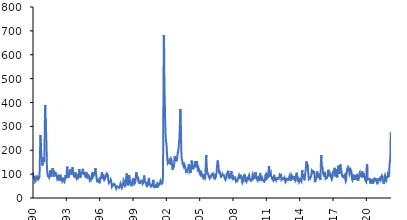
| Category | Índice |
|---|---|
| 1990-01-01 | 108.888 |
| 1990-01-02 | 107.41 |
| 1990-01-03 | 104.913 |
| 1990-01-04 | 101.838 |
| 1990-01-05 | 100.555 |
| 1990-01-06 | 100.528 |
| 1990-01-07 | 98.655 |
| 1990-01-08 | 98.989 |
| 1990-01-09 | 100.439 |
| 1990-01-10 | 100.368 |
| 1990-01-11 | 98.759 |
| 1990-01-12 | 98.669 |
| 1990-01-13 | 97.061 |
| 1990-01-14 | 95.389 |
| 1990-01-15 | 94.045 |
| 1990-01-16 | 92.8 |
| 1990-01-17 | 93.206 |
| 1990-01-18 | 90.599 |
| 1990-01-19 | 89.236 |
| 1990-01-20 | 86.482 |
| 1990-01-21 | 85.16 |
| 1990-01-22 | 84.007 |
| 1990-01-23 | 84.643 |
| 1990-01-24 | 83.991 |
| 1990-01-25 | 84.277 |
| 1990-01-26 | 84.188 |
| 1990-01-27 | 84.197 |
| 1990-01-28 | 82.541 |
| 1990-01-29 | 81.961 |
| 1990-01-30 | 82.99 |
| 1990-01-31 | 83.37 |
| 1990-02-01 | 83.561 |
| 1990-02-02 | 84.544 |
| 1990-02-03 | 86.52 |
| 1990-02-04 | 86.381 |
| 1990-02-05 | 87.983 |
| 1990-02-06 | 91.495 |
| 1990-02-07 | 91.184 |
| 1990-02-08 | 89.132 |
| 1990-02-09 | 88.004 |
| 1990-02-10 | 88.749 |
| 1990-02-11 | 88.25 |
| 1990-02-12 | 89.704 |
| 1990-02-13 | 89.977 |
| 1990-02-14 | 88.712 |
| 1990-02-15 | 88.406 |
| 1990-02-16 | 87.166 |
| 1990-02-17 | 87.312 |
| 1990-02-18 | 86.625 |
| 1990-02-19 | 87.193 |
| 1990-02-20 | 86.603 |
| 1990-02-21 | 86.388 |
| 1990-02-22 | 84.271 |
| 1990-02-23 | 83.254 |
| 1990-02-24 | 82.737 |
| 1990-02-25 | 81.87 |
| 1990-02-26 | 81.005 |
| 1990-02-27 | 83.451 |
| 1990-02-28 | 82.212 |
| 1990-03-01 | 81.337 |
| 1990-03-02 | 79.881 |
| 1990-03-03 | 78.446 |
| 1990-03-04 | 76.539 |
| 1990-03-05 | 75.167 |
| 1990-03-06 | 75.443 |
| 1990-03-07 | 74.192 |
| 1990-03-08 | 71.445 |
| 1990-03-09 | 70.327 |
| 1990-03-10 | 71.295 |
| 1990-03-11 | 70.455 |
| 1990-03-12 | 68.815 |
| 1990-03-13 | 69.386 |
| 1990-03-14 | 68.702 |
| 1990-03-15 | 67.928 |
| 1990-03-16 | 68.188 |
| 1990-03-17 | 68.685 |
| 1990-03-18 | 68.941 |
| 1990-03-19 | 68.688 |
| 1990-03-20 | 68.804 |
| 1990-03-21 | 67.771 |
| 1990-03-22 | 68.325 |
| 1990-03-23 | 67.422 |
| 1990-03-24 | 67.949 |
| 1990-03-25 | 68.957 |
| 1990-03-26 | 69.097 |
| 1990-03-27 | 69.89 |
| 1990-03-28 | 70.682 |
| 1990-03-29 | 69.19 |
| 1990-03-30 | 68.958 |
| 1990-03-31 | 70.704 |
| 1990-04-01 | 70.158 |
| 1990-04-02 | 73.422 |
| 1990-04-03 | 75.191 |
| 1990-04-04 | 75.59 |
| 1990-04-05 | 75.518 |
| 1990-04-06 | 76.008 |
| 1990-04-07 | 75.975 |
| 1990-04-08 | 75.326 |
| 1990-04-09 | 74.881 |
| 1990-04-10 | 76.383 |
| 1990-04-11 | 78.055 |
| 1990-04-12 | 78.141 |
| 1990-04-13 | 77.781 |
| 1990-04-14 | 79.164 |
| 1990-04-15 | 78.725 |
| 1990-04-16 | 78.929 |
| 1990-04-17 | 79.578 |
| 1990-04-18 | 80.737 |
| 1990-04-19 | 80.804 |
| 1990-04-20 | 82.924 |
| 1990-04-21 | 83.57 |
| 1990-04-22 | 85.28 |
| 1990-04-23 | 87.052 |
| 1990-04-24 | 87.251 |
| 1990-04-25 | 87.436 |
| 1990-04-26 | 88.024 |
| 1990-04-27 | 87.672 |
| 1990-04-28 | 87.759 |
| 1990-04-29 | 86.872 |
| 1990-04-30 | 84.691 |
| 1990-05-01 | 86.428 |
| 1990-05-02 | 87.079 |
| 1990-05-03 | 86.471 |
| 1990-05-04 | 86.835 |
| 1990-05-05 | 88.836 |
| 1990-05-06 | 87.506 |
| 1990-05-07 | 87.706 |
| 1990-05-08 | 88.491 |
| 1990-05-09 | 88.167 |
| 1990-05-10 | 87.384 |
| 1990-05-11 | 86.09 |
| 1990-05-12 | 84.584 |
| 1990-05-13 | 84.657 |
| 1990-05-14 | 84.476 |
| 1990-05-15 | 85.028 |
| 1990-05-16 | 85.713 |
| 1990-05-17 | 85.847 |
| 1990-05-18 | 84.95 |
| 1990-05-19 | 84.734 |
| 1990-05-20 | 82.827 |
| 1990-05-21 | 83.704 |
| 1990-05-22 | 83.857 |
| 1990-05-23 | 82.49 |
| 1990-05-24 | 83.213 |
| 1990-05-25 | 83.811 |
| 1990-05-26 | 83.866 |
| 1990-05-27 | 83.852 |
| 1990-05-28 | 85.695 |
| 1990-05-29 | 88.988 |
| 1990-05-30 | 90.612 |
| 1990-05-31 | 90.288 |
| 1990-06-01 | 88.062 |
| 1990-06-02 | 88.599 |
| 1990-06-03 | 88.045 |
| 1990-06-04 | 88.156 |
| 1990-06-05 | 89.708 |
| 1990-06-06 | 90.555 |
| 1990-06-07 | 91.1 |
| 1990-06-08 | 91.674 |
| 1990-06-09 | 92.383 |
| 1990-06-10 | 92.216 |
| 1990-06-11 | 92.507 |
| 1990-06-12 | 91.941 |
| 1990-06-13 | 91.258 |
| 1990-06-14 | 91.162 |
| 1990-06-15 | 89.927 |
| 1990-06-16 | 91.257 |
| 1990-06-17 | 90.814 |
| 1990-06-18 | 90.942 |
| 1990-06-19 | 90.664 |
| 1990-06-20 | 89.604 |
| 1990-06-21 | 88.773 |
| 1990-06-22 | 88.803 |
| 1990-06-23 | 89.433 |
| 1990-06-24 | 87.612 |
| 1990-06-25 | 86.231 |
| 1990-06-26 | 85.266 |
| 1990-06-27 | 83.956 |
| 1990-06-28 | 81.266 |
| 1990-06-29 | 81.395 |
| 1990-06-30 | 79.453 |
| 1990-07-01 | 79.619 |
| 1990-07-02 | 79.694 |
| 1990-07-03 | 81.252 |
| 1990-07-04 | 80.527 |
| 1990-07-05 | 80.068 |
| 1990-07-06 | 79.805 |
| 1990-07-07 | 81.898 |
| 1990-07-08 | 81.248 |
| 1990-07-09 | 80.202 |
| 1990-07-10 | 81.353 |
| 1990-07-11 | 82.132 |
| 1990-07-12 | 81.686 |
| 1990-07-13 | 81.727 |
| 1990-07-14 | 81.57 |
| 1990-07-15 | 81.203 |
| 1990-07-16 | 79.424 |
| 1990-07-17 | 78.849 |
| 1990-07-18 | 79.084 |
| 1990-07-19 | 79.631 |
| 1990-07-20 | 79.664 |
| 1990-07-21 | 80.957 |
| 1990-07-22 | 79.903 |
| 1990-07-23 | 79.552 |
| 1990-07-24 | 82.489 |
| 1990-07-25 | 84.811 |
| 1990-07-26 | 86.03 |
| 1990-07-27 | 85.32 |
| 1990-07-28 | 88.356 |
| 1990-07-29 | 87.033 |
| 1990-07-30 | 87.395 |
| 1990-07-31 | 88.76 |
| 1990-08-01 | 89.971 |
| 1990-08-02 | 89.36 |
| 1990-08-03 | 94.125 |
| 1990-08-04 | 98.387 |
| 1990-08-05 | 100.55 |
| 1990-08-06 | 104.374 |
| 1990-08-07 | 111.679 |
| 1990-08-08 | 120.63 |
| 1990-08-09 | 125.054 |
| 1990-08-10 | 130.204 |
| 1990-08-11 | 137.649 |
| 1990-08-12 | 142.137 |
| 1990-08-13 | 151.323 |
| 1990-08-14 | 161.894 |
| 1990-08-15 | 168.642 |
| 1990-08-16 | 173.748 |
| 1990-08-17 | 178.78 |
| 1990-08-18 | 184.345 |
| 1990-08-19 | 186.776 |
| 1990-08-20 | 191.094 |
| 1990-08-21 | 199.834 |
| 1990-08-22 | 207.727 |
| 1990-08-23 | 213.09 |
| 1990-08-24 | 218.012 |
| 1990-08-25 | 226.364 |
| 1990-08-26 | 230.697 |
| 1990-08-27 | 233.677 |
| 1990-08-28 | 240.632 |
| 1990-08-29 | 248.28 |
| 1990-08-30 | 250.135 |
| 1990-08-31 | 254.349 |
| 1990-09-01 | 259.432 |
| 1990-09-02 | 257.131 |
| 1990-09-03 | 258.662 |
| 1990-09-04 | 263.269 |
| 1990-09-05 | 263.858 |
| 1990-09-06 | 259.837 |
| 1990-09-07 | 256.058 |
| 1990-09-08 | 256.927 |
| 1990-09-09 | 254.21 |
| 1990-09-10 | 251.669 |
| 1990-09-11 | 250.891 |
| 1990-09-12 | 244.306 |
| 1990-09-13 | 235.978 |
| 1990-09-14 | 233.571 |
| 1990-09-15 | 236.36 |
| 1990-09-16 | 232.822 |
| 1990-09-17 | 230.669 |
| 1990-09-18 | 231.067 |
| 1990-09-19 | 230.129 |
| 1990-09-20 | 224.346 |
| 1990-09-21 | 218.618 |
| 1990-09-22 | 213.784 |
| 1990-09-23 | 209.185 |
| 1990-09-24 | 204.642 |
| 1990-09-25 | 206.99 |
| 1990-09-26 | 205.247 |
| 1990-09-27 | 201.497 |
| 1990-09-28 | 196.678 |
| 1990-09-29 | 195.995 |
| 1990-09-30 | 191.022 |
| 1990-10-01 | 189.418 |
| 1990-10-02 | 189.296 |
| 1990-10-03 | 184.958 |
| 1990-10-04 | 179.893 |
| 1990-10-05 | 176.692 |
| 1990-10-06 | 176.302 |
| 1990-10-07 | 173.024 |
| 1990-10-08 | 169.992 |
| 1990-10-09 | 170.384 |
| 1990-10-10 | 169.118 |
| 1990-10-11 | 166.356 |
| 1990-10-12 | 166.398 |
| 1990-10-13 | 167.752 |
| 1990-10-14 | 164.543 |
| 1990-10-15 | 160.898 |
| 1990-10-16 | 161.753 |
| 1990-10-17 | 160.01 |
| 1990-10-18 | 158.356 |
| 1990-10-19 | 156.78 |
| 1990-10-20 | 157.133 |
| 1990-10-21 | 155.508 |
| 1990-10-22 | 156.115 |
| 1990-10-23 | 156.503 |
| 1990-10-24 | 155.406 |
| 1990-10-25 | 149.924 |
| 1990-10-26 | 148.698 |
| 1990-10-27 | 147.52 |
| 1990-10-28 | 146.083 |
| 1990-10-29 | 145.463 |
| 1990-10-30 | 144.637 |
| 1990-10-31 | 143.308 |
| 1990-11-01 | 140.489 |
| 1990-11-02 | 140.319 |
| 1990-11-03 | 138.491 |
| 1990-11-04 | 135.831 |
| 1990-11-05 | 134.936 |
| 1990-11-06 | 138.865 |
| 1990-11-07 | 137.727 |
| 1990-11-08 | 136.763 |
| 1990-11-09 | 136.579 |
| 1990-11-10 | 139.652 |
| 1990-11-11 | 138.035 |
| 1990-11-12 | 137.703 |
| 1990-11-13 | 139.317 |
| 1990-11-14 | 140.408 |
| 1990-11-15 | 140.44 |
| 1990-11-16 | 141.38 |
| 1990-11-17 | 142.353 |
| 1990-11-18 | 140.939 |
| 1990-11-19 | 140.71 |
| 1990-11-20 | 142.068 |
| 1990-11-21 | 143.917 |
| 1990-11-22 | 142.944 |
| 1990-11-23 | 142.001 |
| 1990-11-24 | 145.842 |
| 1990-11-25 | 144.647 |
| 1990-11-26 | 146.535 |
| 1990-11-27 | 150.699 |
| 1990-11-28 | 152.173 |
| 1990-11-29 | 155.514 |
| 1990-11-30 | 155.135 |
| 1990-12-01 | 159.444 |
| 1990-12-02 | 158.778 |
| 1990-12-03 | 163.545 |
| 1990-12-04 | 167.11 |
| 1990-12-05 | 169.755 |
| 1990-12-06 | 167.82 |
| 1990-12-07 | 170.297 |
| 1990-12-08 | 172.686 |
| 1990-12-09 | 170.88 |
| 1990-12-10 | 169.331 |
| 1990-12-11 | 171.765 |
| 1990-12-12 | 170.33 |
| 1990-12-13 | 169.585 |
| 1990-12-14 | 167.422 |
| 1990-12-15 | 167.676 |
| 1990-12-16 | 165.871 |
| 1990-12-17 | 166.773 |
| 1990-12-18 | 168.805 |
| 1990-12-19 | 167.92 |
| 1990-12-20 | 166.815 |
| 1990-12-21 | 162.189 |
| 1990-12-22 | 165.289 |
| 1990-12-23 | 164.01 |
| 1990-12-24 | 159.775 |
| 1990-12-25 | 161.217 |
| 1990-12-26 | 162.591 |
| 1990-12-27 | 161.342 |
| 1990-12-28 | 158.55 |
| 1990-12-29 | 157.229 |
| 1990-12-30 | 155.134 |
| 1990-12-31 | 154.157 |
| 1991-01-01 | 156.688 |
| 1991-01-02 | 154.629 |
| 1991-01-03 | 153.135 |
| 1991-01-04 | 151.791 |
| 1991-01-05 | 154.468 |
| 1991-01-06 | 150.904 |
| 1991-01-07 | 152.765 |
| 1991-01-08 | 161.563 |
| 1991-01-09 | 166.57 |
| 1991-01-10 | 170.601 |
| 1991-01-11 | 179.217 |
| 1991-01-12 | 186.844 |
| 1991-01-13 | 190.141 |
| 1991-01-14 | 196.383 |
| 1991-01-15 | 211.914 |
| 1991-01-16 | 221.773 |
| 1991-01-17 | 234.695 |
| 1991-01-18 | 249.09 |
| 1991-01-19 | 257.772 |
| 1991-01-20 | 263.979 |
| 1991-01-21 | 272.418 |
| 1991-01-22 | 285.864 |
| 1991-01-23 | 296.976 |
| 1991-01-24 | 305.113 |
| 1991-01-25 | 311.71 |
| 1991-01-26 | 319.529 |
| 1991-01-27 | 325.117 |
| 1991-01-28 | 331.397 |
| 1991-01-29 | 343.023 |
| 1991-01-30 | 352.917 |
| 1991-01-31 | 358.199 |
| 1991-02-01 | 363.29 |
| 1991-02-02 | 368.68 |
| 1991-02-03 | 372.897 |
| 1991-02-04 | 374.876 |
| 1991-02-05 | 384.75 |
| 1991-02-06 | 389.402 |
| 1991-02-07 | 385.547 |
| 1991-02-08 | 387.621 |
| 1991-02-09 | 387.625 |
| 1991-02-10 | 381.881 |
| 1991-02-11 | 381.881 |
| 1991-02-12 | 383.405 |
| 1991-02-13 | 380.495 |
| 1991-02-14 | 371.234 |
| 1991-02-15 | 363.16 |
| 1991-02-16 | 353.78 |
| 1991-02-17 | 342.821 |
| 1991-02-18 | 341.998 |
| 1991-02-19 | 342.092 |
| 1991-02-20 | 336.266 |
| 1991-02-21 | 329.164 |
| 1991-02-22 | 325.409 |
| 1991-02-23 | 326.082 |
| 1991-02-24 | 321.539 |
| 1991-02-25 | 324.321 |
| 1991-02-26 | 327.445 |
| 1991-02-27 | 330.672 |
| 1991-02-28 | 323.834 |
| 1991-03-01 | 313.975 |
| 1991-03-02 | 309.706 |
| 1991-03-03 | 305.109 |
| 1991-03-04 | 301.824 |
| 1991-03-05 | 298.284 |
| 1991-03-06 | 294.369 |
| 1991-03-07 | 288.048 |
| 1991-03-08 | 279.02 |
| 1991-03-09 | 276.178 |
| 1991-03-10 | 269.37 |
| 1991-03-11 | 266.034 |
| 1991-03-12 | 265.826 |
| 1991-03-13 | 258.04 |
| 1991-03-14 | 251.402 |
| 1991-03-15 | 246.312 |
| 1991-03-16 | 242.048 |
| 1991-03-17 | 239.382 |
| 1991-03-18 | 236.995 |
| 1991-03-19 | 235.156 |
| 1991-03-20 | 227.367 |
| 1991-03-21 | 221.416 |
| 1991-03-22 | 216.044 |
| 1991-03-23 | 211.219 |
| 1991-03-24 | 203.24 |
| 1991-03-25 | 193.128 |
| 1991-03-26 | 187.388 |
| 1991-03-27 | 174.635 |
| 1991-03-28 | 165.776 |
| 1991-03-29 | 153.906 |
| 1991-03-30 | 149.16 |
| 1991-03-31 | 144.999 |
| 1991-04-01 | 140.599 |
| 1991-04-02 | 139.802 |
| 1991-04-03 | 137.34 |
| 1991-04-04 | 133.918 |
| 1991-04-05 | 131.056 |
| 1991-04-06 | 128.787 |
| 1991-04-07 | 127.756 |
| 1991-04-08 | 125.668 |
| 1991-04-09 | 123.665 |
| 1991-04-10 | 120.104 |
| 1991-04-11 | 116.471 |
| 1991-04-12 | 115.998 |
| 1991-04-13 | 115.368 |
| 1991-04-14 | 113.591 |
| 1991-04-15 | 112.53 |
| 1991-04-16 | 110.267 |
| 1991-04-17 | 107.371 |
| 1991-04-18 | 104.538 |
| 1991-04-19 | 103.422 |
| 1991-04-20 | 104.688 |
| 1991-04-21 | 102.75 |
| 1991-04-22 | 100.245 |
| 1991-04-23 | 99.564 |
| 1991-04-24 | 99.54 |
| 1991-04-25 | 97.63 |
| 1991-04-26 | 96.73 |
| 1991-04-27 | 96.195 |
| 1991-04-28 | 95.465 |
| 1991-04-29 | 95.43 |
| 1991-04-30 | 96.354 |
| 1991-05-01 | 97.747 |
| 1991-05-02 | 93.892 |
| 1991-05-03 | 91.185 |
| 1991-05-04 | 89.99 |
| 1991-05-05 | 88.508 |
| 1991-05-06 | 90.856 |
| 1991-05-07 | 92.22 |
| 1991-05-08 | 92.945 |
| 1991-05-09 | 92.056 |
| 1991-05-10 | 92.871 |
| 1991-05-11 | 92.869 |
| 1991-05-12 | 91.171 |
| 1991-05-13 | 92.64 |
| 1991-05-14 | 94.059 |
| 1991-05-15 | 92.715 |
| 1991-05-16 | 92.32 |
| 1991-05-17 | 90.23 |
| 1991-05-18 | 90.556 |
| 1991-05-19 | 89.003 |
| 1991-05-20 | 88.975 |
| 1991-05-21 | 89.099 |
| 1991-05-22 | 90.142 |
| 1991-05-23 | 91.61 |
| 1991-05-24 | 89.674 |
| 1991-05-25 | 90.551 |
| 1991-05-26 | 90.171 |
| 1991-05-27 | 90.905 |
| 1991-05-28 | 92.555 |
| 1991-05-29 | 91.12 |
| 1991-05-30 | 90.098 |
| 1991-05-31 | 90.056 |
| 1991-06-01 | 92.122 |
| 1991-06-02 | 92.058 |
| 1991-06-03 | 91.38 |
| 1991-06-04 | 93.162 |
| 1991-06-05 | 90.056 |
| 1991-06-06 | 87.98 |
| 1991-06-07 | 86.439 |
| 1991-06-08 | 88.106 |
| 1991-06-09 | 86.725 |
| 1991-06-10 | 87.303 |
| 1991-06-11 | 88.491 |
| 1991-06-12 | 88.092 |
| 1991-06-13 | 87.528 |
| 1991-06-14 | 87.369 |
| 1991-06-15 | 86.569 |
| 1991-06-16 | 86.408 |
| 1991-06-17 | 85.655 |
| 1991-06-18 | 86.875 |
| 1991-06-19 | 85.575 |
| 1991-06-20 | 85.165 |
| 1991-06-21 | 84.802 |
| 1991-06-22 | 82.634 |
| 1991-06-23 | 82.813 |
| 1991-06-24 | 82.16 |
| 1991-06-25 | 82.983 |
| 1991-06-26 | 81.838 |
| 1991-06-27 | 82.64 |
| 1991-06-28 | 85.265 |
| 1991-06-29 | 87.215 |
| 1991-06-30 | 86.096 |
| 1991-07-01 | 87.988 |
| 1991-07-02 | 89.568 |
| 1991-07-03 | 93.826 |
| 1991-07-04 | 95.651 |
| 1991-07-05 | 96.149 |
| 1991-07-06 | 99.139 |
| 1991-07-07 | 101.109 |
| 1991-07-08 | 103.037 |
| 1991-07-09 | 104.261 |
| 1991-07-10 | 105.07 |
| 1991-07-11 | 105.238 |
| 1991-07-12 | 105.56 |
| 1991-07-13 | 106.379 |
| 1991-07-14 | 107.041 |
| 1991-07-15 | 110.778 |
| 1991-07-16 | 113.038 |
| 1991-07-17 | 113.555 |
| 1991-07-18 | 113.559 |
| 1991-07-19 | 113.943 |
| 1991-07-20 | 114.218 |
| 1991-07-21 | 113.387 |
| 1991-07-22 | 115.394 |
| 1991-07-23 | 115.349 |
| 1991-07-24 | 116.352 |
| 1991-07-25 | 115.856 |
| 1991-07-26 | 116.777 |
| 1991-07-27 | 115.639 |
| 1991-07-28 | 113.42 |
| 1991-07-29 | 112.767 |
| 1991-07-30 | 113.397 |
| 1991-07-31 | 112.207 |
| 1991-08-01 | 111.575 |
| 1991-08-02 | 109.022 |
| 1991-08-03 | 106.429 |
| 1991-08-04 | 104.566 |
| 1991-08-05 | 101.646 |
| 1991-08-06 | 100.538 |
| 1991-08-07 | 98.34 |
| 1991-08-08 | 97.992 |
| 1991-08-09 | 98.157 |
| 1991-08-10 | 98.432 |
| 1991-08-11 | 97.419 |
| 1991-08-12 | 98.37 |
| 1991-08-13 | 97.573 |
| 1991-08-14 | 93.884 |
| 1991-08-15 | 91.9 |
| 1991-08-16 | 91.058 |
| 1991-08-17 | 91.309 |
| 1991-08-18 | 89.246 |
| 1991-08-19 | 89.004 |
| 1991-08-20 | 95.642 |
| 1991-08-21 | 98.738 |
| 1991-08-22 | 101.297 |
| 1991-08-23 | 103.634 |
| 1991-08-24 | 102.364 |
| 1991-08-25 | 101.164 |
| 1991-08-26 | 102.48 |
| 1991-08-27 | 104.627 |
| 1991-08-28 | 106.598 |
| 1991-08-29 | 107.622 |
| 1991-08-30 | 109.262 |
| 1991-08-31 | 108.993 |
| 1991-09-01 | 107.967 |
| 1991-09-02 | 109.04 |
| 1991-09-03 | 109.608 |
| 1991-09-04 | 110.73 |
| 1991-09-05 | 110.325 |
| 1991-09-06 | 110.85 |
| 1991-09-07 | 110.107 |
| 1991-09-08 | 108.825 |
| 1991-09-09 | 107.859 |
| 1991-09-10 | 109.212 |
| 1991-09-11 | 107.589 |
| 1991-09-12 | 108.544 |
| 1991-09-13 | 110.225 |
| 1991-09-14 | 112.987 |
| 1991-09-15 | 113.872 |
| 1991-09-16 | 115.856 |
| 1991-09-17 | 117.935 |
| 1991-09-18 | 119.128 |
| 1991-09-19 | 113.974 |
| 1991-09-20 | 111.868 |
| 1991-09-21 | 110.788 |
| 1991-09-22 | 108.428 |
| 1991-09-23 | 112.72 |
| 1991-09-24 | 115.518 |
| 1991-09-25 | 115.724 |
| 1991-09-26 | 116.713 |
| 1991-09-27 | 115.889 |
| 1991-09-28 | 117.145 |
| 1991-09-29 | 114.781 |
| 1991-09-30 | 116.281 |
| 1991-10-01 | 120.257 |
| 1991-10-02 | 119.598 |
| 1991-10-03 | 121.286 |
| 1991-10-04 | 122.746 |
| 1991-10-05 | 123.645 |
| 1991-10-06 | 122.002 |
| 1991-10-07 | 123.591 |
| 1991-10-08 | 125.627 |
| 1991-10-09 | 127.011 |
| 1991-10-10 | 125.2 |
| 1991-10-11 | 125.454 |
| 1991-10-12 | 125.429 |
| 1991-10-13 | 124.986 |
| 1991-10-14 | 121.218 |
| 1991-10-15 | 122.713 |
| 1991-10-16 | 120.148 |
| 1991-10-17 | 119.459 |
| 1991-10-18 | 118.565 |
| 1991-10-19 | 117.411 |
| 1991-10-20 | 115.683 |
| 1991-10-21 | 114.547 |
| 1991-10-22 | 115.19 |
| 1991-10-23 | 110.958 |
| 1991-10-24 | 108.476 |
| 1991-10-25 | 107.729 |
| 1991-10-26 | 104.959 |
| 1991-10-27 | 103.355 |
| 1991-10-28 | 100.393 |
| 1991-10-29 | 100.946 |
| 1991-10-30 | 100.248 |
| 1991-10-31 | 97.741 |
| 1991-11-01 | 96.307 |
| 1991-11-02 | 93.654 |
| 1991-11-03 | 91.685 |
| 1991-11-04 | 92.844 |
| 1991-11-05 | 93.954 |
| 1991-11-06 | 92.883 |
| 1991-11-07 | 89.413 |
| 1991-11-08 | 88.252 |
| 1991-11-09 | 89.868 |
| 1991-11-10 | 90.933 |
| 1991-11-11 | 91.372 |
| 1991-11-12 | 91.251 |
| 1991-11-13 | 93.118 |
| 1991-11-14 | 90.715 |
| 1991-11-15 | 91.21 |
| 1991-11-16 | 90.707 |
| 1991-11-17 | 90.424 |
| 1991-11-18 | 91.202 |
| 1991-11-19 | 92.531 |
| 1991-11-20 | 92.239 |
| 1991-11-21 | 92.869 |
| 1991-11-22 | 94.907 |
| 1991-11-23 | 96.643 |
| 1991-11-24 | 95.109 |
| 1991-11-25 | 95.662 |
| 1991-11-26 | 97.251 |
| 1991-11-27 | 97.584 |
| 1991-11-28 | 97.322 |
| 1991-11-29 | 98.115 |
| 1991-11-30 | 97.963 |
| 1991-12-01 | 98.396 |
| 1991-12-02 | 100.749 |
| 1991-12-03 | 102.048 |
| 1991-12-04 | 100.358 |
| 1991-12-05 | 98.964 |
| 1991-12-06 | 99.068 |
| 1991-12-07 | 100.305 |
| 1991-12-08 | 99.843 |
| 1991-12-09 | 99.602 |
| 1991-12-10 | 101.03 |
| 1991-12-11 | 100.369 |
| 1991-12-12 | 100.801 |
| 1991-12-13 | 101.208 |
| 1991-12-14 | 102.954 |
| 1991-12-15 | 103.352 |
| 1991-12-16 | 106.391 |
| 1991-12-17 | 107.652 |
| 1991-12-18 | 106.904 |
| 1991-12-19 | 105.785 |
| 1991-12-20 | 107.047 |
| 1991-12-21 | 106.469 |
| 1991-12-22 | 105.724 |
| 1991-12-23 | 104.566 |
| 1991-12-24 | 105.605 |
| 1991-12-25 | 105.289 |
| 1991-12-26 | 103.527 |
| 1991-12-27 | 103.489 |
| 1991-12-28 | 103.805 |
| 1991-12-29 | 102.102 |
| 1991-12-30 | 101.927 |
| 1991-12-31 | 104.054 |
| 1992-01-01 | 103.886 |
| 1992-01-02 | 103.303 |
| 1992-01-03 | 103.738 |
| 1992-01-04 | 105.715 |
| 1992-01-05 | 104.847 |
| 1992-01-06 | 105.647 |
| 1992-01-07 | 107.705 |
| 1992-01-08 | 107.958 |
| 1992-01-09 | 105.572 |
| 1992-01-10 | 105.158 |
| 1992-01-11 | 106.671 |
| 1992-01-12 | 106.249 |
| 1992-01-13 | 105.301 |
| 1992-01-14 | 105.876 |
| 1992-01-15 | 103.501 |
| 1992-01-16 | 102.08 |
| 1992-01-17 | 101.931 |
| 1992-01-18 | 102.344 |
| 1992-01-19 | 101.091 |
| 1992-01-20 | 101.981 |
| 1992-01-21 | 102.427 |
| 1992-01-22 | 101.998 |
| 1992-01-23 | 100.957 |
| 1992-01-24 | 101.839 |
| 1992-01-25 | 102.342 |
| 1992-01-26 | 101.455 |
| 1992-01-27 | 100.234 |
| 1992-01-28 | 100.657 |
| 1992-01-29 | 101.037 |
| 1992-01-30 | 101.226 |
| 1992-01-31 | 101.52 |
| 1992-02-01 | 101.119 |
| 1992-02-02 | 100.363 |
| 1992-02-03 | 99.512 |
| 1992-02-04 | 99.699 |
| 1992-02-05 | 99.122 |
| 1992-02-06 | 97.269 |
| 1992-02-07 | 96.989 |
| 1992-02-08 | 96.579 |
| 1992-02-09 | 96.603 |
| 1992-02-10 | 93.91 |
| 1992-02-11 | 93.322 |
| 1992-02-12 | 93.63 |
| 1992-02-13 | 92.067 |
| 1992-02-14 | 92.316 |
| 1992-02-15 | 93.375 |
| 1992-02-16 | 93.456 |
| 1992-02-17 | 91.568 |
| 1992-02-18 | 92.434 |
| 1992-02-19 | 92.004 |
| 1992-02-20 | 90.447 |
| 1992-02-21 | 90.393 |
| 1992-02-22 | 92.443 |
| 1992-02-23 | 91.75 |
| 1992-02-24 | 90.924 |
| 1992-02-25 | 91.842 |
| 1992-02-26 | 91.106 |
| 1992-02-27 | 89.091 |
| 1992-02-28 | 88.35 |
| 1992-02-29 | 86.365 |
| 1992-03-01 | 84.426 |
| 1992-03-02 | 83.109 |
| 1992-03-03 | 83.002 |
| 1992-03-04 | 81.685 |
| 1992-03-05 | 81.344 |
| 1992-03-06 | 80.036 |
| 1992-03-07 | 80.661 |
| 1992-03-08 | 78.99 |
| 1992-03-09 | 79.44 |
| 1992-03-10 | 79.217 |
| 1992-03-11 | 80.322 |
| 1992-03-12 | 80.251 |
| 1992-03-13 | 80.675 |
| 1992-03-14 | 80.371 |
| 1992-03-15 | 79.144 |
| 1992-03-16 | 79.003 |
| 1992-03-17 | 79.117 |
| 1992-03-18 | 80.155 |
| 1992-03-19 | 80.299 |
| 1992-03-20 | 80.64 |
| 1992-03-21 | 81.027 |
| 1992-03-22 | 80.835 |
| 1992-03-23 | 79.78 |
| 1992-03-24 | 79.207 |
| 1992-03-25 | 78.602 |
| 1992-03-26 | 78.537 |
| 1992-03-27 | 80.391 |
| 1992-03-28 | 82.269 |
| 1992-03-29 | 81.902 |
| 1992-03-30 | 83.467 |
| 1992-03-31 | 83.969 |
| 1992-04-01 | 86.199 |
| 1992-04-02 | 86.19 |
| 1992-04-03 | 86.251 |
| 1992-04-04 | 87.106 |
| 1992-04-05 | 87.504 |
| 1992-04-06 | 87.228 |
| 1992-04-07 | 88.785 |
| 1992-04-08 | 89.03 |
| 1992-04-09 | 88.591 |
| 1992-04-10 | 88.847 |
| 1992-04-11 | 89.289 |
| 1992-04-12 | 88.683 |
| 1992-04-13 | 89.095 |
| 1992-04-14 | 90.266 |
| 1992-04-15 | 91.143 |
| 1992-04-16 | 91.445 |
| 1992-04-17 | 92.846 |
| 1992-04-18 | 92.501 |
| 1992-04-19 | 90.007 |
| 1992-04-20 | 92.116 |
| 1992-04-21 | 93.555 |
| 1992-04-22 | 92.49 |
| 1992-04-23 | 91.921 |
| 1992-04-24 | 91.604 |
| 1992-04-25 | 92.008 |
| 1992-04-26 | 89.349 |
| 1992-04-27 | 89.176 |
| 1992-04-28 | 89.089 |
| 1992-04-29 | 86.766 |
| 1992-04-30 | 86.446 |
| 1992-05-01 | 84.238 |
| 1992-05-02 | 83.361 |
| 1992-05-03 | 83.459 |
| 1992-05-04 | 83.678 |
| 1992-05-05 | 83.359 |
| 1992-05-06 | 83.552 |
| 1992-05-07 | 83.187 |
| 1992-05-08 | 81.08 |
| 1992-05-09 | 81.115 |
| 1992-05-10 | 79.237 |
| 1992-05-11 | 78.637 |
| 1992-05-12 | 79.46 |
| 1992-05-13 | 78.607 |
| 1992-05-14 | 76.773 |
| 1992-05-15 | 74.82 |
| 1992-05-16 | 74.173 |
| 1992-05-17 | 72.05 |
| 1992-05-18 | 72.727 |
| 1992-05-19 | 73.777 |
| 1992-05-20 | 72.157 |
| 1992-05-21 | 70.719 |
| 1992-05-22 | 71.005 |
| 1992-05-23 | 72.05 |
| 1992-05-24 | 72.75 |
| 1992-05-25 | 74.276 |
| 1992-05-26 | 77.585 |
| 1992-05-27 | 77.307 |
| 1992-05-28 | 78.031 |
| 1992-05-29 | 78.16 |
| 1992-05-30 | 78.598 |
| 1992-05-31 | 79.704 |
| 1992-06-01 | 80.515 |
| 1992-06-02 | 80.042 |
| 1992-06-03 | 82.399 |
| 1992-06-04 | 84.292 |
| 1992-06-05 | 85.855 |
| 1992-06-06 | 86.492 |
| 1992-06-07 | 87.433 |
| 1992-06-08 | 87.021 |
| 1992-06-09 | 90.037 |
| 1992-06-10 | 90.564 |
| 1992-06-11 | 89.883 |
| 1992-06-12 | 90.391 |
| 1992-06-13 | 93.058 |
| 1992-06-14 | 93.512 |
| 1992-06-15 | 94.809 |
| 1992-06-16 | 97.231 |
| 1992-06-17 | 96.518 |
| 1992-06-18 | 96.924 |
| 1992-06-19 | 96.716 |
| 1992-06-20 | 97.114 |
| 1992-06-21 | 97.544 |
| 1992-06-22 | 97.074 |
| 1992-06-23 | 97.428 |
| 1992-06-24 | 96.341 |
| 1992-06-25 | 93.321 |
| 1992-06-26 | 92.105 |
| 1992-06-27 | 92.182 |
| 1992-06-28 | 92.551 |
| 1992-06-29 | 92.83 |
| 1992-06-30 | 91.85 |
| 1992-07-01 | 91.559 |
| 1992-07-02 | 91.463 |
| 1992-07-03 | 89.81 |
| 1992-07-04 | 88.307 |
| 1992-07-05 | 87.089 |
| 1992-07-06 | 86.1 |
| 1992-07-07 | 87.05 |
| 1992-07-08 | 89.346 |
| 1992-07-09 | 87.343 |
| 1992-07-10 | 86.687 |
| 1992-07-11 | 85.94 |
| 1992-07-12 | 84.251 |
| 1992-07-13 | 82.051 |
| 1992-07-14 | 83.168 |
| 1992-07-15 | 80.567 |
| 1992-07-16 | 78.993 |
| 1992-07-17 | 77.905 |
| 1992-07-18 | 76.323 |
| 1992-07-19 | 75.093 |
| 1992-07-20 | 74.562 |
| 1992-07-21 | 73.647 |
| 1992-07-22 | 73.7 |
| 1992-07-23 | 74.768 |
| 1992-07-24 | 74.42 |
| 1992-07-25 | 75.96 |
| 1992-07-26 | 76.945 |
| 1992-07-27 | 76.661 |
| 1992-07-28 | 77.165 |
| 1992-07-29 | 75.959 |
| 1992-07-30 | 75.114 |
| 1992-07-31 | 74.968 |
| 1992-08-01 | 75.449 |
| 1992-08-02 | 73.589 |
| 1992-08-03 | 73.411 |
| 1992-08-04 | 72.807 |
| 1992-08-05 | 72.527 |
| 1992-08-06 | 70.795 |
| 1992-08-07 | 69.354 |
| 1992-08-08 | 68.916 |
| 1992-08-09 | 68.618 |
| 1992-08-10 | 70.559 |
| 1992-08-11 | 74.726 |
| 1992-08-12 | 75.585 |
| 1992-08-13 | 74.373 |
| 1992-08-14 | 76.81 |
| 1992-08-15 | 76.492 |
| 1992-08-16 | 76.728 |
| 1992-08-17 | 79.178 |
| 1992-08-18 | 79.538 |
| 1992-08-19 | 79.771 |
| 1992-08-20 | 80.94 |
| 1992-08-21 | 80.128 |
| 1992-08-22 | 78.242 |
| 1992-08-23 | 75.467 |
| 1992-08-24 | 74.518 |
| 1992-08-25 | 76.033 |
| 1992-08-26 | 75.912 |
| 1992-08-27 | 77.553 |
| 1992-08-28 | 78.068 |
| 1992-08-29 | 80.428 |
| 1992-08-30 | 80.34 |
| 1992-08-31 | 81.711 |
| 1992-09-01 | 82.313 |
| 1992-09-02 | 82.498 |
| 1992-09-03 | 82.32 |
| 1992-09-04 | 83.386 |
| 1992-09-05 | 84.907 |
| 1992-09-06 | 83.85 |
| 1992-09-07 | 84.314 |
| 1992-09-08 | 85.391 |
| 1992-09-09 | 84.25 |
| 1992-09-10 | 81.187 |
| 1992-09-11 | 80.403 |
| 1992-09-12 | 80.887 |
| 1992-09-13 | 79.676 |
| 1992-09-14 | 80.472 |
| 1992-09-15 | 81.443 |
| 1992-09-16 | 80.198 |
| 1992-09-17 | 80.012 |
| 1992-09-18 | 80.779 |
| 1992-09-19 | 79.914 |
| 1992-09-20 | 80.374 |
| 1992-09-21 | 81.298 |
| 1992-09-22 | 84.013 |
| 1992-09-23 | 83.343 |
| 1992-09-24 | 81.524 |
| 1992-09-25 | 80.322 |
| 1992-09-26 | 78.75 |
| 1992-09-27 | 76.995 |
| 1992-09-28 | 76.914 |
| 1992-09-29 | 77.081 |
| 1992-09-30 | 76.46 |
| 1992-10-01 | 75.83 |
| 1992-10-02 | 75.902 |
| 1992-10-03 | 76.354 |
| 1992-10-04 | 74.93 |
| 1992-10-05 | 73.586 |
| 1992-10-06 | 72.806 |
| 1992-10-07 | 71.814 |
| 1992-10-08 | 71.405 |
| 1992-10-09 | 70.517 |
| 1992-10-10 | 70.357 |
| 1992-10-11 | 70.626 |
| 1992-10-12 | 72.328 |
| 1992-10-13 | 72.758 |
| 1992-10-14 | 71.589 |
| 1992-10-15 | 70.344 |
| 1992-10-16 | 70.219 |
| 1992-10-17 | 70.101 |
| 1992-10-18 | 69.112 |
| 1992-10-19 | 69.087 |
| 1992-10-20 | 69.087 |
| 1992-10-21 | 68.357 |
| 1992-10-22 | 67.63 |
| 1992-10-23 | 69.133 |
| 1992-10-24 | 69.053 |
| 1992-10-25 | 68.627 |
| 1992-10-26 | 67.836 |
| 1992-10-27 | 69.492 |
| 1992-10-28 | 69.15 |
| 1992-10-29 | 68.474 |
| 1992-10-30 | 67.152 |
| 1992-10-31 | 68.28 |
| 1992-11-01 | 67.549 |
| 1992-11-02 | 67.021 |
| 1992-11-03 | 67.829 |
| 1992-11-04 | 67.959 |
| 1992-11-05 | 68.63 |
| 1992-11-06 | 70.049 |
| 1992-11-07 | 69.888 |
| 1992-11-08 | 70.884 |
| 1992-11-09 | 74.735 |
| 1992-11-10 | 77.277 |
| 1992-11-11 | 77.413 |
| 1992-11-12 | 76.629 |
| 1992-11-13 | 77.57 |
| 1992-11-14 | 78.492 |
| 1992-11-15 | 77.768 |
| 1992-11-16 | 80.402 |
| 1992-11-17 | 81.403 |
| 1992-11-18 | 81.731 |
| 1992-11-19 | 82.507 |
| 1992-11-20 | 83.162 |
| 1992-11-21 | 83.213 |
| 1992-11-22 | 82.11 |
| 1992-11-23 | 85.007 |
| 1992-11-24 | 87.757 |
| 1992-11-25 | 88.548 |
| 1992-11-26 | 89.161 |
| 1992-11-27 | 88.003 |
| 1992-11-28 | 89.702 |
| 1992-11-29 | 91.107 |
| 1992-11-30 | 93.006 |
| 1992-12-01 | 96.023 |
| 1992-12-02 | 96.368 |
| 1992-12-03 | 95.726 |
| 1992-12-04 | 97.277 |
| 1992-12-05 | 99.22 |
| 1992-12-06 | 97.804 |
| 1992-12-07 | 98.042 |
| 1992-12-08 | 99.092 |
| 1992-12-09 | 96.453 |
| 1992-12-10 | 92.804 |
| 1992-12-11 | 90.483 |
| 1992-12-12 | 90.684 |
| 1992-12-13 | 90.059 |
| 1992-12-14 | 89.936 |
| 1992-12-15 | 89.537 |
| 1992-12-16 | 88.115 |
| 1992-12-17 | 87.737 |
| 1992-12-18 | 86.74 |
| 1992-12-19 | 86.953 |
| 1992-12-20 | 86.623 |
| 1992-12-21 | 86.227 |
| 1992-12-22 | 88.363 |
| 1992-12-23 | 87.471 |
| 1992-12-24 | 86.424 |
| 1992-12-25 | 86.032 |
| 1992-12-26 | 83.488 |
| 1992-12-27 | 84.047 |
| 1992-12-28 | 83.83 |
| 1992-12-29 | 84.299 |
| 1992-12-30 | 84.141 |
| 1992-12-31 | 82.322 |
| 1993-01-01 | 83.704 |
| 1993-01-02 | 85.395 |
| 1993-01-03 | 84.268 |
| 1993-01-04 | 84.582 |
| 1993-01-05 | 86.896 |
| 1993-01-06 | 87.143 |
| 1993-01-07 | 87.983 |
| 1993-01-08 | 89.543 |
| 1993-01-09 | 93.567 |
| 1993-01-10 | 93.785 |
| 1993-01-11 | 96.717 |
| 1993-01-12 | 99.815 |
| 1993-01-13 | 101.463 |
| 1993-01-14 | 108.414 |
| 1993-01-15 | 111.579 |
| 1993-01-16 | 113.047 |
| 1993-01-17 | 114.67 |
| 1993-01-18 | 117.218 |
| 1993-01-19 | 120.577 |
| 1993-01-20 | 121.378 |
| 1993-01-21 | 120.561 |
| 1993-01-22 | 120.286 |
| 1993-01-23 | 121.474 |
| 1993-01-24 | 121.029 |
| 1993-01-25 | 126.575 |
| 1993-01-26 | 128.897 |
| 1993-01-27 | 128.275 |
| 1993-01-28 | 128.494 |
| 1993-01-29 | 127.491 |
| 1993-01-30 | 128.243 |
| 1993-01-31 | 128.137 |
| 1993-02-01 | 128.861 |
| 1993-02-02 | 131.612 |
| 1993-02-03 | 132.194 |
| 1993-02-04 | 131.466 |
| 1993-02-05 | 131.973 |
| 1993-02-06 | 129.945 |
| 1993-02-07 | 127.628 |
| 1993-02-08 | 124.873 |
| 1993-02-09 | 125.971 |
| 1993-02-10 | 123.779 |
| 1993-02-11 | 122.156 |
| 1993-02-12 | 121.423 |
| 1993-02-13 | 114.345 |
| 1993-02-14 | 110.731 |
| 1993-02-15 | 109.045 |
| 1993-02-16 | 108.361 |
| 1993-02-17 | 104.541 |
| 1993-02-18 | 102.178 |
| 1993-02-19 | 101.989 |
| 1993-02-20 | 100.302 |
| 1993-02-21 | 98.365 |
| 1993-02-22 | 96.741 |
| 1993-02-23 | 97.216 |
| 1993-02-24 | 94.355 |
| 1993-02-25 | 93.6 |
| 1993-02-26 | 93.975 |
| 1993-02-27 | 93.076 |
| 1993-02-28 | 91.57 |
| 1993-03-01 | 91.345 |
| 1993-03-02 | 90.071 |
| 1993-03-03 | 87.634 |
| 1993-03-04 | 84.345 |
| 1993-03-05 | 81.918 |
| 1993-03-06 | 81.361 |
| 1993-03-07 | 80.359 |
| 1993-03-08 | 80.463 |
| 1993-03-09 | 82.765 |
| 1993-03-10 | 82.859 |
| 1993-03-11 | 82.428 |
| 1993-03-12 | 83.9 |
| 1993-03-13 | 83.519 |
| 1993-03-14 | 82.092 |
| 1993-03-15 | 82.524 |
| 1993-03-16 | 83.326 |
| 1993-03-17 | 85.224 |
| 1993-03-18 | 85.41 |
| 1993-03-19 | 87.314 |
| 1993-03-20 | 86.237 |
| 1993-03-21 | 85.396 |
| 1993-03-22 | 87.645 |
| 1993-03-23 | 90.277 |
| 1993-03-24 | 90.442 |
| 1993-03-25 | 91.063 |
| 1993-03-26 | 92.886 |
| 1993-03-27 | 92.771 |
| 1993-03-28 | 91.726 |
| 1993-03-29 | 91.622 |
| 1993-03-30 | 93.668 |
| 1993-03-31 | 93.198 |
| 1993-04-01 | 93.943 |
| 1993-04-02 | 95.358 |
| 1993-04-03 | 97.214 |
| 1993-04-04 | 98.248 |
| 1993-04-05 | 99.419 |
| 1993-04-06 | 99.788 |
| 1993-04-07 | 100.621 |
| 1993-04-08 | 101.309 |
| 1993-04-09 | 102.724 |
| 1993-04-10 | 102.141 |
| 1993-04-11 | 100.854 |
| 1993-04-12 | 102.203 |
| 1993-04-13 | 104.513 |
| 1993-04-14 | 107.18 |
| 1993-04-15 | 108.501 |
| 1993-04-16 | 107.592 |
| 1993-04-17 | 109.116 |
| 1993-04-18 | 108.171 |
| 1993-04-19 | 110.731 |
| 1993-04-20 | 112.676 |
| 1993-04-21 | 111.863 |
| 1993-04-22 | 110.748 |
| 1993-04-23 | 111.074 |
| 1993-04-24 | 111.221 |
| 1993-04-25 | 109.45 |
| 1993-04-26 | 109.738 |
| 1993-04-27 | 112.128 |
| 1993-04-28 | 113.031 |
| 1993-04-29 | 112.357 |
| 1993-04-30 | 113.779 |
| 1993-05-01 | 113.482 |
| 1993-05-02 | 113.185 |
| 1993-05-03 | 114.263 |
| 1993-05-04 | 116.306 |
| 1993-05-05 | 115.972 |
| 1993-05-06 | 117.539 |
| 1993-05-07 | 119.841 |
| 1993-05-08 | 118.691 |
| 1993-05-09 | 117.61 |
| 1993-05-10 | 119.244 |
| 1993-05-11 | 119.667 |
| 1993-05-12 | 118.749 |
| 1993-05-13 | 117.741 |
| 1993-05-14 | 117.241 |
| 1993-05-15 | 115.65 |
| 1993-05-16 | 114.446 |
| 1993-05-17 | 115.789 |
| 1993-05-18 | 117.606 |
| 1993-05-19 | 116.152 |
| 1993-05-20 | 114.276 |
| 1993-05-21 | 113.681 |
| 1993-05-22 | 114.221 |
| 1993-05-23 | 113.753 |
| 1993-05-24 | 114.402 |
| 1993-05-25 | 115.39 |
| 1993-05-26 | 115.744 |
| 1993-05-27 | 113.573 |
| 1993-05-28 | 112.083 |
| 1993-05-29 | 110.746 |
| 1993-05-30 | 109.346 |
| 1993-05-31 | 110.594 |
| 1993-06-01 | 112.545 |
| 1993-06-02 | 109.186 |
| 1993-06-03 | 105.951 |
| 1993-06-04 | 105.796 |
| 1993-06-05 | 106.641 |
| 1993-06-06 | 102.449 |
| 1993-06-07 | 102.117 |
| 1993-06-08 | 102.47 |
| 1993-06-09 | 101.566 |
| 1993-06-10 | 100.398 |
| 1993-06-11 | 99.303 |
| 1993-06-12 | 99.746 |
| 1993-06-13 | 97.507 |
| 1993-06-14 | 96.742 |
| 1993-06-15 | 97.405 |
| 1993-06-16 | 95.847 |
| 1993-06-17 | 94.469 |
| 1993-06-18 | 94.532 |
| 1993-06-19 | 95.276 |
| 1993-06-20 | 95.256 |
| 1993-06-21 | 94.471 |
| 1993-06-22 | 96.68 |
| 1993-06-23 | 97.285 |
| 1993-06-24 | 96.488 |
| 1993-06-25 | 96.179 |
| 1993-06-26 | 99.032 |
| 1993-06-27 | 99.126 |
| 1993-06-28 | 103.191 |
| 1993-06-29 | 105.806 |
| 1993-06-30 | 105.138 |
| 1993-07-01 | 103.594 |
| 1993-07-02 | 106.713 |
| 1993-07-03 | 109.837 |
| 1993-07-04 | 109.858 |
| 1993-07-05 | 109.547 |
| 1993-07-06 | 112.172 |
| 1993-07-07 | 113.794 |
| 1993-07-08 | 114.049 |
| 1993-07-09 | 114.353 |
| 1993-07-10 | 116.698 |
| 1993-07-11 | 118.457 |
| 1993-07-12 | 120.399 |
| 1993-07-13 | 123.076 |
| 1993-07-14 | 125.176 |
| 1993-07-15 | 126.443 |
| 1993-07-16 | 126.469 |
| 1993-07-17 | 128.563 |
| 1993-07-18 | 127.485 |
| 1993-07-19 | 129.214 |
| 1993-07-20 | 131.72 |
| 1993-07-21 | 132.432 |
| 1993-07-22 | 131.041 |
| 1993-07-23 | 129.918 |
| 1993-07-24 | 130.185 |
| 1993-07-25 | 127.875 |
| 1993-07-26 | 127.188 |
| 1993-07-27 | 128.856 |
| 1993-07-28 | 127.81 |
| 1993-07-29 | 126.108 |
| 1993-07-30 | 125.125 |
| 1993-07-31 | 125.553 |
| 1993-08-01 | 123.431 |
| 1993-08-02 | 122.029 |
| 1993-08-03 | 122.479 |
| 1993-08-04 | 121.075 |
| 1993-08-05 | 119.208 |
| 1993-08-06 | 116.474 |
| 1993-08-07 | 116.184 |
| 1993-08-08 | 114.609 |
| 1993-08-09 | 112.372 |
| 1993-08-10 | 111.828 |
| 1993-08-11 | 108.474 |
| 1993-08-12 | 106.817 |
| 1993-08-13 | 105.468 |
| 1993-08-14 | 104.217 |
| 1993-08-15 | 101.231 |
| 1993-08-16 | 99.635 |
| 1993-08-17 | 100.211 |
| 1993-08-18 | 99.058 |
| 1993-08-19 | 97.231 |
| 1993-08-20 | 96.559 |
| 1993-08-21 | 97.207 |
| 1993-08-22 | 95.717 |
| 1993-08-23 | 95.905 |
| 1993-08-24 | 96.804 |
| 1993-08-25 | 97.034 |
| 1993-08-26 | 98.214 |
| 1993-08-27 | 97.978 |
| 1993-08-28 | 98.038 |
| 1993-08-29 | 98.342 |
| 1993-08-30 | 97.704 |
| 1993-08-31 | 96.915 |
| 1993-09-01 | 95.406 |
| 1993-09-02 | 93.783 |
| 1993-09-03 | 93.918 |
| 1993-09-04 | 93.771 |
| 1993-09-05 | 94.109 |
| 1993-09-06 | 93.734 |
| 1993-09-07 | 95.665 |
| 1993-09-08 | 95.339 |
| 1993-09-09 | 94.884 |
| 1993-09-10 | 95.845 |
| 1993-09-11 | 96.008 |
| 1993-09-12 | 95.153 |
| 1993-09-13 | 94.58 |
| 1993-09-14 | 96.463 |
| 1993-09-15 | 94.805 |
| 1993-09-16 | 95.921 |
| 1993-09-17 | 94.936 |
| 1993-09-18 | 94.675 |
| 1993-09-19 | 94.786 |
| 1993-09-20 | 94.324 |
| 1993-09-21 | 95.052 |
| 1993-09-22 | 94.745 |
| 1993-09-23 | 95.197 |
| 1993-09-24 | 93.041 |
| 1993-09-25 | 90.454 |
| 1993-09-26 | 86.912 |
| 1993-09-27 | 85.726 |
| 1993-09-28 | 87.6 |
| 1993-09-29 | 86.974 |
| 1993-09-30 | 88.075 |
| 1993-10-01 | 91.163 |
| 1993-10-02 | 92.06 |
| 1993-10-03 | 90.406 |
| 1993-10-04 | 91.733 |
| 1993-10-05 | 93.243 |
| 1993-10-06 | 93.549 |
| 1993-10-07 | 92.634 |
| 1993-10-08 | 93.945 |
| 1993-10-09 | 94.055 |
| 1993-10-10 | 92.741 |
| 1993-10-11 | 91.883 |
| 1993-10-12 | 94 |
| 1993-10-13 | 95.948 |
| 1993-10-14 | 96.553 |
| 1993-10-15 | 97.678 |
| 1993-10-16 | 96.813 |
| 1993-10-17 | 97.295 |
| 1993-10-18 | 98.447 |
| 1993-10-19 | 100.137 |
| 1993-10-20 | 101.397 |
| 1993-10-21 | 101.311 |
| 1993-10-22 | 101.748 |
| 1993-10-23 | 101.537 |
| 1993-10-24 | 102.375 |
| 1993-10-25 | 105.181 |
| 1993-10-26 | 108.402 |
| 1993-10-27 | 108.953 |
| 1993-10-28 | 106.911 |
| 1993-10-29 | 107.779 |
| 1993-10-30 | 107.6 |
| 1993-10-31 | 104.008 |
| 1993-11-01 | 104.462 |
| 1993-11-02 | 105.177 |
| 1993-11-03 | 104.804 |
| 1993-11-04 | 103.05 |
| 1993-11-05 | 102.244 |
| 1993-11-06 | 103.263 |
| 1993-11-07 | 103.327 |
| 1993-11-08 | 102.852 |
| 1993-11-09 | 103.434 |
| 1993-11-10 | 103.354 |
| 1993-11-11 | 102.258 |
| 1993-11-12 | 99.702 |
| 1993-11-13 | 98.269 |
| 1993-11-14 | 96.755 |
| 1993-11-15 | 95.821 |
| 1993-11-16 | 95.172 |
| 1993-11-17 | 95.299 |
| 1993-11-18 | 93.377 |
| 1993-11-19 | 92.283 |
| 1993-11-20 | 91.448 |
| 1993-11-21 | 89.664 |
| 1993-11-22 | 89.14 |
| 1993-11-23 | 88.924 |
| 1993-11-24 | 86.145 |
| 1993-11-25 | 83.628 |
| 1993-11-26 | 82.66 |
| 1993-11-27 | 83.317 |
| 1993-11-28 | 81.568 |
| 1993-11-29 | 81.709 |
| 1993-11-30 | 83.57 |
| 1993-12-01 | 83.019 |
| 1993-12-02 | 82.011 |
| 1993-12-03 | 80.876 |
| 1993-12-04 | 81.413 |
| 1993-12-05 | 81.136 |
| 1993-12-06 | 79.413 |
| 1993-12-07 | 78.244 |
| 1993-12-08 | 79.362 |
| 1993-12-09 | 79.492 |
| 1993-12-10 | 80.813 |
| 1993-12-11 | 79.763 |
| 1993-12-12 | 79.449 |
| 1993-12-13 | 79.07 |
| 1993-12-14 | 80.907 |
| 1993-12-15 | 81.283 |
| 1993-12-16 | 81.602 |
| 1993-12-17 | 81.03 |
| 1993-12-18 | 80.453 |
| 1993-12-19 | 78.295 |
| 1993-12-20 | 79.262 |
| 1993-12-21 | 80.33 |
| 1993-12-22 | 79.662 |
| 1993-12-23 | 79.068 |
| 1993-12-24 | 79.725 |
| 1993-12-25 | 81 |
| 1993-12-26 | 81.629 |
| 1993-12-27 | 81.569 |
| 1993-12-28 | 83.501 |
| 1993-12-29 | 83.245 |
| 1993-12-30 | 80.542 |
| 1993-12-31 | 81.478 |
| 1994-01-01 | 82.652 |
| 1994-01-02 | 81.988 |
| 1994-01-03 | 81.618 |
| 1994-01-04 | 83.34 |
| 1994-01-05 | 84.512 |
| 1994-01-06 | 86.241 |
| 1994-01-07 | 85.68 |
| 1994-01-08 | 86.666 |
| 1994-01-09 | 85.378 |
| 1994-01-10 | 85.917 |
| 1994-01-11 | 88.047 |
| 1994-01-12 | 89.866 |
| 1994-01-13 | 89.068 |
| 1994-01-14 | 89.467 |
| 1994-01-15 | 89.932 |
| 1994-01-16 | 88.54 |
| 1994-01-17 | 88.579 |
| 1994-01-18 | 90.439 |
| 1994-01-19 | 90.12 |
| 1994-01-20 | 87.865 |
| 1994-01-21 | 88.078 |
| 1994-01-22 | 87.985 |
| 1994-01-23 | 86.194 |
| 1994-01-24 | 86.141 |
| 1994-01-25 | 86.443 |
| 1994-01-26 | 85.485 |
| 1994-01-27 | 84.636 |
| 1994-01-28 | 85.338 |
| 1994-01-29 | 86.123 |
| 1994-01-30 | 83.662 |
| 1994-01-31 | 83.975 |
| 1994-02-01 | 84.49 |
| 1994-02-02 | 84.734 |
| 1994-02-03 | 84.01 |
| 1994-02-04 | 84.103 |
| 1994-02-05 | 83.144 |
| 1994-02-06 | 82.783 |
| 1994-02-07 | 82.883 |
| 1994-02-08 | 86.814 |
| 1994-02-09 | 88.547 |
| 1994-02-10 | 88.873 |
| 1994-02-11 | 89.359 |
| 1994-02-12 | 89.778 |
| 1994-02-13 | 89.408 |
| 1994-02-14 | 91.813 |
| 1994-02-15 | 94.645 |
| 1994-02-16 | 98.582 |
| 1994-02-17 | 100.52 |
| 1994-02-18 | 101.552 |
| 1994-02-19 | 106.015 |
| 1994-02-20 | 108.482 |
| 1994-02-21 | 111.429 |
| 1994-02-22 | 114.673 |
| 1994-02-23 | 114.853 |
| 1994-02-24 | 115.341 |
| 1994-02-25 | 115.349 |
| 1994-02-26 | 116.004 |
| 1994-02-27 | 115.468 |
| 1994-02-28 | 116.695 |
| 1994-03-01 | 118.326 |
| 1994-03-02 | 119.013 |
| 1994-03-03 | 119.685 |
| 1994-03-04 | 121.093 |
| 1994-03-05 | 121.779 |
| 1994-03-06 | 119.904 |
| 1994-03-07 | 120.581 |
| 1994-03-08 | 120.832 |
| 1994-03-09 | 120.438 |
| 1994-03-10 | 118.625 |
| 1994-03-11 | 117.943 |
| 1994-03-12 | 115.397 |
| 1994-03-13 | 113.148 |
| 1994-03-14 | 112.306 |
| 1994-03-15 | 111.729 |
| 1994-03-16 | 109.469 |
| 1994-03-17 | 107.41 |
| 1994-03-18 | 104.695 |
| 1994-03-19 | 101.969 |
| 1994-03-20 | 102.455 |
| 1994-03-21 | 100.799 |
| 1994-03-22 | 100.871 |
| 1994-03-23 | 99.256 |
| 1994-03-24 | 97.634 |
| 1994-03-25 | 96.399 |
| 1994-03-26 | 94.854 |
| 1994-03-27 | 94.339 |
| 1994-03-28 | 94.816 |
| 1994-03-29 | 94 |
| 1994-03-30 | 93.18 |
| 1994-03-31 | 93.375 |
| 1994-04-01 | 92.787 |
| 1994-04-02 | 92.213 |
| 1994-04-03 | 90.13 |
| 1994-04-04 | 88.806 |
| 1994-04-05 | 90.159 |
| 1994-04-06 | 88.673 |
| 1994-04-07 | 87.345 |
| 1994-04-08 | 87.082 |
| 1994-04-09 | 84.59 |
| 1994-04-10 | 82.845 |
| 1994-04-11 | 84.698 |
| 1994-04-12 | 86.017 |
| 1994-04-13 | 86.55 |
| 1994-04-14 | 86.994 |
| 1994-04-15 | 88.275 |
| 1994-04-16 | 88.106 |
| 1994-04-17 | 86.417 |
| 1994-04-18 | 88.217 |
| 1994-04-19 | 87.545 |
| 1994-04-20 | 88.85 |
| 1994-04-21 | 87.819 |
| 1994-04-22 | 89.295 |
| 1994-04-23 | 90.07 |
| 1994-04-24 | 90.494 |
| 1994-04-25 | 92.537 |
| 1994-04-26 | 93.823 |
| 1994-04-27 | 93.267 |
| 1994-04-28 | 94.41 |
| 1994-04-29 | 95.569 |
| 1994-04-30 | 94.699 |
| 1994-05-01 | 93.711 |
| 1994-05-02 | 94.75 |
| 1994-05-03 | 96.765 |
| 1994-05-04 | 98.803 |
| 1994-05-05 | 98.957 |
| 1994-05-06 | 102.249 |
| 1994-05-07 | 103.111 |
| 1994-05-08 | 103.688 |
| 1994-05-09 | 106.613 |
| 1994-05-10 | 108.6 |
| 1994-05-11 | 107.833 |
| 1994-05-12 | 107.746 |
| 1994-05-13 | 109.4 |
| 1994-05-14 | 109.702 |
| 1994-05-15 | 107.885 |
| 1994-05-16 | 108.742 |
| 1994-05-17 | 109.92 |
| 1994-05-18 | 108.713 |
| 1994-05-19 | 107.467 |
| 1994-05-20 | 105.142 |
| 1994-05-21 | 104.487 |
| 1994-05-22 | 102.159 |
| 1994-05-23 | 101.914 |
| 1994-05-24 | 103.475 |
| 1994-05-25 | 103.337 |
| 1994-05-26 | 104.042 |
| 1994-05-27 | 105.428 |
| 1994-05-28 | 105.434 |
| 1994-05-29 | 104.342 |
| 1994-05-30 | 105.331 |
| 1994-05-31 | 106.762 |
| 1994-06-01 | 108.108 |
| 1994-06-02 | 106.503 |
| 1994-06-03 | 106.602 |
| 1994-06-04 | 108.318 |
| 1994-06-05 | 106.188 |
| 1994-06-06 | 106.06 |
| 1994-06-07 | 105.409 |
| 1994-06-08 | 104.004 |
| 1994-06-09 | 103.852 |
| 1994-06-10 | 106.338 |
| 1994-06-11 | 107.308 |
| 1994-06-12 | 106.018 |
| 1994-06-13 | 109.959 |
| 1994-06-14 | 111.547 |
| 1994-06-15 | 113.305 |
| 1994-06-16 | 114.182 |
| 1994-06-17 | 115.079 |
| 1994-06-18 | 117.719 |
| 1994-06-19 | 117.381 |
| 1994-06-20 | 119.988 |
| 1994-06-21 | 121.762 |
| 1994-06-22 | 121.348 |
| 1994-06-23 | 120.745 |
| 1994-06-24 | 121.881 |
| 1994-06-25 | 121.188 |
| 1994-06-26 | 118.457 |
| 1994-06-27 | 120.487 |
| 1994-06-28 | 122.243 |
| 1994-06-29 | 122.217 |
| 1994-06-30 | 121.076 |
| 1994-07-01 | 118.003 |
| 1994-07-02 | 118.543 |
| 1994-07-03 | 116.449 |
| 1994-07-04 | 115.319 |
| 1994-07-05 | 116.042 |
| 1994-07-06 | 118.082 |
| 1994-07-07 | 118.902 |
| 1994-07-08 | 119.965 |
| 1994-07-09 | 119.359 |
| 1994-07-10 | 117.428 |
| 1994-07-11 | 117.594 |
| 1994-07-12 | 116.712 |
| 1994-07-13 | 113.681 |
| 1994-07-14 | 112.609 |
| 1994-07-15 | 109.885 |
| 1994-07-16 | 109.952 |
| 1994-07-17 | 107.31 |
| 1994-07-18 | 106.013 |
| 1994-07-19 | 106.421 |
| 1994-07-20 | 103.719 |
| 1994-07-21 | 101.459 |
| 1994-07-22 | 101.757 |
| 1994-07-23 | 101.418 |
| 1994-07-24 | 98.082 |
| 1994-07-25 | 96.986 |
| 1994-07-26 | 98.163 |
| 1994-07-27 | 97.463 |
| 1994-07-28 | 97.706 |
| 1994-07-29 | 99.06 |
| 1994-07-30 | 101.199 |
| 1994-07-31 | 103.041 |
| 1994-08-01 | 105.766 |
| 1994-08-02 | 107.425 |
| 1994-08-03 | 106.733 |
| 1994-08-04 | 106.453 |
| 1994-08-05 | 106.277 |
| 1994-08-06 | 106.456 |
| 1994-08-07 | 104.902 |
| 1994-08-08 | 106.129 |
| 1994-08-09 | 107.022 |
| 1994-08-10 | 106.205 |
| 1994-08-11 | 106.817 |
| 1994-08-12 | 106.348 |
| 1994-08-13 | 107.118 |
| 1994-08-14 | 107.168 |
| 1994-08-15 | 106.392 |
| 1994-08-16 | 108.067 |
| 1994-08-17 | 107.046 |
| 1994-08-18 | 106.396 |
| 1994-08-19 | 106.469 |
| 1994-08-20 | 107.757 |
| 1994-08-21 | 107.281 |
| 1994-08-22 | 106.798 |
| 1994-08-23 | 106.758 |
| 1994-08-24 | 107.496 |
| 1994-08-25 | 107.41 |
| 1994-08-26 | 106.005 |
| 1994-08-27 | 104.182 |
| 1994-08-28 | 101.589 |
| 1994-08-29 | 101.079 |
| 1994-08-30 | 100.186 |
| 1994-08-31 | 98.319 |
| 1994-09-01 | 97.427 |
| 1994-09-02 | 98.681 |
| 1994-09-03 | 96.795 |
| 1994-09-04 | 94.61 |
| 1994-09-05 | 93.447 |
| 1994-09-06 | 93.55 |
| 1994-09-07 | 91.589 |
| 1994-09-08 | 90.708 |
| 1994-09-09 | 89.248 |
| 1994-09-10 | 88.707 |
| 1994-09-11 | 86.905 |
| 1994-09-12 | 86.458 |
| 1994-09-13 | 87.644 |
| 1994-09-14 | 87.047 |
| 1994-09-15 | 88.072 |
| 1994-09-16 | 88.503 |
| 1994-09-17 | 89.694 |
| 1994-09-18 | 89.583 |
| 1994-09-19 | 90.661 |
| 1994-09-20 | 92.744 |
| 1994-09-21 | 93.05 |
| 1994-09-22 | 94.701 |
| 1994-09-23 | 94.933 |
| 1994-09-24 | 94.401 |
| 1994-09-25 | 94.133 |
| 1994-09-26 | 94.625 |
| 1994-09-27 | 97.822 |
| 1994-09-28 | 97.851 |
| 1994-09-29 | 98.513 |
| 1994-09-30 | 97.799 |
| 1994-10-01 | 96.423 |
| 1994-10-02 | 93.729 |
| 1994-10-03 | 95.205 |
| 1994-10-04 | 94.865 |
| 1994-10-05 | 94.493 |
| 1994-10-06 | 93.879 |
| 1994-10-07 | 93.359 |
| 1994-10-08 | 94.169 |
| 1994-10-09 | 94.433 |
| 1994-10-10 | 97.29 |
| 1994-10-11 | 103.687 |
| 1994-10-12 | 104.924 |
| 1994-10-13 | 104.564 |
| 1994-10-14 | 106.016 |
| 1994-10-15 | 106.147 |
| 1994-10-16 | 105.471 |
| 1994-10-17 | 106.19 |
| 1994-10-18 | 108.203 |
| 1994-10-19 | 107.501 |
| 1994-10-20 | 106.307 |
| 1994-10-21 | 106.559 |
| 1994-10-22 | 105.827 |
| 1994-10-23 | 105.423 |
| 1994-10-24 | 105.97 |
| 1994-10-25 | 106.108 |
| 1994-10-26 | 104.645 |
| 1994-10-27 | 102.541 |
| 1994-10-28 | 101.159 |
| 1994-10-29 | 99.784 |
| 1994-10-30 | 98.526 |
| 1994-10-31 | 99.315 |
| 1994-11-01 | 100.213 |
| 1994-11-02 | 99.204 |
| 1994-11-03 | 98.411 |
| 1994-11-04 | 98.498 |
| 1994-11-05 | 98.034 |
| 1994-11-06 | 97.936 |
| 1994-11-07 | 96.731 |
| 1994-11-08 | 96.078 |
| 1994-11-09 | 92.752 |
| 1994-11-10 | 86.548 |
| 1994-11-11 | 86.159 |
| 1994-11-12 | 87.467 |
| 1994-11-13 | 86.256 |
| 1994-11-14 | 85.357 |
| 1994-11-15 | 87.526 |
| 1994-11-16 | 86.868 |
| 1994-11-17 | 85.705 |
| 1994-11-18 | 84.686 |
| 1994-11-19 | 83.711 |
| 1994-11-20 | 81.628 |
| 1994-11-21 | 82.715 |
| 1994-11-22 | 82.848 |
| 1994-11-23 | 82.346 |
| 1994-11-24 | 82.645 |
| 1994-11-25 | 84.265 |
| 1994-11-26 | 84.356 |
| 1994-11-27 | 84.031 |
| 1994-11-28 | 85.541 |
| 1994-11-29 | 88.562 |
| 1994-11-30 | 89.258 |
| 1994-12-01 | 90.334 |
| 1994-12-02 | 92.925 |
| 1994-12-03 | 95.425 |
| 1994-12-04 | 95.884 |
| 1994-12-05 | 97.933 |
| 1994-12-06 | 100.015 |
| 1994-12-07 | 100.094 |
| 1994-12-08 | 100.884 |
| 1994-12-09 | 101.459 |
| 1994-12-10 | 101.795 |
| 1994-12-11 | 99.251 |
| 1994-12-12 | 98.135 |
| 1994-12-13 | 99.815 |
| 1994-12-14 | 98.399 |
| 1994-12-15 | 96.999 |
| 1994-12-16 | 97.035 |
| 1994-12-17 | 97.262 |
| 1994-12-18 | 95.842 |
| 1994-12-19 | 96.657 |
| 1994-12-20 | 99.399 |
| 1994-12-21 | 98.793 |
| 1994-12-22 | 98.099 |
| 1994-12-23 | 97.411 |
| 1994-12-24 | 97.488 |
| 1994-12-25 | 96.617 |
| 1994-12-26 | 98.267 |
| 1994-12-27 | 100.546 |
| 1994-12-28 | 101.302 |
| 1994-12-29 | 98.142 |
| 1994-12-30 | 98.042 |
| 1994-12-31 | 98.979 |
| 1995-01-01 | 96.607 |
| 1995-01-02 | 94.962 |
| 1995-01-03 | 95.474 |
| 1995-01-04 | 94.497 |
| 1995-01-05 | 93.812 |
| 1995-01-06 | 93.822 |
| 1995-01-07 | 94.968 |
| 1995-01-08 | 93.679 |
| 1995-01-09 | 96.135 |
| 1995-01-10 | 96.96 |
| 1995-01-11 | 96.69 |
| 1995-01-12 | 94.693 |
| 1995-01-13 | 95.367 |
| 1995-01-14 | 94.575 |
| 1995-01-15 | 92.518 |
| 1995-01-16 | 92.07 |
| 1995-01-17 | 92.758 |
| 1995-01-18 | 92.259 |
| 1995-01-19 | 90.583 |
| 1995-01-20 | 89.524 |
| 1995-01-21 | 90.086 |
| 1995-01-22 | 89.288 |
| 1995-01-23 | 88.99 |
| 1995-01-24 | 89.843 |
| 1995-01-25 | 87.756 |
| 1995-01-26 | 84.659 |
| 1995-01-27 | 82.186 |
| 1995-01-28 | 81.811 |
| 1995-01-29 | 80.027 |
| 1995-01-30 | 80.024 |
| 1995-01-31 | 81.605 |
| 1995-02-01 | 81.833 |
| 1995-02-02 | 79.895 |
| 1995-02-03 | 78.568 |
| 1995-02-04 | 76.57 |
| 1995-02-05 | 76.019 |
| 1995-02-06 | 75.302 |
| 1995-02-07 | 76.792 |
| 1995-02-08 | 74.366 |
| 1995-02-09 | 74.475 |
| 1995-02-10 | 74.515 |
| 1995-02-11 | 74.787 |
| 1995-02-12 | 74.405 |
| 1995-02-13 | 74.773 |
| 1995-02-14 | 75.685 |
| 1995-02-15 | 75.559 |
| 1995-02-16 | 75.839 |
| 1995-02-17 | 75.43 |
| 1995-02-18 | 75.607 |
| 1995-02-19 | 76.341 |
| 1995-02-20 | 76.711 |
| 1995-02-21 | 79.477 |
| 1995-02-22 | 79.808 |
| 1995-02-23 | 79.333 |
| 1995-02-24 | 79.729 |
| 1995-02-25 | 80.548 |
| 1995-02-26 | 79.724 |
| 1995-02-27 | 79.774 |
| 1995-02-28 | 80.66 |
| 1995-03-01 | 79.018 |
| 1995-03-02 | 76.412 |
| 1995-03-03 | 75.651 |
| 1995-03-04 | 76.065 |
| 1995-03-05 | 76.143 |
| 1995-03-06 | 78.612 |
| 1995-03-07 | 78.387 |
| 1995-03-08 | 78.163 |
| 1995-03-09 | 78.479 |
| 1995-03-10 | 78.805 |
| 1995-03-11 | 78.267 |
| 1995-03-12 | 76.477 |
| 1995-03-13 | 76.447 |
| 1995-03-14 | 76.951 |
| 1995-03-15 | 77.51 |
| 1995-03-16 | 76.539 |
| 1995-03-17 | 75 |
| 1995-03-18 | 74.702 |
| 1995-03-19 | 72.927 |
| 1995-03-20 | 73.855 |
| 1995-03-21 | 75.439 |
| 1995-03-22 | 76.084 |
| 1995-03-23 | 77.095 |
| 1995-03-24 | 78.49 |
| 1995-03-25 | 77.719 |
| 1995-03-26 | 76.942 |
| 1995-03-27 | 77.578 |
| 1995-03-28 | 80.425 |
| 1995-03-29 | 82.308 |
| 1995-03-30 | 82.807 |
| 1995-03-31 | 83.198 |
| 1995-04-01 | 83.95 |
| 1995-04-02 | 84.003 |
| 1995-04-03 | 84.161 |
| 1995-04-04 | 85.648 |
| 1995-04-05 | 85.881 |
| 1995-04-06 | 87.387 |
| 1995-04-07 | 88.061 |
| 1995-04-08 | 87.848 |
| 1995-04-09 | 87.489 |
| 1995-04-10 | 88.208 |
| 1995-04-11 | 88.828 |
| 1995-04-12 | 89.254 |
| 1995-04-13 | 89.65 |
| 1995-04-14 | 89.669 |
| 1995-04-15 | 91.14 |
| 1995-04-16 | 92.37 |
| 1995-04-17 | 94.815 |
| 1995-04-18 | 97.384 |
| 1995-04-19 | 97.365 |
| 1995-04-20 | 98.327 |
| 1995-04-21 | 101.428 |
| 1995-04-22 | 99.411 |
| 1995-04-23 | 98.442 |
| 1995-04-24 | 99.84 |
| 1995-04-25 | 100.229 |
| 1995-04-26 | 100.284 |
| 1995-04-27 | 98.483 |
| 1995-04-28 | 97.458 |
| 1995-04-29 | 99.065 |
| 1995-04-30 | 98.382 |
| 1995-05-01 | 101.737 |
| 1995-05-02 | 104.032 |
| 1995-05-03 | 106.745 |
| 1995-05-04 | 106.341 |
| 1995-05-05 | 105.301 |
| 1995-05-06 | 103.862 |
| 1995-05-07 | 102.734 |
| 1995-05-08 | 103.349 |
| 1995-05-09 | 104.147 |
| 1995-05-10 | 103.785 |
| 1995-05-11 | 104.576 |
| 1995-05-12 | 104.134 |
| 1995-05-13 | 102.791 |
| 1995-05-14 | 101.245 |
| 1995-05-15 | 100.598 |
| 1995-05-16 | 99.67 |
| 1995-05-17 | 97.455 |
| 1995-05-18 | 96.39 |
| 1995-05-19 | 95.949 |
| 1995-05-20 | 92.388 |
| 1995-05-21 | 86.934 |
| 1995-05-22 | 86.468 |
| 1995-05-23 | 85.887 |
| 1995-05-24 | 85.736 |
| 1995-05-25 | 85.154 |
| 1995-05-26 | 84.534 |
| 1995-05-27 | 85.061 |
| 1995-05-28 | 84.316 |
| 1995-05-29 | 83.433 |
| 1995-05-30 | 85.948 |
| 1995-05-31 | 84.788 |
| 1995-06-01 | 85.942 |
| 1995-06-02 | 85.14 |
| 1995-06-03 | 85.362 |
| 1995-06-04 | 85.079 |
| 1995-06-05 | 87.504 |
| 1995-06-06 | 88.089 |
| 1995-06-07 | 88.302 |
| 1995-06-08 | 88.007 |
| 1995-06-09 | 89.787 |
| 1995-06-10 | 90.096 |
| 1995-06-11 | 89.344 |
| 1995-06-12 | 90.191 |
| 1995-06-13 | 91.852 |
| 1995-06-14 | 94.695 |
| 1995-06-15 | 97.768 |
| 1995-06-16 | 99.78 |
| 1995-06-17 | 101.841 |
| 1995-06-18 | 102.363 |
| 1995-06-19 | 104.974 |
| 1995-06-20 | 107.469 |
| 1995-06-21 | 108.956 |
| 1995-06-22 | 110.513 |
| 1995-06-23 | 110.302 |
| 1995-06-24 | 109.998 |
| 1995-06-25 | 110.181 |
| 1995-06-26 | 110.34 |
| 1995-06-27 | 110.828 |
| 1995-06-28 | 109.352 |
| 1995-06-29 | 108.336 |
| 1995-06-30 | 106.53 |
| 1995-07-01 | 104.284 |
| 1995-07-02 | 102.575 |
| 1995-07-03 | 100.875 |
| 1995-07-04 | 102.161 |
| 1995-07-05 | 99.479 |
| 1995-07-06 | 99.237 |
| 1995-07-07 | 98.444 |
| 1995-07-08 | 98.496 |
| 1995-07-09 | 95.645 |
| 1995-07-10 | 95.76 |
| 1995-07-11 | 96.196 |
| 1995-07-12 | 97.675 |
| 1995-07-13 | 97.224 |
| 1995-07-14 | 95.11 |
| 1995-07-15 | 93.785 |
| 1995-07-16 | 92.69 |
| 1995-07-17 | 94.257 |
| 1995-07-18 | 93.828 |
| 1995-07-19 | 93.703 |
| 1995-07-20 | 93.547 |
| 1995-07-21 | 93.186 |
| 1995-07-22 | 92.316 |
| 1995-07-23 | 91.542 |
| 1995-07-24 | 94.796 |
| 1995-07-25 | 96.837 |
| 1995-07-26 | 99.8 |
| 1995-07-27 | 102.937 |
| 1995-07-28 | 105.47 |
| 1995-07-29 | 106.814 |
| 1995-07-30 | 107.102 |
| 1995-07-31 | 109.334 |
| 1995-08-01 | 110.262 |
| 1995-08-02 | 112.874 |
| 1995-08-03 | 112.374 |
| 1995-08-04 | 114.736 |
| 1995-08-05 | 115.97 |
| 1995-08-06 | 116.262 |
| 1995-08-07 | 118.339 |
| 1995-08-08 | 120.682 |
| 1995-08-09 | 121.444 |
| 1995-08-10 | 122.522 |
| 1995-08-11 | 122.553 |
| 1995-08-12 | 122.868 |
| 1995-08-13 | 123.016 |
| 1995-08-14 | 125.01 |
| 1995-08-15 | 125.537 |
| 1995-08-16 | 123.142 |
| 1995-08-17 | 123.435 |
| 1995-08-18 | 124.425 |
| 1995-08-19 | 124.74 |
| 1995-08-20 | 123.676 |
| 1995-08-21 | 123.22 |
| 1995-08-22 | 123.942 |
| 1995-08-23 | 122.453 |
| 1995-08-24 | 120.146 |
| 1995-08-25 | 117.153 |
| 1995-08-26 | 114.591 |
| 1995-08-27 | 112.594 |
| 1995-08-28 | 110.28 |
| 1995-08-29 | 110.225 |
| 1995-08-30 | 108.81 |
| 1995-08-31 | 108.849 |
| 1995-09-01 | 107.309 |
| 1995-09-02 | 106.062 |
| 1995-09-03 | 103.686 |
| 1995-09-04 | 103.678 |
| 1995-09-05 | 103.973 |
| 1995-09-06 | 101.532 |
| 1995-09-07 | 101.03 |
| 1995-09-08 | 99.497 |
| 1995-09-09 | 99.747 |
| 1995-09-10 | 97.551 |
| 1995-09-11 | 97.644 |
| 1995-09-12 | 96.803 |
| 1995-09-13 | 93.993 |
| 1995-09-14 | 92.512 |
| 1995-09-15 | 90.379 |
| 1995-09-16 | 89.276 |
| 1995-09-17 | 85.23 |
| 1995-09-18 | 83.823 |
| 1995-09-19 | 83.127 |
| 1995-09-20 | 82.976 |
| 1995-09-21 | 82.069 |
| 1995-09-22 | 80.259 |
| 1995-09-23 | 80.577 |
| 1995-09-24 | 79.306 |
| 1995-09-25 | 77.781 |
| 1995-09-26 | 78.291 |
| 1995-09-27 | 76.567 |
| 1995-09-28 | 75.911 |
| 1995-09-29 | 74.048 |
| 1995-09-30 | 72.731 |
| 1995-10-01 | 72.802 |
| 1995-10-02 | 73.293 |
| 1995-10-03 | 73.258 |
| 1995-10-04 | 72.649 |
| 1995-10-05 | 70.753 |
| 1995-10-06 | 69.912 |
| 1995-10-07 | 69.439 |
| 1995-10-08 | 68.78 |
| 1995-10-09 | 66.978 |
| 1995-10-10 | 68.167 |
| 1995-10-11 | 67.221 |
| 1995-10-12 | 66.91 |
| 1995-10-13 | 66.111 |
| 1995-10-14 | 66.703 |
| 1995-10-15 | 68.113 |
| 1995-10-16 | 69.324 |
| 1995-10-17 | 69.908 |
| 1995-10-18 | 70.555 |
| 1995-10-19 | 71.337 |
| 1995-10-20 | 70.397 |
| 1995-10-21 | 70.299 |
| 1995-10-22 | 70.259 |
| 1995-10-23 | 68.334 |
| 1995-10-24 | 68.34 |
| 1995-10-25 | 68.634 |
| 1995-10-26 | 67.879 |
| 1995-10-27 | 68.744 |
| 1995-10-28 | 68.028 |
| 1995-10-29 | 67.979 |
| 1995-10-30 | 69.559 |
| 1995-10-31 | 68.641 |
| 1995-11-01 | 67.594 |
| 1995-11-02 | 68.557 |
| 1995-11-03 | 67.997 |
| 1995-11-04 | 67.184 |
| 1995-11-05 | 67.795 |
| 1995-11-06 | 68.182 |
| 1995-11-07 | 69.308 |
| 1995-11-08 | 70.088 |
| 1995-11-09 | 69.075 |
| 1995-11-10 | 69.053 |
| 1995-11-11 | 69.038 |
| 1995-11-12 | 69.101 |
| 1995-11-13 | 70.72 |
| 1995-11-14 | 71.891 |
| 1995-11-15 | 70.361 |
| 1995-11-16 | 69.875 |
| 1995-11-17 | 69.051 |
| 1995-11-18 | 69.237 |
| 1995-11-19 | 69.161 |
| 1995-11-20 | 69.215 |
| 1995-11-21 | 70.278 |
| 1995-11-22 | 72.995 |
| 1995-11-23 | 75.417 |
| 1995-11-24 | 77.917 |
| 1995-11-25 | 78.34 |
| 1995-11-26 | 78.053 |
| 1995-11-27 | 77.974 |
| 1995-11-28 | 78.368 |
| 1995-11-29 | 76.33 |
| 1995-11-30 | 76.835 |
| 1995-12-01 | 77.725 |
| 1995-12-02 | 75.612 |
| 1995-12-03 | 74.818 |
| 1995-12-04 | 76.646 |
| 1995-12-05 | 76.913 |
| 1995-12-06 | 75.995 |
| 1995-12-07 | 74.996 |
| 1995-12-08 | 74.562 |
| 1995-12-09 | 75.182 |
| 1995-12-10 | 75.166 |
| 1995-12-11 | 74.968 |
| 1995-12-12 | 75.755 |
| 1995-12-13 | 72.995 |
| 1995-12-14 | 70.94 |
| 1995-12-15 | 71.78 |
| 1995-12-16 | 73.444 |
| 1995-12-17 | 72.898 |
| 1995-12-18 | 72.324 |
| 1995-12-19 | 72.806 |
| 1995-12-20 | 72.804 |
| 1995-12-21 | 70.922 |
| 1995-12-22 | 68.496 |
| 1995-12-23 | 66.438 |
| 1995-12-24 | 63.499 |
| 1995-12-25 | 61.848 |
| 1995-12-26 | 62.227 |
| 1995-12-27 | 63.525 |
| 1995-12-28 | 63.411 |
| 1995-12-29 | 64.355 |
| 1995-12-30 | 64.27 |
| 1995-12-31 | 64.047 |
| 1996-01-01 | 66.661 |
| 1996-01-02 | 67.267 |
| 1996-01-03 | 65.984 |
| 1996-01-04 | 66.826 |
| 1996-01-05 | 67.437 |
| 1996-01-06 | 67.458 |
| 1996-01-07 | 67.414 |
| 1996-01-08 | 68.765 |
| 1996-01-09 | 68.787 |
| 1996-01-10 | 69.882 |
| 1996-01-11 | 70.267 |
| 1996-01-12 | 71.32 |
| 1996-01-13 | 71.318 |
| 1996-01-14 | 72.25 |
| 1996-01-15 | 73.664 |
| 1996-01-16 | 75.77 |
| 1996-01-17 | 76.801 |
| 1996-01-18 | 79.644 |
| 1996-01-19 | 81.001 |
| 1996-01-20 | 82.289 |
| 1996-01-21 | 83.564 |
| 1996-01-22 | 84.807 |
| 1996-01-23 | 85.637 |
| 1996-01-24 | 86.878 |
| 1996-01-25 | 87.463 |
| 1996-01-26 | 86.209 |
| 1996-01-27 | 86.293 |
| 1996-01-28 | 84.974 |
| 1996-01-29 | 86.312 |
| 1996-01-30 | 87.424 |
| 1996-01-31 | 85.709 |
| 1996-02-01 | 85.999 |
| 1996-02-02 | 88.755 |
| 1996-02-03 | 87.773 |
| 1996-02-04 | 86.651 |
| 1996-02-05 | 86.728 |
| 1996-02-06 | 86.207 |
| 1996-02-07 | 86.272 |
| 1996-02-08 | 87.395 |
| 1996-02-09 | 87.399 |
| 1996-02-10 | 87.269 |
| 1996-02-11 | 87.116 |
| 1996-02-12 | 87.234 |
| 1996-02-13 | 87.923 |
| 1996-02-14 | 86.402 |
| 1996-02-15 | 85.911 |
| 1996-02-16 | 85.868 |
| 1996-02-17 | 82.727 |
| 1996-02-18 | 81.589 |
| 1996-02-19 | 81.999 |
| 1996-02-20 | 83.224 |
| 1996-02-21 | 83.345 |
| 1996-02-22 | 84.086 |
| 1996-02-23 | 86.259 |
| 1996-02-24 | 84.925 |
| 1996-02-25 | 85.335 |
| 1996-02-26 | 86.966 |
| 1996-02-27 | 90.472 |
| 1996-02-28 | 93 |
| 1996-02-29 | 93.707 |
| 1996-03-01 | 94.856 |
| 1996-03-02 | 94.134 |
| 1996-03-03 | 92.292 |
| 1996-03-04 | 94.875 |
| 1996-03-05 | 98.61 |
| 1996-03-06 | 101.757 |
| 1996-03-07 | 104.056 |
| 1996-03-08 | 104.936 |
| 1996-03-09 | 105.394 |
| 1996-03-10 | 104.464 |
| 1996-03-11 | 105.325 |
| 1996-03-12 | 107.409 |
| 1996-03-13 | 109.083 |
| 1996-03-14 | 109.279 |
| 1996-03-15 | 110.74 |
| 1996-03-16 | 108.621 |
| 1996-03-17 | 107.541 |
| 1996-03-18 | 107.35 |
| 1996-03-19 | 107.335 |
| 1996-03-20 | 107.625 |
| 1996-03-21 | 105.995 |
| 1996-03-22 | 105.157 |
| 1996-03-23 | 104.91 |
| 1996-03-24 | 102.204 |
| 1996-03-25 | 105.332 |
| 1996-03-26 | 104.528 |
| 1996-03-27 | 103.105 |
| 1996-03-28 | 101.17 |
| 1996-03-29 | 98.703 |
| 1996-03-30 | 95.778 |
| 1996-03-31 | 94.4 |
| 1996-04-01 | 97.446 |
| 1996-04-02 | 98.137 |
| 1996-04-03 | 96.159 |
| 1996-04-04 | 93.029 |
| 1996-04-05 | 90.075 |
| 1996-04-06 | 88.301 |
| 1996-04-07 | 84.68 |
| 1996-04-08 | 85.12 |
| 1996-04-09 | 85.692 |
| 1996-04-10 | 84.046 |
| 1996-04-11 | 82.813 |
| 1996-04-12 | 82.116 |
| 1996-04-13 | 80.528 |
| 1996-04-14 | 79.14 |
| 1996-04-15 | 80.687 |
| 1996-04-16 | 81.134 |
| 1996-04-17 | 84.07 |
| 1996-04-18 | 86.71 |
| 1996-04-19 | 87.304 |
| 1996-04-20 | 89.222 |
| 1996-04-21 | 88.624 |
| 1996-04-22 | 90.642 |
| 1996-04-23 | 93.513 |
| 1996-04-24 | 92.094 |
| 1996-04-25 | 94.17 |
| 1996-04-26 | 95.943 |
| 1996-04-27 | 96.138 |
| 1996-04-28 | 94.416 |
| 1996-04-29 | 96.446 |
| 1996-04-30 | 99.164 |
| 1996-05-01 | 97.171 |
| 1996-05-02 | 96.282 |
| 1996-05-03 | 94.936 |
| 1996-05-04 | 93.782 |
| 1996-05-05 | 92.255 |
| 1996-05-06 | 93.354 |
| 1996-05-07 | 93.678 |
| 1996-05-08 | 91.428 |
| 1996-05-09 | 92.192 |
| 1996-05-10 | 91.637 |
| 1996-05-11 | 90.619 |
| 1996-05-12 | 89.304 |
| 1996-05-13 | 89.1 |
| 1996-05-14 | 87.857 |
| 1996-05-15 | 86.84 |
| 1996-05-16 | 87.385 |
| 1996-05-17 | 84.778 |
| 1996-05-18 | 82.549 |
| 1996-05-19 | 79.921 |
| 1996-05-20 | 79.617 |
| 1996-05-21 | 82.387 |
| 1996-05-22 | 80.433 |
| 1996-05-23 | 79.441 |
| 1996-05-24 | 79.619 |
| 1996-05-25 | 79.365 |
| 1996-05-26 | 76.937 |
| 1996-05-27 | 77.136 |
| 1996-05-28 | 78.17 |
| 1996-05-29 | 76.976 |
| 1996-05-30 | 74.845 |
| 1996-05-31 | 75.611 |
| 1996-06-01 | 75.451 |
| 1996-06-02 | 76.234 |
| 1996-06-03 | 76.961 |
| 1996-06-04 | 78.01 |
| 1996-06-05 | 76.262 |
| 1996-06-06 | 76.377 |
| 1996-06-07 | 76.687 |
| 1996-06-08 | 74.616 |
| 1996-06-09 | 73.612 |
| 1996-06-10 | 75.245 |
| 1996-06-11 | 75.471 |
| 1996-06-12 | 74.58 |
| 1996-06-13 | 75.447 |
| 1996-06-14 | 75.851 |
| 1996-06-15 | 75.326 |
| 1996-06-16 | 74.901 |
| 1996-06-17 | 75.553 |
| 1996-06-18 | 76.521 |
| 1996-06-19 | 76.824 |
| 1996-06-20 | 74.584 |
| 1996-06-21 | 75.974 |
| 1996-06-22 | 74.495 |
| 1996-06-23 | 73.53 |
| 1996-06-24 | 72.119 |
| 1996-06-25 | 74.407 |
| 1996-06-26 | 73.742 |
| 1996-06-27 | 77.178 |
| 1996-06-28 | 78.865 |
| 1996-06-29 | 80.337 |
| 1996-06-30 | 79.695 |
| 1996-07-01 | 81.388 |
| 1996-07-02 | 82.439 |
| 1996-07-03 | 82.265 |
| 1996-07-04 | 82.049 |
| 1996-07-05 | 83.127 |
| 1996-07-06 | 82.54 |
| 1996-07-07 | 82.204 |
| 1996-07-08 | 84.063 |
| 1996-07-09 | 87.394 |
| 1996-07-10 | 86.068 |
| 1996-07-11 | 87.808 |
| 1996-07-12 | 87.699 |
| 1996-07-13 | 86.902 |
| 1996-07-14 | 85.723 |
| 1996-07-15 | 85.862 |
| 1996-07-16 | 86.6 |
| 1996-07-17 | 86.911 |
| 1996-07-18 | 88.219 |
| 1996-07-19 | 87.752 |
| 1996-07-20 | 88.838 |
| 1996-07-21 | 88.978 |
| 1996-07-22 | 90.797 |
| 1996-07-23 | 91.202 |
| 1996-07-24 | 93.686 |
| 1996-07-25 | 92.674 |
| 1996-07-26 | 93.49 |
| 1996-07-27 | 90.955 |
| 1996-07-28 | 88.857 |
| 1996-07-29 | 89.817 |
| 1996-07-30 | 91.307 |
| 1996-07-31 | 92.094 |
| 1996-08-01 | 92.291 |
| 1996-08-02 | 92.359 |
| 1996-08-03 | 93.042 |
| 1996-08-04 | 93.583 |
| 1996-08-05 | 96.916 |
| 1996-08-06 | 99.231 |
| 1996-08-07 | 101.376 |
| 1996-08-08 | 102.496 |
| 1996-08-09 | 103.401 |
| 1996-08-10 | 101.99 |
| 1996-08-11 | 103.225 |
| 1996-08-12 | 103.429 |
| 1996-08-13 | 106.505 |
| 1996-08-14 | 105.962 |
| 1996-08-15 | 106.526 |
| 1996-08-16 | 104.987 |
| 1996-08-17 | 104.456 |
| 1996-08-18 | 102.571 |
| 1996-08-19 | 102.545 |
| 1996-08-20 | 101.45 |
| 1996-08-21 | 100.868 |
| 1996-08-22 | 101.562 |
| 1996-08-23 | 100.101 |
| 1996-08-24 | 99.007 |
| 1996-08-25 | 97.326 |
| 1996-08-26 | 96.569 |
| 1996-08-27 | 96.634 |
| 1996-08-28 | 94.274 |
| 1996-08-29 | 92.627 |
| 1996-08-30 | 92.265 |
| 1996-08-31 | 92.994 |
| 1996-09-01 | 94.219 |
| 1996-09-02 | 97.878 |
| 1996-09-03 | 100.842 |
| 1996-09-04 | 102.702 |
| 1996-09-05 | 102.875 |
| 1996-09-06 | 103.065 |
| 1996-09-07 | 100.419 |
| 1996-09-08 | 98.913 |
| 1996-09-09 | 99.776 |
| 1996-09-10 | 100.032 |
| 1996-09-11 | 102.238 |
| 1996-09-12 | 99.847 |
| 1996-09-13 | 100.878 |
| 1996-09-14 | 101.568 |
| 1996-09-15 | 102.117 |
| 1996-09-16 | 101.538 |
| 1996-09-17 | 103.466 |
| 1996-09-18 | 102.508 |
| 1996-09-19 | 101.738 |
| 1996-09-20 | 101.114 |
| 1996-09-21 | 99.297 |
| 1996-09-22 | 99.684 |
| 1996-09-23 | 99.536 |
| 1996-09-24 | 101.397 |
| 1996-09-25 | 101.056 |
| 1996-09-26 | 102.401 |
| 1996-09-27 | 103.727 |
| 1996-09-28 | 102.702 |
| 1996-09-29 | 100.456 |
| 1996-09-30 | 98.75 |
| 1996-10-01 | 98.03 |
| 1996-10-02 | 95.174 |
| 1996-10-03 | 91.021 |
| 1996-10-04 | 87.227 |
| 1996-10-05 | 83.985 |
| 1996-10-06 | 80.252 |
| 1996-10-07 | 79.588 |
| 1996-10-08 | 79.692 |
| 1996-10-09 | 79.803 |
| 1996-10-10 | 78.46 |
| 1996-10-11 | 76.018 |
| 1996-10-12 | 75.833 |
| 1996-10-13 | 73.368 |
| 1996-10-14 | 72.44 |
| 1996-10-15 | 72.16 |
| 1996-10-16 | 71.491 |
| 1996-10-17 | 70.471 |
| 1996-10-18 | 70.05 |
| 1996-10-19 | 69.189 |
| 1996-10-20 | 68.483 |
| 1996-10-21 | 69.344 |
| 1996-10-22 | 69.286 |
| 1996-10-23 | 69.311 |
| 1996-10-24 | 67.988 |
| 1996-10-25 | 67.207 |
| 1996-10-26 | 65.965 |
| 1996-10-27 | 63.638 |
| 1996-10-28 | 62.815 |
| 1996-10-29 | 63.776 |
| 1996-10-30 | 61.873 |
| 1996-10-31 | 61.895 |
| 1996-11-01 | 60.986 |
| 1996-11-02 | 61.144 |
| 1996-11-03 | 59.157 |
| 1996-11-04 | 61.088 |
| 1996-11-05 | 61.805 |
| 1996-11-06 | 62.003 |
| 1996-11-07 | 60.931 |
| 1996-11-08 | 59.306 |
| 1996-11-09 | 58.864 |
| 1996-11-10 | 59.475 |
| 1996-11-11 | 60.16 |
| 1996-11-12 | 62.457 |
| 1996-11-13 | 62.647 |
| 1996-11-14 | 62.593 |
| 1996-11-15 | 63.592 |
| 1996-11-16 | 63.423 |
| 1996-11-17 | 64.082 |
| 1996-11-18 | 65.403 |
| 1996-11-19 | 65.349 |
| 1996-11-20 | 65.031 |
| 1996-11-21 | 63.957 |
| 1996-11-22 | 63.092 |
| 1996-11-23 | 62.053 |
| 1996-11-24 | 62.33 |
| 1996-11-25 | 63.241 |
| 1996-11-26 | 65.101 |
| 1996-11-27 | 66.071 |
| 1996-11-28 | 65.855 |
| 1996-11-29 | 67.416 |
| 1996-11-30 | 65.886 |
| 1996-12-01 | 64.949 |
| 1996-12-02 | 65.37 |
| 1996-12-03 | 67.52 |
| 1996-12-04 | 67.219 |
| 1996-12-05 | 67.469 |
| 1996-12-06 | 68.307 |
| 1996-12-07 | 67.676 |
| 1996-12-08 | 67.396 |
| 1996-12-09 | 67.672 |
| 1996-12-10 | 68.666 |
| 1996-12-11 | 68.582 |
| 1996-12-12 | 67.847 |
| 1996-12-13 | 65.967 |
| 1996-12-14 | 66.01 |
| 1996-12-15 | 64.877 |
| 1996-12-16 | 65.546 |
| 1996-12-17 | 65.401 |
| 1996-12-18 | 64.635 |
| 1996-12-19 | 65.667 |
| 1996-12-20 | 67.535 |
| 1996-12-21 | 68.539 |
| 1996-12-22 | 70.116 |
| 1996-12-23 | 72.473 |
| 1996-12-24 | 72.468 |
| 1996-12-25 | 72.121 |
| 1996-12-26 | 71.649 |
| 1996-12-27 | 71.523 |
| 1996-12-28 | 70.791 |
| 1996-12-29 | 70.433 |
| 1996-12-30 | 73.987 |
| 1996-12-31 | 76.566 |
| 1997-01-01 | 77 |
| 1997-01-02 | 77.355 |
| 1997-01-03 | 76.215 |
| 1997-01-04 | 75.746 |
| 1997-01-05 | 75.168 |
| 1997-01-06 | 76.808 |
| 1997-01-07 | 77.765 |
| 1997-01-08 | 77.112 |
| 1997-01-09 | 74.711 |
| 1997-01-10 | 73.981 |
| 1997-01-11 | 73.429 |
| 1997-01-12 | 73.34 |
| 1997-01-13 | 72.382 |
| 1997-01-14 | 72.079 |
| 1997-01-15 | 70.907 |
| 1997-01-16 | 70.158 |
| 1997-01-17 | 69.601 |
| 1997-01-18 | 68.268 |
| 1997-01-19 | 65.917 |
| 1997-01-20 | 65.06 |
| 1997-01-21 | 64.014 |
| 1997-01-22 | 61.937 |
| 1997-01-23 | 61.722 |
| 1997-01-24 | 61.105 |
| 1997-01-25 | 59.19 |
| 1997-01-26 | 59.586 |
| 1997-01-27 | 59.702 |
| 1997-01-28 | 59.174 |
| 1997-01-29 | 56.572 |
| 1997-01-30 | 54.916 |
| 1997-01-31 | 52.827 |
| 1997-02-01 | 50.611 |
| 1997-02-02 | 49.503 |
| 1997-02-03 | 48.806 |
| 1997-02-04 | 47.959 |
| 1997-02-05 | 46.775 |
| 1997-02-06 | 45.98 |
| 1997-02-07 | 47.276 |
| 1997-02-08 | 47.376 |
| 1997-02-09 | 46.469 |
| 1997-02-10 | 46.932 |
| 1997-02-11 | 47.216 |
| 1997-02-12 | 48.202 |
| 1997-02-13 | 48.33 |
| 1997-02-14 | 47.85 |
| 1997-02-15 | 47.695 |
| 1997-02-16 | 47.621 |
| 1997-02-17 | 47.413 |
| 1997-02-18 | 47.608 |
| 1997-02-19 | 48.68 |
| 1997-02-20 | 49.301 |
| 1997-02-21 | 49.481 |
| 1997-02-22 | 48.952 |
| 1997-02-23 | 48.702 |
| 1997-02-24 | 49.543 |
| 1997-02-25 | 48.307 |
| 1997-02-26 | 48.284 |
| 1997-02-27 | 49.258 |
| 1997-02-28 | 49.007 |
| 1997-03-01 | 47.668 |
| 1997-03-02 | 47.926 |
| 1997-03-03 | 49.905 |
| 1997-03-04 | 51.363 |
| 1997-03-05 | 52.074 |
| 1997-03-06 | 52.773 |
| 1997-03-07 | 54.023 |
| 1997-03-08 | 54.349 |
| 1997-03-09 | 53.69 |
| 1997-03-10 | 54.809 |
| 1997-03-11 | 56.059 |
| 1997-03-12 | 56.294 |
| 1997-03-13 | 55.867 |
| 1997-03-14 | 55.77 |
| 1997-03-15 | 56.213 |
| 1997-03-16 | 55.935 |
| 1997-03-17 | 55.85 |
| 1997-03-18 | 56.153 |
| 1997-03-19 | 56.086 |
| 1997-03-20 | 55.837 |
| 1997-03-21 | 54.729 |
| 1997-03-22 | 54.887 |
| 1997-03-23 | 55.384 |
| 1997-03-24 | 56.828 |
| 1997-03-25 | 57.143 |
| 1997-03-26 | 57.403 |
| 1997-03-27 | 58.077 |
| 1997-03-28 | 58.179 |
| 1997-03-29 | 58.347 |
| 1997-03-30 | 58.203 |
| 1997-03-31 | 59.069 |
| 1997-04-01 | 59.542 |
| 1997-04-02 | 57.952 |
| 1997-04-03 | 57.091 |
| 1997-04-04 | 56.766 |
| 1997-04-05 | 55.697 |
| 1997-04-06 | 54.873 |
| 1997-04-07 | 55.177 |
| 1997-04-08 | 56.07 |
| 1997-04-09 | 56.963 |
| 1997-04-10 | 56.239 |
| 1997-04-11 | 55.722 |
| 1997-04-12 | 55.81 |
| 1997-04-13 | 54.519 |
| 1997-04-14 | 54.669 |
| 1997-04-15 | 56.234 |
| 1997-04-16 | 56.34 |
| 1997-04-17 | 57.306 |
| 1997-04-18 | 56.739 |
| 1997-04-19 | 56.362 |
| 1997-04-20 | 55.271 |
| 1997-04-21 | 55.506 |
| 1997-04-22 | 54.967 |
| 1997-04-23 | 57.663 |
| 1997-04-24 | 59.027 |
| 1997-04-25 | 60.16 |
| 1997-04-26 | 59.986 |
| 1997-04-27 | 59.912 |
| 1997-04-28 | 59.091 |
| 1997-04-29 | 61.012 |
| 1997-04-30 | 61.791 |
| 1997-05-01 | 61.966 |
| 1997-05-02 | 62.6 |
| 1997-05-03 | 62.514 |
| 1997-05-04 | 61.872 |
| 1997-05-05 | 63.009 |
| 1997-05-06 | 62.773 |
| 1997-05-07 | 61.126 |
| 1997-05-08 | 60.231 |
| 1997-05-09 | 58.932 |
| 1997-05-10 | 59.198 |
| 1997-05-11 | 59.051 |
| 1997-05-12 | 59.612 |
| 1997-05-13 | 60.886 |
| 1997-05-14 | 61.867 |
| 1997-05-15 | 62.008 |
| 1997-05-16 | 62.199 |
| 1997-05-17 | 60.644 |
| 1997-05-18 | 60.961 |
| 1997-05-19 | 61.701 |
| 1997-05-20 | 62.617 |
| 1997-05-21 | 61.622 |
| 1997-05-22 | 61.597 |
| 1997-05-23 | 58.282 |
| 1997-05-24 | 56.113 |
| 1997-05-25 | 54.46 |
| 1997-05-26 | 54.957 |
| 1997-05-27 | 56.225 |
| 1997-05-28 | 56.525 |
| 1997-05-29 | 55.312 |
| 1997-05-30 | 55.264 |
| 1997-05-31 | 54.434 |
| 1997-06-01 | 53.091 |
| 1997-06-02 | 53.121 |
| 1997-06-03 | 52.814 |
| 1997-06-04 | 52.096 |
| 1997-06-05 | 51.824 |
| 1997-06-06 | 52.45 |
| 1997-06-07 | 51.475 |
| 1997-06-08 | 50.53 |
| 1997-06-09 | 49.88 |
| 1997-06-10 | 49.049 |
| 1997-06-11 | 48.89 |
| 1997-06-12 | 48.172 |
| 1997-06-13 | 46.828 |
| 1997-06-14 | 45.021 |
| 1997-06-15 | 44.617 |
| 1997-06-16 | 45.719 |
| 1997-06-17 | 46.07 |
| 1997-06-18 | 45.56 |
| 1997-06-19 | 45.098 |
| 1997-06-20 | 45.159 |
| 1997-06-21 | 44.29 |
| 1997-06-22 | 43.624 |
| 1997-06-23 | 44.892 |
| 1997-06-24 | 45.176 |
| 1997-06-25 | 44.326 |
| 1997-06-26 | 42.757 |
| 1997-06-27 | 41.868 |
| 1997-06-28 | 41.077 |
| 1997-06-29 | 39.351 |
| 1997-06-30 | 39.108 |
| 1997-07-01 | 39.926 |
| 1997-07-02 | 39.783 |
| 1997-07-03 | 40.207 |
| 1997-07-04 | 39.495 |
| 1997-07-05 | 39.978 |
| 1997-07-06 | 40.402 |
| 1997-07-07 | 42.093 |
| 1997-07-08 | 42.666 |
| 1997-07-09 | 42.833 |
| 1997-07-10 | 43.534 |
| 1997-07-11 | 43.783 |
| 1997-07-12 | 43.914 |
| 1997-07-13 | 42.816 |
| 1997-07-14 | 43.469 |
| 1997-07-15 | 43.602 |
| 1997-07-16 | 43.609 |
| 1997-07-17 | 43.986 |
| 1997-07-18 | 44.588 |
| 1997-07-19 | 45.155 |
| 1997-07-20 | 44.489 |
| 1997-07-21 | 45.128 |
| 1997-07-22 | 46.1 |
| 1997-07-23 | 45.182 |
| 1997-07-24 | 44.881 |
| 1997-07-25 | 44.707 |
| 1997-07-26 | 44.957 |
| 1997-07-27 | 45.081 |
| 1997-07-28 | 45.328 |
| 1997-07-29 | 46.362 |
| 1997-07-30 | 46.947 |
| 1997-07-31 | 47.886 |
| 1997-08-01 | 48.713 |
| 1997-08-02 | 49.709 |
| 1997-08-03 | 50.048 |
| 1997-08-04 | 50.287 |
| 1997-08-05 | 51.011 |
| 1997-08-06 | 50.67 |
| 1997-08-07 | 50.551 |
| 1997-08-08 | 51.203 |
| 1997-08-09 | 51.701 |
| 1997-08-10 | 50.61 |
| 1997-08-11 | 51.036 |
| 1997-08-12 | 52.105 |
| 1997-08-13 | 52.198 |
| 1997-08-14 | 52.234 |
| 1997-08-15 | 51.357 |
| 1997-08-16 | 50.333 |
| 1997-08-17 | 49.222 |
| 1997-08-18 | 48.366 |
| 1997-08-19 | 49.236 |
| 1997-08-20 | 49.652 |
| 1997-08-21 | 48.845 |
| 1997-08-22 | 48.944 |
| 1997-08-23 | 49.499 |
| 1997-08-24 | 50.372 |
| 1997-08-25 | 49.659 |
| 1997-08-26 | 49.275 |
| 1997-08-27 | 48.835 |
| 1997-08-28 | 48.795 |
| 1997-08-29 | 49.332 |
| 1997-08-30 | 48.57 |
| 1997-08-31 | 48.02 |
| 1997-09-01 | 46.755 |
| 1997-09-02 | 46.468 |
| 1997-09-03 | 46.358 |
| 1997-09-04 | 45.209 |
| 1997-09-05 | 45.237 |
| 1997-09-06 | 45.582 |
| 1997-09-07 | 44.008 |
| 1997-09-08 | 43.113 |
| 1997-09-09 | 43.522 |
| 1997-09-10 | 43.121 |
| 1997-09-11 | 43.575 |
| 1997-09-12 | 43.917 |
| 1997-09-13 | 43.725 |
| 1997-09-14 | 43.562 |
| 1997-09-15 | 44.139 |
| 1997-09-16 | 44.637 |
| 1997-09-17 | 45.346 |
| 1997-09-18 | 44.823 |
| 1997-09-19 | 43.904 |
| 1997-09-20 | 43.382 |
| 1997-09-21 | 43.162 |
| 1997-09-22 | 42.582 |
| 1997-09-23 | 42.441 |
| 1997-09-24 | 42.765 |
| 1997-09-25 | 43.597 |
| 1997-09-26 | 43.299 |
| 1997-09-27 | 43.359 |
| 1997-09-28 | 42.046 |
| 1997-09-29 | 41.486 |
| 1997-09-30 | 42.324 |
| 1997-10-01 | 42.172 |
| 1997-10-02 | 42.442 |
| 1997-10-03 | 42.422 |
| 1997-10-04 | 42.154 |
| 1997-10-05 | 41.275 |
| 1997-10-06 | 41.042 |
| 1997-10-07 | 42.049 |
| 1997-10-08 | 41.803 |
| 1997-10-09 | 42.179 |
| 1997-10-10 | 42.185 |
| 1997-10-11 | 41.089 |
| 1997-10-12 | 40.333 |
| 1997-10-13 | 41.044 |
| 1997-10-14 | 41.17 |
| 1997-10-15 | 41.325 |
| 1997-10-16 | 41.918 |
| 1997-10-17 | 42.179 |
| 1997-10-18 | 42.91 |
| 1997-10-19 | 41.92 |
| 1997-10-20 | 42.683 |
| 1997-10-21 | 43.401 |
| 1997-10-22 | 44.347 |
| 1997-10-23 | 43.77 |
| 1997-10-24 | 45.16 |
| 1997-10-25 | 45.435 |
| 1997-10-26 | 45.859 |
| 1997-10-27 | 46.592 |
| 1997-10-28 | 48.227 |
| 1997-10-29 | 48.926 |
| 1997-10-30 | 48.572 |
| 1997-10-31 | 50.148 |
| 1997-11-01 | 50.799 |
| 1997-11-02 | 50.196 |
| 1997-11-03 | 50.827 |
| 1997-11-04 | 52.076 |
| 1997-11-05 | 52.597 |
| 1997-11-06 | 53.289 |
| 1997-11-07 | 53.505 |
| 1997-11-08 | 55.153 |
| 1997-11-09 | 54.775 |
| 1997-11-10 | 55.858 |
| 1997-11-11 | 56.961 |
| 1997-11-12 | 57.356 |
| 1997-11-13 | 58.529 |
| 1997-11-14 | 58.887 |
| 1997-11-15 | 58.687 |
| 1997-11-16 | 58.683 |
| 1997-11-17 | 58.984 |
| 1997-11-18 | 61.532 |
| 1997-11-19 | 61.928 |
| 1997-11-20 | 62.587 |
| 1997-11-21 | 63.605 |
| 1997-11-22 | 64.257 |
| 1997-11-23 | 63.575 |
| 1997-11-24 | 63.852 |
| 1997-11-25 | 64.531 |
| 1997-11-26 | 63.123 |
| 1997-11-27 | 61.584 |
| 1997-11-28 | 60.823 |
| 1997-11-29 | 60.755 |
| 1997-11-30 | 60.066 |
| 1997-12-01 | 60.519 |
| 1997-12-02 | 61.21 |
| 1997-12-03 | 61.226 |
| 1997-12-04 | 59.947 |
| 1997-12-05 | 59.425 |
| 1997-12-06 | 58.198 |
| 1997-12-07 | 57.959 |
| 1997-12-08 | 56.018 |
| 1997-12-09 | 56.167 |
| 1997-12-10 | 55.211 |
| 1997-12-11 | 54.227 |
| 1997-12-12 | 52.96 |
| 1997-12-13 | 51.886 |
| 1997-12-14 | 51.629 |
| 1997-12-15 | 51.118 |
| 1997-12-16 | 51.213 |
| 1997-12-17 | 50.456 |
| 1997-12-18 | 48.885 |
| 1997-12-19 | 48.283 |
| 1997-12-20 | 47.077 |
| 1997-12-21 | 44.971 |
| 1997-12-22 | 44.402 |
| 1997-12-23 | 44.579 |
| 1997-12-24 | 43.761 |
| 1997-12-25 | 44.07 |
| 1997-12-26 | 44.768 |
| 1997-12-27 | 45.431 |
| 1997-12-28 | 45.649 |
| 1997-12-29 | 44.689 |
| 1997-12-30 | 43.709 |
| 1997-12-31 | 43.267 |
| 1998-01-01 | 42.456 |
| 1998-01-02 | 42.727 |
| 1998-01-03 | 43.079 |
| 1998-01-04 | 43.013 |
| 1998-01-05 | 44.037 |
| 1998-01-06 | 44.533 |
| 1998-01-07 | 44.629 |
| 1998-01-08 | 45.591 |
| 1998-01-09 | 45.887 |
| 1998-01-10 | 46.555 |
| 1998-01-11 | 46.499 |
| 1998-01-12 | 47.021 |
| 1998-01-13 | 48.237 |
| 1998-01-14 | 49.458 |
| 1998-01-15 | 49.316 |
| 1998-01-16 | 50.141 |
| 1998-01-17 | 50.912 |
| 1998-01-18 | 50.727 |
| 1998-01-19 | 51.272 |
| 1998-01-20 | 52.867 |
| 1998-01-21 | 53.323 |
| 1998-01-22 | 52.43 |
| 1998-01-23 | 52.152 |
| 1998-01-24 | 51.457 |
| 1998-01-25 | 50.552 |
| 1998-01-26 | 51.085 |
| 1998-01-27 | 51.976 |
| 1998-01-28 | 52.907 |
| 1998-01-29 | 54.23 |
| 1998-01-30 | 53.651 |
| 1998-01-31 | 53.88 |
| 1998-02-01 | 53.241 |
| 1998-02-02 | 54.002 |
| 1998-02-03 | 54.932 |
| 1998-02-04 | 55.827 |
| 1998-02-05 | 56.829 |
| 1998-02-06 | 57.188 |
| 1998-02-07 | 56.799 |
| 1998-02-08 | 57.119 |
| 1998-02-09 | 57.867 |
| 1998-02-10 | 59.815 |
| 1998-02-11 | 61.206 |
| 1998-02-12 | 60.139 |
| 1998-02-13 | 59.835 |
| 1998-02-14 | 60.649 |
| 1998-02-15 | 60.151 |
| 1998-02-16 | 60.928 |
| 1998-02-17 | 62.979 |
| 1998-02-18 | 64.413 |
| 1998-02-19 | 64.923 |
| 1998-02-20 | 65.744 |
| 1998-02-21 | 66.855 |
| 1998-02-22 | 68.359 |
| 1998-02-23 | 70.293 |
| 1998-02-24 | 73.989 |
| 1998-02-25 | 74.89 |
| 1998-02-26 | 74.269 |
| 1998-02-27 | 75.484 |
| 1998-02-28 | 74.82 |
| 1998-03-01 | 75.498 |
| 1998-03-02 | 76.568 |
| 1998-03-03 | 77.751 |
| 1998-03-04 | 77.132 |
| 1998-03-05 | 76.84 |
| 1998-03-06 | 75.914 |
| 1998-03-07 | 75.777 |
| 1998-03-08 | 76.385 |
| 1998-03-09 | 76.994 |
| 1998-03-10 | 77.668 |
| 1998-03-11 | 76.202 |
| 1998-03-12 | 75.886 |
| 1998-03-13 | 75.367 |
| 1998-03-14 | 74.596 |
| 1998-03-15 | 73.016 |
| 1998-03-16 | 72.096 |
| 1998-03-17 | 72.072 |
| 1998-03-18 | 70.968 |
| 1998-03-19 | 69.354 |
| 1998-03-20 | 67.644 |
| 1998-03-21 | 65.88 |
| 1998-03-22 | 64.522 |
| 1998-03-23 | 64.395 |
| 1998-03-24 | 64.169 |
| 1998-03-25 | 62.637 |
| 1998-03-26 | 60.077 |
| 1998-03-27 | 58.73 |
| 1998-03-28 | 58.861 |
| 1998-03-29 | 56.842 |
| 1998-03-30 | 57.579 |
| 1998-03-31 | 57.39 |
| 1998-04-01 | 56.71 |
| 1998-04-02 | 56.425 |
| 1998-04-03 | 56.253 |
| 1998-04-04 | 55.998 |
| 1998-04-05 | 54.747 |
| 1998-04-06 | 53.788 |
| 1998-04-07 | 53.794 |
| 1998-04-08 | 52.192 |
| 1998-04-09 | 51.189 |
| 1998-04-10 | 51.706 |
| 1998-04-11 | 49.718 |
| 1998-04-12 | 47.577 |
| 1998-04-13 | 48.312 |
| 1998-04-14 | 49.917 |
| 1998-04-15 | 50.038 |
| 1998-04-16 | 49.434 |
| 1998-04-17 | 50.054 |
| 1998-04-18 | 49.695 |
| 1998-04-19 | 49.354 |
| 1998-04-20 | 49.045 |
| 1998-04-21 | 49.837 |
| 1998-04-22 | 49.024 |
| 1998-04-23 | 49.037 |
| 1998-04-24 | 49.401 |
| 1998-04-25 | 49.257 |
| 1998-04-26 | 48.833 |
| 1998-04-27 | 49.424 |
| 1998-04-28 | 50.788 |
| 1998-04-29 | 50.201 |
| 1998-04-30 | 50.222 |
| 1998-05-01 | 51.06 |
| 1998-05-02 | 50.251 |
| 1998-05-03 | 50.066 |
| 1998-05-04 | 51.103 |
| 1998-05-05 | 52.475 |
| 1998-05-06 | 52.823 |
| 1998-05-07 | 52.742 |
| 1998-05-08 | 54.044 |
| 1998-05-09 | 54.891 |
| 1998-05-10 | 54.582 |
| 1998-05-11 | 57.073 |
| 1998-05-12 | 61.541 |
| 1998-05-13 | 66.425 |
| 1998-05-14 | 69.666 |
| 1998-05-15 | 72.873 |
| 1998-05-16 | 76.174 |
| 1998-05-17 | 76.964 |
| 1998-05-18 | 79.309 |
| 1998-05-19 | 81.967 |
| 1998-05-20 | 84.168 |
| 1998-05-21 | 84.83 |
| 1998-05-22 | 85.836 |
| 1998-05-23 | 86.548 |
| 1998-05-24 | 85.602 |
| 1998-05-25 | 86.342 |
| 1998-05-26 | 88.135 |
| 1998-05-27 | 89.039 |
| 1998-05-28 | 89.219 |
| 1998-05-29 | 92.774 |
| 1998-05-30 | 94.246 |
| 1998-05-31 | 94.756 |
| 1998-06-01 | 97.079 |
| 1998-06-02 | 98.103 |
| 1998-06-03 | 97.832 |
| 1998-06-04 | 98.493 |
| 1998-06-05 | 99.312 |
| 1998-06-06 | 99.215 |
| 1998-06-07 | 99.399 |
| 1998-06-08 | 101.484 |
| 1998-06-09 | 102.334 |
| 1998-06-10 | 102.71 |
| 1998-06-11 | 100.864 |
| 1998-06-12 | 97.784 |
| 1998-06-13 | 95.345 |
| 1998-06-14 | 92.417 |
| 1998-06-15 | 90.941 |
| 1998-06-16 | 91.321 |
| 1998-06-17 | 89.431 |
| 1998-06-18 | 87.947 |
| 1998-06-19 | 88.012 |
| 1998-06-20 | 86.771 |
| 1998-06-21 | 86.038 |
| 1998-06-22 | 84.737 |
| 1998-06-23 | 85.509 |
| 1998-06-24 | 85.691 |
| 1998-06-25 | 85.106 |
| 1998-06-26 | 83.937 |
| 1998-06-27 | 82.611 |
| 1998-06-28 | 78.713 |
| 1998-06-29 | 77.114 |
| 1998-06-30 | 75.439 |
| 1998-07-01 | 73.971 |
| 1998-07-02 | 73.348 |
| 1998-07-03 | 73.017 |
| 1998-07-04 | 72.37 |
| 1998-07-05 | 70.904 |
| 1998-07-06 | 70.667 |
| 1998-07-07 | 70.261 |
| 1998-07-08 | 68.396 |
| 1998-07-09 | 67.774 |
| 1998-07-10 | 66.345 |
| 1998-07-11 | 64.709 |
| 1998-07-12 | 62.21 |
| 1998-07-13 | 60.88 |
| 1998-07-14 | 59.841 |
| 1998-07-15 | 59.18 |
| 1998-07-16 | 57.846 |
| 1998-07-17 | 57.1 |
| 1998-07-18 | 55.996 |
| 1998-07-19 | 54.14 |
| 1998-07-20 | 54.296 |
| 1998-07-21 | 54.271 |
| 1998-07-22 | 54.553 |
| 1998-07-23 | 53.851 |
| 1998-07-24 | 52.561 |
| 1998-07-25 | 51.727 |
| 1998-07-26 | 51.891 |
| 1998-07-27 | 52.825 |
| 1998-07-28 | 54.039 |
| 1998-07-29 | 53.603 |
| 1998-07-30 | 54.399 |
| 1998-07-31 | 53.828 |
| 1998-08-01 | 53.767 |
| 1998-08-02 | 53.319 |
| 1998-08-03 | 53.857 |
| 1998-08-04 | 56.411 |
| 1998-08-05 | 58.279 |
| 1998-08-06 | 59.458 |
| 1998-08-07 | 59.784 |
| 1998-08-08 | 60.87 |
| 1998-08-09 | 61.783 |
| 1998-08-10 | 63.528 |
| 1998-08-11 | 65.81 |
| 1998-08-12 | 66.891 |
| 1998-08-13 | 67.875 |
| 1998-08-14 | 67.277 |
| 1998-08-15 | 68.143 |
| 1998-08-16 | 69.113 |
| 1998-08-17 | 72.546 |
| 1998-08-18 | 74.274 |
| 1998-08-19 | 75.201 |
| 1998-08-20 | 75.426 |
| 1998-08-21 | 80.235 |
| 1998-08-22 | 85.757 |
| 1998-08-23 | 87.94 |
| 1998-08-24 | 91.117 |
| 1998-08-25 | 93.542 |
| 1998-08-26 | 96.146 |
| 1998-08-27 | 95.815 |
| 1998-08-28 | 97.344 |
| 1998-08-29 | 97.081 |
| 1998-08-30 | 97.511 |
| 1998-08-31 | 97.571 |
| 1998-09-01 | 98.469 |
| 1998-09-02 | 99.255 |
| 1998-09-03 | 97.788 |
| 1998-09-04 | 96.064 |
| 1998-09-05 | 94.847 |
| 1998-09-06 | 94.383 |
| 1998-09-07 | 93.072 |
| 1998-09-08 | 92.181 |
| 1998-09-09 | 90.708 |
| 1998-09-10 | 89.463 |
| 1998-09-11 | 88.846 |
| 1998-09-12 | 89.234 |
| 1998-09-13 | 88.175 |
| 1998-09-14 | 87.618 |
| 1998-09-15 | 87.89 |
| 1998-09-16 | 84.816 |
| 1998-09-17 | 83.768 |
| 1998-09-18 | 82.926 |
| 1998-09-19 | 82.707 |
| 1998-09-20 | 77.169 |
| 1998-09-21 | 71.906 |
| 1998-09-22 | 70.082 |
| 1998-09-23 | 67.488 |
| 1998-09-24 | 65.656 |
| 1998-09-25 | 63.674 |
| 1998-09-26 | 63.153 |
| 1998-09-27 | 61.616 |
| 1998-09-28 | 61.363 |
| 1998-09-29 | 62.125 |
| 1998-09-30 | 61.613 |
| 1998-10-01 | 60.91 |
| 1998-10-02 | 59.531 |
| 1998-10-03 | 58.164 |
| 1998-10-04 | 57.483 |
| 1998-10-05 | 57.593 |
| 1998-10-06 | 57.85 |
| 1998-10-07 | 58.617 |
| 1998-10-08 | 58.351 |
| 1998-10-09 | 59.045 |
| 1998-10-10 | 58.659 |
| 1998-10-11 | 58.069 |
| 1998-10-12 | 56.625 |
| 1998-10-13 | 57.814 |
| 1998-10-14 | 57.407 |
| 1998-10-15 | 57.302 |
| 1998-10-16 | 56.571 |
| 1998-10-17 | 56.473 |
| 1998-10-18 | 55.685 |
| 1998-10-19 | 56.261 |
| 1998-10-20 | 57.999 |
| 1998-10-21 | 58.023 |
| 1998-10-22 | 57.927 |
| 1998-10-23 | 58.451 |
| 1998-10-24 | 57.284 |
| 1998-10-25 | 55.068 |
| 1998-10-26 | 55.913 |
| 1998-10-27 | 56.751 |
| 1998-10-28 | 56.49 |
| 1998-10-29 | 54.999 |
| 1998-10-30 | 55.231 |
| 1998-10-31 | 54.176 |
| 1998-11-01 | 53.681 |
| 1998-11-02 | 55.232 |
| 1998-11-03 | 56.414 |
| 1998-11-04 | 56.596 |
| 1998-11-05 | 56.138 |
| 1998-11-06 | 55.434 |
| 1998-11-07 | 56.44 |
| 1998-11-08 | 55.552 |
| 1998-11-09 | 55.532 |
| 1998-11-10 | 55.569 |
| 1998-11-11 | 56.848 |
| 1998-11-12 | 57.386 |
| 1998-11-13 | 58.758 |
| 1998-11-14 | 60.141 |
| 1998-11-15 | 61.014 |
| 1998-11-16 | 63.575 |
| 1998-11-17 | 65.779 |
| 1998-11-18 | 66.037 |
| 1998-11-19 | 65.13 |
| 1998-11-20 | 64.907 |
| 1998-11-21 | 64.856 |
| 1998-11-22 | 64.299 |
| 1998-11-23 | 65.054 |
| 1998-11-24 | 66.683 |
| 1998-11-25 | 66.223 |
| 1998-11-26 | 65.437 |
| 1998-11-27 | 66.235 |
| 1998-11-28 | 66.081 |
| 1998-11-29 | 66.4 |
| 1998-11-30 | 67.062 |
| 1998-12-01 | 67.141 |
| 1998-12-02 | 66.942 |
| 1998-12-03 | 65.802 |
| 1998-12-04 | 64.99 |
| 1998-12-05 | 64.375 |
| 1998-12-06 | 64.515 |
| 1998-12-07 | 62.444 |
| 1998-12-08 | 63.097 |
| 1998-12-09 | 63.207 |
| 1998-12-10 | 63.898 |
| 1998-12-11 | 62.38 |
| 1998-12-12 | 60.633 |
| 1998-12-13 | 58.812 |
| 1998-12-14 | 56.688 |
| 1998-12-15 | 56.662 |
| 1998-12-16 | 54.983 |
| 1998-12-17 | 56.96 |
| 1998-12-18 | 61.179 |
| 1998-12-19 | 63.11 |
| 1998-12-20 | 64.585 |
| 1998-12-21 | 67.418 |
| 1998-12-22 | 69.144 |
| 1998-12-23 | 70.595 |
| 1998-12-24 | 70.119 |
| 1998-12-25 | 70.418 |
| 1998-12-26 | 72.186 |
| 1998-12-27 | 72.497 |
| 1998-12-28 | 73.281 |
| 1998-12-29 | 74.386 |
| 1998-12-30 | 75.763 |
| 1998-12-31 | 77.297 |
| 1999-01-01 | 77.091 |
| 1999-01-02 | 77.122 |
| 1999-01-03 | 77.246 |
| 1999-01-04 | 77.686 |
| 1999-01-05 | 78.002 |
| 1999-01-06 | 79.133 |
| 1999-01-07 | 79.147 |
| 1999-01-08 | 79.679 |
| 1999-01-09 | 79.217 |
| 1999-01-10 | 80.914 |
| 1999-01-11 | 82.479 |
| 1999-01-12 | 83.704 |
| 1999-01-13 | 84.714 |
| 1999-01-14 | 85.986 |
| 1999-01-15 | 85.62 |
| 1999-01-16 | 83.02 |
| 1999-01-17 | 78.21 |
| 1999-01-18 | 76.43 |
| 1999-01-19 | 75.584 |
| 1999-01-20 | 72.566 |
| 1999-01-21 | 69.588 |
| 1999-01-22 | 68.149 |
| 1999-01-23 | 68.719 |
| 1999-01-24 | 67.925 |
| 1999-01-25 | 68.131 |
| 1999-01-26 | 67.968 |
| 1999-01-27 | 67.592 |
| 1999-01-28 | 66.435 |
| 1999-01-29 | 65.739 |
| 1999-01-30 | 64.863 |
| 1999-01-31 | 64.293 |
| 1999-02-01 | 65.12 |
| 1999-02-02 | 65.616 |
| 1999-02-03 | 65.724 |
| 1999-02-04 | 64.784 |
| 1999-02-05 | 64.256 |
| 1999-02-06 | 63.499 |
| 1999-02-07 | 62.767 |
| 1999-02-08 | 62.104 |
| 1999-02-09 | 61.442 |
| 1999-02-10 | 61.475 |
| 1999-02-11 | 61.146 |
| 1999-02-12 | 60.739 |
| 1999-02-13 | 59.596 |
| 1999-02-14 | 58.369 |
| 1999-02-15 | 57.947 |
| 1999-02-16 | 58.677 |
| 1999-02-17 | 58.665 |
| 1999-02-18 | 58.086 |
| 1999-02-19 | 58.076 |
| 1999-02-20 | 58.841 |
| 1999-02-21 | 58.053 |
| 1999-02-22 | 59.384 |
| 1999-02-23 | 60.922 |
| 1999-02-24 | 59.487 |
| 1999-02-25 | 58.956 |
| 1999-02-26 | 59.883 |
| 1999-02-27 | 59.543 |
| 1999-02-28 | 58.541 |
| 1999-03-01 | 59.448 |
| 1999-03-02 | 60.837 |
| 1999-03-03 | 60.979 |
| 1999-03-04 | 61.117 |
| 1999-03-05 | 60.684 |
| 1999-03-06 | 61.187 |
| 1999-03-07 | 61.369 |
| 1999-03-08 | 62.267 |
| 1999-03-09 | 62.631 |
| 1999-03-10 | 63.42 |
| 1999-03-11 | 64.996 |
| 1999-03-12 | 64.874 |
| 1999-03-13 | 64.469 |
| 1999-03-14 | 63.779 |
| 1999-03-15 | 64.31 |
| 1999-03-16 | 66.589 |
| 1999-03-17 | 67.265 |
| 1999-03-18 | 66.872 |
| 1999-03-19 | 67.482 |
| 1999-03-20 | 68.179 |
| 1999-03-21 | 68.595 |
| 1999-03-22 | 69.429 |
| 1999-03-23 | 71.247 |
| 1999-03-24 | 71.939 |
| 1999-03-25 | 73.075 |
| 1999-03-26 | 74.798 |
| 1999-03-27 | 76.72 |
| 1999-03-28 | 77.205 |
| 1999-03-29 | 80.017 |
| 1999-03-30 | 82.151 |
| 1999-03-31 | 82.548 |
| 1999-04-01 | 83.714 |
| 1999-04-02 | 84.314 |
| 1999-04-03 | 86.63 |
| 1999-04-04 | 87.316 |
| 1999-04-05 | 90.126 |
| 1999-04-06 | 92.913 |
| 1999-04-07 | 94.48 |
| 1999-04-08 | 96.361 |
| 1999-04-09 | 97.963 |
| 1999-04-10 | 98.501 |
| 1999-04-11 | 98.514 |
| 1999-04-12 | 99.789 |
| 1999-04-13 | 103.113 |
| 1999-04-14 | 104.793 |
| 1999-04-15 | 106.051 |
| 1999-04-16 | 106.779 |
| 1999-04-17 | 107.105 |
| 1999-04-18 | 105.92 |
| 1999-04-19 | 107.517 |
| 1999-04-20 | 110.202 |
| 1999-04-21 | 110.615 |
| 1999-04-22 | 109.558 |
| 1999-04-23 | 107.818 |
| 1999-04-24 | 106.064 |
| 1999-04-25 | 104.693 |
| 1999-04-26 | 104.731 |
| 1999-04-27 | 105.057 |
| 1999-04-28 | 104.377 |
| 1999-04-29 | 105.096 |
| 1999-04-30 | 105.422 |
| 1999-05-01 | 103.495 |
| 1999-05-02 | 102.902 |
| 1999-05-03 | 100.518 |
| 1999-05-04 | 101.152 |
| 1999-05-05 | 99.679 |
| 1999-05-06 | 98.08 |
| 1999-05-07 | 97.989 |
| 1999-05-08 | 96.468 |
| 1999-05-09 | 95.455 |
| 1999-05-10 | 93.446 |
| 1999-05-11 | 93.869 |
| 1999-05-12 | 94.061 |
| 1999-05-13 | 93.174 |
| 1999-05-14 | 91.814 |
| 1999-05-15 | 89.58 |
| 1999-05-16 | 88.529 |
| 1999-05-17 | 88.351 |
| 1999-05-18 | 89.732 |
| 1999-05-19 | 87.568 |
| 1999-05-20 | 85.228 |
| 1999-05-21 | 85.534 |
| 1999-05-22 | 86.744 |
| 1999-05-23 | 85.507 |
| 1999-05-24 | 84.385 |
| 1999-05-25 | 85.78 |
| 1999-05-26 | 86.654 |
| 1999-05-27 | 86.859 |
| 1999-05-28 | 86.583 |
| 1999-05-29 | 84.664 |
| 1999-05-30 | 82.664 |
| 1999-05-31 | 84.185 |
| 1999-06-01 | 84.884 |
| 1999-06-02 | 86.013 |
| 1999-06-03 | 85.714 |
| 1999-06-04 | 85.728 |
| 1999-06-05 | 86.428 |
| 1999-06-06 | 85.514 |
| 1999-06-07 | 86.081 |
| 1999-06-08 | 87.156 |
| 1999-06-09 | 88.389 |
| 1999-06-10 | 88.469 |
| 1999-06-11 | 89.443 |
| 1999-06-12 | 88.21 |
| 1999-06-13 | 87.649 |
| 1999-06-14 | 88.31 |
| 1999-06-15 | 88.7 |
| 1999-06-16 | 89.026 |
| 1999-06-17 | 88.798 |
| 1999-06-18 | 89.865 |
| 1999-06-19 | 88.908 |
| 1999-06-20 | 87.323 |
| 1999-06-21 | 86.349 |
| 1999-06-22 | 86.891 |
| 1999-06-23 | 87.925 |
| 1999-06-24 | 86.948 |
| 1999-06-25 | 85.04 |
| 1999-06-26 | 84.17 |
| 1999-06-27 | 82.155 |
| 1999-06-28 | 82.052 |
| 1999-06-29 | 83.552 |
| 1999-06-30 | 80.963 |
| 1999-07-01 | 80.196 |
| 1999-07-02 | 79.654 |
| 1999-07-03 | 78.569 |
| 1999-07-04 | 76.923 |
| 1999-07-05 | 75.094 |
| 1999-07-06 | 73.618 |
| 1999-07-07 | 72.658 |
| 1999-07-08 | 70.747 |
| 1999-07-09 | 70.22 |
| 1999-07-10 | 69.431 |
| 1999-07-11 | 67.473 |
| 1999-07-12 | 67.986 |
| 1999-07-13 | 68.355 |
| 1999-07-14 | 67.664 |
| 1999-07-15 | 68.123 |
| 1999-07-16 | 67.703 |
| 1999-07-17 | 66.331 |
| 1999-07-18 | 64.749 |
| 1999-07-19 | 65.152 |
| 1999-07-20 | 66.107 |
| 1999-07-21 | 65.903 |
| 1999-07-22 | 65.899 |
| 1999-07-23 | 64.994 |
| 1999-07-24 | 64.019 |
| 1999-07-25 | 62.279 |
| 1999-07-26 | 62.061 |
| 1999-07-27 | 63.523 |
| 1999-07-28 | 62.962 |
| 1999-07-29 | 61.749 |
| 1999-07-30 | 62.001 |
| 1999-07-31 | 61.175 |
| 1999-08-01 | 59.789 |
| 1999-08-02 | 60.237 |
| 1999-08-03 | 61.947 |
| 1999-08-04 | 62.622 |
| 1999-08-05 | 62.432 |
| 1999-08-06 | 62.579 |
| 1999-08-07 | 62.606 |
| 1999-08-08 | 61.95 |
| 1999-08-09 | 63.071 |
| 1999-08-10 | 63.69 |
| 1999-08-11 | 63.181 |
| 1999-08-12 | 62.879 |
| 1999-08-13 | 63.116 |
| 1999-08-14 | 63.295 |
| 1999-08-15 | 61.59 |
| 1999-08-16 | 62.903 |
| 1999-08-17 | 63.827 |
| 1999-08-18 | 64.212 |
| 1999-08-19 | 63.255 |
| 1999-08-20 | 63.107 |
| 1999-08-21 | 62.894 |
| 1999-08-22 | 62.647 |
| 1999-08-23 | 62.816 |
| 1999-08-24 | 64.459 |
| 1999-08-25 | 64.122 |
| 1999-08-26 | 62.867 |
| 1999-08-27 | 63.229 |
| 1999-08-28 | 62.794 |
| 1999-08-29 | 62.571 |
| 1999-08-30 | 63.783 |
| 1999-08-31 | 64.426 |
| 1999-09-01 | 64.39 |
| 1999-09-02 | 63.647 |
| 1999-09-03 | 63.657 |
| 1999-09-04 | 63.728 |
| 1999-09-05 | 62.993 |
| 1999-09-06 | 64.768 |
| 1999-09-07 | 65.76 |
| 1999-09-08 | 65.067 |
| 1999-09-09 | 63.935 |
| 1999-09-10 | 63.519 |
| 1999-09-11 | 63.892 |
| 1999-09-12 | 62.848 |
| 1999-09-13 | 62.867 |
| 1999-09-14 | 65.252 |
| 1999-09-15 | 64.565 |
| 1999-09-16 | 63.617 |
| 1999-09-17 | 63.715 |
| 1999-09-18 | 65.309 |
| 1999-09-19 | 65.258 |
| 1999-09-20 | 67.218 |
| 1999-09-21 | 68.173 |
| 1999-09-22 | 68.893 |
| 1999-09-23 | 68.527 |
| 1999-09-24 | 68.394 |
| 1999-09-25 | 69.511 |
| 1999-09-26 | 70.053 |
| 1999-09-27 | 70.7 |
| 1999-09-28 | 72.141 |
| 1999-09-29 | 71.725 |
| 1999-09-30 | 71.122 |
| 1999-10-01 | 72.292 |
| 1999-10-02 | 73.158 |
| 1999-10-03 | 72.21 |
| 1999-10-04 | 72.526 |
| 1999-10-05 | 73.237 |
| 1999-10-06 | 72.253 |
| 1999-10-07 | 72.27 |
| 1999-10-08 | 72.216 |
| 1999-10-09 | 72.871 |
| 1999-10-10 | 72.117 |
| 1999-10-11 | 73.064 |
| 1999-10-12 | 73.456 |
| 1999-10-13 | 72.417 |
| 1999-10-14 | 72.676 |
| 1999-10-15 | 73.613 |
| 1999-10-16 | 75.566 |
| 1999-10-17 | 75.53 |
| 1999-10-18 | 74.875 |
| 1999-10-19 | 75.53 |
| 1999-10-20 | 73.474 |
| 1999-10-21 | 72.799 |
| 1999-10-22 | 72.554 |
| 1999-10-23 | 71.763 |
| 1999-10-24 | 71.435 |
| 1999-10-25 | 70.72 |
| 1999-10-26 | 72.18 |
| 1999-10-27 | 72.463 |
| 1999-10-28 | 72.569 |
| 1999-10-29 | 72.375 |
| 1999-10-30 | 73.159 |
| 1999-10-31 | 71.463 |
| 1999-11-01 | 70.968 |
| 1999-11-02 | 70.957 |
| 1999-11-03 | 71.023 |
| 1999-11-04 | 70.721 |
| 1999-11-05 | 69.338 |
| 1999-11-06 | 68.189 |
| 1999-11-07 | 66.687 |
| 1999-11-08 | 65.735 |
| 1999-11-09 | 65.936 |
| 1999-11-10 | 64.102 |
| 1999-11-11 | 64.116 |
| 1999-11-12 | 63.048 |
| 1999-11-13 | 61.562 |
| 1999-11-14 | 59.217 |
| 1999-11-15 | 58.571 |
| 1999-11-16 | 58.41 |
| 1999-11-17 | 57.314 |
| 1999-11-18 | 56.64 |
| 1999-11-19 | 56.847 |
| 1999-11-20 | 57.933 |
| 1999-11-21 | 56.865 |
| 1999-11-22 | 57.043 |
| 1999-11-23 | 58.316 |
| 1999-11-24 | 59.273 |
| 1999-11-25 | 57.313 |
| 1999-11-26 | 57.196 |
| 1999-11-27 | 56.403 |
| 1999-11-28 | 55.645 |
| 1999-11-29 | 56.128 |
| 1999-11-30 | 57.847 |
| 1999-12-01 | 56.248 |
| 1999-12-02 | 56.447 |
| 1999-12-03 | 56.36 |
| 1999-12-04 | 56.96 |
| 1999-12-05 | 57.95 |
| 1999-12-06 | 57.925 |
| 1999-12-07 | 59.597 |
| 1999-12-08 | 60.284 |
| 1999-12-09 | 61.293 |
| 1999-12-10 | 62.708 |
| 1999-12-11 | 64.139 |
| 1999-12-12 | 65 |
| 1999-12-13 | 65.774 |
| 1999-12-14 | 68.904 |
| 1999-12-15 | 69.705 |
| 1999-12-16 | 70.103 |
| 1999-12-17 | 70.675 |
| 1999-12-18 | 73.771 |
| 1999-12-19 | 74.437 |
| 1999-12-20 | 75.647 |
| 1999-12-21 | 77.414 |
| 1999-12-22 | 78.798 |
| 1999-12-23 | 78.132 |
| 1999-12-24 | 77.869 |
| 1999-12-25 | 80.503 |
| 1999-12-26 | 81.987 |
| 1999-12-27 | 84.152 |
| 1999-12-28 | 89.053 |
| 1999-12-29 | 90.598 |
| 1999-12-30 | 90.344 |
| 1999-12-31 | 91.606 |
| 2000-01-01 | 93.995 |
| 2000-01-02 | 94.002 |
| 2000-01-03 | 94.99 |
| 2000-01-04 | 95.872 |
| 2000-01-05 | 95.572 |
| 2000-01-06 | 94.736 |
| 2000-01-07 | 93.945 |
| 2000-01-08 | 93.856 |
| 2000-01-09 | 92.508 |
| 2000-01-10 | 91.086 |
| 2000-01-11 | 90.61 |
| 2000-01-12 | 89.559 |
| 2000-01-13 | 88.006 |
| 2000-01-14 | 86.545 |
| 2000-01-15 | 85.745 |
| 2000-01-16 | 85.414 |
| 2000-01-17 | 82.066 |
| 2000-01-18 | 81.782 |
| 2000-01-19 | 80.699 |
| 2000-01-20 | 79.688 |
| 2000-01-21 | 79.196 |
| 2000-01-22 | 79.316 |
| 2000-01-23 | 78.379 |
| 2000-01-24 | 76.719 |
| 2000-01-25 | 74.904 |
| 2000-01-26 | 73.394 |
| 2000-01-27 | 69.379 |
| 2000-01-28 | 66.934 |
| 2000-01-29 | 65.645 |
| 2000-01-30 | 65.352 |
| 2000-01-31 | 63.893 |
| 2000-02-01 | 65.047 |
| 2000-02-02 | 63.814 |
| 2000-02-03 | 62.479 |
| 2000-02-04 | 62.944 |
| 2000-02-05 | 63.28 |
| 2000-02-06 | 63.866 |
| 2000-02-07 | 63.931 |
| 2000-02-08 | 66.153 |
| 2000-02-09 | 66.532 |
| 2000-02-10 | 66.73 |
| 2000-02-11 | 68.111 |
| 2000-02-12 | 68.614 |
| 2000-02-13 | 68.732 |
| 2000-02-14 | 69.517 |
| 2000-02-15 | 70.46 |
| 2000-02-16 | 70.826 |
| 2000-02-17 | 70.782 |
| 2000-02-18 | 69.656 |
| 2000-02-19 | 69.455 |
| 2000-02-20 | 68.465 |
| 2000-02-21 | 67.364 |
| 2000-02-22 | 67.634 |
| 2000-02-23 | 66.413 |
| 2000-02-24 | 65.556 |
| 2000-02-25 | 65.227 |
| 2000-02-26 | 64.618 |
| 2000-02-27 | 64.166 |
| 2000-02-28 | 64.837 |
| 2000-02-29 | 64.405 |
| 2000-03-01 | 63.716 |
| 2000-03-02 | 61.864 |
| 2000-03-03 | 61.454 |
| 2000-03-04 | 61.177 |
| 2000-03-05 | 60.238 |
| 2000-03-06 | 60.03 |
| 2000-03-07 | 59.532 |
| 2000-03-08 | 58.437 |
| 2000-03-09 | 56.456 |
| 2000-03-10 | 55.204 |
| 2000-03-11 | 55.018 |
| 2000-03-12 | 53.474 |
| 2000-03-13 | 52.137 |
| 2000-03-14 | 51.904 |
| 2000-03-15 | 50.754 |
| 2000-03-16 | 50.386 |
| 2000-03-17 | 50.653 |
| 2000-03-18 | 49.924 |
| 2000-03-19 | 49.983 |
| 2000-03-20 | 50.394 |
| 2000-03-21 | 50.853 |
| 2000-03-22 | 51.588 |
| 2000-03-23 | 51.094 |
| 2000-03-24 | 51.113 |
| 2000-03-25 | 51.376 |
| 2000-03-26 | 50.516 |
| 2000-03-27 | 50.802 |
| 2000-03-28 | 52.211 |
| 2000-03-29 | 50.73 |
| 2000-03-30 | 50.791 |
| 2000-03-31 | 50.408 |
| 2000-04-01 | 50.555 |
| 2000-04-02 | 50.48 |
| 2000-04-03 | 50.098 |
| 2000-04-04 | 50.209 |
| 2000-04-05 | 49.153 |
| 2000-04-06 | 48.565 |
| 2000-04-07 | 48.495 |
| 2000-04-08 | 47.114 |
| 2000-04-09 | 47.707 |
| 2000-04-10 | 47.052 |
| 2000-04-11 | 47.709 |
| 2000-04-12 | 48.062 |
| 2000-04-13 | 47.675 |
| 2000-04-14 | 48.058 |
| 2000-04-15 | 47.801 |
| 2000-04-16 | 47.197 |
| 2000-04-17 | 47.475 |
| 2000-04-18 | 47.256 |
| 2000-04-19 | 47.137 |
| 2000-04-20 | 46.426 |
| 2000-04-21 | 45.416 |
| 2000-04-22 | 45.524 |
| 2000-04-23 | 45.508 |
| 2000-04-24 | 47.637 |
| 2000-04-25 | 48.892 |
| 2000-04-26 | 48.392 |
| 2000-04-27 | 47.541 |
| 2000-04-28 | 49.052 |
| 2000-04-29 | 49.531 |
| 2000-04-30 | 49.652 |
| 2000-05-01 | 50.677 |
| 2000-05-02 | 50.442 |
| 2000-05-03 | 51.856 |
| 2000-05-04 | 53.161 |
| 2000-05-05 | 55.388 |
| 2000-05-06 | 57.38 |
| 2000-05-07 | 57.332 |
| 2000-05-08 | 59.748 |
| 2000-05-09 | 61.272 |
| 2000-05-10 | 63.171 |
| 2000-05-11 | 64.102 |
| 2000-05-12 | 65.63 |
| 2000-05-13 | 67.132 |
| 2000-05-14 | 66.376 |
| 2000-05-15 | 66.904 |
| 2000-05-16 | 68.976 |
| 2000-05-17 | 68.308 |
| 2000-05-18 | 70.11 |
| 2000-05-19 | 71.459 |
| 2000-05-20 | 72.397 |
| 2000-05-21 | 73.747 |
| 2000-05-22 | 75.912 |
| 2000-05-23 | 76.998 |
| 2000-05-24 | 76.437 |
| 2000-05-25 | 75.458 |
| 2000-05-26 | 76.555 |
| 2000-05-27 | 76.879 |
| 2000-05-28 | 76.996 |
| 2000-05-29 | 78.649 |
| 2000-05-30 | 79.582 |
| 2000-05-31 | 80.186 |
| 2000-06-01 | 82.584 |
| 2000-06-02 | 82.197 |
| 2000-06-03 | 82.159 |
| 2000-06-04 | 81.622 |
| 2000-06-05 | 82.357 |
| 2000-06-06 | 83.889 |
| 2000-06-07 | 82.948 |
| 2000-06-08 | 81.152 |
| 2000-06-09 | 79.729 |
| 2000-06-10 | 79.677 |
| 2000-06-11 | 78.459 |
| 2000-06-12 | 77.247 |
| 2000-06-13 | 78.623 |
| 2000-06-14 | 77.424 |
| 2000-06-15 | 75.769 |
| 2000-06-16 | 77.294 |
| 2000-06-17 | 75.943 |
| 2000-06-18 | 74.391 |
| 2000-06-19 | 74.431 |
| 2000-06-20 | 73.628 |
| 2000-06-21 | 72.144 |
| 2000-06-22 | 70.735 |
| 2000-06-23 | 68.951 |
| 2000-06-24 | 69.234 |
| 2000-06-25 | 68.804 |
| 2000-06-26 | 68.171 |
| 2000-06-27 | 67.39 |
| 2000-06-28 | 65.685 |
| 2000-06-29 | 64.71 |
| 2000-06-30 | 64.127 |
| 2000-07-01 | 62.436 |
| 2000-07-02 | 61.519 |
| 2000-07-03 | 60.121 |
| 2000-07-04 | 59.888 |
| 2000-07-05 | 58.869 |
| 2000-07-06 | 58.344 |
| 2000-07-07 | 58.305 |
| 2000-07-08 | 57.706 |
| 2000-07-09 | 57.614 |
| 2000-07-10 | 56.694 |
| 2000-07-11 | 56.195 |
| 2000-07-12 | 55.566 |
| 2000-07-13 | 55.248 |
| 2000-07-14 | 56.049 |
| 2000-07-15 | 55.427 |
| 2000-07-16 | 53.646 |
| 2000-07-17 | 53.62 |
| 2000-07-18 | 52.762 |
| 2000-07-19 | 52.625 |
| 2000-07-20 | 53.167 |
| 2000-07-21 | 51.531 |
| 2000-07-22 | 52.132 |
| 2000-07-23 | 51.808 |
| 2000-07-24 | 51.883 |
| 2000-07-25 | 51.491 |
| 2000-07-26 | 51.374 |
| 2000-07-27 | 52.3 |
| 2000-07-28 | 51.541 |
| 2000-07-29 | 52.182 |
| 2000-07-30 | 51.243 |
| 2000-07-31 | 50.712 |
| 2000-08-01 | 51.327 |
| 2000-08-02 | 52.073 |
| 2000-08-03 | 51.328 |
| 2000-08-04 | 50.59 |
| 2000-08-05 | 49.274 |
| 2000-08-06 | 47.432 |
| 2000-08-07 | 47.582 |
| 2000-08-08 | 48.427 |
| 2000-08-09 | 48.256 |
| 2000-08-10 | 48.632 |
| 2000-08-11 | 48.774 |
| 2000-08-12 | 47.991 |
| 2000-08-13 | 46.98 |
| 2000-08-14 | 46.742 |
| 2000-08-15 | 48.185 |
| 2000-08-16 | 48.198 |
| 2000-08-17 | 48.447 |
| 2000-08-18 | 47.428 |
| 2000-08-19 | 46.369 |
| 2000-08-20 | 46.53 |
| 2000-08-21 | 46.002 |
| 2000-08-22 | 46.683 |
| 2000-08-23 | 46.289 |
| 2000-08-24 | 46.114 |
| 2000-08-25 | 46.511 |
| 2000-08-26 | 45.561 |
| 2000-08-27 | 45.846 |
| 2000-08-28 | 46.904 |
| 2000-08-29 | 47.354 |
| 2000-08-30 | 47.694 |
| 2000-08-31 | 47.242 |
| 2000-09-01 | 46.916 |
| 2000-09-02 | 47.525 |
| 2000-09-03 | 46.951 |
| 2000-09-04 | 47.559 |
| 2000-09-05 | 48.947 |
| 2000-09-06 | 49.587 |
| 2000-09-07 | 48.482 |
| 2000-09-08 | 47.736 |
| 2000-09-09 | 47.821 |
| 2000-09-10 | 47.829 |
| 2000-09-11 | 48.525 |
| 2000-09-12 | 49.695 |
| 2000-09-13 | 50.334 |
| 2000-09-14 | 49.886 |
| 2000-09-15 | 49.995 |
| 2000-09-16 | 51.159 |
| 2000-09-17 | 51.967 |
| 2000-09-18 | 54.023 |
| 2000-09-19 | 55.241 |
| 2000-09-20 | 55.693 |
| 2000-09-21 | 55.827 |
| 2000-09-22 | 56.279 |
| 2000-09-23 | 56.474 |
| 2000-09-24 | 56.067 |
| 2000-09-25 | 56.029 |
| 2000-09-26 | 56.292 |
| 2000-09-27 | 54.449 |
| 2000-09-28 | 53.492 |
| 2000-09-29 | 52.648 |
| 2000-09-30 | 52.758 |
| 2000-10-01 | 52.503 |
| 2000-10-02 | 51.685 |
| 2000-10-03 | 52.611 |
| 2000-10-04 | 53.231 |
| 2000-10-05 | 52.875 |
| 2000-10-06 | 53.792 |
| 2000-10-07 | 55.488 |
| 2000-10-08 | 56.434 |
| 2000-10-09 | 58.286 |
| 2000-10-10 | 60.455 |
| 2000-10-11 | 61.203 |
| 2000-10-12 | 59.838 |
| 2000-10-13 | 64.34 |
| 2000-10-14 | 66.468 |
| 2000-10-15 | 67.146 |
| 2000-10-16 | 68.335 |
| 2000-10-17 | 69.669 |
| 2000-10-18 | 69.076 |
| 2000-10-19 | 69.346 |
| 2000-10-20 | 69.261 |
| 2000-10-21 | 70.8 |
| 2000-10-22 | 70.44 |
| 2000-10-23 | 71.572 |
| 2000-10-24 | 72.454 |
| 2000-10-25 | 72.499 |
| 2000-10-26 | 72.816 |
| 2000-10-27 | 72.486 |
| 2000-10-28 | 73.732 |
| 2000-10-29 | 73.978 |
| 2000-10-30 | 74.457 |
| 2000-10-31 | 76.085 |
| 2000-11-01 | 76.473 |
| 2000-11-02 | 75.684 |
| 2000-11-03 | 75.821 |
| 2000-11-04 | 75.177 |
| 2000-11-05 | 73.119 |
| 2000-11-06 | 71.904 |
| 2000-11-07 | 71.232 |
| 2000-11-08 | 69.412 |
| 2000-11-09 | 67.434 |
| 2000-11-10 | 65.82 |
| 2000-11-11 | 66.057 |
| 2000-11-12 | 60.362 |
| 2000-11-13 | 57.882 |
| 2000-11-14 | 56.787 |
| 2000-11-15 | 54.2 |
| 2000-11-16 | 51.763 |
| 2000-11-17 | 50.165 |
| 2000-11-18 | 49.06 |
| 2000-11-19 | 48.751 |
| 2000-11-20 | 47.486 |
| 2000-11-21 | 47.666 |
| 2000-11-22 | 47.159 |
| 2000-11-23 | 46.87 |
| 2000-11-24 | 48.034 |
| 2000-11-25 | 47.444 |
| 2000-11-26 | 47.265 |
| 2000-11-27 | 46.55 |
| 2000-11-28 | 47.189 |
| 2000-11-29 | 46.787 |
| 2000-11-30 | 45.44 |
| 2000-12-01 | 44.587 |
| 2000-12-02 | 44.693 |
| 2000-12-03 | 43.768 |
| 2000-12-04 | 44.477 |
| 2000-12-05 | 44.72 |
| 2000-12-06 | 44.563 |
| 2000-12-07 | 43.943 |
| 2000-12-08 | 43.581 |
| 2000-12-09 | 43.122 |
| 2000-12-10 | 44.021 |
| 2000-12-11 | 44.812 |
| 2000-12-12 | 45.238 |
| 2000-12-13 | 45.474 |
| 2000-12-14 | 45.294 |
| 2000-12-15 | 46.158 |
| 2000-12-16 | 46.509 |
| 2000-12-17 | 46.834 |
| 2000-12-18 | 47.472 |
| 2000-12-19 | 47.404 |
| 2000-12-20 | 47.822 |
| 2000-12-21 | 48.539 |
| 2000-12-22 | 47.501 |
| 2000-12-23 | 46.336 |
| 2000-12-24 | 45.485 |
| 2000-12-25 | 45.061 |
| 2000-12-26 | 45.412 |
| 2000-12-27 | 46.184 |
| 2000-12-28 | 46.084 |
| 2000-12-29 | 46.268 |
| 2000-12-30 | 45.934 |
| 2000-12-31 | 46.702 |
| 2001-01-01 | 46.761 |
| 2001-01-02 | 46.78 |
| 2001-01-03 | 46.366 |
| 2001-01-04 | 47.286 |
| 2001-01-05 | 47.86 |
| 2001-01-06 | 48.753 |
| 2001-01-07 | 48.515 |
| 2001-01-08 | 49.419 |
| 2001-01-09 | 49.373 |
| 2001-01-10 | 48.89 |
| 2001-01-11 | 49.642 |
| 2001-01-12 | 49.829 |
| 2001-01-13 | 49.998 |
| 2001-01-14 | 49.976 |
| 2001-01-15 | 50.519 |
| 2001-01-16 | 51.364 |
| 2001-01-17 | 50.887 |
| 2001-01-18 | 50.83 |
| 2001-01-19 | 49.892 |
| 2001-01-20 | 49.74 |
| 2001-01-21 | 49.011 |
| 2001-01-22 | 49.242 |
| 2001-01-23 | 49.489 |
| 2001-01-24 | 50.11 |
| 2001-01-25 | 50.022 |
| 2001-01-26 | 49.21 |
| 2001-01-27 | 48.968 |
| 2001-01-28 | 48.429 |
| 2001-01-29 | 48.43 |
| 2001-01-30 | 47.329 |
| 2001-01-31 | 47.339 |
| 2001-02-01 | 47.25 |
| 2001-02-02 | 48.161 |
| 2001-02-03 | 47.11 |
| 2001-02-04 | 46.555 |
| 2001-02-05 | 46.266 |
| 2001-02-06 | 47.22 |
| 2001-02-07 | 46.253 |
| 2001-02-08 | 45.379 |
| 2001-02-09 | 45.102 |
| 2001-02-10 | 43.942 |
| 2001-02-11 | 43.462 |
| 2001-02-12 | 43.766 |
| 2001-02-13 | 43.442 |
| 2001-02-14 | 43.075 |
| 2001-02-15 | 42.754 |
| 2001-02-16 | 42.431 |
| 2001-02-17 | 44.987 |
| 2001-02-18 | 44.977 |
| 2001-02-19 | 47.721 |
| 2001-02-20 | 50.268 |
| 2001-02-21 | 52.006 |
| 2001-02-22 | 51.95 |
| 2001-02-23 | 52.487 |
| 2001-02-24 | 53.61 |
| 2001-02-25 | 53.548 |
| 2001-02-26 | 53.028 |
| 2001-02-27 | 53.555 |
| 2001-02-28 | 54.685 |
| 2001-03-01 | 55.625 |
| 2001-03-02 | 56.891 |
| 2001-03-03 | 57.106 |
| 2001-03-04 | 56.835 |
| 2001-03-05 | 58.105 |
| 2001-03-06 | 58.18 |
| 2001-03-07 | 58.78 |
| 2001-03-08 | 58.059 |
| 2001-03-09 | 58.722 |
| 2001-03-10 | 59.574 |
| 2001-03-11 | 59.851 |
| 2001-03-12 | 60.915 |
| 2001-03-13 | 62.303 |
| 2001-03-14 | 62.652 |
| 2001-03-15 | 62.905 |
| 2001-03-16 | 64.6 |
| 2001-03-17 | 65.404 |
| 2001-03-18 | 65.072 |
| 2001-03-19 | 63.008 |
| 2001-03-20 | 63.267 |
| 2001-03-21 | 60.383 |
| 2001-03-22 | 59.393 |
| 2001-03-23 | 58.783 |
| 2001-03-24 | 58.696 |
| 2001-03-25 | 58.713 |
| 2001-03-26 | 59.207 |
| 2001-03-27 | 60.709 |
| 2001-03-28 | 61.444 |
| 2001-03-29 | 61.765 |
| 2001-03-30 | 61.768 |
| 2001-03-31 | 62.329 |
| 2001-04-01 | 60.754 |
| 2001-04-02 | 60.429 |
| 2001-04-03 | 60.602 |
| 2001-04-04 | 60.419 |
| 2001-04-05 | 60.483 |
| 2001-04-06 | 60.087 |
| 2001-04-07 | 59.675 |
| 2001-04-08 | 59.144 |
| 2001-04-09 | 58.242 |
| 2001-04-10 | 58.271 |
| 2001-04-11 | 57.455 |
| 2001-04-12 | 56.19 |
| 2001-04-13 | 55.23 |
| 2001-04-14 | 54.793 |
| 2001-04-15 | 53.523 |
| 2001-04-16 | 53.588 |
| 2001-04-17 | 55.184 |
| 2001-04-18 | 55.247 |
| 2001-04-19 | 54.669 |
| 2001-04-20 | 54.008 |
| 2001-04-21 | 53.353 |
| 2001-04-22 | 52.446 |
| 2001-04-23 | 52.128 |
| 2001-04-24 | 51.318 |
| 2001-04-25 | 51.16 |
| 2001-04-26 | 50.384 |
| 2001-04-27 | 50.558 |
| 2001-04-28 | 49.897 |
| 2001-04-29 | 49.75 |
| 2001-04-30 | 49.027 |
| 2001-05-01 | 49.177 |
| 2001-05-02 | 50.596 |
| 2001-05-03 | 51.002 |
| 2001-05-04 | 52.012 |
| 2001-05-05 | 51.813 |
| 2001-05-06 | 51.753 |
| 2001-05-07 | 52.853 |
| 2001-05-08 | 54.613 |
| 2001-05-09 | 56.561 |
| 2001-05-10 | 56.462 |
| 2001-05-11 | 57.313 |
| 2001-05-12 | 57.388 |
| 2001-05-13 | 57.818 |
| 2001-05-14 | 58.06 |
| 2001-05-15 | 57.573 |
| 2001-05-16 | 56.607 |
| 2001-05-17 | 56.565 |
| 2001-05-18 | 56.675 |
| 2001-05-19 | 57.2 |
| 2001-05-20 | 57.502 |
| 2001-05-21 | 57.781 |
| 2001-05-22 | 58.581 |
| 2001-05-23 | 58.569 |
| 2001-05-24 | 58.75 |
| 2001-05-25 | 57.675 |
| 2001-05-26 | 58.147 |
| 2001-05-27 | 57.645 |
| 2001-05-28 | 59.003 |
| 2001-05-29 | 59.292 |
| 2001-05-30 | 60.025 |
| 2001-05-31 | 60.514 |
| 2001-06-01 | 60.124 |
| 2001-06-02 | 60.721 |
| 2001-06-03 | 60.131 |
| 2001-06-04 | 61.208 |
| 2001-06-05 | 62.348 |
| 2001-06-06 | 61.974 |
| 2001-06-07 | 61.24 |
| 2001-06-08 | 60.54 |
| 2001-06-09 | 61.214 |
| 2001-06-10 | 61.745 |
| 2001-06-11 | 63.38 |
| 2001-06-12 | 64.941 |
| 2001-06-13 | 66.259 |
| 2001-06-14 | 67.157 |
| 2001-06-15 | 67.554 |
| 2001-06-16 | 67.71 |
| 2001-06-17 | 66.967 |
| 2001-06-18 | 67.838 |
| 2001-06-19 | 68.743 |
| 2001-06-20 | 70.161 |
| 2001-06-21 | 71.075 |
| 2001-06-22 | 71.044 |
| 2001-06-23 | 72.776 |
| 2001-06-24 | 72.708 |
| 2001-06-25 | 72.431 |
| 2001-06-26 | 73.201 |
| 2001-06-27 | 72.777 |
| 2001-06-28 | 72.495 |
| 2001-06-29 | 71.867 |
| 2001-06-30 | 70.942 |
| 2001-07-01 | 69.681 |
| 2001-07-02 | 69.855 |
| 2001-07-03 | 70.123 |
| 2001-07-04 | 69.924 |
| 2001-07-05 | 70.02 |
| 2001-07-06 | 70.584 |
| 2001-07-07 | 70.122 |
| 2001-07-08 | 69.425 |
| 2001-07-09 | 68.195 |
| 2001-07-10 | 67.172 |
| 2001-07-11 | 65.639 |
| 2001-07-12 | 63.636 |
| 2001-07-13 | 62.725 |
| 2001-07-14 | 62.644 |
| 2001-07-15 | 62.501 |
| 2001-07-16 | 63.21 |
| 2001-07-17 | 63.757 |
| 2001-07-18 | 63.466 |
| 2001-07-19 | 62.789 |
| 2001-07-20 | 61.374 |
| 2001-07-21 | 59.941 |
| 2001-07-22 | 60.396 |
| 2001-07-23 | 58.999 |
| 2001-07-24 | 60.265 |
| 2001-07-25 | 60.814 |
| 2001-07-26 | 60.514 |
| 2001-07-27 | 60.26 |
| 2001-07-28 | 59.906 |
| 2001-07-29 | 59.715 |
| 2001-07-30 | 60.38 |
| 2001-07-31 | 60.814 |
| 2001-08-01 | 59.503 |
| 2001-08-02 | 59.272 |
| 2001-08-03 | 58.056 |
| 2001-08-04 | 56.949 |
| 2001-08-05 | 56.385 |
| 2001-08-06 | 56.456 |
| 2001-08-07 | 55.716 |
| 2001-08-08 | 56.718 |
| 2001-08-09 | 56.987 |
| 2001-08-10 | 58.151 |
| 2001-08-11 | 59.788 |
| 2001-08-12 | 59.972 |
| 2001-08-13 | 61.365 |
| 2001-08-14 | 62.741 |
| 2001-08-15 | 62.601 |
| 2001-08-16 | 62.85 |
| 2001-08-17 | 62.533 |
| 2001-08-18 | 61.971 |
| 2001-08-19 | 62.253 |
| 2001-08-20 | 62.23 |
| 2001-08-21 | 62.288 |
| 2001-08-22 | 62.483 |
| 2001-08-23 | 61.816 |
| 2001-08-24 | 62.081 |
| 2001-08-25 | 62.225 |
| 2001-08-26 | 61.885 |
| 2001-08-27 | 61.934 |
| 2001-08-28 | 63.37 |
| 2001-08-29 | 63.629 |
| 2001-08-30 | 63.884 |
| 2001-08-31 | 64.535 |
| 2001-09-01 | 63.746 |
| 2001-09-02 | 64.063 |
| 2001-09-03 | 64.929 |
| 2001-09-04 | 64.952 |
| 2001-09-05 | 64.536 |
| 2001-09-06 | 64.928 |
| 2001-09-07 | 65.39 |
| 2001-09-08 | 65.028 |
| 2001-09-09 | 62.873 |
| 2001-09-10 | 61.245 |
| 2001-09-11 | 64.132 |
| 2001-09-12 | 84.853 |
| 2001-09-13 | 102.597 |
| 2001-09-14 | 121.766 |
| 2001-09-15 | 138.821 |
| 2001-09-16 | 147.822 |
| 2001-09-17 | 171.112 |
| 2001-09-18 | 197.457 |
| 2001-09-19 | 221.215 |
| 2001-09-20 | 244.823 |
| 2001-09-21 | 271.635 |
| 2001-09-22 | 295.092 |
| 2001-09-23 | 308.29 |
| 2001-09-24 | 332.468 |
| 2001-09-25 | 365.561 |
| 2001-09-26 | 394.684 |
| 2001-09-27 | 418.265 |
| 2001-09-28 | 442.222 |
| 2001-09-29 | 460.84 |
| 2001-09-30 | 472.491 |
| 2001-10-01 | 491.519 |
| 2001-10-02 | 515.576 |
| 2001-10-03 | 540.25 |
| 2001-10-04 | 561.687 |
| 2001-10-05 | 583.314 |
| 2001-10-06 | 601.656 |
| 2001-10-07 | 610.635 |
| 2001-10-08 | 629.804 |
| 2001-10-09 | 652.665 |
| 2001-10-10 | 670.275 |
| 2001-10-11 | 681.694 |
| 2001-10-12 | 677.126 |
| 2001-10-13 | 671.967 |
| 2001-10-14 | 659.38 |
| 2001-10-15 | 655.104 |
| 2001-10-16 | 665.223 |
| 2001-10-17 | 661.021 |
| 2001-10-18 | 650.335 |
| 2001-10-19 | 640.34 |
| 2001-10-20 | 628.453 |
| 2001-10-21 | 607.057 |
| 2001-10-22 | 595.518 |
| 2001-10-23 | 596.903 |
| 2001-10-24 | 587.456 |
| 2001-10-25 | 566.12 |
| 2001-10-26 | 549.572 |
| 2001-10-27 | 533.823 |
| 2001-10-28 | 515.496 |
| 2001-10-29 | 506.195 |
| 2001-10-30 | 504.856 |
| 2001-10-31 | 500.277 |
| 2001-11-01 | 487.937 |
| 2001-11-02 | 473.499 |
| 2001-11-03 | 460.194 |
| 2001-11-04 | 444.787 |
| 2001-11-05 | 434.49 |
| 2001-11-06 | 437.537 |
| 2001-11-07 | 430.976 |
| 2001-11-08 | 416.398 |
| 2001-11-09 | 408.357 |
| 2001-11-10 | 400.955 |
| 2001-11-11 | 391.029 |
| 2001-11-12 | 384.73 |
| 2001-11-13 | 389.918 |
| 2001-11-14 | 387.644 |
| 2001-11-15 | 375.718 |
| 2001-11-16 | 364.861 |
| 2001-11-17 | 355.953 |
| 2001-11-18 | 347.125 |
| 2001-11-19 | 341.879 |
| 2001-11-20 | 345.339 |
| 2001-11-21 | 340.676 |
| 2001-11-22 | 331.891 |
| 2001-11-23 | 324.84 |
| 2001-11-24 | 317.705 |
| 2001-11-25 | 310.377 |
| 2001-11-26 | 306.793 |
| 2001-11-27 | 309.15 |
| 2001-11-28 | 310.005 |
| 2001-11-29 | 304.244 |
| 2001-11-30 | 296.178 |
| 2001-12-01 | 289.274 |
| 2001-12-02 | 282.179 |
| 2001-12-03 | 279.132 |
| 2001-12-04 | 280.957 |
| 2001-12-05 | 280.64 |
| 2001-12-06 | 274.001 |
| 2001-12-07 | 268.435 |
| 2001-12-08 | 266.763 |
| 2001-12-09 | 263.272 |
| 2001-12-10 | 262.339 |
| 2001-12-11 | 260.647 |
| 2001-12-12 | 260.312 |
| 2001-12-13 | 254.182 |
| 2001-12-14 | 251.517 |
| 2001-12-15 | 248.863 |
| 2001-12-16 | 246.49 |
| 2001-12-17 | 246.173 |
| 2001-12-18 | 246.978 |
| 2001-12-19 | 245.07 |
| 2001-12-20 | 242.146 |
| 2001-12-21 | 240.368 |
| 2001-12-22 | 239.107 |
| 2001-12-23 | 235.217 |
| 2001-12-24 | 235.95 |
| 2001-12-25 | 238.333 |
| 2001-12-26 | 237.725 |
| 2001-12-27 | 236.595 |
| 2001-12-28 | 233.351 |
| 2001-12-29 | 234.261 |
| 2001-12-30 | 232.352 |
| 2001-12-31 | 232.524 |
| 2002-01-01 | 236.405 |
| 2002-01-02 | 237.101 |
| 2002-01-03 | 234.302 |
| 2002-01-04 | 231.579 |
| 2002-01-05 | 228.864 |
| 2002-01-06 | 224.109 |
| 2002-01-07 | 222.649 |
| 2002-01-08 | 221.044 |
| 2002-01-09 | 218.936 |
| 2002-01-10 | 218.108 |
| 2002-01-11 | 215.845 |
| 2002-01-12 | 210.672 |
| 2002-01-13 | 204.565 |
| 2002-01-14 | 204.687 |
| 2002-01-15 | 203.504 |
| 2002-01-16 | 200.347 |
| 2002-01-17 | 200.131 |
| 2002-01-18 | 199.46 |
| 2002-01-19 | 196.17 |
| 2002-01-20 | 192.324 |
| 2002-01-21 | 189.835 |
| 2002-01-22 | 190.03 |
| 2002-01-23 | 188.379 |
| 2002-01-24 | 183.684 |
| 2002-01-25 | 182.023 |
| 2002-01-26 | 178.415 |
| 2002-01-27 | 173.395 |
| 2002-01-28 | 170.624 |
| 2002-01-29 | 170.633 |
| 2002-01-30 | 168.887 |
| 2002-01-31 | 166.006 |
| 2002-02-01 | 163.758 |
| 2002-02-02 | 161.57 |
| 2002-02-03 | 158.92 |
| 2002-02-04 | 157.446 |
| 2002-02-05 | 158.815 |
| 2002-02-06 | 158.874 |
| 2002-02-07 | 159.061 |
| 2002-02-08 | 156.828 |
| 2002-02-09 | 154.297 |
| 2002-02-10 | 151.343 |
| 2002-02-11 | 152.906 |
| 2002-02-12 | 154.806 |
| 2002-02-13 | 155.292 |
| 2002-02-14 | 154.226 |
| 2002-02-15 | 154.076 |
| 2002-02-16 | 149.967 |
| 2002-02-17 | 146.657 |
| 2002-02-18 | 145.137 |
| 2002-02-19 | 147.332 |
| 2002-02-20 | 147.493 |
| 2002-02-21 | 147.346 |
| 2002-02-22 | 147.23 |
| 2002-02-23 | 147.1 |
| 2002-02-24 | 145.776 |
| 2002-02-25 | 145.927 |
| 2002-02-26 | 147.037 |
| 2002-02-27 | 146.692 |
| 2002-02-28 | 145.455 |
| 2002-03-01 | 144.984 |
| 2002-03-02 | 142.484 |
| 2002-03-03 | 141.627 |
| 2002-03-04 | 144.861 |
| 2002-03-05 | 146.737 |
| 2002-03-06 | 147.787 |
| 2002-03-07 | 147.448 |
| 2002-03-08 | 146.395 |
| 2002-03-09 | 145.898 |
| 2002-03-10 | 146.432 |
| 2002-03-11 | 149.405 |
| 2002-03-12 | 152.596 |
| 2002-03-13 | 153.829 |
| 2002-03-14 | 153.037 |
| 2002-03-15 | 151.271 |
| 2002-03-16 | 150.069 |
| 2002-03-17 | 148.942 |
| 2002-03-18 | 152.233 |
| 2002-03-19 | 153.962 |
| 2002-03-20 | 156.473 |
| 2002-03-21 | 155.01 |
| 2002-03-22 | 155.248 |
| 2002-03-23 | 152.701 |
| 2002-03-24 | 152.2 |
| 2002-03-25 | 151.338 |
| 2002-03-26 | 152.204 |
| 2002-03-27 | 151.412 |
| 2002-03-28 | 149.285 |
| 2002-03-29 | 149.935 |
| 2002-03-30 | 150.995 |
| 2002-03-31 | 150.921 |
| 2002-04-01 | 151.869 |
| 2002-04-02 | 153.677 |
| 2002-04-03 | 151.93 |
| 2002-04-04 | 154.395 |
| 2002-04-05 | 156.532 |
| 2002-04-06 | 156.364 |
| 2002-04-07 | 156.546 |
| 2002-04-08 | 157.289 |
| 2002-04-09 | 159.562 |
| 2002-04-10 | 157.686 |
| 2002-04-11 | 156.911 |
| 2002-04-12 | 155.605 |
| 2002-04-13 | 156.623 |
| 2002-04-14 | 155.991 |
| 2002-04-15 | 158.302 |
| 2002-04-16 | 161.07 |
| 2002-04-17 | 158.154 |
| 2002-04-18 | 158.656 |
| 2002-04-19 | 159.237 |
| 2002-04-20 | 159.374 |
| 2002-04-21 | 157.512 |
| 2002-04-22 | 158.051 |
| 2002-04-23 | 157.527 |
| 2002-04-24 | 157.494 |
| 2002-04-25 | 156.878 |
| 2002-04-26 | 156.579 |
| 2002-04-27 | 156.641 |
| 2002-04-28 | 155.056 |
| 2002-04-29 | 153.215 |
| 2002-04-30 | 154.135 |
| 2002-05-01 | 153.044 |
| 2002-05-02 | 150.606 |
| 2002-05-03 | 149.28 |
| 2002-05-04 | 145.848 |
| 2002-05-05 | 144.027 |
| 2002-05-06 | 144.703 |
| 2002-05-07 | 145.644 |
| 2002-05-08 | 144.9 |
| 2002-05-09 | 144.779 |
| 2002-05-10 | 142.974 |
| 2002-05-11 | 140.639 |
| 2002-05-12 | 139.56 |
| 2002-05-13 | 138.921 |
| 2002-05-14 | 140.584 |
| 2002-05-15 | 139.92 |
| 2002-05-16 | 139.36 |
| 2002-05-17 | 140.796 |
| 2002-05-18 | 141.576 |
| 2002-05-19 | 138.854 |
| 2002-05-20 | 139.325 |
| 2002-05-21 | 142.109 |
| 2002-05-22 | 145.132 |
| 2002-05-23 | 147.788 |
| 2002-05-24 | 149.544 |
| 2002-05-25 | 151.016 |
| 2002-05-26 | 149.971 |
| 2002-05-27 | 154.413 |
| 2002-05-28 | 157.062 |
| 2002-05-29 | 159.004 |
| 2002-05-30 | 160.078 |
| 2002-05-31 | 160.348 |
| 2002-06-01 | 161.256 |
| 2002-06-02 | 160.598 |
| 2002-06-03 | 162.625 |
| 2002-06-04 | 162.923 |
| 2002-06-05 | 163.569 |
| 2002-06-06 | 162.639 |
| 2002-06-07 | 164.183 |
| 2002-06-08 | 161.808 |
| 2002-06-09 | 161.69 |
| 2002-06-10 | 162.465 |
| 2002-06-11 | 164.782 |
| 2002-06-12 | 164.521 |
| 2002-06-13 | 163.699 |
| 2002-06-14 | 162.838 |
| 2002-06-15 | 164.135 |
| 2002-06-16 | 162.593 |
| 2002-06-17 | 162.809 |
| 2002-06-18 | 163.436 |
| 2002-06-19 | 164.713 |
| 2002-06-20 | 163.558 |
| 2002-06-21 | 161.481 |
| 2002-06-22 | 157.955 |
| 2002-06-23 | 155.403 |
| 2002-06-24 | 155.769 |
| 2002-06-25 | 158.957 |
| 2002-06-26 | 157.095 |
| 2002-06-27 | 155.047 |
| 2002-06-28 | 152.415 |
| 2002-06-29 | 149.644 |
| 2002-06-30 | 147.798 |
| 2002-07-01 | 146.902 |
| 2002-07-02 | 147.664 |
| 2002-07-03 | 144.539 |
| 2002-07-04 | 144.475 |
| 2002-07-05 | 143.567 |
| 2002-07-06 | 144.337 |
| 2002-07-07 | 140.285 |
| 2002-07-08 | 139.603 |
| 2002-07-09 | 139.391 |
| 2002-07-10 | 137.777 |
| 2002-07-11 | 135.201 |
| 2002-07-12 | 134.739 |
| 2002-07-13 | 132.68 |
| 2002-07-14 | 131.683 |
| 2002-07-15 | 127.926 |
| 2002-07-16 | 128.27 |
| 2002-07-17 | 126.016 |
| 2002-07-18 | 125.696 |
| 2002-07-19 | 123.212 |
| 2002-07-20 | 121.905 |
| 2002-07-21 | 121.482 |
| 2002-07-22 | 121.186 |
| 2002-07-23 | 121.1 |
| 2002-07-24 | 120.033 |
| 2002-07-25 | 117.887 |
| 2002-07-26 | 115.83 |
| 2002-07-27 | 115.644 |
| 2002-07-28 | 115.179 |
| 2002-07-29 | 115.472 |
| 2002-07-30 | 118.408 |
| 2002-07-31 | 119.316 |
| 2002-08-01 | 119.116 |
| 2002-08-02 | 120.108 |
| 2002-08-03 | 121.096 |
| 2002-08-04 | 119.71 |
| 2002-08-05 | 118.162 |
| 2002-08-06 | 120.935 |
| 2002-08-07 | 123.161 |
| 2002-08-08 | 125.357 |
| 2002-08-09 | 125.562 |
| 2002-08-10 | 127.27 |
| 2002-08-11 | 125.699 |
| 2002-08-12 | 127.47 |
| 2002-08-13 | 127.686 |
| 2002-08-14 | 127.296 |
| 2002-08-15 | 126.711 |
| 2002-08-16 | 127.056 |
| 2002-08-17 | 126.132 |
| 2002-08-18 | 125.256 |
| 2002-08-19 | 123.66 |
| 2002-08-20 | 124.23 |
| 2002-08-21 | 126.253 |
| 2002-08-22 | 128.069 |
| 2002-08-23 | 128.111 |
| 2002-08-24 | 127.939 |
| 2002-08-25 | 128.488 |
| 2002-08-26 | 128.847 |
| 2002-08-27 | 130.274 |
| 2002-08-28 | 130.54 |
| 2002-08-29 | 128.589 |
| 2002-08-30 | 127.432 |
| 2002-08-31 | 126.807 |
| 2002-09-01 | 125.063 |
| 2002-09-02 | 123.823 |
| 2002-09-03 | 124.095 |
| 2002-09-04 | 126.126 |
| 2002-09-05 | 126.603 |
| 2002-09-06 | 125.944 |
| 2002-09-07 | 125.972 |
| 2002-09-08 | 126.385 |
| 2002-09-09 | 126.218 |
| 2002-09-10 | 130.597 |
| 2002-09-11 | 131.983 |
| 2002-09-12 | 134.362 |
| 2002-09-13 | 141.019 |
| 2002-09-14 | 144.675 |
| 2002-09-15 | 144.927 |
| 2002-09-16 | 146.866 |
| 2002-09-17 | 150.666 |
| 2002-09-18 | 156.338 |
| 2002-09-19 | 157.509 |
| 2002-09-20 | 158.723 |
| 2002-09-21 | 158.441 |
| 2002-09-22 | 157.189 |
| 2002-09-23 | 157.409 |
| 2002-09-24 | 160.73 |
| 2002-09-25 | 164.066 |
| 2002-09-26 | 164.446 |
| 2002-09-27 | 168.878 |
| 2002-09-28 | 169.767 |
| 2002-09-29 | 168.735 |
| 2002-09-30 | 170.251 |
| 2002-10-01 | 172.759 |
| 2002-10-02 | 172.35 |
| 2002-10-03 | 173.145 |
| 2002-10-04 | 172.479 |
| 2002-10-05 | 171.235 |
| 2002-10-06 | 168.845 |
| 2002-10-07 | 169.801 |
| 2002-10-08 | 172.078 |
| 2002-10-09 | 173.793 |
| 2002-10-10 | 172.216 |
| 2002-10-11 | 171.579 |
| 2002-10-12 | 171.95 |
| 2002-10-13 | 166.451 |
| 2002-10-14 | 166.029 |
| 2002-10-15 | 168.284 |
| 2002-10-16 | 168.523 |
| 2002-10-17 | 167.904 |
| 2002-10-18 | 169.065 |
| 2002-10-19 | 168.447 |
| 2002-10-20 | 167.706 |
| 2002-10-21 | 168.806 |
| 2002-10-22 | 170.215 |
| 2002-10-23 | 171.322 |
| 2002-10-24 | 168.917 |
| 2002-10-25 | 167.731 |
| 2002-10-26 | 169.448 |
| 2002-10-27 | 164.882 |
| 2002-10-28 | 166.273 |
| 2002-10-29 | 169.409 |
| 2002-10-30 | 169.227 |
| 2002-10-31 | 168.725 |
| 2002-11-01 | 169.891 |
| 2002-11-02 | 168.599 |
| 2002-11-03 | 165.23 |
| 2002-11-04 | 163.456 |
| 2002-11-05 | 165.544 |
| 2002-11-06 | 164.863 |
| 2002-11-07 | 163.789 |
| 2002-11-08 | 162.18 |
| 2002-11-09 | 161.875 |
| 2002-11-10 | 158.947 |
| 2002-11-11 | 157.739 |
| 2002-11-12 | 158.427 |
| 2002-11-13 | 158.737 |
| 2002-11-14 | 159.466 |
| 2002-11-15 | 160.666 |
| 2002-11-16 | 160.975 |
| 2002-11-17 | 156.687 |
| 2002-11-18 | 157.134 |
| 2002-11-19 | 158.706 |
| 2002-11-20 | 157.271 |
| 2002-11-21 | 157.517 |
| 2002-11-22 | 157.053 |
| 2002-11-23 | 158.21 |
| 2002-11-24 | 155.619 |
| 2002-11-25 | 153.574 |
| 2002-11-26 | 155.253 |
| 2002-11-27 | 154.198 |
| 2002-11-28 | 153.231 |
| 2002-11-29 | 154.723 |
| 2002-11-30 | 156.048 |
| 2002-12-01 | 154.327 |
| 2002-12-02 | 156.875 |
| 2002-12-03 | 160.433 |
| 2002-12-04 | 163.012 |
| 2002-12-05 | 164.924 |
| 2002-12-06 | 166.059 |
| 2002-12-07 | 164.304 |
| 2002-12-08 | 161.899 |
| 2002-12-09 | 160.798 |
| 2002-12-10 | 163.613 |
| 2002-12-11 | 164.046 |
| 2002-12-12 | 164.542 |
| 2002-12-13 | 163.636 |
| 2002-12-14 | 161.654 |
| 2002-12-15 | 157.981 |
| 2002-12-16 | 156.522 |
| 2002-12-17 | 157.673 |
| 2002-12-18 | 158.334 |
| 2002-12-19 | 156.962 |
| 2002-12-20 | 162.043 |
| 2002-12-21 | 163.401 |
| 2002-12-22 | 163.513 |
| 2002-12-23 | 163.88 |
| 2002-12-24 | 168.853 |
| 2002-12-25 | 170.975 |
| 2002-12-26 | 172.252 |
| 2002-12-27 | 174.29 |
| 2002-12-28 | 175.855 |
| 2002-12-29 | 173.854 |
| 2002-12-30 | 173.27 |
| 2002-12-31 | 176.972 |
| 2003-01-01 | 180.51 |
| 2003-01-02 | 180.806 |
| 2003-01-03 | 180.79 |
| 2003-01-04 | 179.535 |
| 2003-01-05 | 177.695 |
| 2003-01-06 | 178.208 |
| 2003-01-07 | 182.239 |
| 2003-01-08 | 184.458 |
| 2003-01-09 | 184.443 |
| 2003-01-10 | 186.695 |
| 2003-01-11 | 187.946 |
| 2003-01-12 | 186.122 |
| 2003-01-13 | 187.621 |
| 2003-01-14 | 191.232 |
| 2003-01-15 | 194.205 |
| 2003-01-16 | 194.242 |
| 2003-01-17 | 195.563 |
| 2003-01-18 | 195.249 |
| 2003-01-19 | 189.263 |
| 2003-01-20 | 190.148 |
| 2003-01-21 | 192.755 |
| 2003-01-22 | 193.988 |
| 2003-01-23 | 191.031 |
| 2003-01-24 | 192.831 |
| 2003-01-25 | 194.143 |
| 2003-01-26 | 193.064 |
| 2003-01-27 | 195.187 |
| 2003-01-28 | 200.079 |
| 2003-01-29 | 203.245 |
| 2003-01-30 | 204.437 |
| 2003-01-31 | 202.708 |
| 2003-02-01 | 203.34 |
| 2003-02-02 | 201.395 |
| 2003-02-03 | 201.553 |
| 2003-02-04 | 203.042 |
| 2003-02-05 | 205.665 |
| 2003-02-06 | 205.731 |
| 2003-02-07 | 207.551 |
| 2003-02-08 | 208.435 |
| 2003-02-09 | 203.956 |
| 2003-02-10 | 203 |
| 2003-02-11 | 206.425 |
| 2003-02-12 | 209.556 |
| 2003-02-13 | 214.278 |
| 2003-02-14 | 217.693 |
| 2003-02-15 | 222.357 |
| 2003-02-16 | 220.051 |
| 2003-02-17 | 224.203 |
| 2003-02-18 | 232.41 |
| 2003-02-19 | 233.488 |
| 2003-02-20 | 233.833 |
| 2003-02-21 | 233.852 |
| 2003-02-22 | 236.605 |
| 2003-02-23 | 234.932 |
| 2003-02-24 | 232.933 |
| 2003-02-25 | 238.514 |
| 2003-02-26 | 239.38 |
| 2003-02-27 | 237.494 |
| 2003-02-28 | 236.936 |
| 2003-03-01 | 234.444 |
| 2003-03-02 | 231.429 |
| 2003-03-03 | 232.926 |
| 2003-03-04 | 240.015 |
| 2003-03-05 | 245.702 |
| 2003-03-06 | 248.33 |
| 2003-03-07 | 252.213 |
| 2003-03-08 | 255.148 |
| 2003-03-09 | 252.715 |
| 2003-03-10 | 256.916 |
| 2003-03-11 | 263.522 |
| 2003-03-12 | 269.083 |
| 2003-03-13 | 270.71 |
| 2003-03-14 | 272.052 |
| 2003-03-15 | 269.852 |
| 2003-03-16 | 265.591 |
| 2003-03-17 | 266.488 |
| 2003-03-18 | 279.24 |
| 2003-03-19 | 287.549 |
| 2003-03-20 | 292.091 |
| 2003-03-21 | 303.846 |
| 2003-03-22 | 310.573 |
| 2003-03-23 | 311.499 |
| 2003-03-24 | 317.312 |
| 2003-03-25 | 327.944 |
| 2003-03-26 | 335.667 |
| 2003-03-27 | 340.469 |
| 2003-03-28 | 343.436 |
| 2003-03-29 | 347.376 |
| 2003-03-30 | 346.249 |
| 2003-03-31 | 354.562 |
| 2003-04-01 | 366.977 |
| 2003-04-02 | 373.033 |
| 2003-04-03 | 374.059 |
| 2003-04-04 | 375.926 |
| 2003-04-05 | 375.119 |
| 2003-04-06 | 371.564 |
| 2003-04-07 | 370.828 |
| 2003-04-08 | 376.026 |
| 2003-04-09 | 376.912 |
| 2003-04-10 | 376.2 |
| 2003-04-11 | 375.258 |
| 2003-04-12 | 374.518 |
| 2003-04-13 | 369.941 |
| 2003-04-14 | 369.762 |
| 2003-04-15 | 371.897 |
| 2003-04-16 | 369.742 |
| 2003-04-17 | 358.911 |
| 2003-04-18 | 348.724 |
| 2003-04-19 | 339.212 |
| 2003-04-20 | 324.911 |
| 2003-04-21 | 316.84 |
| 2003-04-22 | 314.167 |
| 2003-04-23 | 305.598 |
| 2003-04-24 | 294.123 |
| 2003-04-25 | 287.356 |
| 2003-04-26 | 276.854 |
| 2003-04-27 | 268.412 |
| 2003-04-28 | 261.556 |
| 2003-04-29 | 259.971 |
| 2003-04-30 | 252.859 |
| 2003-05-01 | 242.501 |
| 2003-05-02 | 233.344 |
| 2003-05-03 | 226.134 |
| 2003-05-04 | 216.339 |
| 2003-05-05 | 213.481 |
| 2003-05-06 | 211.943 |
| 2003-05-07 | 207.869 |
| 2003-05-08 | 201.384 |
| 2003-05-09 | 195.983 |
| 2003-05-10 | 190.767 |
| 2003-05-11 | 183.599 |
| 2003-05-12 | 181.666 |
| 2003-05-13 | 180.603 |
| 2003-05-14 | 179.258 |
| 2003-05-15 | 177.379 |
| 2003-05-16 | 175.042 |
| 2003-05-17 | 172.477 |
| 2003-05-18 | 168.384 |
| 2003-05-19 | 166.732 |
| 2003-05-20 | 167.7 |
| 2003-05-21 | 167.265 |
| 2003-05-22 | 168.353 |
| 2003-05-23 | 168.517 |
| 2003-05-24 | 167.171 |
| 2003-05-25 | 164.225 |
| 2003-05-26 | 163.71 |
| 2003-05-27 | 163.911 |
| 2003-05-28 | 164.138 |
| 2003-05-29 | 163.027 |
| 2003-05-30 | 160.288 |
| 2003-05-31 | 158.282 |
| 2003-06-01 | 156.015 |
| 2003-06-02 | 156.361 |
| 2003-06-03 | 159.857 |
| 2003-06-04 | 160.219 |
| 2003-06-05 | 160.411 |
| 2003-06-06 | 160.988 |
| 2003-06-07 | 160.257 |
| 2003-06-08 | 156.781 |
| 2003-06-09 | 157.418 |
| 2003-06-10 | 159.7 |
| 2003-06-11 | 158.928 |
| 2003-06-12 | 159.093 |
| 2003-06-13 | 156.302 |
| 2003-06-14 | 151.99 |
| 2003-06-15 | 147.175 |
| 2003-06-16 | 147.87 |
| 2003-06-17 | 149.046 |
| 2003-06-18 | 150.145 |
| 2003-06-19 | 149.141 |
| 2003-06-20 | 148.142 |
| 2003-06-21 | 145.013 |
| 2003-06-22 | 142.427 |
| 2003-06-23 | 142.735 |
| 2003-06-24 | 143.716 |
| 2003-06-25 | 146.173 |
| 2003-06-26 | 147.53 |
| 2003-06-27 | 147.596 |
| 2003-06-28 | 146.585 |
| 2003-06-29 | 145.417 |
| 2003-06-30 | 145.722 |
| 2003-07-01 | 148.006 |
| 2003-07-02 | 148.858 |
| 2003-07-03 | 145.988 |
| 2003-07-04 | 144.795 |
| 2003-07-05 | 141.721 |
| 2003-07-06 | 138.338 |
| 2003-07-07 | 137.185 |
| 2003-07-08 | 140.594 |
| 2003-07-09 | 140.441 |
| 2003-07-10 | 139.607 |
| 2003-07-11 | 137.485 |
| 2003-07-12 | 135.54 |
| 2003-07-13 | 133.852 |
| 2003-07-14 | 135.463 |
| 2003-07-15 | 138.177 |
| 2003-07-16 | 137.118 |
| 2003-07-17 | 136.821 |
| 2003-07-18 | 135.334 |
| 2003-07-19 | 133.54 |
| 2003-07-20 | 132.998 |
| 2003-07-21 | 134.71 |
| 2003-07-22 | 135.479 |
| 2003-07-23 | 136.458 |
| 2003-07-24 | 135.444 |
| 2003-07-25 | 133.223 |
| 2003-07-26 | 131.327 |
| 2003-07-27 | 128.961 |
| 2003-07-28 | 130.238 |
| 2003-07-29 | 132.574 |
| 2003-07-30 | 133.936 |
| 2003-07-31 | 133.268 |
| 2003-08-01 | 132.511 |
| 2003-08-02 | 131.725 |
| 2003-08-03 | 130.617 |
| 2003-08-04 | 133.539 |
| 2003-08-05 | 134.753 |
| 2003-08-06 | 136.866 |
| 2003-08-07 | 135.062 |
| 2003-08-08 | 135.23 |
| 2003-08-09 | 134.284 |
| 2003-08-10 | 134.845 |
| 2003-08-11 | 135.53 |
| 2003-08-12 | 137.39 |
| 2003-08-13 | 138.598 |
| 2003-08-14 | 138.731 |
| 2003-08-15 | 141.281 |
| 2003-08-16 | 141.309 |
| 2003-08-17 | 139.459 |
| 2003-08-18 | 140.398 |
| 2003-08-19 | 141.163 |
| 2003-08-20 | 142.622 |
| 2003-08-21 | 142.04 |
| 2003-08-22 | 140.831 |
| 2003-08-23 | 140.886 |
| 2003-08-24 | 138.015 |
| 2003-08-25 | 138.659 |
| 2003-08-26 | 142.547 |
| 2003-08-27 | 143.562 |
| 2003-08-28 | 142.264 |
| 2003-08-29 | 139.688 |
| 2003-08-30 | 138.662 |
| 2003-08-31 | 136.85 |
| 2003-09-01 | 138.818 |
| 2003-09-02 | 139.977 |
| 2003-09-03 | 139.002 |
| 2003-09-04 | 138.726 |
| 2003-09-05 | 138.096 |
| 2003-09-06 | 136.219 |
| 2003-09-07 | 133.914 |
| 2003-09-08 | 135.446 |
| 2003-09-09 | 136.974 |
| 2003-09-10 | 137.813 |
| 2003-09-11 | 136.249 |
| 2003-09-12 | 134.473 |
| 2003-09-13 | 134.446 |
| 2003-09-14 | 129.328 |
| 2003-09-15 | 128.41 |
| 2003-09-16 | 130.305 |
| 2003-09-17 | 129.755 |
| 2003-09-18 | 128.614 |
| 2003-09-19 | 125.494 |
| 2003-09-20 | 124.701 |
| 2003-09-21 | 123.501 |
| 2003-09-22 | 123.14 |
| 2003-09-23 | 124.206 |
| 2003-09-24 | 124.902 |
| 2003-09-25 | 122.042 |
| 2003-09-26 | 120.53 |
| 2003-09-27 | 118.122 |
| 2003-09-28 | 117.084 |
| 2003-09-29 | 118 |
| 2003-09-30 | 118.718 |
| 2003-10-01 | 116.353 |
| 2003-10-02 | 115.1 |
| 2003-10-03 | 115.128 |
| 2003-10-04 | 114.378 |
| 2003-10-05 | 112.312 |
| 2003-10-06 | 114.183 |
| 2003-10-07 | 115.672 |
| 2003-10-08 | 113.132 |
| 2003-10-09 | 110.445 |
| 2003-10-10 | 109.699 |
| 2003-10-11 | 109.257 |
| 2003-10-12 | 107.664 |
| 2003-10-13 | 106.986 |
| 2003-10-14 | 108.96 |
| 2003-10-15 | 109.018 |
| 2003-10-16 | 108.905 |
| 2003-10-17 | 108.495 |
| 2003-10-18 | 107.016 |
| 2003-10-19 | 106.171 |
| 2003-10-20 | 106.91 |
| 2003-10-21 | 108.779 |
| 2003-10-22 | 110.361 |
| 2003-10-23 | 110.875 |
| 2003-10-24 | 110.3 |
| 2003-10-25 | 108.84 |
| 2003-10-26 | 107.055 |
| 2003-10-27 | 108.193 |
| 2003-10-28 | 109.188 |
| 2003-10-29 | 109.101 |
| 2003-10-30 | 107.551 |
| 2003-10-31 | 108.351 |
| 2003-11-01 | 107.388 |
| 2003-11-02 | 105.314 |
| 2003-11-03 | 107.801 |
| 2003-11-04 | 109.501 |
| 2003-11-05 | 108.619 |
| 2003-11-06 | 107.594 |
| 2003-11-07 | 107.514 |
| 2003-11-08 | 107.713 |
| 2003-11-09 | 107.038 |
| 2003-11-10 | 108.523 |
| 2003-11-11 | 110.971 |
| 2003-11-12 | 109.826 |
| 2003-11-13 | 109.704 |
| 2003-11-14 | 109.321 |
| 2003-11-15 | 107.609 |
| 2003-11-16 | 106.739 |
| 2003-11-17 | 108.253 |
| 2003-11-18 | 110.328 |
| 2003-11-19 | 110.97 |
| 2003-11-20 | 110.209 |
| 2003-11-21 | 111.527 |
| 2003-11-22 | 113.231 |
| 2003-11-23 | 112.155 |
| 2003-11-24 | 114.339 |
| 2003-11-25 | 115.533 |
| 2003-11-26 | 115.672 |
| 2003-11-27 | 115.901 |
| 2003-11-28 | 116.385 |
| 2003-11-29 | 118.007 |
| 2003-11-30 | 117.273 |
| 2003-12-01 | 119.205 |
| 2003-12-02 | 120.851 |
| 2003-12-03 | 121.371 |
| 2003-12-04 | 121.76 |
| 2003-12-05 | 121.855 |
| 2003-12-06 | 122.432 |
| 2003-12-07 | 123.251 |
| 2003-12-08 | 123.228 |
| 2003-12-09 | 121.997 |
| 2003-12-10 | 122.479 |
| 2003-12-11 | 121.06 |
| 2003-12-12 | 122.325 |
| 2003-12-13 | 121.43 |
| 2003-12-14 | 120.37 |
| 2003-12-15 | 122.078 |
| 2003-12-16 | 123.878 |
| 2003-12-17 | 124.002 |
| 2003-12-18 | 121.651 |
| 2003-12-19 | 122.383 |
| 2003-12-20 | 122.795 |
| 2003-12-21 | 119.627 |
| 2003-12-22 | 119.798 |
| 2003-12-23 | 122.156 |
| 2003-12-24 | 123.977 |
| 2003-12-25 | 124.892 |
| 2003-12-26 | 126.4 |
| 2003-12-27 | 125.939 |
| 2003-12-28 | 125.557 |
| 2003-12-29 | 127.594 |
| 2003-12-30 | 131.134 |
| 2003-12-31 | 131.579 |
| 2004-01-01 | 134.699 |
| 2004-01-02 | 134.638 |
| 2004-01-03 | 136.097 |
| 2004-01-04 | 136.856 |
| 2004-01-05 | 136.51 |
| 2004-01-06 | 137.086 |
| 2004-01-07 | 139.287 |
| 2004-01-08 | 140.883 |
| 2004-01-09 | 140.912 |
| 2004-01-10 | 141.345 |
| 2004-01-11 | 139.108 |
| 2004-01-12 | 138.454 |
| 2004-01-13 | 141.03 |
| 2004-01-14 | 139.943 |
| 2004-01-15 | 139.324 |
| 2004-01-16 | 138.078 |
| 2004-01-17 | 138.179 |
| 2004-01-18 | 135.037 |
| 2004-01-19 | 133.21 |
| 2004-01-20 | 132.978 |
| 2004-01-21 | 129.926 |
| 2004-01-22 | 128.138 |
| 2004-01-23 | 125.426 |
| 2004-01-24 | 124.045 |
| 2004-01-25 | 121.618 |
| 2004-01-26 | 121.345 |
| 2004-01-27 | 121.273 |
| 2004-01-28 | 119.435 |
| 2004-01-29 | 117.802 |
| 2004-01-30 | 115.636 |
| 2004-01-31 | 110.819 |
| 2004-02-01 | 108.459 |
| 2004-02-02 | 108.693 |
| 2004-02-03 | 109.223 |
| 2004-02-04 | 111.18 |
| 2004-02-05 | 110.77 |
| 2004-02-06 | 110.492 |
| 2004-02-07 | 109.961 |
| 2004-02-08 | 108.315 |
| 2004-02-09 | 108.683 |
| 2004-02-10 | 110.662 |
| 2004-02-11 | 112.42 |
| 2004-02-12 | 110.618 |
| 2004-02-13 | 111.426 |
| 2004-02-14 | 110.783 |
| 2004-02-15 | 110.916 |
| 2004-02-16 | 111.198 |
| 2004-02-17 | 112.174 |
| 2004-02-18 | 112.314 |
| 2004-02-19 | 113.343 |
| 2004-02-20 | 113.08 |
| 2004-02-21 | 111.96 |
| 2004-02-22 | 111.086 |
| 2004-02-23 | 112.2 |
| 2004-02-24 | 114.198 |
| 2004-02-25 | 116.335 |
| 2004-02-26 | 115.721 |
| 2004-02-27 | 115.623 |
| 2004-02-28 | 113.845 |
| 2004-02-29 | 113.322 |
| 2004-03-01 | 114.948 |
| 2004-03-02 | 114.693 |
| 2004-03-03 | 112.144 |
| 2004-03-04 | 110.858 |
| 2004-03-05 | 109.036 |
| 2004-03-06 | 108.559 |
| 2004-03-07 | 105.484 |
| 2004-03-08 | 104.566 |
| 2004-03-09 | 104.172 |
| 2004-03-10 | 103.458 |
| 2004-03-11 | 102.961 |
| 2004-03-12 | 104.725 |
| 2004-03-13 | 106.568 |
| 2004-03-14 | 105.943 |
| 2004-03-15 | 108.994 |
| 2004-03-16 | 114.246 |
| 2004-03-17 | 117.226 |
| 2004-03-18 | 119.021 |
| 2004-03-19 | 122.814 |
| 2004-03-20 | 123.807 |
| 2004-03-21 | 125.337 |
| 2004-03-22 | 127.941 |
| 2004-03-23 | 132.271 |
| 2004-03-24 | 134.053 |
| 2004-03-25 | 134.313 |
| 2004-03-26 | 134.419 |
| 2004-03-27 | 134.321 |
| 2004-03-28 | 132.477 |
| 2004-03-29 | 134.475 |
| 2004-03-30 | 135.818 |
| 2004-03-31 | 137.67 |
| 2004-04-01 | 139.445 |
| 2004-04-02 | 141.4 |
| 2004-04-03 | 141.851 |
| 2004-04-04 | 141.102 |
| 2004-04-05 | 143.85 |
| 2004-04-06 | 148.091 |
| 2004-04-07 | 149.665 |
| 2004-04-08 | 151.87 |
| 2004-04-09 | 156.559 |
| 2004-04-10 | 158.388 |
| 2004-04-11 | 156.047 |
| 2004-04-12 | 157.348 |
| 2004-04-13 | 159.042 |
| 2004-04-14 | 160.613 |
| 2004-04-15 | 157.962 |
| 2004-04-16 | 157.894 |
| 2004-04-17 | 155.29 |
| 2004-04-18 | 152.567 |
| 2004-04-19 | 153.064 |
| 2004-04-20 | 153.771 |
| 2004-04-21 | 152.844 |
| 2004-04-22 | 150.823 |
| 2004-04-23 | 149.3 |
| 2004-04-24 | 147.73 |
| 2004-04-25 | 145.02 |
| 2004-04-26 | 145.414 |
| 2004-04-27 | 147.334 |
| 2004-04-28 | 148.68 |
| 2004-04-29 | 149.511 |
| 2004-04-30 | 148.73 |
| 2004-05-01 | 146.856 |
| 2004-05-02 | 143.962 |
| 2004-05-03 | 143.542 |
| 2004-05-04 | 144.835 |
| 2004-05-05 | 142.968 |
| 2004-05-06 | 140.593 |
| 2004-05-07 | 140.777 |
| 2004-05-08 | 138.664 |
| 2004-05-09 | 133.117 |
| 2004-05-10 | 131.876 |
| 2004-05-11 | 132.683 |
| 2004-05-12 | 130.516 |
| 2004-05-13 | 129.571 |
| 2004-05-14 | 125.424 |
| 2004-05-15 | 122.971 |
| 2004-05-16 | 120.29 |
| 2004-05-17 | 123.032 |
| 2004-05-18 | 124.126 |
| 2004-05-19 | 122.15 |
| 2004-05-20 | 122.668 |
| 2004-05-21 | 122.334 |
| 2004-05-22 | 120.53 |
| 2004-05-23 | 118.14 |
| 2004-05-24 | 120.057 |
| 2004-05-25 | 121.804 |
| 2004-05-26 | 122.175 |
| 2004-05-27 | 123.589 |
| 2004-05-28 | 122.654 |
| 2004-05-29 | 120.682 |
| 2004-05-30 | 120.83 |
| 2004-05-31 | 123.106 |
| 2004-06-01 | 125.493 |
| 2004-06-02 | 126.929 |
| 2004-06-03 | 128.719 |
| 2004-06-04 | 129.657 |
| 2004-06-05 | 129.485 |
| 2004-06-06 | 127.461 |
| 2004-06-07 | 126.396 |
| 2004-06-08 | 128.914 |
| 2004-06-09 | 129.162 |
| 2004-06-10 | 129.592 |
| 2004-06-11 | 130.952 |
| 2004-06-12 | 130.501 |
| 2004-06-13 | 129.462 |
| 2004-06-14 | 129.347 |
| 2004-06-15 | 130.116 |
| 2004-06-16 | 128.554 |
| 2004-06-17 | 127.535 |
| 2004-06-18 | 129.968 |
| 2004-06-19 | 129.807 |
| 2004-06-20 | 130.194 |
| 2004-06-21 | 133.166 |
| 2004-06-22 | 136.526 |
| 2004-06-23 | 136.672 |
| 2004-06-24 | 136.642 |
| 2004-06-25 | 137.737 |
| 2004-06-26 | 135.981 |
| 2004-06-27 | 134.241 |
| 2004-06-28 | 136.546 |
| 2004-06-29 | 138.08 |
| 2004-06-30 | 136.992 |
| 2004-07-01 | 136.206 |
| 2004-07-02 | 134.091 |
| 2004-07-03 | 131.387 |
| 2004-07-04 | 129.33 |
| 2004-07-05 | 129.484 |
| 2004-07-06 | 129.8 |
| 2004-07-07 | 131.657 |
| 2004-07-08 | 129.899 |
| 2004-07-09 | 130.788 |
| 2004-07-10 | 129.907 |
| 2004-07-11 | 128.345 |
| 2004-07-12 | 130.22 |
| 2004-07-13 | 131.47 |
| 2004-07-14 | 132.557 |
| 2004-07-15 | 134.114 |
| 2004-07-16 | 135.167 |
| 2004-07-17 | 134.425 |
| 2004-07-18 | 131.148 |
| 2004-07-19 | 130.498 |
| 2004-07-20 | 130.441 |
| 2004-07-21 | 129.311 |
| 2004-07-22 | 129.059 |
| 2004-07-23 | 133.075 |
| 2004-07-24 | 132.064 |
| 2004-07-25 | 130.248 |
| 2004-07-26 | 131.718 |
| 2004-07-27 | 133.501 |
| 2004-07-28 | 132.15 |
| 2004-07-29 | 129.894 |
| 2004-07-30 | 131.323 |
| 2004-07-31 | 130.468 |
| 2004-08-01 | 130.411 |
| 2004-08-02 | 133.81 |
| 2004-08-03 | 142.142 |
| 2004-08-04 | 146.215 |
| 2004-08-05 | 149.375 |
| 2004-08-06 | 152.762 |
| 2004-08-07 | 153.173 |
| 2004-08-08 | 152.095 |
| 2004-08-09 | 153.391 |
| 2004-08-10 | 155.105 |
| 2004-08-11 | 153.842 |
| 2004-08-12 | 153.997 |
| 2004-08-13 | 154.095 |
| 2004-08-14 | 150.641 |
| 2004-08-15 | 148.913 |
| 2004-08-16 | 149.737 |
| 2004-08-17 | 150.525 |
| 2004-08-18 | 150.44 |
| 2004-08-19 | 149.945 |
| 2004-08-20 | 148.472 |
| 2004-08-21 | 146.244 |
| 2004-08-22 | 139.07 |
| 2004-08-23 | 138.971 |
| 2004-08-24 | 139.003 |
| 2004-08-25 | 139.303 |
| 2004-08-26 | 137.676 |
| 2004-08-27 | 138.768 |
| 2004-08-28 | 138.958 |
| 2004-08-29 | 137.22 |
| 2004-08-30 | 139.336 |
| 2004-08-31 | 141.58 |
| 2004-09-01 | 139.736 |
| 2004-09-02 | 134.398 |
| 2004-09-03 | 133.302 |
| 2004-09-04 | 132.092 |
| 2004-09-05 | 128.9 |
| 2004-09-06 | 129.191 |
| 2004-09-07 | 130.966 |
| 2004-09-08 | 131.124 |
| 2004-09-09 | 131.926 |
| 2004-09-10 | 133.843 |
| 2004-09-11 | 134.015 |
| 2004-09-12 | 132.724 |
| 2004-09-13 | 134.475 |
| 2004-09-14 | 137.166 |
| 2004-09-15 | 137.904 |
| 2004-09-16 | 138.735 |
| 2004-09-17 | 139.098 |
| 2004-09-18 | 140.212 |
| 2004-09-19 | 140.432 |
| 2004-09-20 | 143.276 |
| 2004-09-21 | 146.942 |
| 2004-09-22 | 149.063 |
| 2004-09-23 | 151.05 |
| 2004-09-24 | 150.738 |
| 2004-09-25 | 151.575 |
| 2004-09-26 | 149.138 |
| 2004-09-27 | 150.654 |
| 2004-09-28 | 153.234 |
| 2004-09-29 | 152.434 |
| 2004-09-30 | 152.97 |
| 2004-10-01 | 153.74 |
| 2004-10-02 | 151.901 |
| 2004-10-03 | 148.529 |
| 2004-10-04 | 149.184 |
| 2004-10-05 | 148.872 |
| 2004-10-06 | 149.757 |
| 2004-10-07 | 148.162 |
| 2004-10-08 | 148.244 |
| 2004-10-09 | 144.686 |
| 2004-10-10 | 141.949 |
| 2004-10-11 | 142.267 |
| 2004-10-12 | 143.273 |
| 2004-10-13 | 142.505 |
| 2004-10-14 | 140.421 |
| 2004-10-15 | 139.43 |
| 2004-10-16 | 137.646 |
| 2004-10-17 | 135.854 |
| 2004-10-18 | 134.166 |
| 2004-10-19 | 134.342 |
| 2004-10-20 | 132.214 |
| 2004-10-21 | 130.685 |
| 2004-10-22 | 128.413 |
| 2004-10-23 | 126.625 |
| 2004-10-24 | 124.089 |
| 2004-10-25 | 123.488 |
| 2004-10-26 | 125.301 |
| 2004-10-27 | 123.224 |
| 2004-10-28 | 121.058 |
| 2004-10-29 | 120.11 |
| 2004-10-30 | 117.177 |
| 2004-10-31 | 116.491 |
| 2004-11-01 | 116.314 |
| 2004-11-02 | 116.761 |
| 2004-11-03 | 114.221 |
| 2004-11-04 | 113.6 |
| 2004-11-05 | 112.976 |
| 2004-11-06 | 111.719 |
| 2004-11-07 | 109.274 |
| 2004-11-08 | 112.317 |
| 2004-11-09 | 115.517 |
| 2004-11-10 | 116.384 |
| 2004-11-11 | 115.973 |
| 2004-11-12 | 116.886 |
| 2004-11-13 | 115.905 |
| 2004-11-14 | 115.373 |
| 2004-11-15 | 118.523 |
| 2004-11-16 | 121.103 |
| 2004-11-17 | 122.924 |
| 2004-11-18 | 122.835 |
| 2004-11-19 | 122.1 |
| 2004-11-20 | 120.804 |
| 2004-11-21 | 120.78 |
| 2004-11-22 | 121.266 |
| 2004-11-23 | 124.491 |
| 2004-11-24 | 126.313 |
| 2004-11-25 | 126.84 |
| 2004-11-26 | 125.65 |
| 2004-11-27 | 124.52 |
| 2004-11-28 | 124.445 |
| 2004-11-29 | 125.483 |
| 2004-11-30 | 124.462 |
| 2004-12-01 | 125.222 |
| 2004-12-02 | 126.322 |
| 2004-12-03 | 126.388 |
| 2004-12-04 | 127.045 |
| 2004-12-05 | 125.351 |
| 2004-12-06 | 126.672 |
| 2004-12-07 | 127.802 |
| 2004-12-08 | 126.092 |
| 2004-12-09 | 123.143 |
| 2004-12-10 | 120.936 |
| 2004-12-11 | 119.431 |
| 2004-12-12 | 117.132 |
| 2004-12-13 | 118.817 |
| 2004-12-14 | 118.238 |
| 2004-12-15 | 116.011 |
| 2004-12-16 | 112.82 |
| 2004-12-17 | 110.817 |
| 2004-12-18 | 110.671 |
| 2004-12-19 | 111.185 |
| 2004-12-20 | 112.443 |
| 2004-12-21 | 113.14 |
| 2004-12-22 | 112.849 |
| 2004-12-23 | 110.496 |
| 2004-12-24 | 108.393 |
| 2004-12-25 | 107.099 |
| 2004-12-26 | 106.358 |
| 2004-12-27 | 107.089 |
| 2004-12-28 | 106.341 |
| 2004-12-29 | 106.087 |
| 2004-12-30 | 106.708 |
| 2004-12-31 | 105.849 |
| 2005-01-01 | 103.186 |
| 2005-01-02 | 102.167 |
| 2005-01-03 | 103.332 |
| 2005-01-04 | 105.281 |
| 2005-01-05 | 104.36 |
| 2005-01-06 | 103.109 |
| 2005-01-07 | 102.542 |
| 2005-01-08 | 100.437 |
| 2005-01-09 | 99.909 |
| 2005-01-10 | 101.322 |
| 2005-01-11 | 102.154 |
| 2005-01-12 | 101.661 |
| 2005-01-13 | 101.827 |
| 2005-01-14 | 100.97 |
| 2005-01-15 | 101.275 |
| 2005-01-16 | 100.035 |
| 2005-01-17 | 99.309 |
| 2005-01-18 | 99.783 |
| 2005-01-19 | 99.098 |
| 2005-01-20 | 98.139 |
| 2005-01-21 | 97.907 |
| 2005-01-22 | 97.87 |
| 2005-01-23 | 96.165 |
| 2005-01-24 | 98.075 |
| 2005-01-25 | 99.284 |
| 2005-01-26 | 99.899 |
| 2005-01-27 | 100.814 |
| 2005-01-28 | 100.604 |
| 2005-01-29 | 99.961 |
| 2005-01-30 | 97.528 |
| 2005-01-31 | 100.765 |
| 2005-02-01 | 103.526 |
| 2005-02-02 | 103.632 |
| 2005-02-03 | 102.546 |
| 2005-02-04 | 102.445 |
| 2005-02-05 | 101.458 |
| 2005-02-06 | 99.94 |
| 2005-02-07 | 102.941 |
| 2005-02-08 | 103.02 |
| 2005-02-09 | 103.878 |
| 2005-02-10 | 105.233 |
| 2005-02-11 | 105.814 |
| 2005-02-12 | 105.654 |
| 2005-02-13 | 104.688 |
| 2005-02-14 | 106.253 |
| 2005-02-15 | 109.279 |
| 2005-02-16 | 110.661 |
| 2005-02-17 | 111.441 |
| 2005-02-18 | 111.412 |
| 2005-02-19 | 111.157 |
| 2005-02-20 | 109.743 |
| 2005-02-21 | 109.591 |
| 2005-02-22 | 111.642 |
| 2005-02-23 | 109.181 |
| 2005-02-24 | 109.314 |
| 2005-02-25 | 108.805 |
| 2005-02-26 | 107.833 |
| 2005-02-27 | 108.91 |
| 2005-02-28 | 109.075 |
| 2005-03-01 | 112.371 |
| 2005-03-02 | 110.861 |
| 2005-03-03 | 109.082 |
| 2005-03-04 | 106.719 |
| 2005-03-05 | 106.081 |
| 2005-03-06 | 104.503 |
| 2005-03-07 | 106.107 |
| 2005-03-08 | 108.185 |
| 2005-03-09 | 106.707 |
| 2005-03-10 | 106.554 |
| 2005-03-11 | 105.213 |
| 2005-03-12 | 103.785 |
| 2005-03-13 | 102.626 |
| 2005-03-14 | 102.315 |
| 2005-03-15 | 103.699 |
| 2005-03-16 | 103.111 |
| 2005-03-17 | 100.88 |
| 2005-03-18 | 99.068 |
| 2005-03-19 | 97.133 |
| 2005-03-20 | 94.899 |
| 2005-03-21 | 96.816 |
| 2005-03-22 | 96.999 |
| 2005-03-23 | 96.688 |
| 2005-03-24 | 96.733 |
| 2005-03-25 | 97 |
| 2005-03-26 | 95.52 |
| 2005-03-27 | 93.366 |
| 2005-03-28 | 93.396 |
| 2005-03-29 | 91.728 |
| 2005-03-30 | 90.732 |
| 2005-03-31 | 88.596 |
| 2005-04-01 | 88.791 |
| 2005-04-02 | 87.858 |
| 2005-04-03 | 88.609 |
| 2005-04-04 | 88.798 |
| 2005-04-05 | 90.477 |
| 2005-04-06 | 90.932 |
| 2005-04-07 | 90.602 |
| 2005-04-08 | 89.657 |
| 2005-04-09 | 89.299 |
| 2005-04-10 | 88.216 |
| 2005-04-11 | 88.463 |
| 2005-04-12 | 88.074 |
| 2005-04-13 | 87.925 |
| 2005-04-14 | 86.892 |
| 2005-04-15 | 86.557 |
| 2005-04-16 | 85.977 |
| 2005-04-17 | 86.06 |
| 2005-04-18 | 87.777 |
| 2005-04-19 | 90.177 |
| 2005-04-20 | 88.228 |
| 2005-04-21 | 87.688 |
| 2005-04-22 | 87.44 |
| 2005-04-23 | 85.801 |
| 2005-04-24 | 84.201 |
| 2005-04-25 | 84.712 |
| 2005-04-26 | 86.438 |
| 2005-04-27 | 86.595 |
| 2005-04-28 | 87.279 |
| 2005-04-29 | 87.088 |
| 2005-04-30 | 86.937 |
| 2005-05-01 | 86.001 |
| 2005-05-02 | 88.992 |
| 2005-05-03 | 89.838 |
| 2005-05-04 | 90.805 |
| 2005-05-05 | 89.704 |
| 2005-05-06 | 88.986 |
| 2005-05-07 | 88.058 |
| 2005-05-08 | 88.638 |
| 2005-05-09 | 90.753 |
| 2005-05-10 | 91.842 |
| 2005-05-11 | 92.127 |
| 2005-05-12 | 94.169 |
| 2005-05-13 | 94.892 |
| 2005-05-14 | 94.376 |
| 2005-05-15 | 93.539 |
| 2005-05-16 | 94.777 |
| 2005-05-17 | 94.545 |
| 2005-05-18 | 93.557 |
| 2005-05-19 | 92.772 |
| 2005-05-20 | 93.943 |
| 2005-05-21 | 93.679 |
| 2005-05-22 | 92.931 |
| 2005-05-23 | 92.469 |
| 2005-05-24 | 93.437 |
| 2005-05-25 | 94.169 |
| 2005-05-26 | 95.252 |
| 2005-05-27 | 97.037 |
| 2005-05-28 | 95.942 |
| 2005-05-29 | 95.928 |
| 2005-05-30 | 97.503 |
| 2005-05-31 | 99.165 |
| 2005-06-01 | 96.847 |
| 2005-06-02 | 95.54 |
| 2005-06-03 | 92.806 |
| 2005-06-04 | 92.694 |
| 2005-06-05 | 90.669 |
| 2005-06-06 | 91.799 |
| 2005-06-07 | 92.011 |
| 2005-06-08 | 90.517 |
| 2005-06-09 | 90.955 |
| 2005-06-10 | 90.494 |
| 2005-06-11 | 88.012 |
| 2005-06-12 | 86.512 |
| 2005-06-13 | 88.458 |
| 2005-06-14 | 88.093 |
| 2005-06-15 | 86.792 |
| 2005-06-16 | 86.601 |
| 2005-06-17 | 86.65 |
| 2005-06-18 | 86.329 |
| 2005-06-19 | 83.931 |
| 2005-06-20 | 84.099 |
| 2005-06-21 | 84.565 |
| 2005-06-22 | 86.053 |
| 2005-06-23 | 86.642 |
| 2005-06-24 | 85.78 |
| 2005-06-25 | 83.198 |
| 2005-06-26 | 80.921 |
| 2005-06-27 | 83.681 |
| 2005-06-28 | 84.249 |
| 2005-06-29 | 82.661 |
| 2005-06-30 | 81.757 |
| 2005-07-01 | 83.329 |
| 2005-07-02 | 82.771 |
| 2005-07-03 | 84.129 |
| 2005-07-04 | 85.843 |
| 2005-07-05 | 88.758 |
| 2005-07-06 | 87.509 |
| 2005-07-07 | 86.024 |
| 2005-07-08 | 98.659 |
| 2005-07-09 | 102.986 |
| 2005-07-10 | 105.449 |
| 2005-07-11 | 110.719 |
| 2005-07-12 | 115.688 |
| 2005-07-13 | 119.392 |
| 2005-07-14 | 122.958 |
| 2005-07-15 | 125.968 |
| 2005-07-16 | 130.338 |
| 2005-07-17 | 131.618 |
| 2005-07-18 | 134.551 |
| 2005-07-19 | 138.941 |
| 2005-07-20 | 143.306 |
| 2005-07-21 | 145.08 |
| 2005-07-22 | 147.89 |
| 2005-07-23 | 150.287 |
| 2005-07-24 | 150.657 |
| 2005-07-25 | 155.938 |
| 2005-07-26 | 160.399 |
| 2005-07-27 | 161.45 |
| 2005-07-28 | 163.866 |
| 2005-07-29 | 166.933 |
| 2005-07-30 | 167.737 |
| 2005-07-31 | 165.99 |
| 2005-08-01 | 169.928 |
| 2005-08-02 | 172.372 |
| 2005-08-03 | 173.675 |
| 2005-08-04 | 175.141 |
| 2005-08-05 | 176.442 |
| 2005-08-06 | 179.774 |
| 2005-08-07 | 167.687 |
| 2005-08-08 | 165.422 |
| 2005-08-09 | 165.112 |
| 2005-08-10 | 162.232 |
| 2005-08-11 | 159.301 |
| 2005-08-12 | 156.791 |
| 2005-08-13 | 153.199 |
| 2005-08-14 | 153.085 |
| 2005-08-15 | 150.556 |
| 2005-08-16 | 148.908 |
| 2005-08-17 | 146.474 |
| 2005-08-18 | 143.317 |
| 2005-08-19 | 141.319 |
| 2005-08-20 | 138.977 |
| 2005-08-21 | 134.805 |
| 2005-08-22 | 132.49 |
| 2005-08-23 | 133.406 |
| 2005-08-24 | 129.56 |
| 2005-08-25 | 126.301 |
| 2005-08-26 | 123.681 |
| 2005-08-27 | 121.02 |
| 2005-08-28 | 117.699 |
| 2005-08-29 | 117.004 |
| 2005-08-30 | 117.741 |
| 2005-08-31 | 114.642 |
| 2005-09-01 | 112.188 |
| 2005-09-02 | 111.38 |
| 2005-09-03 | 109.646 |
| 2005-09-04 | 108.742 |
| 2005-09-05 | 105.871 |
| 2005-09-06 | 105.949 |
| 2005-09-07 | 104.266 |
| 2005-09-08 | 101.993 |
| 2005-09-09 | 100.822 |
| 2005-09-10 | 99.203 |
| 2005-09-11 | 97.269 |
| 2005-09-12 | 98.936 |
| 2005-09-13 | 97.256 |
| 2005-09-14 | 97.6 |
| 2005-09-15 | 98.23 |
| 2005-09-16 | 98.218 |
| 2005-09-17 | 98.201 |
| 2005-09-18 | 95.744 |
| 2005-09-19 | 99.006 |
| 2005-09-20 | 101.774 |
| 2005-09-21 | 103.38 |
| 2005-09-22 | 103.225 |
| 2005-09-23 | 103.84 |
| 2005-09-24 | 102.851 |
| 2005-09-25 | 102.273 |
| 2005-09-26 | 103.045 |
| 2005-09-27 | 104.337 |
| 2005-09-28 | 103.941 |
| 2005-09-29 | 103.47 |
| 2005-09-30 | 103.767 |
| 2005-10-01 | 102.306 |
| 2005-10-02 | 99.814 |
| 2005-10-03 | 99.998 |
| 2005-10-04 | 100.273 |
| 2005-10-05 | 102.447 |
| 2005-10-06 | 101.423 |
| 2005-10-07 | 102.002 |
| 2005-10-08 | 103.222 |
| 2005-10-09 | 103.187 |
| 2005-10-10 | 104.107 |
| 2005-10-11 | 103.956 |
| 2005-10-12 | 102.282 |
| 2005-10-13 | 102.235 |
| 2005-10-14 | 99.919 |
| 2005-10-15 | 98.719 |
| 2005-10-16 | 97.61 |
| 2005-10-17 | 98.521 |
| 2005-10-18 | 100.704 |
| 2005-10-19 | 97.396 |
| 2005-10-20 | 94.95 |
| 2005-10-21 | 93.263 |
| 2005-10-22 | 92.228 |
| 2005-10-23 | 89.73 |
| 2005-10-24 | 89.597 |
| 2005-10-25 | 88.936 |
| 2005-10-26 | 88.175 |
| 2005-10-27 | 87.434 |
| 2005-10-28 | 86.658 |
| 2005-10-29 | 85.43 |
| 2005-10-30 | 84.406 |
| 2005-10-31 | 88.895 |
| 2005-11-01 | 90.473 |
| 2005-11-02 | 88.882 |
| 2005-11-03 | 88.086 |
| 2005-11-04 | 87.201 |
| 2005-11-05 | 86.933 |
| 2005-11-06 | 84.489 |
| 2005-11-07 | 84.133 |
| 2005-11-08 | 84.037 |
| 2005-11-09 | 83.623 |
| 2005-11-10 | 84.689 |
| 2005-11-11 | 87.461 |
| 2005-11-12 | 86.75 |
| 2005-11-13 | 86.311 |
| 2005-11-14 | 86.926 |
| 2005-11-15 | 88.961 |
| 2005-11-16 | 87.971 |
| 2005-11-17 | 86.677 |
| 2005-11-18 | 87.071 |
| 2005-11-19 | 86.495 |
| 2005-11-20 | 85.561 |
| 2005-11-21 | 85.977 |
| 2005-11-22 | 87.374 |
| 2005-11-23 | 87.51 |
| 2005-11-24 | 87.452 |
| 2005-11-25 | 87.249 |
| 2005-11-26 | 85.992 |
| 2005-11-27 | 85.495 |
| 2005-11-28 | 85.737 |
| 2005-11-29 | 85.441 |
| 2005-11-30 | 82.072 |
| 2005-12-01 | 82.176 |
| 2005-12-02 | 81.876 |
| 2005-12-03 | 81.742 |
| 2005-12-04 | 80.305 |
| 2005-12-05 | 81.015 |
| 2005-12-06 | 83.3 |
| 2005-12-07 | 82.564 |
| 2005-12-08 | 82.438 |
| 2005-12-09 | 83.442 |
| 2005-12-10 | 81.093 |
| 2005-12-11 | 78.723 |
| 2005-12-12 | 79.012 |
| 2005-12-13 | 82.245 |
| 2005-12-14 | 83.428 |
| 2005-12-15 | 83.355 |
| 2005-12-16 | 83.491 |
| 2005-12-17 | 83.648 |
| 2005-12-18 | 83.694 |
| 2005-12-19 | 86.459 |
| 2005-12-20 | 87.702 |
| 2005-12-21 | 88.323 |
| 2005-12-22 | 88.939 |
| 2005-12-23 | 88.93 |
| 2005-12-24 | 89.219 |
| 2005-12-25 | 89.126 |
| 2005-12-26 | 91.847 |
| 2005-12-27 | 92.849 |
| 2005-12-28 | 94.507 |
| 2005-12-29 | 96.356 |
| 2005-12-30 | 96.479 |
| 2005-12-31 | 94.684 |
| 2006-01-01 | 94.451 |
| 2006-01-02 | 94.31 |
| 2006-01-03 | 94.6 |
| 2006-01-04 | 95.131 |
| 2006-01-05 | 92.552 |
| 2006-01-06 | 92.972 |
| 2006-01-07 | 91.912 |
| 2006-01-08 | 90.931 |
| 2006-01-09 | 92.175 |
| 2006-01-10 | 92.883 |
| 2006-01-11 | 93.912 |
| 2006-01-12 | 92.132 |
| 2006-01-13 | 91.953 |
| 2006-01-14 | 90.131 |
| 2006-01-15 | 90.114 |
| 2006-01-16 | 90.293 |
| 2006-01-17 | 91.316 |
| 2006-01-18 | 91.525 |
| 2006-01-19 | 91.302 |
| 2006-01-20 | 92.907 |
| 2006-01-21 | 93.313 |
| 2006-01-22 | 92.952 |
| 2006-01-23 | 94.035 |
| 2006-01-24 | 93.61 |
| 2006-01-25 | 92.77 |
| 2006-01-26 | 93.484 |
| 2006-01-27 | 94.271 |
| 2006-01-28 | 92.059 |
| 2006-01-29 | 91.594 |
| 2006-01-30 | 93.272 |
| 2006-01-31 | 94.822 |
| 2006-02-01 | 98.02 |
| 2006-02-02 | 98.85 |
| 2006-02-03 | 99.647 |
| 2006-02-04 | 100.669 |
| 2006-02-05 | 100.137 |
| 2006-02-06 | 102.732 |
| 2006-02-07 | 104.845 |
| 2006-02-08 | 104.849 |
| 2006-02-09 | 103.888 |
| 2006-02-10 | 102.906 |
| 2006-02-11 | 102.012 |
| 2006-02-12 | 98.901 |
| 2006-02-13 | 99.715 |
| 2006-02-14 | 99.98 |
| 2006-02-15 | 99.021 |
| 2006-02-16 | 99.233 |
| 2006-02-17 | 97.883 |
| 2006-02-18 | 96.795 |
| 2006-02-19 | 93.686 |
| 2006-02-20 | 92.161 |
| 2006-02-21 | 93.506 |
| 2006-02-22 | 92.721 |
| 2006-02-23 | 94.913 |
| 2006-02-24 | 94.808 |
| 2006-02-25 | 94.793 |
| 2006-02-26 | 93.455 |
| 2006-02-27 | 95.345 |
| 2006-02-28 | 97.41 |
| 2006-03-01 | 97.695 |
| 2006-03-02 | 96.533 |
| 2006-03-03 | 95.164 |
| 2006-03-04 | 94.302 |
| 2006-03-05 | 92.462 |
| 2006-03-06 | 93.492 |
| 2006-03-07 | 95.375 |
| 2006-03-08 | 95.297 |
| 2006-03-09 | 94.7 |
| 2006-03-10 | 96.193 |
| 2006-03-11 | 96.257 |
| 2006-03-12 | 95.567 |
| 2006-03-13 | 96.579 |
| 2006-03-14 | 100.429 |
| 2006-03-15 | 100.157 |
| 2006-03-16 | 100.691 |
| 2006-03-17 | 102.72 |
| 2006-03-18 | 100.722 |
| 2006-03-19 | 98.595 |
| 2006-03-20 | 99.671 |
| 2006-03-21 | 101.397 |
| 2006-03-22 | 102.718 |
| 2006-03-23 | 101.413 |
| 2006-03-24 | 101.547 |
| 2006-03-25 | 98.877 |
| 2006-03-26 | 96.604 |
| 2006-03-27 | 95.511 |
| 2006-03-28 | 95.128 |
| 2006-03-29 | 93.854 |
| 2006-03-30 | 92.113 |
| 2006-03-31 | 90.896 |
| 2006-04-01 | 90.439 |
| 2006-04-02 | 87.817 |
| 2006-04-03 | 89.733 |
| 2006-04-04 | 89.938 |
| 2006-04-05 | 88.031 |
| 2006-04-06 | 85.7 |
| 2006-04-07 | 84.332 |
| 2006-04-08 | 82.567 |
| 2006-04-09 | 80.273 |
| 2006-04-10 | 81.291 |
| 2006-04-11 | 82.886 |
| 2006-04-12 | 83.055 |
| 2006-04-13 | 81.586 |
| 2006-04-14 | 80.913 |
| 2006-04-15 | 81.108 |
| 2006-04-16 | 78.978 |
| 2006-04-17 | 81.867 |
| 2006-04-18 | 84.869 |
| 2006-04-19 | 85.04 |
| 2006-04-20 | 84.316 |
| 2006-04-21 | 83.087 |
| 2006-04-22 | 83.1 |
| 2006-04-23 | 81.133 |
| 2006-04-24 | 82.724 |
| 2006-04-25 | 85.85 |
| 2006-04-26 | 87.447 |
| 2006-04-27 | 89.219 |
| 2006-04-28 | 89.931 |
| 2006-04-29 | 90.116 |
| 2006-04-30 | 89.328 |
| 2006-05-01 | 90.692 |
| 2006-05-02 | 92.638 |
| 2006-05-03 | 91.812 |
| 2006-05-04 | 91.85 |
| 2006-05-05 | 92.827 |
| 2006-05-06 | 92.883 |
| 2006-05-07 | 91.775 |
| 2006-05-08 | 93.604 |
| 2006-05-09 | 95.043 |
| 2006-05-10 | 95.645 |
| 2006-05-11 | 95.666 |
| 2006-05-12 | 95.401 |
| 2006-05-13 | 94.231 |
| 2006-05-14 | 94.864 |
| 2006-05-15 | 93.523 |
| 2006-05-16 | 95.114 |
| 2006-05-17 | 93.393 |
| 2006-05-18 | 91.577 |
| 2006-05-19 | 90.914 |
| 2006-05-20 | 90.129 |
| 2006-05-21 | 90.083 |
| 2006-05-22 | 90.634 |
| 2006-05-23 | 92.413 |
| 2006-05-24 | 91.997 |
| 2006-05-25 | 89.815 |
| 2006-05-26 | 88.685 |
| 2006-05-27 | 86.411 |
| 2006-05-28 | 84.798 |
| 2006-05-29 | 84.96 |
| 2006-05-30 | 85.437 |
| 2006-05-31 | 83.902 |
| 2006-06-01 | 84.306 |
| 2006-06-02 | 84.359 |
| 2006-06-03 | 85.11 |
| 2006-06-04 | 84.86 |
| 2006-06-05 | 85.566 |
| 2006-06-06 | 87.563 |
| 2006-06-07 | 87.138 |
| 2006-06-08 | 86.53 |
| 2006-06-09 | 86.374 |
| 2006-06-10 | 85.731 |
| 2006-06-11 | 84.536 |
| 2006-06-12 | 85.202 |
| 2006-06-13 | 85.551 |
| 2006-06-14 | 87.396 |
| 2006-06-15 | 87.554 |
| 2006-06-16 | 87.838 |
| 2006-06-17 | 87.672 |
| 2006-06-18 | 88.516 |
| 2006-06-19 | 90.095 |
| 2006-06-20 | 92.409 |
| 2006-06-21 | 92.933 |
| 2006-06-22 | 93.801 |
| 2006-06-23 | 95.141 |
| 2006-06-24 | 95.183 |
| 2006-06-25 | 93.945 |
| 2006-06-26 | 95.538 |
| 2006-06-27 | 98.571 |
| 2006-06-28 | 98.84 |
| 2006-06-29 | 99.63 |
| 2006-06-30 | 102.323 |
| 2006-07-01 | 100.085 |
| 2006-07-02 | 98.683 |
| 2006-07-03 | 97.911 |
| 2006-07-04 | 100.01 |
| 2006-07-05 | 100.999 |
| 2006-07-06 | 102.65 |
| 2006-07-07 | 103.854 |
| 2006-07-08 | 104.528 |
| 2006-07-09 | 103.244 |
| 2006-07-10 | 105.398 |
| 2006-07-11 | 108.501 |
| 2006-07-12 | 110.836 |
| 2006-07-13 | 113.851 |
| 2006-07-14 | 115.38 |
| 2006-07-15 | 115.229 |
| 2006-07-16 | 116.166 |
| 2006-07-17 | 121.191 |
| 2006-07-18 | 124.588 |
| 2006-07-19 | 126.759 |
| 2006-07-20 | 126.437 |
| 2006-07-21 | 127.605 |
| 2006-07-22 | 128.448 |
| 2006-07-23 | 127.589 |
| 2006-07-24 | 130.481 |
| 2006-07-25 | 133.227 |
| 2006-07-26 | 135.109 |
| 2006-07-27 | 134.549 |
| 2006-07-28 | 137.395 |
| 2006-07-29 | 138.131 |
| 2006-07-30 | 137.016 |
| 2006-07-31 | 140.316 |
| 2006-08-01 | 143.503 |
| 2006-08-02 | 145.751 |
| 2006-08-03 | 145.437 |
| 2006-08-04 | 146.017 |
| 2006-08-05 | 143.913 |
| 2006-08-06 | 141.697 |
| 2006-08-07 | 143.843 |
| 2006-08-08 | 146.338 |
| 2006-08-09 | 146.193 |
| 2006-08-10 | 145.994 |
| 2006-08-11 | 149.264 |
| 2006-08-12 | 151.021 |
| 2006-08-13 | 149.788 |
| 2006-08-14 | 153.048 |
| 2006-08-15 | 156.884 |
| 2006-08-16 | 153.896 |
| 2006-08-17 | 151.589 |
| 2006-08-18 | 150.777 |
| 2006-08-19 | 149.786 |
| 2006-08-20 | 148.682 |
| 2006-08-21 | 149.298 |
| 2006-08-22 | 151.771 |
| 2006-08-23 | 152.087 |
| 2006-08-24 | 151.402 |
| 2006-08-25 | 150.931 |
| 2006-08-26 | 151.604 |
| 2006-08-27 | 148.039 |
| 2006-08-28 | 148.326 |
| 2006-08-29 | 150.376 |
| 2006-08-30 | 149.047 |
| 2006-08-31 | 147.356 |
| 2006-09-01 | 147.649 |
| 2006-09-02 | 146.993 |
| 2006-09-03 | 145.687 |
| 2006-09-04 | 147.204 |
| 2006-09-05 | 150.161 |
| 2006-09-06 | 148.921 |
| 2006-09-07 | 146.624 |
| 2006-09-08 | 146.362 |
| 2006-09-09 | 145.618 |
| 2006-09-10 | 140.453 |
| 2006-09-11 | 137.356 |
| 2006-09-12 | 136.894 |
| 2006-09-13 | 133.592 |
| 2006-09-14 | 129.591 |
| 2006-09-15 | 128.349 |
| 2006-09-16 | 126.23 |
| 2006-09-17 | 124.118 |
| 2006-09-18 | 124.499 |
| 2006-09-19 | 126.051 |
| 2006-09-20 | 124.991 |
| 2006-09-21 | 122.738 |
| 2006-09-22 | 120.927 |
| 2006-09-23 | 120.221 |
| 2006-09-24 | 117.562 |
| 2006-09-25 | 115.587 |
| 2006-09-26 | 117.015 |
| 2006-09-27 | 115.443 |
| 2006-09-28 | 113.978 |
| 2006-09-29 | 114.125 |
| 2006-09-30 | 113.619 |
| 2006-10-01 | 110.152 |
| 2006-10-02 | 109.826 |
| 2006-10-03 | 110.486 |
| 2006-10-04 | 109.644 |
| 2006-10-05 | 107.942 |
| 2006-10-06 | 107.158 |
| 2006-10-07 | 106.813 |
| 2006-10-08 | 103.451 |
| 2006-10-09 | 102.715 |
| 2006-10-10 | 107.847 |
| 2006-10-11 | 111.267 |
| 2006-10-12 | 110.867 |
| 2006-10-13 | 111.338 |
| 2006-10-14 | 110.718 |
| 2006-10-15 | 109.782 |
| 2006-10-16 | 112.669 |
| 2006-10-17 | 114.682 |
| 2006-10-18 | 114.593 |
| 2006-10-19 | 113.346 |
| 2006-10-20 | 112.448 |
| 2006-10-21 | 112.544 |
| 2006-10-22 | 110.966 |
| 2006-10-23 | 111.333 |
| 2006-10-24 | 113.157 |
| 2006-10-25 | 114.951 |
| 2006-10-26 | 114.431 |
| 2006-10-27 | 114.735 |
| 2006-10-28 | 113.523 |
| 2006-10-29 | 111.808 |
| 2006-10-30 | 111.612 |
| 2006-10-31 | 114.656 |
| 2006-11-01 | 115.829 |
| 2006-11-02 | 115.854 |
| 2006-11-03 | 115.313 |
| 2006-11-04 | 113.251 |
| 2006-11-05 | 111.127 |
| 2006-11-06 | 110.356 |
| 2006-11-07 | 110.493 |
| 2006-11-08 | 109.759 |
| 2006-11-09 | 104.362 |
| 2006-11-10 | 100.082 |
| 2006-11-11 | 98.98 |
| 2006-11-12 | 96.689 |
| 2006-11-13 | 97.4 |
| 2006-11-14 | 99.689 |
| 2006-11-15 | 97.915 |
| 2006-11-16 | 96.656 |
| 2006-11-17 | 94.9 |
| 2006-11-18 | 93.279 |
| 2006-11-19 | 92.415 |
| 2006-11-20 | 92.515 |
| 2006-11-21 | 92.916 |
| 2006-11-22 | 91.643 |
| 2006-11-23 | 91.343 |
| 2006-11-24 | 89.613 |
| 2006-11-25 | 88.925 |
| 2006-11-26 | 88.223 |
| 2006-11-27 | 88.974 |
| 2006-11-28 | 89.456 |
| 2006-11-29 | 90.057 |
| 2006-11-30 | 87.805 |
| 2006-12-01 | 86.237 |
| 2006-12-02 | 84.57 |
| 2006-12-03 | 82.233 |
| 2006-12-04 | 83.105 |
| 2006-12-05 | 86.567 |
| 2006-12-06 | 87.839 |
| 2006-12-07 | 88.527 |
| 2006-12-08 | 89.434 |
| 2006-12-09 | 89.775 |
| 2006-12-10 | 88.662 |
| 2006-12-11 | 88.836 |
| 2006-12-12 | 90.167 |
| 2006-12-13 | 90.292 |
| 2006-12-14 | 88.172 |
| 2006-12-15 | 87.28 |
| 2006-12-16 | 86.447 |
| 2006-12-17 | 87.044 |
| 2006-12-18 | 87.514 |
| 2006-12-19 | 89.667 |
| 2006-12-20 | 88.778 |
| 2006-12-21 | 89.541 |
| 2006-12-22 | 89.841 |
| 2006-12-23 | 89.111 |
| 2006-12-24 | 88.497 |
| 2006-12-25 | 90.415 |
| 2006-12-26 | 92.27 |
| 2006-12-27 | 91.258 |
| 2006-12-28 | 92.081 |
| 2006-12-29 | 91.914 |
| 2006-12-30 | 93.292 |
| 2006-12-31 | 91.339 |
| 2007-01-01 | 92.224 |
| 2007-01-02 | 94.588 |
| 2007-01-03 | 94.245 |
| 2007-01-04 | 92.063 |
| 2007-01-05 | 92.143 |
| 2007-01-06 | 93.116 |
| 2007-01-07 | 91.892 |
| 2007-01-08 | 92.106 |
| 2007-01-09 | 92.924 |
| 2007-01-10 | 95.326 |
| 2007-01-11 | 95.595 |
| 2007-01-12 | 96.745 |
| 2007-01-13 | 97.695 |
| 2007-01-14 | 97.187 |
| 2007-01-15 | 97.901 |
| 2007-01-16 | 98.144 |
| 2007-01-17 | 99.625 |
| 2007-01-18 | 99.34 |
| 2007-01-19 | 98.486 |
| 2007-01-20 | 97.343 |
| 2007-01-21 | 97.286 |
| 2007-01-22 | 98.017 |
| 2007-01-23 | 99.817 |
| 2007-01-24 | 98.921 |
| 2007-01-25 | 98.423 |
| 2007-01-26 | 98.622 |
| 2007-01-27 | 98.007 |
| 2007-01-28 | 97.04 |
| 2007-01-29 | 95.043 |
| 2007-01-30 | 97.436 |
| 2007-01-31 | 97.646 |
| 2007-02-01 | 96.419 |
| 2007-02-02 | 98.5 |
| 2007-02-03 | 99.191 |
| 2007-02-04 | 98.098 |
| 2007-02-05 | 97.293 |
| 2007-02-06 | 97.999 |
| 2007-02-07 | 98.652 |
| 2007-02-08 | 97.656 |
| 2007-02-09 | 95.735 |
| 2007-02-10 | 94.805 |
| 2007-02-11 | 92.216 |
| 2007-02-12 | 92.192 |
| 2007-02-13 | 93.206 |
| 2007-02-14 | 93.59 |
| 2007-02-15 | 94.59 |
| 2007-02-16 | 93.543 |
| 2007-02-17 | 91.453 |
| 2007-02-18 | 91.065 |
| 2007-02-19 | 91.724 |
| 2007-02-20 | 93.352 |
| 2007-02-21 | 92.836 |
| 2007-02-22 | 91.862 |
| 2007-02-23 | 92.412 |
| 2007-02-24 | 91.402 |
| 2007-02-25 | 91.93 |
| 2007-02-26 | 92.569 |
| 2007-02-27 | 93.43 |
| 2007-02-28 | 95.593 |
| 2007-03-01 | 95.251 |
| 2007-03-02 | 96.274 |
| 2007-03-03 | 96.021 |
| 2007-03-04 | 92.772 |
| 2007-03-05 | 93.394 |
| 2007-03-06 | 94.893 |
| 2007-03-07 | 96.824 |
| 2007-03-08 | 95.979 |
| 2007-03-09 | 94.819 |
| 2007-03-10 | 94.143 |
| 2007-03-11 | 93.158 |
| 2007-03-12 | 92.666 |
| 2007-03-13 | 92.551 |
| 2007-03-14 | 92.637 |
| 2007-03-15 | 92.918 |
| 2007-03-16 | 92.916 |
| 2007-03-17 | 91.085 |
| 2007-03-18 | 89.327 |
| 2007-03-19 | 89.369 |
| 2007-03-20 | 90.72 |
| 2007-03-21 | 90.264 |
| 2007-03-22 | 89.055 |
| 2007-03-23 | 88.222 |
| 2007-03-24 | 88.167 |
| 2007-03-25 | 85.589 |
| 2007-03-26 | 86.417 |
| 2007-03-27 | 87.537 |
| 2007-03-28 | 87.561 |
| 2007-03-29 | 88.003 |
| 2007-03-30 | 86.959 |
| 2007-03-31 | 85.691 |
| 2007-04-01 | 83.691 |
| 2007-04-02 | 84.112 |
| 2007-04-03 | 86.2 |
| 2007-04-04 | 84.138 |
| 2007-04-05 | 83.999 |
| 2007-04-06 | 83.034 |
| 2007-04-07 | 82.301 |
| 2007-04-08 | 80.507 |
| 2007-04-09 | 80.831 |
| 2007-04-10 | 81.346 |
| 2007-04-11 | 82.601 |
| 2007-04-12 | 82.82 |
| 2007-04-13 | 82.025 |
| 2007-04-14 | 80.533 |
| 2007-04-15 | 78.802 |
| 2007-04-16 | 80.722 |
| 2007-04-17 | 82.204 |
| 2007-04-18 | 82.117 |
| 2007-04-19 | 81.023 |
| 2007-04-20 | 82.179 |
| 2007-04-21 | 81.296 |
| 2007-04-22 | 79.825 |
| 2007-04-23 | 78.67 |
| 2007-04-24 | 79.363 |
| 2007-04-25 | 79.822 |
| 2007-04-26 | 77.677 |
| 2007-04-27 | 77.118 |
| 2007-04-28 | 75.514 |
| 2007-04-29 | 74.014 |
| 2007-04-30 | 75.713 |
| 2007-05-01 | 78.139 |
| 2007-05-02 | 77.779 |
| 2007-05-03 | 76.231 |
| 2007-05-04 | 77.067 |
| 2007-05-05 | 75.299 |
| 2007-05-06 | 73.173 |
| 2007-05-07 | 74.296 |
| 2007-05-08 | 75.579 |
| 2007-05-09 | 77.013 |
| 2007-05-10 | 77.96 |
| 2007-05-11 | 78.098 |
| 2007-05-12 | 77.535 |
| 2007-05-13 | 77.018 |
| 2007-05-14 | 78.35 |
| 2007-05-15 | 79.102 |
| 2007-05-16 | 78.809 |
| 2007-05-17 | 78.983 |
| 2007-05-18 | 81.012 |
| 2007-05-19 | 80.515 |
| 2007-05-20 | 80.244 |
| 2007-05-21 | 80.807 |
| 2007-05-22 | 82.793 |
| 2007-05-23 | 85.02 |
| 2007-05-24 | 86.157 |
| 2007-05-25 | 86.358 |
| 2007-05-26 | 87.012 |
| 2007-05-27 | 87.698 |
| 2007-05-28 | 88.319 |
| 2007-05-29 | 89.595 |
| 2007-05-30 | 91.159 |
| 2007-05-31 | 90.215 |
| 2007-06-01 | 91.515 |
| 2007-06-02 | 92.258 |
| 2007-06-03 | 91.448 |
| 2007-06-04 | 95.878 |
| 2007-06-05 | 98.541 |
| 2007-06-06 | 100.305 |
| 2007-06-07 | 101.877 |
| 2007-06-08 | 102.236 |
| 2007-06-09 | 100.969 |
| 2007-06-10 | 99.505 |
| 2007-06-11 | 100.001 |
| 2007-06-12 | 101.479 |
| 2007-06-13 | 102.063 |
| 2007-06-14 | 102.514 |
| 2007-06-15 | 102.099 |
| 2007-06-16 | 101.582 |
| 2007-06-17 | 100.166 |
| 2007-06-18 | 103.375 |
| 2007-06-19 | 104.423 |
| 2007-06-20 | 105.738 |
| 2007-06-21 | 105.201 |
| 2007-06-22 | 103.686 |
| 2007-06-23 | 103.89 |
| 2007-06-24 | 101.894 |
| 2007-06-25 | 101.639 |
| 2007-06-26 | 100.568 |
| 2007-06-27 | 101.169 |
| 2007-06-28 | 100.237 |
| 2007-06-29 | 98.729 |
| 2007-06-30 | 98.585 |
| 2007-07-01 | 97.907 |
| 2007-07-02 | 100.357 |
| 2007-07-03 | 103.341 |
| 2007-07-04 | 102.795 |
| 2007-07-05 | 103.512 |
| 2007-07-06 | 103.31 |
| 2007-07-07 | 101.013 |
| 2007-07-08 | 99.798 |
| 2007-07-09 | 102.478 |
| 2007-07-10 | 105.047 |
| 2007-07-11 | 106.121 |
| 2007-07-12 | 105.74 |
| 2007-07-13 | 106.869 |
| 2007-07-14 | 105.796 |
| 2007-07-15 | 106.491 |
| 2007-07-16 | 109.765 |
| 2007-07-17 | 110.797 |
| 2007-07-18 | 111.153 |
| 2007-07-19 | 109.789 |
| 2007-07-20 | 108.705 |
| 2007-07-21 | 109.101 |
| 2007-07-22 | 110.259 |
| 2007-07-23 | 110.854 |
| 2007-07-24 | 111.436 |
| 2007-07-25 | 111.933 |
| 2007-07-26 | 113.56 |
| 2007-07-27 | 114.115 |
| 2007-07-28 | 115.407 |
| 2007-07-29 | 113.773 |
| 2007-07-30 | 113.452 |
| 2007-07-31 | 114.757 |
| 2007-08-01 | 113.771 |
| 2007-08-02 | 111.833 |
| 2007-08-03 | 110.588 |
| 2007-08-04 | 109.024 |
| 2007-08-05 | 107.263 |
| 2007-08-06 | 108.93 |
| 2007-08-07 | 110.404 |
| 2007-08-08 | 108.403 |
| 2007-08-09 | 106.46 |
| 2007-08-10 | 106.005 |
| 2007-08-11 | 105.172 |
| 2007-08-12 | 101.663 |
| 2007-08-13 | 102.02 |
| 2007-08-14 | 100.445 |
| 2007-08-15 | 98.21 |
| 2007-08-16 | 97.973 |
| 2007-08-17 | 95.571 |
| 2007-08-18 | 95.345 |
| 2007-08-19 | 94.313 |
| 2007-08-20 | 95.101 |
| 2007-08-21 | 93.64 |
| 2007-08-22 | 91.903 |
| 2007-08-23 | 91.101 |
| 2007-08-24 | 90.622 |
| 2007-08-25 | 87.766 |
| 2007-08-26 | 85.861 |
| 2007-08-27 | 85.112 |
| 2007-08-28 | 85.722 |
| 2007-08-29 | 84.931 |
| 2007-08-30 | 83.308 |
| 2007-08-31 | 81.754 |
| 2007-09-01 | 79.956 |
| 2007-09-02 | 77.414 |
| 2007-09-03 | 79.552 |
| 2007-09-04 | 81.097 |
| 2007-09-05 | 80.678 |
| 2007-09-06 | 79.781 |
| 2007-09-07 | 80.352 |
| 2007-09-08 | 80.528 |
| 2007-09-09 | 80.451 |
| 2007-09-10 | 82.102 |
| 2007-09-11 | 84.108 |
| 2007-09-12 | 84.612 |
| 2007-09-13 | 86.52 |
| 2007-09-14 | 85.703 |
| 2007-09-15 | 84.405 |
| 2007-09-16 | 83.858 |
| 2007-09-17 | 82.838 |
| 2007-09-18 | 84.172 |
| 2007-09-19 | 82.861 |
| 2007-09-20 | 84.905 |
| 2007-09-21 | 85.266 |
| 2007-09-22 | 85.661 |
| 2007-09-23 | 84.37 |
| 2007-09-24 | 86.09 |
| 2007-09-25 | 87.938 |
| 2007-09-26 | 88.678 |
| 2007-09-27 | 91.831 |
| 2007-09-28 | 93.32 |
| 2007-09-29 | 93.246 |
| 2007-09-30 | 92.719 |
| 2007-10-01 | 95.406 |
| 2007-10-02 | 97.321 |
| 2007-10-03 | 94.642 |
| 2007-10-04 | 93.672 |
| 2007-10-05 | 94.783 |
| 2007-10-06 | 93.757 |
| 2007-10-07 | 91.96 |
| 2007-10-08 | 93.472 |
| 2007-10-09 | 92.528 |
| 2007-10-10 | 91.189 |
| 2007-10-11 | 89.955 |
| 2007-10-12 | 89.225 |
| 2007-10-13 | 87.891 |
| 2007-10-14 | 87.236 |
| 2007-10-15 | 87.739 |
| 2007-10-16 | 90.61 |
| 2007-10-17 | 94.977 |
| 2007-10-18 | 94.835 |
| 2007-10-19 | 96.135 |
| 2007-10-20 | 94.991 |
| 2007-10-21 | 94.938 |
| 2007-10-22 | 95.654 |
| 2007-10-23 | 98.752 |
| 2007-10-24 | 101.002 |
| 2007-10-25 | 101.684 |
| 2007-10-26 | 104.197 |
| 2007-10-27 | 102.301 |
| 2007-10-28 | 99.853 |
| 2007-10-29 | 100.499 |
| 2007-10-30 | 101.858 |
| 2007-10-31 | 100.269 |
| 2007-11-01 | 99.528 |
| 2007-11-02 | 100.367 |
| 2007-11-03 | 101.659 |
| 2007-11-04 | 101.019 |
| 2007-11-05 | 103.671 |
| 2007-11-06 | 107.583 |
| 2007-11-07 | 106.483 |
| 2007-11-08 | 108.748 |
| 2007-11-09 | 110.04 |
| 2007-11-10 | 109.799 |
| 2007-11-11 | 109.1 |
| 2007-11-12 | 109.69 |
| 2007-11-13 | 110.433 |
| 2007-11-14 | 111.977 |
| 2007-11-15 | 110.07 |
| 2007-11-16 | 108.457 |
| 2007-11-17 | 108.112 |
| 2007-11-18 | 106.309 |
| 2007-11-19 | 105.496 |
| 2007-11-20 | 104.572 |
| 2007-11-21 | 102.606 |
| 2007-11-22 | 100.179 |
| 2007-11-23 | 98.884 |
| 2007-11-24 | 95.38 |
| 2007-11-25 | 91.712 |
| 2007-11-26 | 89.388 |
| 2007-11-27 | 91.485 |
| 2007-11-28 | 90.503 |
| 2007-11-29 | 89 |
| 2007-11-30 | 89.11 |
| 2007-12-01 | 88.902 |
| 2007-12-02 | 87.724 |
| 2007-12-03 | 85.454 |
| 2007-12-04 | 86.38 |
| 2007-12-05 | 87.537 |
| 2007-12-06 | 85.418 |
| 2007-12-07 | 85.784 |
| 2007-12-08 | 83.414 |
| 2007-12-09 | 82.73 |
| 2007-12-10 | 83.311 |
| 2007-12-11 | 85.396 |
| 2007-12-12 | 86.002 |
| 2007-12-13 | 86.047 |
| 2007-12-14 | 84.128 |
| 2007-12-15 | 83.131 |
| 2007-12-16 | 81.348 |
| 2007-12-17 | 81.45 |
| 2007-12-18 | 82.84 |
| 2007-12-19 | 84.245 |
| 2007-12-20 | 85.502 |
| 2007-12-21 | 86.556 |
| 2007-12-22 | 86.444 |
| 2007-12-23 | 84.374 |
| 2007-12-24 | 87.065 |
| 2007-12-25 | 89.133 |
| 2007-12-26 | 89.375 |
| 2007-12-27 | 89.301 |
| 2007-12-28 | 93.22 |
| 2007-12-29 | 95.186 |
| 2007-12-30 | 94.893 |
| 2007-12-31 | 95.301 |
| 2008-01-01 | 95.038 |
| 2008-01-02 | 96.307 |
| 2008-01-03 | 94.615 |
| 2008-01-04 | 91.402 |
| 2008-01-05 | 89.672 |
| 2008-01-06 | 88.365 |
| 2008-01-07 | 88.674 |
| 2008-01-08 | 88.134 |
| 2008-01-09 | 89.609 |
| 2008-01-10 | 89.093 |
| 2008-01-11 | 86.98 |
| 2008-01-12 | 85.939 |
| 2008-01-13 | 85.945 |
| 2008-01-14 | 86.814 |
| 2008-01-15 | 87.548 |
| 2008-01-16 | 87.807 |
| 2008-01-17 | 86.954 |
| 2008-01-18 | 85.017 |
| 2008-01-19 | 83.802 |
| 2008-01-20 | 84.294 |
| 2008-01-21 | 85.155 |
| 2008-01-22 | 86.036 |
| 2008-01-23 | 87.19 |
| 2008-01-24 | 85.974 |
| 2008-01-25 | 87.119 |
| 2008-01-26 | 86.358 |
| 2008-01-27 | 83.031 |
| 2008-01-28 | 82.126 |
| 2008-01-29 | 82.069 |
| 2008-01-30 | 80.379 |
| 2008-01-31 | 81.369 |
| 2008-02-01 | 81.526 |
| 2008-02-02 | 80.367 |
| 2008-02-03 | 78.933 |
| 2008-02-04 | 80.931 |
| 2008-02-05 | 82.069 |
| 2008-02-06 | 82.297 |
| 2008-02-07 | 81.233 |
| 2008-02-08 | 79.716 |
| 2008-02-09 | 78.232 |
| 2008-02-10 | 78.496 |
| 2008-02-11 | 79.548 |
| 2008-02-12 | 80.18 |
| 2008-02-13 | 80.574 |
| 2008-02-14 | 80.363 |
| 2008-02-15 | 81.023 |
| 2008-02-16 | 79.989 |
| 2008-02-17 | 79.938 |
| 2008-02-18 | 81.523 |
| 2008-02-19 | 82.687 |
| 2008-02-20 | 82.443 |
| 2008-02-21 | 82.438 |
| 2008-02-22 | 80.572 |
| 2008-02-23 | 80.617 |
| 2008-02-24 | 79.915 |
| 2008-02-25 | 79.933 |
| 2008-02-26 | 80.485 |
| 2008-02-27 | 79.748 |
| 2008-02-28 | 80.541 |
| 2008-02-29 | 82.021 |
| 2008-03-01 | 81.601 |
| 2008-03-02 | 81.801 |
| 2008-03-03 | 84.284 |
| 2008-03-04 | 88.143 |
| 2008-03-05 | 87.425 |
| 2008-03-06 | 87.894 |
| 2008-03-07 | 88.116 |
| 2008-03-08 | 89.212 |
| 2008-03-09 | 88.351 |
| 2008-03-10 | 88.524 |
| 2008-03-11 | 87.7 |
| 2008-03-12 | 88.04 |
| 2008-03-13 | 86.748 |
| 2008-03-14 | 86.309 |
| 2008-03-15 | 84.4 |
| 2008-03-16 | 82.288 |
| 2008-03-17 | 82.876 |
| 2008-03-18 | 84.041 |
| 2008-03-19 | 83.058 |
| 2008-03-20 | 80.526 |
| 2008-03-21 | 80.899 |
| 2008-03-22 | 80.498 |
| 2008-03-23 | 79.463 |
| 2008-03-24 | 79.735 |
| 2008-03-25 | 80.22 |
| 2008-03-26 | 79.915 |
| 2008-03-27 | 78.638 |
| 2008-03-28 | 79.202 |
| 2008-03-29 | 77.315 |
| 2008-03-30 | 77.197 |
| 2008-03-31 | 78.117 |
| 2008-04-01 | 76.623 |
| 2008-04-02 | 75.228 |
| 2008-04-03 | 72.158 |
| 2008-04-04 | 71.155 |
| 2008-04-05 | 68.956 |
| 2008-04-06 | 67.55 |
| 2008-04-07 | 67.405 |
| 2008-04-08 | 67.559 |
| 2008-04-09 | 68.296 |
| 2008-04-10 | 69.101 |
| 2008-04-11 | 68.563 |
| 2008-04-12 | 68.364 |
| 2008-04-13 | 67.585 |
| 2008-04-14 | 68.281 |
| 2008-04-15 | 68.143 |
| 2008-04-16 | 68.435 |
| 2008-04-17 | 68.345 |
| 2008-04-18 | 68.38 |
| 2008-04-19 | 68.992 |
| 2008-04-20 | 68.006 |
| 2008-04-21 | 68.32 |
| 2008-04-22 | 69.535 |
| 2008-04-23 | 69.859 |
| 2008-04-24 | 70.229 |
| 2008-04-25 | 69.956 |
| 2008-04-26 | 71.016 |
| 2008-04-27 | 70.692 |
| 2008-04-28 | 72.732 |
| 2008-04-29 | 72.502 |
| 2008-04-30 | 71.866 |
| 2008-05-01 | 72.853 |
| 2008-05-02 | 72.08 |
| 2008-05-03 | 71.975 |
| 2008-05-04 | 72.173 |
| 2008-05-05 | 72.001 |
| 2008-05-06 | 72.892 |
| 2008-05-07 | 73.162 |
| 2008-05-08 | 73.14 |
| 2008-05-09 | 73.154 |
| 2008-05-10 | 73.682 |
| 2008-05-11 | 73.686 |
| 2008-05-12 | 75.974 |
| 2008-05-13 | 76.779 |
| 2008-05-14 | 77.856 |
| 2008-05-15 | 78.292 |
| 2008-05-16 | 78.589 |
| 2008-05-17 | 77.647 |
| 2008-05-18 | 76.612 |
| 2008-05-19 | 76.317 |
| 2008-05-20 | 75.751 |
| 2008-05-21 | 75.688 |
| 2008-05-22 | 75.574 |
| 2008-05-23 | 74.928 |
| 2008-05-24 | 73.445 |
| 2008-05-25 | 72.987 |
| 2008-05-26 | 73.853 |
| 2008-05-27 | 74.158 |
| 2008-05-28 | 73.269 |
| 2008-05-29 | 73.41 |
| 2008-05-30 | 73.103 |
| 2008-05-31 | 72.51 |
| 2008-06-01 | 71.706 |
| 2008-06-02 | 71.998 |
| 2008-06-03 | 73.309 |
| 2008-06-04 | 74.456 |
| 2008-06-05 | 74.221 |
| 2008-06-06 | 75.056 |
| 2008-06-07 | 74.846 |
| 2008-06-08 | 73.74 |
| 2008-06-09 | 73.417 |
| 2008-06-10 | 73.199 |
| 2008-06-11 | 73.107 |
| 2008-06-12 | 72.424 |
| 2008-06-13 | 72.072 |
| 2008-06-14 | 73.896 |
| 2008-06-15 | 73.027 |
| 2008-06-16 | 74.604 |
| 2008-06-17 | 76.128 |
| 2008-06-18 | 77.289 |
| 2008-06-19 | 79.814 |
| 2008-06-20 | 81.538 |
| 2008-06-21 | 81.251 |
| 2008-06-22 | 80.126 |
| 2008-06-23 | 80.762 |
| 2008-06-24 | 84.484 |
| 2008-06-25 | 84.842 |
| 2008-06-26 | 85.87 |
| 2008-06-27 | 86.511 |
| 2008-06-28 | 86.299 |
| 2008-06-29 | 86.774 |
| 2008-06-30 | 86.786 |
| 2008-07-01 | 89.792 |
| 2008-07-02 | 90.908 |
| 2008-07-03 | 90 |
| 2008-07-04 | 89.679 |
| 2008-07-05 | 89.17 |
| 2008-07-06 | 86.743 |
| 2008-07-07 | 88.241 |
| 2008-07-08 | 89.841 |
| 2008-07-09 | 91.405 |
| 2008-07-10 | 93.403 |
| 2008-07-11 | 93.023 |
| 2008-07-12 | 93.2 |
| 2008-07-13 | 92.56 |
| 2008-07-14 | 93.322 |
| 2008-07-15 | 95.613 |
| 2008-07-16 | 96.412 |
| 2008-07-17 | 96.228 |
| 2008-07-18 | 96.469 |
| 2008-07-19 | 94.888 |
| 2008-07-20 | 92.906 |
| 2008-07-21 | 94.533 |
| 2008-07-22 | 95.534 |
| 2008-07-23 | 96.589 |
| 2008-07-24 | 93.472 |
| 2008-07-25 | 91.296 |
| 2008-07-26 | 89.004 |
| 2008-07-27 | 87.892 |
| 2008-07-28 | 88.993 |
| 2008-07-29 | 89.268 |
| 2008-07-30 | 89.759 |
| 2008-07-31 | 88.337 |
| 2008-08-01 | 87.923 |
| 2008-08-02 | 87.092 |
| 2008-08-03 | 87.345 |
| 2008-08-04 | 88.078 |
| 2008-08-05 | 89.597 |
| 2008-08-06 | 87.822 |
| 2008-08-07 | 86.056 |
| 2008-08-08 | 84.43 |
| 2008-08-09 | 83.39 |
| 2008-08-10 | 81.576 |
| 2008-08-11 | 83.893 |
| 2008-08-12 | 87.005 |
| 2008-08-13 | 86.487 |
| 2008-08-14 | 85.654 |
| 2008-08-15 | 84.504 |
| 2008-08-16 | 84.241 |
| 2008-08-17 | 82.901 |
| 2008-08-18 | 85.054 |
| 2008-08-19 | 85.564 |
| 2008-08-20 | 86.584 |
| 2008-08-21 | 86.802 |
| 2008-08-22 | 86.91 |
| 2008-08-23 | 87.312 |
| 2008-08-24 | 86.981 |
| 2008-08-25 | 87.527 |
| 2008-08-26 | 88.676 |
| 2008-08-27 | 88.854 |
| 2008-08-28 | 89.134 |
| 2008-08-29 | 89.456 |
| 2008-08-30 | 89.023 |
| 2008-08-31 | 88.269 |
| 2008-09-01 | 90.087 |
| 2008-09-02 | 90.325 |
| 2008-09-03 | 90.757 |
| 2008-09-04 | 93 |
| 2008-09-05 | 94.59 |
| 2008-09-06 | 95.562 |
| 2008-09-07 | 96.446 |
| 2008-09-08 | 95.76 |
| 2008-09-09 | 97.469 |
| 2008-09-10 | 94.753 |
| 2008-09-11 | 93.316 |
| 2008-09-12 | 92.762 |
| 2008-09-13 | 92.313 |
| 2008-09-14 | 92.031 |
| 2008-09-15 | 91.812 |
| 2008-09-16 | 94.348 |
| 2008-09-17 | 94.222 |
| 2008-09-18 | 94.252 |
| 2008-09-19 | 91.606 |
| 2008-09-20 | 91.079 |
| 2008-09-21 | 88.778 |
| 2008-09-22 | 88.053 |
| 2008-09-23 | 89.71 |
| 2008-09-24 | 90.741 |
| 2008-09-25 | 91.245 |
| 2008-09-26 | 90.091 |
| 2008-09-27 | 88.659 |
| 2008-09-28 | 87.748 |
| 2008-09-29 | 88.866 |
| 2008-09-30 | 89.218 |
| 2008-10-01 | 87.444 |
| 2008-10-02 | 86.646 |
| 2008-10-03 | 86.557 |
| 2008-10-04 | 83.788 |
| 2008-10-05 | 82.831 |
| 2008-10-06 | 83.554 |
| 2008-10-07 | 82.249 |
| 2008-10-08 | 81.748 |
| 2008-10-09 | 80.271 |
| 2008-10-10 | 81.34 |
| 2008-10-11 | 80.323 |
| 2008-10-12 | 78.656 |
| 2008-10-13 | 79.567 |
| 2008-10-14 | 79.293 |
| 2008-10-15 | 78.695 |
| 2008-10-16 | 75.988 |
| 2008-10-17 | 73.785 |
| 2008-10-18 | 72.529 |
| 2008-10-19 | 71.007 |
| 2008-10-20 | 71.097 |
| 2008-10-21 | 70.974 |
| 2008-10-22 | 70.077 |
| 2008-10-23 | 68.285 |
| 2008-10-24 | 67.459 |
| 2008-10-25 | 64.985 |
| 2008-10-26 | 64.676 |
| 2008-10-27 | 64.295 |
| 2008-10-28 | 65.137 |
| 2008-10-29 | 65.245 |
| 2008-10-30 | 65.606 |
| 2008-10-31 | 65.133 |
| 2008-11-01 | 64.805 |
| 2008-11-02 | 63.469 |
| 2008-11-03 | 63.386 |
| 2008-11-04 | 63.39 |
| 2008-11-05 | 63.025 |
| 2008-11-06 | 64.396 |
| 2008-11-07 | 65.368 |
| 2008-11-08 | 66.207 |
| 2008-11-09 | 65.415 |
| 2008-11-10 | 65.347 |
| 2008-11-11 | 65.602 |
| 2008-11-12 | 64.245 |
| 2008-11-13 | 65.415 |
| 2008-11-14 | 66.42 |
| 2008-11-15 | 66.303 |
| 2008-11-16 | 65.98 |
| 2008-11-17 | 66.652 |
| 2008-11-18 | 68.391 |
| 2008-11-19 | 67.348 |
| 2008-11-20 | 68.168 |
| 2008-11-21 | 70.161 |
| 2008-11-22 | 70.242 |
| 2008-11-23 | 69.144 |
| 2008-11-24 | 70.721 |
| 2008-11-25 | 70.701 |
| 2008-11-26 | 71.264 |
| 2008-11-27 | 73.373 |
| 2008-11-28 | 75.583 |
| 2008-11-29 | 77.652 |
| 2008-11-30 | 79.131 |
| 2008-12-01 | 84.388 |
| 2008-12-02 | 88.399 |
| 2008-12-03 | 89.36 |
| 2008-12-04 | 90.593 |
| 2008-12-05 | 89.818 |
| 2008-12-06 | 89.358 |
| 2008-12-07 | 87.709 |
| 2008-12-08 | 88.103 |
| 2008-12-09 | 90.325 |
| 2008-12-10 | 90.783 |
| 2008-12-11 | 90.981 |
| 2008-12-12 | 92.697 |
| 2008-12-13 | 91.478 |
| 2008-12-14 | 90.853 |
| 2008-12-15 | 92.603 |
| 2008-12-16 | 92.594 |
| 2008-12-17 | 93.027 |
| 2008-12-18 | 92.68 |
| 2008-12-19 | 93.012 |
| 2008-12-20 | 93.024 |
| 2008-12-21 | 91.986 |
| 2008-12-22 | 92.18 |
| 2008-12-23 | 93.216 |
| 2008-12-24 | 93.593 |
| 2008-12-25 | 95.834 |
| 2008-12-26 | 96.081 |
| 2008-12-27 | 93.993 |
| 2008-12-28 | 89.942 |
| 2008-12-29 | 89.978 |
| 2008-12-30 | 92.946 |
| 2008-12-31 | 90.373 |
| 2009-01-01 | 88.797 |
| 2009-01-02 | 88.144 |
| 2009-01-03 | 87.555 |
| 2009-01-04 | 88.199 |
| 2009-01-05 | 89.204 |
| 2009-01-06 | 91.345 |
| 2009-01-07 | 92.929 |
| 2009-01-08 | 92.835 |
| 2009-01-09 | 93.455 |
| 2009-01-10 | 93.559 |
| 2009-01-11 | 91.73 |
| 2009-01-12 | 94.087 |
| 2009-01-13 | 95.381 |
| 2009-01-14 | 96.66 |
| 2009-01-15 | 98.069 |
| 2009-01-16 | 99.886 |
| 2009-01-17 | 99.474 |
| 2009-01-18 | 100.261 |
| 2009-01-19 | 101.516 |
| 2009-01-20 | 101.23 |
| 2009-01-21 | 100.859 |
| 2009-01-22 | 100.708 |
| 2009-01-23 | 99.951 |
| 2009-01-24 | 96.875 |
| 2009-01-25 | 95.496 |
| 2009-01-26 | 95.004 |
| 2009-01-27 | 95.851 |
| 2009-01-28 | 92.485 |
| 2009-01-29 | 88.491 |
| 2009-01-30 | 86.83 |
| 2009-01-31 | 85.133 |
| 2009-02-01 | 83.776 |
| 2009-02-02 | 83.019 |
| 2009-02-03 | 82.499 |
| 2009-02-04 | 81.109 |
| 2009-02-05 | 79.666 |
| 2009-02-06 | 77.63 |
| 2009-02-07 | 75.214 |
| 2009-02-08 | 73.856 |
| 2009-02-09 | 74.012 |
| 2009-02-10 | 74.562 |
| 2009-02-11 | 71.287 |
| 2009-02-12 | 70.542 |
| 2009-02-13 | 68.06 |
| 2009-02-14 | 66.656 |
| 2009-02-15 | 62.964 |
| 2009-02-16 | 63.701 |
| 2009-02-17 | 64.555 |
| 2009-02-18 | 64.067 |
| 2009-02-19 | 64.553 |
| 2009-02-20 | 65.209 |
| 2009-02-21 | 65.251 |
| 2009-02-22 | 64.858 |
| 2009-02-23 | 66.734 |
| 2009-02-24 | 68.364 |
| 2009-02-25 | 67.981 |
| 2009-02-26 | 68.269 |
| 2009-02-27 | 68.176 |
| 2009-02-28 | 67.54 |
| 2009-03-01 | 66.37 |
| 2009-03-02 | 68.027 |
| 2009-03-03 | 70.712 |
| 2009-03-04 | 72.612 |
| 2009-03-05 | 72.336 |
| 2009-03-06 | 72.252 |
| 2009-03-07 | 71.994 |
| 2009-03-08 | 70.867 |
| 2009-03-09 | 72.275 |
| 2009-03-10 | 72.66 |
| 2009-03-11 | 73.718 |
| 2009-03-12 | 72.654 |
| 2009-03-13 | 73.183 |
| 2009-03-14 | 71.637 |
| 2009-03-15 | 71.495 |
| 2009-03-16 | 71.684 |
| 2009-03-17 | 72.103 |
| 2009-03-18 | 71.178 |
| 2009-03-19 | 69.727 |
| 2009-03-20 | 68.278 |
| 2009-03-21 | 67.7 |
| 2009-03-22 | 67.727 |
| 2009-03-23 | 68.556 |
| 2009-03-24 | 69.825 |
| 2009-03-25 | 70.084 |
| 2009-03-26 | 70.003 |
| 2009-03-27 | 70.613 |
| 2009-03-28 | 70.248 |
| 2009-03-29 | 70.367 |
| 2009-03-30 | 71.683 |
| 2009-03-31 | 73.015 |
| 2009-04-01 | 71.912 |
| 2009-04-02 | 71.499 |
| 2009-04-03 | 70.586 |
| 2009-04-04 | 70.895 |
| 2009-04-05 | 70.674 |
| 2009-04-06 | 73.288 |
| 2009-04-07 | 75.059 |
| 2009-04-08 | 74.275 |
| 2009-04-09 | 76.017 |
| 2009-04-10 | 75.223 |
| 2009-04-11 | 77.151 |
| 2009-04-12 | 77.973 |
| 2009-04-13 | 80.556 |
| 2009-04-14 | 84.628 |
| 2009-04-15 | 85.756 |
| 2009-04-16 | 88 |
| 2009-04-17 | 88.761 |
| 2009-04-18 | 88.67 |
| 2009-04-19 | 87.733 |
| 2009-04-20 | 88.827 |
| 2009-04-21 | 88.645 |
| 2009-04-22 | 87.947 |
| 2009-04-23 | 87.024 |
| 2009-04-24 | 85.116 |
| 2009-04-25 | 85.043 |
| 2009-04-26 | 84.126 |
| 2009-04-27 | 85.285 |
| 2009-04-28 | 86.372 |
| 2009-04-29 | 86.099 |
| 2009-04-30 | 85.958 |
| 2009-05-01 | 84.958 |
| 2009-05-02 | 83.755 |
| 2009-05-03 | 82.889 |
| 2009-05-04 | 83.582 |
| 2009-05-05 | 85.483 |
| 2009-05-06 | 84.489 |
| 2009-05-07 | 83.766 |
| 2009-05-08 | 83.605 |
| 2009-05-09 | 81.249 |
| 2009-05-10 | 79.703 |
| 2009-05-11 | 80.037 |
| 2009-05-12 | 80.425 |
| 2009-05-13 | 78.688 |
| 2009-05-14 | 75.551 |
| 2009-05-15 | 74.158 |
| 2009-05-16 | 72.099 |
| 2009-05-17 | 71.707 |
| 2009-05-18 | 74.652 |
| 2009-05-19 | 78.841 |
| 2009-05-20 | 78.991 |
| 2009-05-21 | 80.318 |
| 2009-05-22 | 80.693 |
| 2009-05-23 | 80.286 |
| 2009-05-24 | 81.447 |
| 2009-05-25 | 82.903 |
| 2009-05-26 | 86.151 |
| 2009-05-27 | 87.56 |
| 2009-05-28 | 88.789 |
| 2009-05-29 | 90.041 |
| 2009-05-30 | 90.639 |
| 2009-05-31 | 92.388 |
| 2009-06-01 | 92.922 |
| 2009-06-02 | 94.571 |
| 2009-06-03 | 94.263 |
| 2009-06-04 | 92.824 |
| 2009-06-05 | 92.713 |
| 2009-06-06 | 92.312 |
| 2009-06-07 | 92.088 |
| 2009-06-08 | 93.261 |
| 2009-06-09 | 94.448 |
| 2009-06-10 | 92.496 |
| 2009-06-11 | 92.87 |
| 2009-06-12 | 93.552 |
| 2009-06-13 | 93.292 |
| 2009-06-14 | 93.695 |
| 2009-06-15 | 95.987 |
| 2009-06-16 | 97.78 |
| 2009-06-17 | 95.103 |
| 2009-06-18 | 94.736 |
| 2009-06-19 | 94.689 |
| 2009-06-20 | 93.388 |
| 2009-06-21 | 93.024 |
| 2009-06-22 | 93.715 |
| 2009-06-23 | 93.381 |
| 2009-06-24 | 91.288 |
| 2009-06-25 | 88.525 |
| 2009-06-26 | 85.606 |
| 2009-06-27 | 83.718 |
| 2009-06-28 | 82.102 |
| 2009-06-29 | 80.988 |
| 2009-06-30 | 81.252 |
| 2009-07-01 | 81.02 |
| 2009-07-02 | 79.324 |
| 2009-07-03 | 80.878 |
| 2009-07-04 | 80.399 |
| 2009-07-05 | 78.836 |
| 2009-07-06 | 80.565 |
| 2009-07-07 | 81.966 |
| 2009-07-08 | 81.602 |
| 2009-07-09 | 82.224 |
| 2009-07-10 | 82.792 |
| 2009-07-11 | 81.586 |
| 2009-07-12 | 80.47 |
| 2009-07-13 | 80.911 |
| 2009-07-14 | 81.508 |
| 2009-07-15 | 79.933 |
| 2009-07-16 | 77.631 |
| 2009-07-17 | 78.79 |
| 2009-07-18 | 77.477 |
| 2009-07-19 | 76.665 |
| 2009-07-20 | 76.642 |
| 2009-07-21 | 76.612 |
| 2009-07-22 | 76.718 |
| 2009-07-23 | 77.507 |
| 2009-07-24 | 80.015 |
| 2009-07-25 | 79.361 |
| 2009-07-26 | 79.669 |
| 2009-07-27 | 80.168 |
| 2009-07-28 | 81.896 |
| 2009-07-29 | 83.342 |
| 2009-07-30 | 81.71 |
| 2009-07-31 | 81.177 |
| 2009-08-01 | 80.263 |
| 2009-08-02 | 77.423 |
| 2009-08-03 | 78.972 |
| 2009-08-04 | 79.93 |
| 2009-08-05 | 79.192 |
| 2009-08-06 | 77.858 |
| 2009-08-07 | 78.979 |
| 2009-08-08 | 78.565 |
| 2009-08-09 | 77.729 |
| 2009-08-10 | 77.534 |
| 2009-08-11 | 78.244 |
| 2009-08-12 | 78.437 |
| 2009-08-13 | 77.064 |
| 2009-08-14 | 76.867 |
| 2009-08-15 | 77.016 |
| 2009-08-16 | 75.519 |
| 2009-08-17 | 76.103 |
| 2009-08-18 | 76.036 |
| 2009-08-19 | 77.642 |
| 2009-08-20 | 78.416 |
| 2009-08-21 | 77.716 |
| 2009-08-22 | 76.379 |
| 2009-08-23 | 74.069 |
| 2009-08-24 | 75.076 |
| 2009-08-25 | 75.365 |
| 2009-08-26 | 75.362 |
| 2009-08-27 | 72.864 |
| 2009-08-28 | 71.813 |
| 2009-08-29 | 73.752 |
| 2009-08-30 | 74.05 |
| 2009-08-31 | 75.165 |
| 2009-09-01 | 75.541 |
| 2009-09-02 | 74.358 |
| 2009-09-03 | 73.059 |
| 2009-09-04 | 73.01 |
| 2009-09-05 | 72.842 |
| 2009-09-06 | 71.44 |
| 2009-09-07 | 71.924 |
| 2009-09-08 | 73.118 |
| 2009-09-09 | 73.014 |
| 2009-09-10 | 73.76 |
| 2009-09-11 | 73.319 |
| 2009-09-12 | 74.394 |
| 2009-09-13 | 74.236 |
| 2009-09-14 | 74.848 |
| 2009-09-15 | 75.98 |
| 2009-09-16 | 75.311 |
| 2009-09-17 | 75.393 |
| 2009-09-18 | 77.357 |
| 2009-09-19 | 77.349 |
| 2009-09-20 | 77.064 |
| 2009-09-21 | 78.215 |
| 2009-09-22 | 79.793 |
| 2009-09-23 | 79.105 |
| 2009-09-24 | 79.735 |
| 2009-09-25 | 81.492 |
| 2009-09-26 | 85.055 |
| 2009-09-27 | 85.978 |
| 2009-09-28 | 86.155 |
| 2009-09-29 | 88.098 |
| 2009-09-30 | 91.13 |
| 2009-10-01 | 93.719 |
| 2009-10-02 | 94.845 |
| 2009-10-03 | 95.692 |
| 2009-10-04 | 95.001 |
| 2009-10-05 | 96.663 |
| 2009-10-06 | 97.598 |
| 2009-10-07 | 97.363 |
| 2009-10-08 | 97.468 |
| 2009-10-09 | 97.881 |
| 2009-10-10 | 98.007 |
| 2009-10-11 | 98.962 |
| 2009-10-12 | 99.579 |
| 2009-10-13 | 100.846 |
| 2009-10-14 | 101.881 |
| 2009-10-15 | 100.773 |
| 2009-10-16 | 101.504 |
| 2009-10-17 | 101.688 |
| 2009-10-18 | 98.46 |
| 2009-10-19 | 99.423 |
| 2009-10-20 | 100.579 |
| 2009-10-21 | 100.832 |
| 2009-10-22 | 100.139 |
| 2009-10-23 | 101.136 |
| 2009-10-24 | 101.023 |
| 2009-10-25 | 99.011 |
| 2009-10-26 | 96.932 |
| 2009-10-27 | 96.463 |
| 2009-10-28 | 95.994 |
| 2009-10-29 | 94.004 |
| 2009-10-30 | 91.441 |
| 2009-10-31 | 88.988 |
| 2009-11-01 | 87.091 |
| 2009-11-02 | 86.769 |
| 2009-11-03 | 88.562 |
| 2009-11-04 | 87.253 |
| 2009-11-05 | 86.053 |
| 2009-11-06 | 85.87 |
| 2009-11-07 | 85.253 |
| 2009-11-08 | 84.411 |
| 2009-11-09 | 84.382 |
| 2009-11-10 | 83.895 |
| 2009-11-11 | 84.665 |
| 2009-11-12 | 83.822 |
| 2009-11-13 | 83.423 |
| 2009-11-14 | 83.405 |
| 2009-11-15 | 81.879 |
| 2009-11-16 | 82.389 |
| 2009-11-17 | 83.54 |
| 2009-11-18 | 81.5 |
| 2009-11-19 | 81.932 |
| 2009-11-20 | 81.465 |
| 2009-11-21 | 80.544 |
| 2009-11-22 | 79.172 |
| 2009-11-23 | 79.378 |
| 2009-11-24 | 80.061 |
| 2009-11-25 | 80.678 |
| 2009-11-26 | 80.388 |
| 2009-11-27 | 79.034 |
| 2009-11-28 | 79.283 |
| 2009-11-29 | 79.02 |
| 2009-11-30 | 81.03 |
| 2009-12-01 | 82.413 |
| 2009-12-02 | 84.643 |
| 2009-12-03 | 84.456 |
| 2009-12-04 | 84.913 |
| 2009-12-05 | 85.448 |
| 2009-12-06 | 84.191 |
| 2009-12-07 | 85.198 |
| 2009-12-08 | 86.958 |
| 2009-12-09 | 86.054 |
| 2009-12-10 | 84.915 |
| 2009-12-11 | 83.702 |
| 2009-12-12 | 83.743 |
| 2009-12-13 | 83.445 |
| 2009-12-14 | 84.542 |
| 2009-12-15 | 85.486 |
| 2009-12-16 | 86.156 |
| 2009-12-17 | 84.264 |
| 2009-12-18 | 84.721 |
| 2009-12-19 | 84.209 |
| 2009-12-20 | 83.978 |
| 2009-12-21 | 83.99 |
| 2009-12-22 | 83.762 |
| 2009-12-23 | 82.512 |
| 2009-12-24 | 82.291 |
| 2009-12-25 | 81.643 |
| 2009-12-26 | 84.16 |
| 2009-12-27 | 85.765 |
| 2009-12-28 | 89.061 |
| 2009-12-29 | 93.509 |
| 2009-12-30 | 95.173 |
| 2009-12-31 | 95.982 |
| 2010-01-01 | 98.196 |
| 2010-01-02 | 97.965 |
| 2010-01-03 | 97.977 |
| 2010-01-04 | 101.14 |
| 2010-01-05 | 103.739 |
| 2010-01-06 | 105.751 |
| 2010-01-07 | 105.864 |
| 2010-01-08 | 107.265 |
| 2010-01-09 | 107.012 |
| 2010-01-10 | 107.053 |
| 2010-01-11 | 107.118 |
| 2010-01-12 | 108.34 |
| 2010-01-13 | 109.376 |
| 2010-01-14 | 109.192 |
| 2010-01-15 | 108.403 |
| 2010-01-16 | 107.929 |
| 2010-01-17 | 107.186 |
| 2010-01-18 | 106.953 |
| 2010-01-19 | 107.712 |
| 2010-01-20 | 108.213 |
| 2010-01-21 | 109.713 |
| 2010-01-22 | 109.252 |
| 2010-01-23 | 108.964 |
| 2010-01-24 | 108.091 |
| 2010-01-25 | 106.887 |
| 2010-01-26 | 105.798 |
| 2010-01-27 | 102.094 |
| 2010-01-28 | 99.087 |
| 2010-01-29 | 95.57 |
| 2010-01-30 | 94.352 |
| 2010-01-31 | 90.127 |
| 2010-02-01 | 91.25 |
| 2010-02-02 | 91.402 |
| 2010-02-03 | 89.278 |
| 2010-02-04 | 89.507 |
| 2010-02-05 | 87.191 |
| 2010-02-06 | 85.876 |
| 2010-02-07 | 84.02 |
| 2010-02-08 | 84.913 |
| 2010-02-09 | 84.606 |
| 2010-02-10 | 85.837 |
| 2010-02-11 | 85.136 |
| 2010-02-12 | 83.649 |
| 2010-02-13 | 82.461 |
| 2010-02-14 | 81.139 |
| 2010-02-15 | 82.633 |
| 2010-02-16 | 85.32 |
| 2010-02-17 | 85.456 |
| 2010-02-18 | 84.342 |
| 2010-02-19 | 85.512 |
| 2010-02-20 | 84.395 |
| 2010-02-21 | 85.254 |
| 2010-02-22 | 84.6 |
| 2010-02-23 | 85.634 |
| 2010-02-24 | 84.608 |
| 2010-02-25 | 83.615 |
| 2010-02-26 | 84.136 |
| 2010-02-27 | 81.821 |
| 2010-02-28 | 81.115 |
| 2010-03-01 | 80.559 |
| 2010-03-02 | 80.742 |
| 2010-03-03 | 78.071 |
| 2010-03-04 | 77.579 |
| 2010-03-05 | 76.667 |
| 2010-03-06 | 75.096 |
| 2010-03-07 | 73.894 |
| 2010-03-08 | 76.016 |
| 2010-03-09 | 77.151 |
| 2010-03-10 | 77.403 |
| 2010-03-11 | 78.253 |
| 2010-03-12 | 77.5 |
| 2010-03-13 | 75.962 |
| 2010-03-14 | 74.571 |
| 2010-03-15 | 76.538 |
| 2010-03-16 | 77.16 |
| 2010-03-17 | 76.866 |
| 2010-03-18 | 75.413 |
| 2010-03-19 | 75.587 |
| 2010-03-20 | 75.002 |
| 2010-03-21 | 72.221 |
| 2010-03-22 | 72.265 |
| 2010-03-23 | 72.432 |
| 2010-03-24 | 72.443 |
| 2010-03-25 | 71.363 |
| 2010-03-26 | 70.368 |
| 2010-03-27 | 70.706 |
| 2010-03-28 | 69.222 |
| 2010-03-29 | 69.751 |
| 2010-03-30 | 72.936 |
| 2010-03-31 | 73.081 |
| 2010-04-01 | 73.498 |
| 2010-04-02 | 75.425 |
| 2010-04-03 | 76.02 |
| 2010-04-04 | 76.301 |
| 2010-04-05 | 76.61 |
| 2010-04-06 | 78.483 |
| 2010-04-07 | 78.872 |
| 2010-04-08 | 80.566 |
| 2010-04-09 | 83.184 |
| 2010-04-10 | 82.397 |
| 2010-04-11 | 81.11 |
| 2010-04-12 | 83.455 |
| 2010-04-13 | 86.696 |
| 2010-04-14 | 86.416 |
| 2010-04-15 | 88.288 |
| 2010-04-16 | 87.994 |
| 2010-04-17 | 86.663 |
| 2010-04-18 | 86.184 |
| 2010-04-19 | 88.355 |
| 2010-04-20 | 91.271 |
| 2010-04-21 | 91.272 |
| 2010-04-22 | 90.526 |
| 2010-04-23 | 91.272 |
| 2010-04-24 | 91.648 |
| 2010-04-25 | 91.336 |
| 2010-04-26 | 91.371 |
| 2010-04-27 | 92.483 |
| 2010-04-28 | 91.917 |
| 2010-04-29 | 89.413 |
| 2010-04-30 | 88.625 |
| 2010-05-01 | 86.611 |
| 2010-05-02 | 83.33 |
| 2010-05-03 | 84.939 |
| 2010-05-04 | 86.106 |
| 2010-05-05 | 85.868 |
| 2010-05-06 | 84.432 |
| 2010-05-07 | 82.383 |
| 2010-05-08 | 79.452 |
| 2010-05-09 | 75.953 |
| 2010-05-10 | 76.19 |
| 2010-05-11 | 77.662 |
| 2010-05-12 | 75.181 |
| 2010-05-13 | 72.54 |
| 2010-05-14 | 72.66 |
| 2010-05-15 | 71.404 |
| 2010-05-16 | 71.493 |
| 2010-05-17 | 74.162 |
| 2010-05-18 | 76.449 |
| 2010-05-19 | 78.007 |
| 2010-05-20 | 77.707 |
| 2010-05-21 | 80.121 |
| 2010-05-22 | 81.653 |
| 2010-05-23 | 80.801 |
| 2010-05-24 | 81.82 |
| 2010-05-25 | 83.491 |
| 2010-05-26 | 84.772 |
| 2010-05-27 | 85.185 |
| 2010-05-28 | 86.728 |
| 2010-05-29 | 87.134 |
| 2010-05-30 | 86.702 |
| 2010-05-31 | 89.008 |
| 2010-06-01 | 93.759 |
| 2010-06-02 | 94.909 |
| 2010-06-03 | 94.971 |
| 2010-06-04 | 95.418 |
| 2010-06-05 | 96.19 |
| 2010-06-06 | 95.845 |
| 2010-06-07 | 99.136 |
| 2010-06-08 | 101.069 |
| 2010-06-09 | 100.97 |
| 2010-06-10 | 102.837 |
| 2010-06-11 | 104.648 |
| 2010-06-12 | 104.034 |
| 2010-06-13 | 103.776 |
| 2010-06-14 | 104.204 |
| 2010-06-15 | 105.306 |
| 2010-06-16 | 104.087 |
| 2010-06-17 | 102.548 |
| 2010-06-18 | 101.272 |
| 2010-06-19 | 99.105 |
| 2010-06-20 | 96.958 |
| 2010-06-21 | 96.452 |
| 2010-06-22 | 98.858 |
| 2010-06-23 | 98.424 |
| 2010-06-24 | 98.069 |
| 2010-06-25 | 96.377 |
| 2010-06-26 | 95.569 |
| 2010-06-27 | 93.594 |
| 2010-06-28 | 93.687 |
| 2010-06-29 | 96.474 |
| 2010-06-30 | 96.347 |
| 2010-07-01 | 93.968 |
| 2010-07-02 | 90.039 |
| 2010-07-03 | 87.166 |
| 2010-07-04 | 84.916 |
| 2010-07-05 | 83.148 |
| 2010-07-06 | 84.643 |
| 2010-07-07 | 82.762 |
| 2010-07-08 | 83.519 |
| 2010-07-09 | 83.282 |
| 2010-07-10 | 80.523 |
| 2010-07-11 | 78.966 |
| 2010-07-12 | 78.761 |
| 2010-07-13 | 80.321 |
| 2010-07-14 | 82.572 |
| 2010-07-15 | 83.262 |
| 2010-07-16 | 81.828 |
| 2010-07-17 | 80.066 |
| 2010-07-18 | 77.781 |
| 2010-07-19 | 78.51 |
| 2010-07-20 | 79.202 |
| 2010-07-21 | 79.538 |
| 2010-07-22 | 77.36 |
| 2010-07-23 | 77.066 |
| 2010-07-24 | 75.822 |
| 2010-07-25 | 75.889 |
| 2010-07-26 | 78.39 |
| 2010-07-27 | 80.673 |
| 2010-07-28 | 81.53 |
| 2010-07-29 | 79.918 |
| 2010-07-30 | 79.203 |
| 2010-07-31 | 78.897 |
| 2010-08-01 | 79.77 |
| 2010-08-02 | 82.194 |
| 2010-08-03 | 84.935 |
| 2010-08-04 | 86.945 |
| 2010-08-05 | 86.087 |
| 2010-08-06 | 85.117 |
| 2010-08-07 | 82.197 |
| 2010-08-08 | 82.826 |
| 2010-08-09 | 82.282 |
| 2010-08-10 | 83.046 |
| 2010-08-11 | 84.386 |
| 2010-08-12 | 82.507 |
| 2010-08-13 | 79.03 |
| 2010-08-14 | 76.444 |
| 2010-08-15 | 76.981 |
| 2010-08-16 | 78.003 |
| 2010-08-17 | 79.108 |
| 2010-08-18 | 80.349 |
| 2010-08-19 | 80.605 |
| 2010-08-20 | 79.198 |
| 2010-08-21 | 79.68 |
| 2010-08-22 | 79.601 |
| 2010-08-23 | 80.419 |
| 2010-08-24 | 81.869 |
| 2010-08-25 | 80.69 |
| 2010-08-26 | 80.174 |
| 2010-08-27 | 79.899 |
| 2010-08-28 | 80.13 |
| 2010-08-29 | 79.83 |
| 2010-08-30 | 80.228 |
| 2010-08-31 | 81.326 |
| 2010-09-01 | 80.557 |
| 2010-09-02 | 78.827 |
| 2010-09-03 | 78.215 |
| 2010-09-04 | 77.233 |
| 2010-09-05 | 76.333 |
| 2010-09-06 | 76.331 |
| 2010-09-07 | 77.282 |
| 2010-09-08 | 78.587 |
| 2010-09-09 | 77.548 |
| 2010-09-10 | 78.131 |
| 2010-09-11 | 76.066 |
| 2010-09-12 | 75.764 |
| 2010-09-13 | 76.604 |
| 2010-09-14 | 77.211 |
| 2010-09-15 | 77.083 |
| 2010-09-16 | 76.341 |
| 2010-09-17 | 75.691 |
| 2010-09-18 | 74.494 |
| 2010-09-19 | 74.99 |
| 2010-09-20 | 74.647 |
| 2010-09-21 | 75.63 |
| 2010-09-22 | 75.326 |
| 2010-09-23 | 74.485 |
| 2010-09-24 | 74.282 |
| 2010-09-25 | 73.568 |
| 2010-09-26 | 72.53 |
| 2010-09-27 | 73.309 |
| 2010-09-28 | 74.087 |
| 2010-09-29 | 73.616 |
| 2010-09-30 | 71.824 |
| 2010-10-01 | 71.362 |
| 2010-10-02 | 70.24 |
| 2010-10-03 | 69.054 |
| 2010-10-04 | 69.703 |
| 2010-10-05 | 72.154 |
| 2010-10-06 | 73.689 |
| 2010-10-07 | 73.369 |
| 2010-10-08 | 72.704 |
| 2010-10-09 | 73.033 |
| 2010-10-10 | 71.984 |
| 2010-10-11 | 73.601 |
| 2010-10-12 | 74.25 |
| 2010-10-13 | 73.614 |
| 2010-10-14 | 73.526 |
| 2010-10-15 | 73.818 |
| 2010-10-16 | 73.289 |
| 2010-10-17 | 72.884 |
| 2010-10-18 | 71.895 |
| 2010-10-19 | 72.274 |
| 2010-10-20 | 72.258 |
| 2010-10-21 | 70.333 |
| 2010-10-22 | 70.254 |
| 2010-10-23 | 68.94 |
| 2010-10-24 | 68.003 |
| 2010-10-25 | 67.61 |
| 2010-10-26 | 66.962 |
| 2010-10-27 | 66.638 |
| 2010-10-28 | 65.523 |
| 2010-10-29 | 65.366 |
| 2010-10-30 | 66.324 |
| 2010-10-31 | 65.046 |
| 2010-11-01 | 68.496 |
| 2010-11-02 | 71.329 |
| 2010-11-03 | 71.54 |
| 2010-11-04 | 70.49 |
| 2010-11-05 | 69.039 |
| 2010-11-06 | 67.514 |
| 2010-11-07 | 67.443 |
| 2010-11-08 | 68.668 |
| 2010-11-09 | 71.21 |
| 2010-11-10 | 71.515 |
| 2010-11-11 | 72.285 |
| 2010-11-12 | 73.051 |
| 2010-11-13 | 72.062 |
| 2010-11-14 | 72.03 |
| 2010-11-15 | 74.543 |
| 2010-11-16 | 76.012 |
| 2010-11-17 | 77.577 |
| 2010-11-18 | 77.253 |
| 2010-11-19 | 78.391 |
| 2010-11-20 | 79.698 |
| 2010-11-21 | 81.52 |
| 2010-11-22 | 83.936 |
| 2010-11-23 | 84.412 |
| 2010-11-24 | 88.279 |
| 2010-11-25 | 89.843 |
| 2010-11-26 | 88.867 |
| 2010-11-27 | 89.219 |
| 2010-11-28 | 88.878 |
| 2010-11-29 | 90.908 |
| 2010-11-30 | 95.604 |
| 2010-12-01 | 94.389 |
| 2010-12-02 | 93.374 |
| 2010-12-03 | 93.529 |
| 2010-12-04 | 93.825 |
| 2010-12-05 | 93.417 |
| 2010-12-06 | 95.152 |
| 2010-12-07 | 97.248 |
| 2010-12-08 | 96.418 |
| 2010-12-09 | 94.989 |
| 2010-12-10 | 94.385 |
| 2010-12-11 | 93.218 |
| 2010-12-12 | 93.046 |
| 2010-12-13 | 93.87 |
| 2010-12-14 | 93.755 |
| 2010-12-15 | 92.145 |
| 2010-12-16 | 92.653 |
| 2010-12-17 | 93.636 |
| 2010-12-18 | 93.822 |
| 2010-12-19 | 93.349 |
| 2010-12-20 | 94.881 |
| 2010-12-21 | 96.119 |
| 2010-12-22 | 97.808 |
| 2010-12-23 | 99.385 |
| 2010-12-24 | 98.043 |
| 2010-12-25 | 99.371 |
| 2010-12-26 | 100.991 |
| 2010-12-27 | 101.693 |
| 2010-12-28 | 103.913 |
| 2010-12-29 | 100.38 |
| 2010-12-30 | 99.645 |
| 2010-12-31 | 98.022 |
| 2011-01-01 | 97.459 |
| 2011-01-02 | 96.606 |
| 2011-01-03 | 96.125 |
| 2011-01-04 | 98.676 |
| 2011-01-05 | 96.472 |
| 2011-01-06 | 94.678 |
| 2011-01-07 | 94.908 |
| 2011-01-08 | 94.68 |
| 2011-01-09 | 95.421 |
| 2011-01-10 | 96.872 |
| 2011-01-11 | 97.504 |
| 2011-01-12 | 97.561 |
| 2011-01-13 | 97.364 |
| 2011-01-14 | 97.173 |
| 2011-01-15 | 94.986 |
| 2011-01-16 | 92.502 |
| 2011-01-17 | 92.905 |
| 2011-01-18 | 91.82 |
| 2011-01-19 | 89.633 |
| 2011-01-20 | 86.376 |
| 2011-01-21 | 83.881 |
| 2011-01-22 | 81.768 |
| 2011-01-23 | 79.979 |
| 2011-01-24 | 79.168 |
| 2011-01-25 | 82.477 |
| 2011-01-26 | 83.353 |
| 2011-01-27 | 81.156 |
| 2011-01-28 | 81.709 |
| 2011-01-29 | 78.452 |
| 2011-01-30 | 78.487 |
| 2011-01-31 | 78.692 |
| 2011-02-01 | 80.598 |
| 2011-02-02 | 81.419 |
| 2011-02-03 | 81.22 |
| 2011-02-04 | 82.889 |
| 2011-02-05 | 82.624 |
| 2011-02-06 | 81.884 |
| 2011-02-07 | 81.143 |
| 2011-02-08 | 80.248 |
| 2011-02-09 | 79.929 |
| 2011-02-10 | 80.42 |
| 2011-02-11 | 81.197 |
| 2011-02-12 | 81.135 |
| 2011-02-13 | 81.231 |
| 2011-02-14 | 81.422 |
| 2011-02-15 | 82.186 |
| 2011-02-16 | 81.206 |
| 2011-02-17 | 82.254 |
| 2011-02-18 | 82.381 |
| 2011-02-19 | 82.96 |
| 2011-02-20 | 82.05 |
| 2011-02-21 | 83.64 |
| 2011-02-22 | 86.672 |
| 2011-02-23 | 85.554 |
| 2011-02-24 | 83.548 |
| 2011-02-25 | 84.348 |
| 2011-02-26 | 86.331 |
| 2011-02-27 | 86.081 |
| 2011-02-28 | 87.535 |
| 2011-03-01 | 91.953 |
| 2011-03-02 | 93.206 |
| 2011-03-03 | 94.436 |
| 2011-03-04 | 95.129 |
| 2011-03-05 | 94.282 |
| 2011-03-06 | 92.823 |
| 2011-03-07 | 95.242 |
| 2011-03-08 | 99.03 |
| 2011-03-09 | 103.693 |
| 2011-03-10 | 106.35 |
| 2011-03-11 | 108.023 |
| 2011-03-12 | 107.659 |
| 2011-03-13 | 107.856 |
| 2011-03-14 | 108.799 |
| 2011-03-15 | 111.199 |
| 2011-03-16 | 114.192 |
| 2011-03-17 | 116.213 |
| 2011-03-18 | 119.066 |
| 2011-03-19 | 120.569 |
| 2011-03-20 | 121.548 |
| 2011-03-21 | 124.046 |
| 2011-03-22 | 128.421 |
| 2011-03-23 | 132.497 |
| 2011-03-24 | 131.859 |
| 2011-03-25 | 133.774 |
| 2011-03-26 | 132.416 |
| 2011-03-27 | 131.215 |
| 2011-03-28 | 131.338 |
| 2011-03-29 | 135.812 |
| 2011-03-30 | 136.408 |
| 2011-03-31 | 134.65 |
| 2011-04-01 | 134.612 |
| 2011-04-02 | 131.639 |
| 2011-04-03 | 130.052 |
| 2011-04-04 | 129.52 |
| 2011-04-05 | 131.272 |
| 2011-04-06 | 130.994 |
| 2011-04-07 | 127.948 |
| 2011-04-08 | 124.124 |
| 2011-04-09 | 121.313 |
| 2011-04-10 | 119.231 |
| 2011-04-11 | 119.416 |
| 2011-04-12 | 118.91 |
| 2011-04-13 | 119.695 |
| 2011-04-14 | 118.657 |
| 2011-04-15 | 116.006 |
| 2011-04-16 | 114.372 |
| 2011-04-17 | 110.451 |
| 2011-04-18 | 108.899 |
| 2011-04-19 | 108.926 |
| 2011-04-20 | 106.572 |
| 2011-04-21 | 104.061 |
| 2011-04-22 | 99.071 |
| 2011-04-23 | 96.71 |
| 2011-04-24 | 95.476 |
| 2011-04-25 | 94.64 |
| 2011-04-26 | 96.05 |
| 2011-04-27 | 95.812 |
| 2011-04-28 | 92.952 |
| 2011-04-29 | 91.076 |
| 2011-04-30 | 90.672 |
| 2011-05-01 | 88.793 |
| 2011-05-02 | 90.443 |
| 2011-05-03 | 97.016 |
| 2011-05-04 | 98.386 |
| 2011-05-05 | 98.312 |
| 2011-05-06 | 97.458 |
| 2011-05-07 | 98.984 |
| 2011-05-08 | 97.89 |
| 2011-05-09 | 100.359 |
| 2011-05-10 | 102.576 |
| 2011-05-11 | 102.244 |
| 2011-05-12 | 101.998 |
| 2011-05-13 | 102.084 |
| 2011-05-14 | 100.175 |
| 2011-05-15 | 100.424 |
| 2011-05-16 | 101.089 |
| 2011-05-17 | 102.571 |
| 2011-05-18 | 102.517 |
| 2011-05-19 | 104.304 |
| 2011-05-20 | 104.327 |
| 2011-05-21 | 102.588 |
| 2011-05-22 | 102.7 |
| 2011-05-23 | 104.235 |
| 2011-05-24 | 105.595 |
| 2011-05-25 | 106.959 |
| 2011-05-26 | 105.612 |
| 2011-05-27 | 104.603 |
| 2011-05-28 | 103.243 |
| 2011-05-29 | 103.357 |
| 2011-05-30 | 103.289 |
| 2011-05-31 | 105.64 |
| 2011-06-01 | 105.002 |
| 2011-06-02 | 98.907 |
| 2011-06-03 | 97.373 |
| 2011-06-04 | 95.791 |
| 2011-06-05 | 94.893 |
| 2011-06-06 | 92.96 |
| 2011-06-07 | 94.782 |
| 2011-06-08 | 94.652 |
| 2011-06-09 | 93.336 |
| 2011-06-10 | 93.399 |
| 2011-06-11 | 92.455 |
| 2011-06-12 | 92.114 |
| 2011-06-13 | 93.86 |
| 2011-06-14 | 92.162 |
| 2011-06-15 | 91.984 |
| 2011-06-16 | 93.346 |
| 2011-06-17 | 93.099 |
| 2011-06-18 | 90.335 |
| 2011-06-19 | 89.796 |
| 2011-06-20 | 90.088 |
| 2011-06-21 | 89.898 |
| 2011-06-22 | 87.769 |
| 2011-06-23 | 87.567 |
| 2011-06-24 | 87.431 |
| 2011-06-25 | 86.454 |
| 2011-06-26 | 85.755 |
| 2011-06-27 | 87.046 |
| 2011-06-28 | 86.842 |
| 2011-06-29 | 85.824 |
| 2011-06-30 | 84.537 |
| 2011-07-01 | 84.293 |
| 2011-07-02 | 83.18 |
| 2011-07-03 | 84.233 |
| 2011-07-04 | 84.787 |
| 2011-07-05 | 84.99 |
| 2011-07-06 | 84.294 |
| 2011-07-07 | 83.848 |
| 2011-07-08 | 81.956 |
| 2011-07-09 | 80.808 |
| 2011-07-10 | 80.585 |
| 2011-07-11 | 81.662 |
| 2011-07-12 | 80.727 |
| 2011-07-13 | 80.299 |
| 2011-07-14 | 81.351 |
| 2011-07-15 | 81.675 |
| 2011-07-16 | 79.53 |
| 2011-07-17 | 78.913 |
| 2011-07-18 | 79.096 |
| 2011-07-19 | 81.134 |
| 2011-07-20 | 81.733 |
| 2011-07-21 | 82.112 |
| 2011-07-22 | 82.324 |
| 2011-07-23 | 80.773 |
| 2011-07-24 | 78.052 |
| 2011-07-25 | 78.372 |
| 2011-07-26 | 79.01 |
| 2011-07-27 | 78.35 |
| 2011-07-28 | 79.543 |
| 2011-07-29 | 80.007 |
| 2011-07-30 | 79.121 |
| 2011-07-31 | 77.934 |
| 2011-08-01 | 79.106 |
| 2011-08-02 | 78.835 |
| 2011-08-03 | 79.377 |
| 2011-08-04 | 79.149 |
| 2011-08-05 | 79.497 |
| 2011-08-06 | 77.416 |
| 2011-08-07 | 77.732 |
| 2011-08-08 | 78.661 |
| 2011-08-09 | 77.967 |
| 2011-08-10 | 76.607 |
| 2011-08-11 | 77.125 |
| 2011-08-12 | 76.337 |
| 2011-08-13 | 75.38 |
| 2011-08-14 | 73.651 |
| 2011-08-15 | 76.314 |
| 2011-08-16 | 76.151 |
| 2011-08-17 | 75.019 |
| 2011-08-18 | 74.45 |
| 2011-08-19 | 75.368 |
| 2011-08-20 | 76.055 |
| 2011-08-21 | 75.296 |
| 2011-08-22 | 77.343 |
| 2011-08-23 | 82.82 |
| 2011-08-24 | 85.347 |
| 2011-08-25 | 85.917 |
| 2011-08-26 | 86.086 |
| 2011-08-27 | 85.616 |
| 2011-08-28 | 84.286 |
| 2011-08-29 | 85.964 |
| 2011-08-30 | 86.235 |
| 2011-08-31 | 86.335 |
| 2011-09-01 | 86.34 |
| 2011-09-02 | 86.961 |
| 2011-09-03 | 87.439 |
| 2011-09-04 | 87.516 |
| 2011-09-05 | 90.602 |
| 2011-09-06 | 92.727 |
| 2011-09-07 | 92.496 |
| 2011-09-08 | 93.707 |
| 2011-09-09 | 95.253 |
| 2011-09-10 | 95.4 |
| 2011-09-11 | 94.861 |
| 2011-09-12 | 96.994 |
| 2011-09-13 | 99.404 |
| 2011-09-14 | 97.648 |
| 2011-09-15 | 98.677 |
| 2011-09-16 | 99.805 |
| 2011-09-17 | 98.471 |
| 2011-09-18 | 96.279 |
| 2011-09-19 | 94.459 |
| 2011-09-20 | 95.492 |
| 2011-09-21 | 94.113 |
| 2011-09-22 | 90.328 |
| 2011-09-23 | 88.107 |
| 2011-09-24 | 86.381 |
| 2011-09-25 | 84.573 |
| 2011-09-26 | 84.089 |
| 2011-09-27 | 85.134 |
| 2011-09-28 | 82.823 |
| 2011-09-29 | 83.901 |
| 2011-09-30 | 83.145 |
| 2011-10-01 | 82.86 |
| 2011-10-02 | 80.598 |
| 2011-10-03 | 80.62 |
| 2011-10-04 | 81.264 |
| 2011-10-05 | 79.353 |
| 2011-10-06 | 77.617 |
| 2011-10-07 | 77.171 |
| 2011-10-08 | 75.457 |
| 2011-10-09 | 73.729 |
| 2011-10-10 | 72.381 |
| 2011-10-11 | 73.451 |
| 2011-10-12 | 74.354 |
| 2011-10-13 | 75.154 |
| 2011-10-14 | 75.006 |
| 2011-10-15 | 74.453 |
| 2011-10-16 | 73.836 |
| 2011-10-17 | 74.737 |
| 2011-10-18 | 76.752 |
| 2011-10-19 | 76.569 |
| 2011-10-20 | 76.617 |
| 2011-10-21 | 76.899 |
| 2011-10-22 | 76.236 |
| 2011-10-23 | 75.53 |
| 2011-10-24 | 76.816 |
| 2011-10-25 | 78.25 |
| 2011-10-26 | 77.952 |
| 2011-10-27 | 76.855 |
| 2011-10-28 | 76.709 |
| 2011-10-29 | 75.2 |
| 2011-10-30 | 74.914 |
| 2011-10-31 | 74.936 |
| 2011-11-01 | 76.358 |
| 2011-11-02 | 74.545 |
| 2011-11-03 | 75.772 |
| 2011-11-04 | 77.284 |
| 2011-11-05 | 76.426 |
| 2011-11-06 | 75.005 |
| 2011-11-07 | 75.591 |
| 2011-11-08 | 77.05 |
| 2011-11-09 | 78.964 |
| 2011-11-10 | 78.797 |
| 2011-11-11 | 76.447 |
| 2011-11-12 | 73.651 |
| 2011-11-13 | 73.745 |
| 2011-11-14 | 74.639 |
| 2011-11-15 | 76.636 |
| 2011-11-16 | 76.203 |
| 2011-11-17 | 76.013 |
| 2011-11-18 | 77.944 |
| 2011-11-19 | 78.065 |
| 2011-11-20 | 76.328 |
| 2011-11-21 | 77.904 |
| 2011-11-22 | 77.45 |
| 2011-11-23 | 77.648 |
| 2011-11-24 | 77.159 |
| 2011-11-25 | 77.785 |
| 2011-11-26 | 77.648 |
| 2011-11-27 | 79.702 |
| 2011-11-28 | 81.602 |
| 2011-11-29 | 83.199 |
| 2011-11-30 | 83.25 |
| 2011-12-01 | 84.047 |
| 2011-12-02 | 86.271 |
| 2011-12-03 | 85.147 |
| 2011-12-04 | 83.379 |
| 2011-12-05 | 84.59 |
| 2011-12-06 | 85.993 |
| 2011-12-07 | 85.468 |
| 2011-12-08 | 85.624 |
| 2011-12-09 | 84.253 |
| 2011-12-10 | 82.663 |
| 2011-12-11 | 81.569 |
| 2011-12-12 | 83.152 |
| 2011-12-13 | 83.582 |
| 2011-12-14 | 84.164 |
| 2011-12-15 | 83.102 |
| 2011-12-16 | 84.282 |
| 2011-12-17 | 82.266 |
| 2011-12-18 | 80.926 |
| 2011-12-19 | 81.274 |
| 2011-12-20 | 85.335 |
| 2011-12-21 | 84.288 |
| 2011-12-22 | 85.125 |
| 2011-12-23 | 84.235 |
| 2011-12-24 | 85.094 |
| 2011-12-25 | 84.421 |
| 2011-12-26 | 86.2 |
| 2011-12-27 | 84.708 |
| 2011-12-28 | 84.083 |
| 2011-12-29 | 84.344 |
| 2011-12-30 | 85.732 |
| 2011-12-31 | 84.179 |
| 2012-01-01 | 83.117 |
| 2012-01-02 | 82.564 |
| 2012-01-03 | 83.552 |
| 2012-01-04 | 82.881 |
| 2012-01-05 | 83.165 |
| 2012-01-06 | 84.857 |
| 2012-01-07 | 84.412 |
| 2012-01-08 | 83.881 |
| 2012-01-09 | 85.743 |
| 2012-01-10 | 86.833 |
| 2012-01-11 | 86.979 |
| 2012-01-12 | 87.452 |
| 2012-01-13 | 86.954 |
| 2012-01-14 | 87.632 |
| 2012-01-15 | 85.447 |
| 2012-01-16 | 86.269 |
| 2012-01-17 | 85.861 |
| 2012-01-18 | 85.451 |
| 2012-01-19 | 82.883 |
| 2012-01-20 | 82.576 |
| 2012-01-21 | 81.811 |
| 2012-01-22 | 80.592 |
| 2012-01-23 | 81.122 |
| 2012-01-24 | 82.475 |
| 2012-01-25 | 81.22 |
| 2012-01-26 | 81.802 |
| 2012-01-27 | 80.86 |
| 2012-01-28 | 78.722 |
| 2012-01-29 | 75.799 |
| 2012-01-30 | 78.165 |
| 2012-01-31 | 78.084 |
| 2012-02-01 | 80.579 |
| 2012-02-02 | 79.57 |
| 2012-02-03 | 80.438 |
| 2012-02-04 | 79.888 |
| 2012-02-05 | 77.881 |
| 2012-02-06 | 79.587 |
| 2012-02-07 | 82.496 |
| 2012-02-08 | 82.291 |
| 2012-02-09 | 82.929 |
| 2012-02-10 | 81.741 |
| 2012-02-11 | 79.98 |
| 2012-02-12 | 78.223 |
| 2012-02-13 | 76.865 |
| 2012-02-14 | 77.768 |
| 2012-02-15 | 79.63 |
| 2012-02-16 | 80.469 |
| 2012-02-17 | 79.667 |
| 2012-02-18 | 79.251 |
| 2012-02-19 | 78.302 |
| 2012-02-20 | 81.291 |
| 2012-02-21 | 84.701 |
| 2012-02-22 | 84.421 |
| 2012-02-23 | 83.247 |
| 2012-02-24 | 86.151 |
| 2012-02-25 | 87.75 |
| 2012-02-26 | 87.522 |
| 2012-02-27 | 87.642 |
| 2012-02-28 | 90.153 |
| 2012-02-29 | 90.769 |
| 2012-03-01 | 91.485 |
| 2012-03-02 | 90.311 |
| 2012-03-03 | 90.743 |
| 2012-03-04 | 90.459 |
| 2012-03-05 | 92.145 |
| 2012-03-06 | 94.492 |
| 2012-03-07 | 94.934 |
| 2012-03-08 | 95.306 |
| 2012-03-09 | 96.977 |
| 2012-03-10 | 94.949 |
| 2012-03-11 | 94.208 |
| 2012-03-12 | 94.89 |
| 2012-03-13 | 95.533 |
| 2012-03-14 | 95.777 |
| 2012-03-15 | 95.261 |
| 2012-03-16 | 93.395 |
| 2012-03-17 | 92.445 |
| 2012-03-18 | 91.839 |
| 2012-03-19 | 92.382 |
| 2012-03-20 | 94.453 |
| 2012-03-21 | 93.595 |
| 2012-03-22 | 91.132 |
| 2012-03-23 | 90.871 |
| 2012-03-24 | 90.305 |
| 2012-03-25 | 86.929 |
| 2012-03-26 | 85.126 |
| 2012-03-27 | 87.287 |
| 2012-03-28 | 90.439 |
| 2012-03-29 | 89.435 |
| 2012-03-30 | 87.974 |
| 2012-03-31 | 87.967 |
| 2012-04-01 | 89.368 |
| 2012-04-02 | 92.158 |
| 2012-04-03 | 93.492 |
| 2012-04-04 | 93.811 |
| 2012-04-05 | 94.014 |
| 2012-04-06 | 92.35 |
| 2012-04-07 | 90.263 |
| 2012-04-08 | 88.404 |
| 2012-04-09 | 91.802 |
| 2012-04-10 | 94.137 |
| 2012-04-11 | 94.61 |
| 2012-04-12 | 97.011 |
| 2012-04-13 | 98.464 |
| 2012-04-14 | 99.072 |
| 2012-04-15 | 98.537 |
| 2012-04-16 | 101.325 |
| 2012-04-17 | 104.197 |
| 2012-04-18 | 103.939 |
| 2012-04-19 | 102.622 |
| 2012-04-20 | 101.822 |
| 2012-04-21 | 101.178 |
| 2012-04-22 | 100.084 |
| 2012-04-23 | 101.389 |
| 2012-04-24 | 102.786 |
| 2012-04-25 | 102.928 |
| 2012-04-26 | 103.006 |
| 2012-04-27 | 100.836 |
| 2012-04-28 | 99.188 |
| 2012-04-29 | 98.084 |
| 2012-04-30 | 98.371 |
| 2012-05-01 | 96.151 |
| 2012-05-02 | 93.921 |
| 2012-05-03 | 92.83 |
| 2012-05-04 | 90.702 |
| 2012-05-05 | 88.104 |
| 2012-05-06 | 86.01 |
| 2012-05-07 | 84.972 |
| 2012-05-08 | 85.236 |
| 2012-05-09 | 82.827 |
| 2012-05-10 | 80.803 |
| 2012-05-11 | 81.623 |
| 2012-05-12 | 78.098 |
| 2012-05-13 | 76.135 |
| 2012-05-14 | 75.56 |
| 2012-05-15 | 76.759 |
| 2012-05-16 | 74.43 |
| 2012-05-17 | 72.301 |
| 2012-05-18 | 73.897 |
| 2012-05-19 | 74.313 |
| 2012-05-20 | 73.421 |
| 2012-05-21 | 73.78 |
| 2012-05-22 | 75.622 |
| 2012-05-23 | 75.478 |
| 2012-05-24 | 76.147 |
| 2012-05-25 | 76.079 |
| 2012-05-26 | 74.029 |
| 2012-05-27 | 72.77 |
| 2012-05-28 | 76.887 |
| 2012-05-29 | 77.592 |
| 2012-05-30 | 77.206 |
| 2012-05-31 | 77.764 |
| 2012-06-01 | 77.108 |
| 2012-06-02 | 75.341 |
| 2012-06-03 | 73.699 |
| 2012-06-04 | 73.755 |
| 2012-06-05 | 75.15 |
| 2012-06-06 | 75.466 |
| 2012-06-07 | 76.08 |
| 2012-06-08 | 77.357 |
| 2012-06-09 | 78.493 |
| 2012-06-10 | 76.828 |
| 2012-06-11 | 78.41 |
| 2012-06-12 | 79.681 |
| 2012-06-13 | 80.795 |
| 2012-06-14 | 81.455 |
| 2012-06-15 | 81.066 |
| 2012-06-16 | 81.231 |
| 2012-06-17 | 78.646 |
| 2012-06-18 | 79.487 |
| 2012-06-19 | 80.754 |
| 2012-06-20 | 83.714 |
| 2012-06-21 | 82.291 |
| 2012-06-22 | 81.82 |
| 2012-06-23 | 79.536 |
| 2012-06-24 | 78.817 |
| 2012-06-25 | 80.244 |
| 2012-06-26 | 83.016 |
| 2012-06-27 | 79.379 |
| 2012-06-28 | 79.41 |
| 2012-06-29 | 79.136 |
| 2012-06-30 | 77.591 |
| 2012-07-01 | 75.98 |
| 2012-07-02 | 75.865 |
| 2012-07-03 | 78.013 |
| 2012-07-04 | 80.971 |
| 2012-07-05 | 81.484 |
| 2012-07-06 | 81.243 |
| 2012-07-07 | 79.837 |
| 2012-07-08 | 77.7 |
| 2012-07-09 | 77.505 |
| 2012-07-10 | 78.745 |
| 2012-07-11 | 78.443 |
| 2012-07-12 | 77.576 |
| 2012-07-13 | 77.857 |
| 2012-07-14 | 76.792 |
| 2012-07-15 | 76.553 |
| 2012-07-16 | 76.399 |
| 2012-07-17 | 79.274 |
| 2012-07-18 | 79.329 |
| 2012-07-19 | 80.535 |
| 2012-07-20 | 81.151 |
| 2012-07-21 | 80.071 |
| 2012-07-22 | 79.608 |
| 2012-07-23 | 80.8 |
| 2012-07-24 | 82.446 |
| 2012-07-25 | 82.01 |
| 2012-07-26 | 80.226 |
| 2012-07-27 | 80.855 |
| 2012-07-28 | 79.801 |
| 2012-07-29 | 79.514 |
| 2012-07-30 | 81.745 |
| 2012-07-31 | 83.263 |
| 2012-08-01 | 84.01 |
| 2012-08-02 | 83.188 |
| 2012-08-03 | 81.351 |
| 2012-08-04 | 80.106 |
| 2012-08-05 | 79.788 |
| 2012-08-06 | 81.083 |
| 2012-08-07 | 83.943 |
| 2012-08-08 | 83.663 |
| 2012-08-09 | 83.326 |
| 2012-08-10 | 83.857 |
| 2012-08-11 | 83.401 |
| 2012-08-12 | 81.94 |
| 2012-08-13 | 82.254 |
| 2012-08-14 | 84.283 |
| 2012-08-15 | 85.626 |
| 2012-08-16 | 83.621 |
| 2012-08-17 | 83.616 |
| 2012-08-18 | 80.328 |
| 2012-08-19 | 75.938 |
| 2012-08-20 | 76.883 |
| 2012-08-21 | 77.459 |
| 2012-08-22 | 78.896 |
| 2012-08-23 | 77.778 |
| 2012-08-24 | 77.206 |
| 2012-08-25 | 75.621 |
| 2012-08-26 | 75.16 |
| 2012-08-27 | 75.919 |
| 2012-08-28 | 75.994 |
| 2012-08-29 | 74.417 |
| 2012-08-30 | 75.054 |
| 2012-08-31 | 75.105 |
| 2012-09-01 | 74.953 |
| 2012-09-02 | 74.614 |
| 2012-09-03 | 75.019 |
| 2012-09-04 | 76.027 |
| 2012-09-05 | 75.43 |
| 2012-09-06 | 73.441 |
| 2012-09-07 | 73.257 |
| 2012-09-08 | 72.448 |
| 2012-09-09 | 71.812 |
| 2012-09-10 | 72.282 |
| 2012-09-11 | 72.795 |
| 2012-09-12 | 73.103 |
| 2012-09-13 | 71.661 |
| 2012-09-14 | 71.051 |
| 2012-09-15 | 69.51 |
| 2012-09-16 | 68.537 |
| 2012-09-17 | 69.966 |
| 2012-09-18 | 71.574 |
| 2012-09-19 | 71.043 |
| 2012-09-20 | 70.274 |
| 2012-09-21 | 68.41 |
| 2012-09-22 | 66.81 |
| 2012-09-23 | 66.212 |
| 2012-09-24 | 67.26 |
| 2012-09-25 | 67.976 |
| 2012-09-26 | 68.113 |
| 2012-09-27 | 69.211 |
| 2012-09-28 | 70.038 |
| 2012-09-29 | 69.298 |
| 2012-09-30 | 68.972 |
| 2012-10-01 | 69.102 |
| 2012-10-02 | 69.678 |
| 2012-10-03 | 69.889 |
| 2012-10-04 | 69.511 |
| 2012-10-05 | 69.72 |
| 2012-10-06 | 69.53 |
| 2012-10-07 | 68.517 |
| 2012-10-08 | 69.498 |
| 2012-10-09 | 70.898 |
| 2012-10-10 | 70.835 |
| 2012-10-11 | 71.163 |
| 2012-10-12 | 70.566 |
| 2012-10-13 | 70.863 |
| 2012-10-14 | 69.871 |
| 2012-10-15 | 72.55 |
| 2012-10-16 | 72.711 |
| 2012-10-17 | 72.825 |
| 2012-10-18 | 73.725 |
| 2012-10-19 | 75.417 |
| 2012-10-20 | 76.041 |
| 2012-10-21 | 76.533 |
| 2012-10-22 | 81.039 |
| 2012-10-23 | 82.864 |
| 2012-10-24 | 83.332 |
| 2012-10-25 | 83.833 |
| 2012-10-26 | 83.187 |
| 2012-10-27 | 81.299 |
| 2012-10-28 | 79.992 |
| 2012-10-29 | 81.832 |
| 2012-10-30 | 82.165 |
| 2012-10-31 | 82.935 |
| 2012-11-01 | 82.01 |
| 2012-11-02 | 81.723 |
| 2012-11-03 | 81.374 |
| 2012-11-04 | 80.292 |
| 2012-11-05 | 80.704 |
| 2012-11-06 | 83.711 |
| 2012-11-07 | 82.078 |
| 2012-11-08 | 80.456 |
| 2012-11-09 | 80.705 |
| 2012-11-10 | 79.535 |
| 2012-11-11 | 78.549 |
| 2012-11-12 | 79.669 |
| 2012-11-13 | 80.162 |
| 2012-11-14 | 77.732 |
| 2012-11-15 | 78.286 |
| 2012-11-16 | 78.372 |
| 2012-11-17 | 78.389 |
| 2012-11-18 | 77.566 |
| 2012-11-19 | 79.077 |
| 2012-11-20 | 80.842 |
| 2012-11-21 | 79.269 |
| 2012-11-22 | 79.773 |
| 2012-11-23 | 81.38 |
| 2012-11-24 | 80.466 |
| 2012-11-25 | 79.895 |
| 2012-11-26 | 81.913 |
| 2012-11-27 | 82.463 |
| 2012-11-28 | 80.402 |
| 2012-11-29 | 79.984 |
| 2012-11-30 | 79.751 |
| 2012-12-01 | 79.182 |
| 2012-12-02 | 79.795 |
| 2012-12-03 | 79.991 |
| 2012-12-04 | 81.54 |
| 2012-12-05 | 82.319 |
| 2012-12-06 | 79.317 |
| 2012-12-07 | 81.438 |
| 2012-12-08 | 81.496 |
| 2012-12-09 | 79.803 |
| 2012-12-10 | 79.998 |
| 2012-12-11 | 81.863 |
| 2012-12-12 | 81.872 |
| 2012-12-13 | 83.027 |
| 2012-12-14 | 84.621 |
| 2012-12-15 | 83.306 |
| 2012-12-16 | 81.957 |
| 2012-12-17 | 81.197 |
| 2012-12-18 | 81.236 |
| 2012-12-19 | 80.758 |
| 2012-12-20 | 78.981 |
| 2012-12-21 | 77.677 |
| 2012-12-22 | 75.646 |
| 2012-12-23 | 73.82 |
| 2012-12-24 | 74.714 |
| 2012-12-25 | 76.536 |
| 2012-12-26 | 74.715 |
| 2012-12-27 | 74.54 |
| 2012-12-28 | 76.158 |
| 2012-12-29 | 75.799 |
| 2012-12-30 | 75.82 |
| 2012-12-31 | 76.253 |
| 2013-01-01 | 77.694 |
| 2013-01-02 | 78.19 |
| 2013-01-03 | 77.405 |
| 2013-01-04 | 77.254 |
| 2013-01-05 | 77.771 |
| 2013-01-06 | 74.919 |
| 2013-01-07 | 75.672 |
| 2013-01-08 | 77.785 |
| 2013-01-09 | 78.134 |
| 2013-01-10 | 76.365 |
| 2013-01-11 | 75.91 |
| 2013-01-12 | 75.527 |
| 2013-01-13 | 73.9 |
| 2013-01-14 | 74.581 |
| 2013-01-15 | 76.824 |
| 2013-01-16 | 77.105 |
| 2013-01-17 | 78.627 |
| 2013-01-18 | 80.113 |
| 2013-01-19 | 80.913 |
| 2013-01-20 | 81.893 |
| 2013-01-21 | 83.924 |
| 2013-01-22 | 86.704 |
| 2013-01-23 | 87.623 |
| 2013-01-24 | 87.395 |
| 2013-01-25 | 89.684 |
| 2013-01-26 | 89.808 |
| 2013-01-27 | 88.663 |
| 2013-01-28 | 91.165 |
| 2013-01-29 | 90.104 |
| 2013-01-30 | 91.459 |
| 2013-01-31 | 89.354 |
| 2013-02-01 | 91.081 |
| 2013-02-02 | 89.763 |
| 2013-02-03 | 89.175 |
| 2013-02-04 | 90.097 |
| 2013-02-05 | 92.088 |
| 2013-02-06 | 92.362 |
| 2013-02-07 | 92.072 |
| 2013-02-08 | 92.783 |
| 2013-02-09 | 93.662 |
| 2013-02-10 | 93.998 |
| 2013-02-11 | 94.462 |
| 2013-02-12 | 95.637 |
| 2013-02-13 | 98.948 |
| 2013-02-14 | 97.659 |
| 2013-02-15 | 96.9 |
| 2013-02-16 | 94.91 |
| 2013-02-17 | 92.652 |
| 2013-02-18 | 91.212 |
| 2013-02-19 | 91.432 |
| 2013-02-20 | 90.276 |
| 2013-02-21 | 86.346 |
| 2013-02-22 | 85.152 |
| 2013-02-23 | 83.124 |
| 2013-02-24 | 80.288 |
| 2013-02-25 | 79.752 |
| 2013-02-26 | 81.244 |
| 2013-02-27 | 81.174 |
| 2013-02-28 | 82.142 |
| 2013-03-01 | 81.028 |
| 2013-03-02 | 80.274 |
| 2013-03-03 | 77.154 |
| 2013-03-04 | 77.371 |
| 2013-03-05 | 78.142 |
| 2013-03-06 | 78.383 |
| 2013-03-07 | 78.646 |
| 2013-03-08 | 78.659 |
| 2013-03-09 | 78.008 |
| 2013-03-10 | 76.854 |
| 2013-03-11 | 76.508 |
| 2013-03-12 | 76.093 |
| 2013-03-13 | 76.293 |
| 2013-03-14 | 74.92 |
| 2013-03-15 | 71.912 |
| 2013-03-16 | 71.955 |
| 2013-03-17 | 71.352 |
| 2013-03-18 | 72.72 |
| 2013-03-19 | 72.825 |
| 2013-03-20 | 73.139 |
| 2013-03-21 | 72.226 |
| 2013-03-22 | 72.981 |
| 2013-03-23 | 73.741 |
| 2013-03-24 | 73.035 |
| 2013-03-25 | 75.206 |
| 2013-03-26 | 76.82 |
| 2013-03-27 | 78.516 |
| 2013-03-28 | 76.613 |
| 2013-03-29 | 76.813 |
| 2013-03-30 | 76.584 |
| 2013-03-31 | 75.393 |
| 2013-04-01 | 77.677 |
| 2013-04-02 | 78.741 |
| 2013-04-03 | 79.799 |
| 2013-04-04 | 81.06 |
| 2013-04-05 | 81.38 |
| 2013-04-06 | 80.913 |
| 2013-04-07 | 80.843 |
| 2013-04-08 | 83.024 |
| 2013-04-09 | 83.855 |
| 2013-04-10 | 84.574 |
| 2013-04-11 | 83.31 |
| 2013-04-12 | 83.073 |
| 2013-04-13 | 84.025 |
| 2013-04-14 | 82.383 |
| 2013-04-15 | 82.977 |
| 2013-04-16 | 84.76 |
| 2013-04-17 | 86.307 |
| 2013-04-18 | 86.323 |
| 2013-04-19 | 86.946 |
| 2013-04-20 | 87.249 |
| 2013-04-21 | 85.769 |
| 2013-04-22 | 89.406 |
| 2013-04-23 | 92.517 |
| 2013-04-24 | 92.572 |
| 2013-04-25 | 92.195 |
| 2013-04-26 | 92.127 |
| 2013-04-27 | 92.551 |
| 2013-04-28 | 91.05 |
| 2013-04-29 | 92.057 |
| 2013-04-30 | 93.844 |
| 2013-05-01 | 92.823 |
| 2013-05-02 | 92.757 |
| 2013-05-03 | 92.929 |
| 2013-05-04 | 90.693 |
| 2013-05-05 | 89.441 |
| 2013-05-06 | 89.878 |
| 2013-05-07 | 89.637 |
| 2013-05-08 | 88.406 |
| 2013-05-09 | 87.841 |
| 2013-05-10 | 86.806 |
| 2013-05-11 | 87.35 |
| 2013-05-12 | 85.737 |
| 2013-05-13 | 85.745 |
| 2013-05-14 | 87.391 |
| 2013-05-15 | 85.364 |
| 2013-05-16 | 84.734 |
| 2013-05-17 | 83.137 |
| 2013-05-18 | 81.918 |
| 2013-05-19 | 82.329 |
| 2013-05-20 | 83.272 |
| 2013-05-21 | 84.277 |
| 2013-05-22 | 81.33 |
| 2013-05-23 | 79.583 |
| 2013-05-24 | 79.601 |
| 2013-05-25 | 80.35 |
| 2013-05-26 | 78.156 |
| 2013-05-27 | 80.037 |
| 2013-05-28 | 82.616 |
| 2013-05-29 | 83.241 |
| 2013-05-30 | 83.927 |
| 2013-05-31 | 83.867 |
| 2013-06-01 | 83.653 |
| 2013-06-02 | 82.615 |
| 2013-06-03 | 82.825 |
| 2013-06-04 | 84.43 |
| 2013-06-05 | 83.439 |
| 2013-06-06 | 83.358 |
| 2013-06-07 | 85.744 |
| 2013-06-08 | 86.185 |
| 2013-06-09 | 87.067 |
| 2013-06-10 | 87.956 |
| 2013-06-11 | 90.539 |
| 2013-06-12 | 90.61 |
| 2013-06-13 | 90.455 |
| 2013-06-14 | 91.634 |
| 2013-06-15 | 91.928 |
| 2013-06-16 | 91.404 |
| 2013-06-17 | 94.85 |
| 2013-06-18 | 95.54 |
| 2013-06-19 | 95.32 |
| 2013-06-20 | 95.186 |
| 2013-06-21 | 95.083 |
| 2013-06-22 | 93.136 |
| 2013-06-23 | 91.005 |
| 2013-06-24 | 90.699 |
| 2013-06-25 | 92.474 |
| 2013-06-26 | 91.489 |
| 2013-06-27 | 87.54 |
| 2013-06-28 | 85.25 |
| 2013-06-29 | 82.596 |
| 2013-06-30 | 82.58 |
| 2013-07-01 | 82.842 |
| 2013-07-02 | 84.731 |
| 2013-07-03 | 85.464 |
| 2013-07-04 | 84.378 |
| 2013-07-05 | 84.687 |
| 2013-07-06 | 83.452 |
| 2013-07-07 | 80.519 |
| 2013-07-08 | 80.84 |
| 2013-07-09 | 81.221 |
| 2013-07-10 | 80.87 |
| 2013-07-11 | 79.235 |
| 2013-07-12 | 79.042 |
| 2013-07-13 | 78.133 |
| 2013-07-14 | 78.578 |
| 2013-07-15 | 79.487 |
| 2013-07-16 | 79.842 |
| 2013-07-17 | 78.779 |
| 2013-07-18 | 76.484 |
| 2013-07-19 | 75.392 |
| 2013-07-20 | 74.008 |
| 2013-07-21 | 73.011 |
| 2013-07-22 | 74.196 |
| 2013-07-23 | 75.324 |
| 2013-07-24 | 73.973 |
| 2013-07-25 | 72.93 |
| 2013-07-26 | 72.625 |
| 2013-07-27 | 72.485 |
| 2013-07-28 | 74.109 |
| 2013-07-29 | 76.985 |
| 2013-07-30 | 77.97 |
| 2013-07-31 | 77.252 |
| 2013-08-01 | 75.19 |
| 2013-08-02 | 73.814 |
| 2013-08-03 | 73.42 |
| 2013-08-04 | 72.988 |
| 2013-08-05 | 74.399 |
| 2013-08-06 | 74.31 |
| 2013-08-07 | 75.668 |
| 2013-08-08 | 75.548 |
| 2013-08-09 | 75.35 |
| 2013-08-10 | 75.221 |
| 2013-08-11 | 73.441 |
| 2013-08-12 | 74.44 |
| 2013-08-13 | 73.952 |
| 2013-08-14 | 71.169 |
| 2013-08-15 | 70.339 |
| 2013-08-16 | 68.045 |
| 2013-08-17 | 68.668 |
| 2013-08-18 | 69.201 |
| 2013-08-19 | 71.311 |
| 2013-08-20 | 73.063 |
| 2013-08-21 | 72.539 |
| 2013-08-22 | 71.998 |
| 2013-08-23 | 73.623 |
| 2013-08-24 | 74.699 |
| 2013-08-25 | 74.096 |
| 2013-08-26 | 76.603 |
| 2013-08-27 | 78.823 |
| 2013-08-28 | 80.107 |
| 2013-08-29 | 83.154 |
| 2013-08-30 | 85.555 |
| 2013-08-31 | 90.277 |
| 2013-09-01 | 92.446 |
| 2013-09-02 | 93.741 |
| 2013-09-03 | 95.428 |
| 2013-09-04 | 94.242 |
| 2013-09-05 | 95.03 |
| 2013-09-06 | 94.943 |
| 2013-09-07 | 93.751 |
| 2013-09-08 | 93.251 |
| 2013-09-09 | 94.524 |
| 2013-09-10 | 96.025 |
| 2013-09-11 | 96.883 |
| 2013-09-12 | 96.808 |
| 2013-09-13 | 98.572 |
| 2013-09-14 | 98.634 |
| 2013-09-15 | 99.179 |
| 2013-09-16 | 100.969 |
| 2013-09-17 | 101.401 |
| 2013-09-18 | 100.402 |
| 2013-09-19 | 99.138 |
| 2013-09-20 | 100.087 |
| 2013-09-21 | 100.332 |
| 2013-09-22 | 99.766 |
| 2013-09-23 | 102.359 |
| 2013-09-24 | 105.843 |
| 2013-09-25 | 106.337 |
| 2013-09-26 | 105.488 |
| 2013-09-27 | 105.188 |
| 2013-09-28 | 101.979 |
| 2013-09-29 | 100.451 |
| 2013-09-30 | 98.078 |
| 2013-10-01 | 98.882 |
| 2013-10-02 | 97.58 |
| 2013-10-03 | 95.401 |
| 2013-10-04 | 97.127 |
| 2013-10-05 | 95.338 |
| 2013-10-06 | 94.421 |
| 2013-10-07 | 96.605 |
| 2013-10-08 | 97.525 |
| 2013-10-09 | 96.732 |
| 2013-10-10 | 96.431 |
| 2013-10-11 | 94.96 |
| 2013-10-12 | 93.724 |
| 2013-10-13 | 91.224 |
| 2013-10-14 | 91.476 |
| 2013-10-15 | 92.726 |
| 2013-10-16 | 90.681 |
| 2013-10-17 | 89.047 |
| 2013-10-18 | 88.701 |
| 2013-10-19 | 88.757 |
| 2013-10-20 | 87.459 |
| 2013-10-21 | 89.724 |
| 2013-10-22 | 89.375 |
| 2013-10-23 | 86.829 |
| 2013-10-24 | 83.053 |
| 2013-10-25 | 80.584 |
| 2013-10-26 | 78.207 |
| 2013-10-27 | 75.911 |
| 2013-10-28 | 75.309 |
| 2013-10-29 | 74.952 |
| 2013-10-30 | 74.011 |
| 2013-10-31 | 71.592 |
| 2013-11-01 | 71.562 |
| 2013-11-02 | 72.389 |
| 2013-11-03 | 71.315 |
| 2013-11-04 | 71.963 |
| 2013-11-05 | 70.669 |
| 2013-11-06 | 69.036 |
| 2013-11-07 | 67.694 |
| 2013-11-08 | 68.786 |
| 2013-11-09 | 70.357 |
| 2013-11-10 | 69.312 |
| 2013-11-11 | 71.05 |
| 2013-11-12 | 73.308 |
| 2013-11-13 | 71.974 |
| 2013-11-14 | 71.875 |
| 2013-11-15 | 72.76 |
| 2013-11-16 | 71.631 |
| 2013-11-17 | 70.798 |
| 2013-11-18 | 71.57 |
| 2013-11-19 | 72.98 |
| 2013-11-20 | 71.225 |
| 2013-11-21 | 70.942 |
| 2013-11-22 | 70.549 |
| 2013-11-23 | 70.385 |
| 2013-11-24 | 70.654 |
| 2013-11-25 | 74.207 |
| 2013-11-26 | 78.348 |
| 2013-11-27 | 78.155 |
| 2013-11-28 | 77.887 |
| 2013-11-29 | 77.483 |
| 2013-11-30 | 76.75 |
| 2013-12-01 | 75.072 |
| 2013-12-02 | 74.163 |
| 2013-12-03 | 74.568 |
| 2013-12-04 | 76.035 |
| 2013-12-05 | 75.528 |
| 2013-12-06 | 74.655 |
| 2013-12-07 | 74.354 |
| 2013-12-08 | 73.076 |
| 2013-12-09 | 71.776 |
| 2013-12-10 | 72.646 |
| 2013-12-11 | 71.851 |
| 2013-12-12 | 70.838 |
| 2013-12-13 | 70.837 |
| 2013-12-14 | 69.35 |
| 2013-12-15 | 67.377 |
| 2013-12-16 | 67.766 |
| 2013-12-17 | 70.042 |
| 2013-12-18 | 71.026 |
| 2013-12-19 | 70.132 |
| 2013-12-20 | 70.959 |
| 2013-12-21 | 71.026 |
| 2013-12-22 | 70.844 |
| 2013-12-23 | 70.562 |
| 2013-12-24 | 71.123 |
| 2013-12-25 | 68.73 |
| 2013-12-26 | 66 |
| 2013-12-27 | 67.586 |
| 2013-12-28 | 68.527 |
| 2013-12-29 | 67.513 |
| 2013-12-30 | 68.527 |
| 2013-12-31 | 72.107 |
| 2014-01-01 | 74.587 |
| 2014-01-02 | 74.593 |
| 2014-01-03 | 75.215 |
| 2014-01-04 | 74.805 |
| 2014-01-05 | 75.326 |
| 2014-01-06 | 77.291 |
| 2014-01-07 | 77.603 |
| 2014-01-08 | 78.534 |
| 2014-01-09 | 78.546 |
| 2014-01-10 | 79.517 |
| 2014-01-11 | 78.998 |
| 2014-01-12 | 77.726 |
| 2014-01-13 | 79.529 |
| 2014-01-14 | 81.46 |
| 2014-01-15 | 83.004 |
| 2014-01-16 | 81.164 |
| 2014-01-17 | 79.569 |
| 2014-01-18 | 79.429 |
| 2014-01-19 | 78.607 |
| 2014-01-20 | 79.326 |
| 2014-01-21 | 81.126 |
| 2014-01-22 | 82.275 |
| 2014-01-23 | 81.791 |
| 2014-01-24 | 82.245 |
| 2014-01-25 | 80.821 |
| 2014-01-26 | 80.039 |
| 2014-01-27 | 80.686 |
| 2014-01-28 | 81.317 |
| 2014-01-29 | 81.255 |
| 2014-01-30 | 78.717 |
| 2014-01-31 | 77.502 |
| 2014-02-01 | 75.988 |
| 2014-02-02 | 74.245 |
| 2014-02-03 | 78.388 |
| 2014-02-04 | 77.934 |
| 2014-02-05 | 77.529 |
| 2014-02-06 | 75.935 |
| 2014-02-07 | 74.829 |
| 2014-02-08 | 74.222 |
| 2014-02-09 | 73.395 |
| 2014-02-10 | 73.838 |
| 2014-02-11 | 76.193 |
| 2014-02-12 | 74.551 |
| 2014-02-13 | 73.766 |
| 2014-02-14 | 72.895 |
| 2014-02-15 | 73.153 |
| 2014-02-16 | 72.68 |
| 2014-02-17 | 73.389 |
| 2014-02-18 | 73.843 |
| 2014-02-19 | 73.821 |
| 2014-02-20 | 73.513 |
| 2014-02-21 | 74.667 |
| 2014-02-22 | 73.591 |
| 2014-02-23 | 71.328 |
| 2014-02-24 | 71.571 |
| 2014-02-25 | 70.569 |
| 2014-02-26 | 69.443 |
| 2014-02-27 | 69.486 |
| 2014-02-28 | 69.622 |
| 2014-03-01 | 71.503 |
| 2014-03-02 | 73.431 |
| 2014-03-03 | 78.209 |
| 2014-03-04 | 83.122 |
| 2014-03-05 | 85.031 |
| 2014-03-06 | 88.067 |
| 2014-03-07 | 90.531 |
| 2014-03-08 | 90.831 |
| 2014-03-09 | 92.239 |
| 2014-03-10 | 94.752 |
| 2014-03-11 | 96.194 |
| 2014-03-12 | 98.491 |
| 2014-03-13 | 98.732 |
| 2014-03-14 | 100.203 |
| 2014-03-15 | 101.19 |
| 2014-03-16 | 102.733 |
| 2014-03-17 | 104.956 |
| 2014-03-18 | 109.733 |
| 2014-03-19 | 112.022 |
| 2014-03-20 | 112.116 |
| 2014-03-21 | 113.203 |
| 2014-03-22 | 111.837 |
| 2014-03-23 | 110.771 |
| 2014-03-24 | 113.88 |
| 2014-03-25 | 117.282 |
| 2014-03-26 | 118.586 |
| 2014-03-27 | 119.439 |
| 2014-03-28 | 120.789 |
| 2014-03-29 | 121.026 |
| 2014-03-30 | 120.663 |
| 2014-03-31 | 120.124 |
| 2014-04-01 | 119.703 |
| 2014-04-02 | 116.86 |
| 2014-04-03 | 111.868 |
| 2014-04-04 | 106.725 |
| 2014-04-05 | 103.974 |
| 2014-04-06 | 99.114 |
| 2014-04-07 | 99.255 |
| 2014-04-08 | 99.691 |
| 2014-04-09 | 100.484 |
| 2014-04-10 | 99.483 |
| 2014-04-11 | 97.105 |
| 2014-04-12 | 96.363 |
| 2014-04-13 | 94.444 |
| 2014-04-14 | 95.354 |
| 2014-04-15 | 96.075 |
| 2014-04-16 | 96.363 |
| 2014-04-17 | 92.654 |
| 2014-04-18 | 90.723 |
| 2014-04-19 | 89.228 |
| 2014-04-20 | 87.607 |
| 2014-04-21 | 88.109 |
| 2014-04-22 | 89.805 |
| 2014-04-23 | 89.559 |
| 2014-04-24 | 87.099 |
| 2014-04-25 | 87.674 |
| 2014-04-26 | 86.956 |
| 2014-04-27 | 85.938 |
| 2014-04-28 | 87.381 |
| 2014-04-29 | 89.575 |
| 2014-04-30 | 92.782 |
| 2014-05-01 | 91.391 |
| 2014-05-02 | 91.303 |
| 2014-05-03 | 92.317 |
| 2014-05-04 | 93.369 |
| 2014-05-05 | 93.484 |
| 2014-05-06 | 96.56 |
| 2014-05-07 | 97.334 |
| 2014-05-08 | 97.516 |
| 2014-05-09 | 96.76 |
| 2014-05-10 | 95.602 |
| 2014-05-11 | 96.986 |
| 2014-05-12 | 98.025 |
| 2014-05-13 | 100.284 |
| 2014-05-14 | 99.895 |
| 2014-05-15 | 97.584 |
| 2014-05-16 | 95.436 |
| 2014-05-17 | 94.018 |
| 2014-05-18 | 93.1 |
| 2014-05-19 | 93.211 |
| 2014-05-20 | 93.502 |
| 2014-05-21 | 93.663 |
| 2014-05-22 | 91.095 |
| 2014-05-23 | 90.941 |
| 2014-05-24 | 90.934 |
| 2014-05-25 | 90.452 |
| 2014-05-26 | 89.706 |
| 2014-05-27 | 89.275 |
| 2014-05-28 | 88.614 |
| 2014-05-29 | 88.253 |
| 2014-05-30 | 84.347 |
| 2014-05-31 | 83.318 |
| 2014-06-01 | 81.408 |
| 2014-06-02 | 80.193 |
| 2014-06-03 | 79.969 |
| 2014-06-04 | 80.389 |
| 2014-06-05 | 80.263 |
| 2014-06-06 | 79.355 |
| 2014-06-07 | 76.104 |
| 2014-06-08 | 74.443 |
| 2014-06-09 | 75.294 |
| 2014-06-10 | 75.963 |
| 2014-06-11 | 77.171 |
| 2014-06-12 | 76.301 |
| 2014-06-13 | 75.838 |
| 2014-06-14 | 76.304 |
| 2014-06-15 | 75.844 |
| 2014-06-16 | 79.011 |
| 2014-06-17 | 83.659 |
| 2014-06-18 | 86.596 |
| 2014-06-19 | 87.496 |
| 2014-06-20 | 89.127 |
| 2014-06-21 | 90.146 |
| 2014-06-22 | 89.903 |
| 2014-06-23 | 91.984 |
| 2014-06-24 | 93.442 |
| 2014-06-25 | 95.156 |
| 2014-06-26 | 96.033 |
| 2014-06-27 | 97.371 |
| 2014-06-28 | 96.105 |
| 2014-06-29 | 96.981 |
| 2014-06-30 | 98.174 |
| 2014-07-01 | 101.271 |
| 2014-07-02 | 103.853 |
| 2014-07-03 | 104.143 |
| 2014-07-04 | 104.661 |
| 2014-07-05 | 103.502 |
| 2014-07-06 | 104.768 |
| 2014-07-07 | 108.106 |
| 2014-07-08 | 109.594 |
| 2014-07-09 | 110.703 |
| 2014-07-10 | 109.39 |
| 2014-07-11 | 108.936 |
| 2014-07-12 | 107.935 |
| 2014-07-13 | 108.727 |
| 2014-07-14 | 111.288 |
| 2014-07-15 | 112.345 |
| 2014-07-16 | 113.171 |
| 2014-07-17 | 111.185 |
| 2014-07-18 | 113.276 |
| 2014-07-19 | 115.579 |
| 2014-07-20 | 114.663 |
| 2014-07-21 | 118.477 |
| 2014-07-22 | 122.014 |
| 2014-07-23 | 124.953 |
| 2014-07-24 | 123.772 |
| 2014-07-25 | 126.626 |
| 2014-07-26 | 127.833 |
| 2014-07-27 | 126.959 |
| 2014-07-28 | 129.375 |
| 2014-07-29 | 132.002 |
| 2014-07-30 | 135.94 |
| 2014-07-31 | 136.408 |
| 2014-08-01 | 136.961 |
| 2014-08-02 | 135.425 |
| 2014-08-03 | 133.563 |
| 2014-08-04 | 136.313 |
| 2014-08-05 | 139.034 |
| 2014-08-06 | 140.218 |
| 2014-08-07 | 142.325 |
| 2014-08-08 | 145.764 |
| 2014-08-09 | 147.997 |
| 2014-08-10 | 148.033 |
| 2014-08-11 | 152.992 |
| 2014-08-12 | 153.903 |
| 2014-08-13 | 154.397 |
| 2014-08-14 | 154.712 |
| 2014-08-15 | 153.77 |
| 2014-08-16 | 151.651 |
| 2014-08-17 | 147.394 |
| 2014-08-18 | 145.461 |
| 2014-08-19 | 148.792 |
| 2014-08-20 | 146.111 |
| 2014-08-21 | 144.263 |
| 2014-08-22 | 140.677 |
| 2014-08-23 | 140.314 |
| 2014-08-24 | 136.531 |
| 2014-08-25 | 137.744 |
| 2014-08-26 | 138.001 |
| 2014-08-27 | 137.789 |
| 2014-08-28 | 135.374 |
| 2014-08-29 | 133.878 |
| 2014-08-30 | 133.403 |
| 2014-08-31 | 131.818 |
| 2014-09-01 | 137.845 |
| 2014-09-02 | 143.949 |
| 2014-09-03 | 144.901 |
| 2014-09-04 | 146.476 |
| 2014-09-05 | 145.081 |
| 2014-09-06 | 142.551 |
| 2014-09-07 | 138.095 |
| 2014-09-08 | 138.259 |
| 2014-09-09 | 138.027 |
| 2014-09-10 | 135.526 |
| 2014-09-11 | 134.447 |
| 2014-09-12 | 134.524 |
| 2014-09-13 | 134.297 |
| 2014-09-14 | 133.301 |
| 2014-09-15 | 134.266 |
| 2014-09-16 | 136.859 |
| 2014-09-17 | 138.324 |
| 2014-09-18 | 135.054 |
| 2014-09-19 | 135.38 |
| 2014-09-20 | 132.806 |
| 2014-09-21 | 131.814 |
| 2014-09-22 | 130.88 |
| 2014-09-23 | 134.626 |
| 2014-09-24 | 133.936 |
| 2014-09-25 | 133.582 |
| 2014-09-26 | 133.856 |
| 2014-09-27 | 134.897 |
| 2014-09-28 | 131.656 |
| 2014-09-29 | 130.78 |
| 2014-09-30 | 130.566 |
| 2014-10-01 | 126.582 |
| 2014-10-02 | 121.193 |
| 2014-10-03 | 118.517 |
| 2014-10-04 | 113.892 |
| 2014-10-05 | 111.652 |
| 2014-10-06 | 111.434 |
| 2014-10-07 | 111.063 |
| 2014-10-08 | 108.862 |
| 2014-10-09 | 107.689 |
| 2014-10-10 | 107.356 |
| 2014-10-11 | 105.562 |
| 2014-10-12 | 101.325 |
| 2014-10-13 | 100.683 |
| 2014-10-14 | 99.629 |
| 2014-10-15 | 98.851 |
| 2014-10-16 | 95.892 |
| 2014-10-17 | 93.449 |
| 2014-10-18 | 91.214 |
| 2014-10-19 | 88.709 |
| 2014-10-20 | 88.694 |
| 2014-10-21 | 88.058 |
| 2014-10-22 | 87.985 |
| 2014-10-23 | 84.489 |
| 2014-10-24 | 82.649 |
| 2014-10-25 | 82.797 |
| 2014-10-26 | 79.011 |
| 2014-10-27 | 77.942 |
| 2014-10-28 | 80.584 |
| 2014-10-29 | 80.287 |
| 2014-10-30 | 80.49 |
| 2014-10-31 | 79.874 |
| 2014-11-01 | 81.204 |
| 2014-11-02 | 79.236 |
| 2014-11-03 | 79.23 |
| 2014-11-04 | 80.21 |
| 2014-11-05 | 80.484 |
| 2014-11-06 | 79.598 |
| 2014-11-07 | 79.906 |
| 2014-11-08 | 79.477 |
| 2014-11-09 | 77.66 |
| 2014-11-10 | 77.444 |
| 2014-11-11 | 78.643 |
| 2014-11-12 | 77.867 |
| 2014-11-13 | 77.576 |
| 2014-11-14 | 77.173 |
| 2014-11-15 | 78.152 |
| 2014-11-16 | 76.977 |
| 2014-11-17 | 79.829 |
| 2014-11-18 | 80.82 |
| 2014-11-19 | 81.366 |
| 2014-11-20 | 82.313 |
| 2014-11-21 | 83.381 |
| 2014-11-22 | 82.705 |
| 2014-11-23 | 82.202 |
| 2014-11-24 | 83.207 |
| 2014-11-25 | 87.404 |
| 2014-11-26 | 88.151 |
| 2014-11-27 | 86.198 |
| 2014-11-28 | 86.148 |
| 2014-11-29 | 84.338 |
| 2014-11-30 | 84.142 |
| 2014-12-01 | 82.81 |
| 2014-12-02 | 84.942 |
| 2014-12-03 | 85.193 |
| 2014-12-04 | 85.525 |
| 2014-12-05 | 84.157 |
| 2014-12-06 | 84.845 |
| 2014-12-07 | 83.304 |
| 2014-12-08 | 84.87 |
| 2014-12-09 | 85.046 |
| 2014-12-10 | 86.71 |
| 2014-12-11 | 86.866 |
| 2014-12-12 | 87.537 |
| 2014-12-13 | 87.879 |
| 2014-12-14 | 88.239 |
| 2014-12-15 | 87.206 |
| 2014-12-16 | 90.033 |
| 2014-12-17 | 90.306 |
| 2014-12-18 | 91.487 |
| 2014-12-19 | 92.111 |
| 2014-12-20 | 91.588 |
| 2014-12-21 | 91.553 |
| 2014-12-22 | 92.226 |
| 2014-12-23 | 91.568 |
| 2014-12-24 | 90.953 |
| 2014-12-25 | 86.965 |
| 2014-12-26 | 86.796 |
| 2014-12-27 | 86.131 |
| 2014-12-28 | 84.192 |
| 2014-12-29 | 85.653 |
| 2014-12-30 | 85.176 |
| 2014-12-31 | 86.382 |
| 2015-01-01 | 85.238 |
| 2015-01-02 | 85.852 |
| 2015-01-03 | 84.639 |
| 2015-01-04 | 83.105 |
| 2015-01-05 | 84.407 |
| 2015-01-06 | 85.168 |
| 2015-01-07 | 84.145 |
| 2015-01-08 | 87.35 |
| 2015-01-09 | 85.914 |
| 2015-01-10 | 87.815 |
| 2015-01-11 | 88.435 |
| 2015-01-12 | 90.977 |
| 2015-01-13 | 93.087 |
| 2015-01-14 | 93.801 |
| 2015-01-15 | 93.692 |
| 2015-01-16 | 94.071 |
| 2015-01-17 | 93.585 |
| 2015-01-18 | 92.49 |
| 2015-01-19 | 94.05 |
| 2015-01-20 | 96.243 |
| 2015-01-21 | 98.72 |
| 2015-01-22 | 100.11 |
| 2015-01-23 | 99.626 |
| 2015-01-24 | 101.415 |
| 2015-01-25 | 101.295 |
| 2015-01-26 | 103.799 |
| 2015-01-27 | 105.88 |
| 2015-01-28 | 107.664 |
| 2015-01-29 | 108.853 |
| 2015-01-30 | 109.945 |
| 2015-01-31 | 109.465 |
| 2015-02-01 | 109.711 |
| 2015-02-02 | 111.301 |
| 2015-02-03 | 115.46 |
| 2015-02-04 | 115.126 |
| 2015-02-05 | 115.88 |
| 2015-02-06 | 118.802 |
| 2015-02-07 | 117.079 |
| 2015-02-08 | 118.492 |
| 2015-02-09 | 118.167 |
| 2015-02-10 | 119.437 |
| 2015-02-11 | 118.196 |
| 2015-02-12 | 115.698 |
| 2015-02-13 | 117.406 |
| 2015-02-14 | 114.991 |
| 2015-02-15 | 112.147 |
| 2015-02-16 | 111.957 |
| 2015-02-17 | 113.477 |
| 2015-02-18 | 114.624 |
| 2015-02-19 | 113.577 |
| 2015-02-20 | 113.188 |
| 2015-02-21 | 112.304 |
| 2015-02-22 | 111.456 |
| 2015-02-23 | 113.805 |
| 2015-02-24 | 115.094 |
| 2015-02-25 | 114.375 |
| 2015-02-26 | 114.372 |
| 2015-02-27 | 113.021 |
| 2015-02-28 | 111.23 |
| 2015-03-01 | 110.727 |
| 2015-03-02 | 112.237 |
| 2015-03-03 | 113.408 |
| 2015-03-04 | 117.314 |
| 2015-03-05 | 115.188 |
| 2015-03-06 | 115.033 |
| 2015-03-07 | 114.022 |
| 2015-03-08 | 111.342 |
| 2015-03-09 | 110.105 |
| 2015-03-10 | 109.527 |
| 2015-03-11 | 107.829 |
| 2015-03-12 | 106.875 |
| 2015-03-13 | 105.442 |
| 2015-03-14 | 105.117 |
| 2015-03-15 | 104.352 |
| 2015-03-16 | 105.983 |
| 2015-03-17 | 106.866 |
| 2015-03-18 | 107.362 |
| 2015-03-19 | 105.099 |
| 2015-03-20 | 103.102 |
| 2015-03-21 | 100.792 |
| 2015-03-22 | 98.859 |
| 2015-03-23 | 99.735 |
| 2015-03-24 | 100.292 |
| 2015-03-25 | 98.199 |
| 2015-03-26 | 96.676 |
| 2015-03-27 | 99.505 |
| 2015-03-28 | 99.397 |
| 2015-03-29 | 100.17 |
| 2015-03-30 | 102.56 |
| 2015-03-31 | 103.215 |
| 2015-04-01 | 104.33 |
| 2015-04-02 | 103.146 |
| 2015-04-03 | 100.873 |
| 2015-04-04 | 103.811 |
| 2015-04-05 | 104.825 |
| 2015-04-06 | 106.748 |
| 2015-04-07 | 107.551 |
| 2015-04-08 | 110.449 |
| 2015-04-09 | 111.95 |
| 2015-04-10 | 114.087 |
| 2015-04-11 | 113.062 |
| 2015-04-12 | 112.568 |
| 2015-04-13 | 112.979 |
| 2015-04-14 | 113.144 |
| 2015-04-15 | 114.291 |
| 2015-04-16 | 114.538 |
| 2015-04-17 | 113.928 |
| 2015-04-18 | 113.648 |
| 2015-04-19 | 113.75 |
| 2015-04-20 | 114.322 |
| 2015-04-21 | 114.536 |
| 2015-04-22 | 113.779 |
| 2015-04-23 | 112.469 |
| 2015-04-24 | 114.17 |
| 2015-04-25 | 112.105 |
| 2015-04-26 | 106.772 |
| 2015-04-27 | 106.247 |
| 2015-04-28 | 103.476 |
| 2015-04-29 | 102.171 |
| 2015-04-30 | 99.561 |
| 2015-05-01 | 97.471 |
| 2015-05-02 | 95.058 |
| 2015-05-03 | 91.514 |
| 2015-05-04 | 88.347 |
| 2015-05-05 | 85.957 |
| 2015-05-06 | 85.387 |
| 2015-05-07 | 83.859 |
| 2015-05-08 | 80.692 |
| 2015-05-09 | 77.867 |
| 2015-05-10 | 74.882 |
| 2015-05-11 | 76.342 |
| 2015-05-12 | 76.648 |
| 2015-05-13 | 77.82 |
| 2015-05-14 | 76.347 |
| 2015-05-15 | 74.733 |
| 2015-05-16 | 73.849 |
| 2015-05-17 | 73.11 |
| 2015-05-18 | 75.264 |
| 2015-05-19 | 76.285 |
| 2015-05-20 | 75.609 |
| 2015-05-21 | 74.66 |
| 2015-05-22 | 74.95 |
| 2015-05-23 | 75.607 |
| 2015-05-24 | 72.499 |
| 2015-05-25 | 74.006 |
| 2015-05-26 | 73.944 |
| 2015-05-27 | 74.185 |
| 2015-05-28 | 74.514 |
| 2015-05-29 | 73.56 |
| 2015-05-30 | 74.089 |
| 2015-05-31 | 74.349 |
| 2015-06-01 | 76.508 |
| 2015-06-02 | 77.226 |
| 2015-06-03 | 79.176 |
| 2015-06-04 | 80.488 |
| 2015-06-05 | 79.249 |
| 2015-06-06 | 78.329 |
| 2015-06-07 | 78.824 |
| 2015-06-08 | 79.881 |
| 2015-06-09 | 81.31 |
| 2015-06-10 | 78.974 |
| 2015-06-11 | 78.734 |
| 2015-06-12 | 76.309 |
| 2015-06-13 | 75.599 |
| 2015-06-14 | 74.581 |
| 2015-06-15 | 74.081 |
| 2015-06-16 | 75.325 |
| 2015-06-17 | 74.252 |
| 2015-06-18 | 72.741 |
| 2015-06-19 | 71.834 |
| 2015-06-20 | 73.257 |
| 2015-06-21 | 72.936 |
| 2015-06-22 | 73.266 |
| 2015-06-23 | 74.611 |
| 2015-06-24 | 74.549 |
| 2015-06-25 | 77.669 |
| 2015-06-26 | 77.609 |
| 2015-06-27 | 78.35 |
| 2015-06-28 | 80.167 |
| 2015-06-29 | 82.444 |
| 2015-06-30 | 85.286 |
| 2015-07-01 | 84.85 |
| 2015-07-02 | 85.49 |
| 2015-07-03 | 84.085 |
| 2015-07-04 | 82.951 |
| 2015-07-05 | 83.548 |
| 2015-07-06 | 85.969 |
| 2015-07-07 | 85.819 |
| 2015-07-08 | 85.152 |
| 2015-07-09 | 83.924 |
| 2015-07-10 | 85.884 |
| 2015-07-11 | 86.771 |
| 2015-07-12 | 88.891 |
| 2015-07-13 | 91.122 |
| 2015-07-14 | 91.222 |
| 2015-07-15 | 96.782 |
| 2015-07-16 | 96.896 |
| 2015-07-17 | 99.13 |
| 2015-07-18 | 98.477 |
| 2015-07-19 | 100.29 |
| 2015-07-20 | 101.152 |
| 2015-07-21 | 105.129 |
| 2015-07-22 | 107.204 |
| 2015-07-23 | 106.678 |
| 2015-07-24 | 107.629 |
| 2015-07-25 | 106.333 |
| 2015-07-26 | 107.864 |
| 2015-07-27 | 110.974 |
| 2015-07-28 | 111.74 |
| 2015-07-29 | 110.507 |
| 2015-07-30 | 107.363 |
| 2015-07-31 | 106.667 |
| 2015-08-01 | 105.982 |
| 2015-08-02 | 105.402 |
| 2015-08-03 | 104.68 |
| 2015-08-04 | 107.17 |
| 2015-08-05 | 106.12 |
| 2015-08-06 | 107.677 |
| 2015-08-07 | 108.622 |
| 2015-08-08 | 108.96 |
| 2015-08-09 | 108.225 |
| 2015-08-10 | 108.471 |
| 2015-08-11 | 108.088 |
| 2015-08-12 | 107.234 |
| 2015-08-13 | 108.647 |
| 2015-08-14 | 103.592 |
| 2015-08-15 | 101.265 |
| 2015-08-16 | 98.741 |
| 2015-08-17 | 99.812 |
| 2015-08-18 | 99.474 |
| 2015-08-19 | 99.333 |
| 2015-08-20 | 93.829 |
| 2015-08-21 | 91.606 |
| 2015-08-22 | 91.326 |
| 2015-08-23 | 89.387 |
| 2015-08-24 | 89.762 |
| 2015-08-25 | 87.452 |
| 2015-08-26 | 84.374 |
| 2015-08-27 | 82.8 |
| 2015-08-28 | 81.231 |
| 2015-08-29 | 80.875 |
| 2015-08-30 | 80.824 |
| 2015-08-31 | 81.332 |
| 2015-09-01 | 82.224 |
| 2015-09-02 | 83.799 |
| 2015-09-03 | 81.479 |
| 2015-09-04 | 82.152 |
| 2015-09-05 | 80.901 |
| 2015-09-06 | 80.652 |
| 2015-09-07 | 81.162 |
| 2015-09-08 | 82.249 |
| 2015-09-09 | 84.042 |
| 2015-09-10 | 85.693 |
| 2015-09-11 | 86.407 |
| 2015-09-12 | 86.129 |
| 2015-09-13 | 85.362 |
| 2015-09-14 | 86.432 |
| 2015-09-15 | 88.147 |
| 2015-09-16 | 87.742 |
| 2015-09-17 | 87.571 |
| 2015-09-18 | 86.333 |
| 2015-09-19 | 88.138 |
| 2015-09-20 | 87.535 |
| 2015-09-21 | 87.772 |
| 2015-09-22 | 92.223 |
| 2015-09-23 | 91.637 |
| 2015-09-24 | 92.657 |
| 2015-09-25 | 92.748 |
| 2015-09-26 | 92.504 |
| 2015-09-27 | 93.242 |
| 2015-09-28 | 94.171 |
| 2015-09-29 | 95.532 |
| 2015-09-30 | 96.267 |
| 2015-10-01 | 97.338 |
| 2015-10-02 | 100.825 |
| 2015-10-03 | 100.328 |
| 2015-10-04 | 99.793 |
| 2015-10-05 | 99.787 |
| 2015-10-06 | 100.804 |
| 2015-10-07 | 101.691 |
| 2015-10-08 | 100.113 |
| 2015-10-09 | 98.303 |
| 2015-10-10 | 97.111 |
| 2015-10-11 | 95.919 |
| 2015-10-12 | 95.171 |
| 2015-10-13 | 96.017 |
| 2015-10-14 | 96.867 |
| 2015-10-15 | 95.588 |
| 2015-10-16 | 95.812 |
| 2015-10-17 | 96.708 |
| 2015-10-18 | 96.148 |
| 2015-10-19 | 96.217 |
| 2015-10-20 | 96.283 |
| 2015-10-21 | 95.715 |
| 2015-10-22 | 91.718 |
| 2015-10-23 | 91.497 |
| 2015-10-24 | 90.984 |
| 2015-10-25 | 89.988 |
| 2015-10-26 | 90.17 |
| 2015-10-27 | 89.317 |
| 2015-10-28 | 88.514 |
| 2015-10-29 | 86.882 |
| 2015-10-30 | 86.556 |
| 2015-10-31 | 84.984 |
| 2015-11-01 | 80.524 |
| 2015-11-02 | 81.837 |
| 2015-11-03 | 80.879 |
| 2015-11-04 | 81.059 |
| 2015-11-05 | 79.303 |
| 2015-11-06 | 78.586 |
| 2015-11-07 | 79.639 |
| 2015-11-08 | 79.496 |
| 2015-11-09 | 78.82 |
| 2015-11-10 | 78.893 |
| 2015-11-11 | 77.982 |
| 2015-11-12 | 76.763 |
| 2015-11-13 | 75.301 |
| 2015-11-14 | 76.529 |
| 2015-11-15 | 77.824 |
| 2015-11-16 | 83.881 |
| 2015-11-17 | 93.446 |
| 2015-11-18 | 100.927 |
| 2015-11-19 | 106.684 |
| 2015-11-20 | 111.445 |
| 2015-11-21 | 114.868 |
| 2015-11-22 | 119.014 |
| 2015-11-23 | 122.237 |
| 2015-11-24 | 128.733 |
| 2015-11-25 | 134.192 |
| 2015-11-26 | 138.31 |
| 2015-11-27 | 143.962 |
| 2015-11-28 | 145.252 |
| 2015-11-29 | 145.652 |
| 2015-11-30 | 146.284 |
| 2015-12-01 | 150.415 |
| 2015-12-02 | 153.174 |
| 2015-12-03 | 156.663 |
| 2015-12-04 | 158.658 |
| 2015-12-05 | 161.914 |
| 2015-12-06 | 163.452 |
| 2015-12-07 | 166.624 |
| 2015-12-08 | 170.42 |
| 2015-12-09 | 174.159 |
| 2015-12-10 | 176.229 |
| 2015-12-11 | 179.497 |
| 2015-12-12 | 181.481 |
| 2015-12-13 | 182.149 |
| 2015-12-14 | 182.092 |
| 2015-12-15 | 182.532 |
| 2015-12-16 | 178.486 |
| 2015-12-17 | 172.117 |
| 2015-12-18 | 166.283 |
| 2015-12-19 | 162.034 |
| 2015-12-20 | 158.314 |
| 2015-12-21 | 158.097 |
| 2015-12-22 | 156.089 |
| 2015-12-23 | 152.88 |
| 2015-12-24 | 148.356 |
| 2015-12-25 | 145.466 |
| 2015-12-26 | 144.212 |
| 2015-12-27 | 139.724 |
| 2015-12-28 | 141.272 |
| 2015-12-29 | 141.466 |
| 2015-12-30 | 142.844 |
| 2015-12-31 | 139.498 |
| 2016-01-01 | 140.036 |
| 2016-01-02 | 137.765 |
| 2016-01-03 | 136.325 |
| 2016-01-04 | 135.506 |
| 2016-01-05 | 137.834 |
| 2016-01-06 | 136.637 |
| 2016-01-07 | 136.878 |
| 2016-01-08 | 136.262 |
| 2016-01-09 | 133.588 |
| 2016-01-10 | 131.949 |
| 2016-01-11 | 131.669 |
| 2016-01-12 | 132.494 |
| 2016-01-13 | 133.158 |
| 2016-01-14 | 132.599 |
| 2016-01-15 | 130.67 |
| 2016-01-16 | 128.336 |
| 2016-01-17 | 127.255 |
| 2016-01-18 | 128.34 |
| 2016-01-19 | 130.134 |
| 2016-01-20 | 131.111 |
| 2016-01-21 | 129.264 |
| 2016-01-22 | 130.502 |
| 2016-01-23 | 129.561 |
| 2016-01-24 | 127.061 |
| 2016-01-25 | 125.31 |
| 2016-01-26 | 124.279 |
| 2016-01-27 | 122.484 |
| 2016-01-28 | 121.401 |
| 2016-01-29 | 119.457 |
| 2016-01-30 | 118.472 |
| 2016-01-31 | 112.868 |
| 2016-02-01 | 114.298 |
| 2016-02-02 | 113.978 |
| 2016-02-03 | 112.993 |
| 2016-02-04 | 109.377 |
| 2016-02-05 | 107.64 |
| 2016-02-06 | 103.377 |
| 2016-02-07 | 101.017 |
| 2016-02-08 | 103.428 |
| 2016-02-09 | 102.654 |
| 2016-02-10 | 102.79 |
| 2016-02-11 | 103.192 |
| 2016-02-12 | 102.086 |
| 2016-02-13 | 100.058 |
| 2016-02-14 | 100.166 |
| 2016-02-15 | 99.773 |
| 2016-02-16 | 100.667 |
| 2016-02-17 | 100.204 |
| 2016-02-18 | 99.022 |
| 2016-02-19 | 97.93 |
| 2016-02-20 | 97.313 |
| 2016-02-21 | 95.658 |
| 2016-02-22 | 96.383 |
| 2016-02-23 | 98.531 |
| 2016-02-24 | 99.624 |
| 2016-02-25 | 99.13 |
| 2016-02-26 | 98.96 |
| 2016-02-27 | 97.948 |
| 2016-02-28 | 98.567 |
| 2016-02-29 | 99.206 |
| 2016-03-01 | 101.957 |
| 2016-03-02 | 100.262 |
| 2016-03-03 | 101.203 |
| 2016-03-04 | 100.136 |
| 2016-03-05 | 99.202 |
| 2016-03-06 | 97.278 |
| 2016-03-07 | 96.94 |
| 2016-03-08 | 96.702 |
| 2016-03-09 | 95.11 |
| 2016-03-10 | 95.854 |
| 2016-03-11 | 94.494 |
| 2016-03-12 | 92.409 |
| 2016-03-13 | 91.015 |
| 2016-03-14 | 93.353 |
| 2016-03-15 | 93.903 |
| 2016-03-16 | 94.543 |
| 2016-03-17 | 92.904 |
| 2016-03-18 | 91.916 |
| 2016-03-19 | 89.301 |
| 2016-03-20 | 86.393 |
| 2016-03-21 | 87.83 |
| 2016-03-22 | 88.335 |
| 2016-03-23 | 93.026 |
| 2016-03-24 | 92.742 |
| 2016-03-25 | 95.114 |
| 2016-03-26 | 96.593 |
| 2016-03-27 | 95.801 |
| 2016-03-28 | 99.492 |
| 2016-03-29 | 101.73 |
| 2016-03-30 | 104.421 |
| 2016-03-31 | 104.689 |
| 2016-04-01 | 107.184 |
| 2016-04-02 | 105.742 |
| 2016-04-03 | 106.868 |
| 2016-04-04 | 108.352 |
| 2016-04-05 | 109.605 |
| 2016-04-06 | 110.75 |
| 2016-04-07 | 110.444 |
| 2016-04-08 | 108.934 |
| 2016-04-09 | 107.088 |
| 2016-04-10 | 107.457 |
| 2016-04-11 | 108.784 |
| 2016-04-12 | 109.3 |
| 2016-04-13 | 108.065 |
| 2016-04-14 | 106.875 |
| 2016-04-15 | 106.409 |
| 2016-04-16 | 105.608 |
| 2016-04-17 | 104.263 |
| 2016-04-18 | 104.657 |
| 2016-04-19 | 105.186 |
| 2016-04-20 | 104.543 |
| 2016-04-21 | 105.108 |
| 2016-04-22 | 99.486 |
| 2016-04-23 | 96.108 |
| 2016-04-24 | 92.782 |
| 2016-04-25 | 92.071 |
| 2016-04-26 | 92.578 |
| 2016-04-27 | 89.81 |
| 2016-04-28 | 87.707 |
| 2016-04-29 | 85.609 |
| 2016-04-30 | 83.628 |
| 2016-05-01 | 80.983 |
| 2016-05-02 | 81.344 |
| 2016-05-03 | 80.188 |
| 2016-05-04 | 79.896 |
| 2016-05-05 | 80.381 |
| 2016-05-06 | 79.643 |
| 2016-05-07 | 78.333 |
| 2016-05-08 | 77.528 |
| 2016-05-09 | 79.39 |
| 2016-05-10 | 79.497 |
| 2016-05-11 | 80.092 |
| 2016-05-12 | 80.81 |
| 2016-05-13 | 80.494 |
| 2016-05-14 | 78.799 |
| 2016-05-15 | 78.351 |
| 2016-05-16 | 78.725 |
| 2016-05-17 | 79.535 |
| 2016-05-18 | 80.871 |
| 2016-05-19 | 80.327 |
| 2016-05-20 | 81.085 |
| 2016-05-21 | 80.771 |
| 2016-05-22 | 81.686 |
| 2016-05-23 | 84.393 |
| 2016-05-24 | 84.383 |
| 2016-05-25 | 84.232 |
| 2016-05-26 | 83.853 |
| 2016-05-27 | 84.109 |
| 2016-05-28 | 82.664 |
| 2016-05-29 | 81.578 |
| 2016-05-30 | 82.808 |
| 2016-05-31 | 84.932 |
| 2016-06-01 | 84.983 |
| 2016-06-02 | 85.767 |
| 2016-06-03 | 87.095 |
| 2016-06-04 | 85.527 |
| 2016-06-05 | 85 |
| 2016-06-06 | 86.561 |
| 2016-06-07 | 88.458 |
| 2016-06-08 | 87.669 |
| 2016-06-09 | 87.287 |
| 2016-06-10 | 85.573 |
| 2016-06-11 | 83.675 |
| 2016-06-12 | 81.28 |
| 2016-06-13 | 82.859 |
| 2016-06-14 | 84.038 |
| 2016-06-15 | 86.133 |
| 2016-06-16 | 85.819 |
| 2016-06-17 | 86.048 |
| 2016-06-18 | 85.948 |
| 2016-06-19 | 85.543 |
| 2016-06-20 | 85.773 |
| 2016-06-21 | 86.178 |
| 2016-06-22 | 85.605 |
| 2016-06-23 | 86.278 |
| 2016-06-24 | 86.006 |
| 2016-06-25 | 85.526 |
| 2016-06-26 | 84.072 |
| 2016-06-27 | 85.651 |
| 2016-06-28 | 87.367 |
| 2016-06-29 | 88.777 |
| 2016-06-30 | 88.547 |
| 2016-07-01 | 88.921 |
| 2016-07-02 | 88.729 |
| 2016-07-03 | 87.346 |
| 2016-07-04 | 86.88 |
| 2016-07-05 | 88.038 |
| 2016-07-06 | 88.246 |
| 2016-07-07 | 90.321 |
| 2016-07-08 | 92.131 |
| 2016-07-09 | 93.724 |
| 2016-07-10 | 95.701 |
| 2016-07-11 | 97.228 |
| 2016-07-12 | 100.51 |
| 2016-07-13 | 99.323 |
| 2016-07-14 | 99.359 |
| 2016-07-15 | 98.089 |
| 2016-07-16 | 103.374 |
| 2016-07-17 | 106.338 |
| 2016-07-18 | 109.243 |
| 2016-07-19 | 112.126 |
| 2016-07-20 | 112.575 |
| 2016-07-21 | 113.584 |
| 2016-07-22 | 115.105 |
| 2016-07-23 | 114.134 |
| 2016-07-24 | 115.348 |
| 2016-07-25 | 116.884 |
| 2016-07-26 | 118.335 |
| 2016-07-27 | 117.987 |
| 2016-07-28 | 117.802 |
| 2016-07-29 | 116.361 |
| 2016-07-30 | 114.103 |
| 2016-07-31 | 112.012 |
| 2016-08-01 | 112.336 |
| 2016-08-02 | 113.122 |
| 2016-08-03 | 115.645 |
| 2016-08-04 | 117.517 |
| 2016-08-05 | 117.039 |
| 2016-08-06 | 113.823 |
| 2016-08-07 | 111.885 |
| 2016-08-08 | 112.116 |
| 2016-08-09 | 111.867 |
| 2016-08-10 | 112.733 |
| 2016-08-11 | 112.159 |
| 2016-08-12 | 113.989 |
| 2016-08-13 | 113.568 |
| 2016-08-14 | 113.42 |
| 2016-08-15 | 108.762 |
| 2016-08-16 | 105.659 |
| 2016-08-17 | 102.43 |
| 2016-08-18 | 100.043 |
| 2016-08-19 | 99.18 |
| 2016-08-20 | 96.156 |
| 2016-08-21 | 91.922 |
| 2016-08-22 | 92.151 |
| 2016-08-23 | 91.683 |
| 2016-08-24 | 92.972 |
| 2016-08-25 | 96.144 |
| 2016-08-26 | 95.507 |
| 2016-08-27 | 96.387 |
| 2016-08-28 | 95.189 |
| 2016-08-29 | 98.011 |
| 2016-08-30 | 99.026 |
| 2016-08-31 | 98.612 |
| 2016-09-01 | 96.802 |
| 2016-09-02 | 95.431 |
| 2016-09-03 | 93.013 |
| 2016-09-04 | 92.786 |
| 2016-09-05 | 93.042 |
| 2016-09-06 | 93.657 |
| 2016-09-07 | 92.852 |
| 2016-09-08 | 91.064 |
| 2016-09-09 | 91.087 |
| 2016-09-10 | 91.511 |
| 2016-09-11 | 90.86 |
| 2016-09-12 | 92.219 |
| 2016-09-13 | 93.389 |
| 2016-09-14 | 93.98 |
| 2016-09-15 | 94.117 |
| 2016-09-16 | 93.78 |
| 2016-09-17 | 92.052 |
| 2016-09-18 | 92.928 |
| 2016-09-19 | 99.591 |
| 2016-09-20 | 104.924 |
| 2016-09-21 | 107.529 |
| 2016-09-22 | 107.711 |
| 2016-09-23 | 106.412 |
| 2016-09-24 | 102.902 |
| 2016-09-25 | 101.974 |
| 2016-09-26 | 102.525 |
| 2016-09-27 | 102.927 |
| 2016-09-28 | 101.75 |
| 2016-09-29 | 102.58 |
| 2016-09-30 | 103.717 |
| 2016-10-01 | 102.907 |
| 2016-10-02 | 102.488 |
| 2016-10-03 | 101.919 |
| 2016-10-04 | 103.947 |
| 2016-10-05 | 106.188 |
| 2016-10-06 | 106.233 |
| 2016-10-07 | 104.015 |
| 2016-10-08 | 103.674 |
| 2016-10-09 | 103.162 |
| 2016-10-10 | 102.486 |
| 2016-10-11 | 102.229 |
| 2016-10-12 | 101.031 |
| 2016-10-13 | 100.707 |
| 2016-10-14 | 99.962 |
| 2016-10-15 | 98.669 |
| 2016-10-16 | 98.753 |
| 2016-10-17 | 100.817 |
| 2016-10-18 | 101.141 |
| 2016-10-19 | 96.357 |
| 2016-10-20 | 94.105 |
| 2016-10-21 | 91.313 |
| 2016-10-22 | 90.852 |
| 2016-10-23 | 90.171 |
| 2016-10-24 | 90.65 |
| 2016-10-25 | 91.278 |
| 2016-10-26 | 90.049 |
| 2016-10-27 | 90.556 |
| 2016-10-28 | 89.434 |
| 2016-10-29 | 88.173 |
| 2016-10-30 | 86.911 |
| 2016-10-31 | 87.448 |
| 2016-11-01 | 88.277 |
| 2016-11-02 | 88.684 |
| 2016-11-03 | 85.841 |
| 2016-11-04 | 83.451 |
| 2016-11-05 | 82.532 |
| 2016-11-06 | 84.01 |
| 2016-11-07 | 84.537 |
| 2016-11-08 | 84.141 |
| 2016-11-09 | 82.813 |
| 2016-11-10 | 82.342 |
| 2016-11-11 | 82.118 |
| 2016-11-12 | 79.686 |
| 2016-11-13 | 78.834 |
| 2016-11-14 | 81.927 |
| 2016-11-15 | 82.857 |
| 2016-11-16 | 82.127 |
| 2016-11-17 | 80.311 |
| 2016-11-18 | 79.643 |
| 2016-11-19 | 77.854 |
| 2016-11-20 | 76.974 |
| 2016-11-21 | 78.203 |
| 2016-11-22 | 78.878 |
| 2016-11-23 | 78.533 |
| 2016-11-24 | 78.413 |
| 2016-11-25 | 77.731 |
| 2016-11-26 | 77.2 |
| 2016-11-27 | 78.122 |
| 2016-11-28 | 79.601 |
| 2016-11-29 | 81.701 |
| 2016-11-30 | 83.579 |
| 2016-12-01 | 85.477 |
| 2016-12-02 | 85.072 |
| 2016-12-03 | 84.215 |
| 2016-12-04 | 83.373 |
| 2016-12-05 | 84.043 |
| 2016-12-06 | 84.007 |
| 2016-12-07 | 85.251 |
| 2016-12-08 | 84.776 |
| 2016-12-09 | 85.472 |
| 2016-12-10 | 85.184 |
| 2016-12-11 | 83.598 |
| 2016-12-12 | 85.462 |
| 2016-12-13 | 87.777 |
| 2016-12-14 | 86.367 |
| 2016-12-15 | 87.283 |
| 2016-12-16 | 87.318 |
| 2016-12-17 | 87.224 |
| 2016-12-18 | 86.872 |
| 2016-12-19 | 87.672 |
| 2016-12-20 | 89.741 |
| 2016-12-21 | 92.296 |
| 2016-12-22 | 93.135 |
| 2016-12-23 | 96.707 |
| 2016-12-24 | 97.801 |
| 2016-12-25 | 98.254 |
| 2016-12-26 | 98.674 |
| 2016-12-27 | 98.039 |
| 2016-12-28 | 98.58 |
| 2016-12-29 | 97.025 |
| 2016-12-30 | 99.908 |
| 2016-12-31 | 100.12 |
| 2017-01-01 | 101.574 |
| 2017-01-02 | 105.25 |
| 2017-01-03 | 108.551 |
| 2017-01-04 | 109.34 |
| 2017-01-05 | 109.325 |
| 2017-01-06 | 110.183 |
| 2017-01-07 | 110.044 |
| 2017-01-08 | 108.935 |
| 2017-01-09 | 112.216 |
| 2017-01-10 | 112.855 |
| 2017-01-11 | 114.258 |
| 2017-01-12 | 114.016 |
| 2017-01-13 | 114.553 |
| 2017-01-14 | 113.07 |
| 2017-01-15 | 110.446 |
| 2017-01-16 | 110.961 |
| 2017-01-17 | 111.599 |
| 2017-01-18 | 112.153 |
| 2017-01-19 | 112.52 |
| 2017-01-20 | 109.503 |
| 2017-01-21 | 106.629 |
| 2017-01-22 | 103.373 |
| 2017-01-23 | 103.736 |
| 2017-01-24 | 103.966 |
| 2017-01-25 | 104.254 |
| 2017-01-26 | 104.94 |
| 2017-01-27 | 104.665 |
| 2017-01-28 | 104.66 |
| 2017-01-29 | 101.645 |
| 2017-01-30 | 102.096 |
| 2017-01-31 | 104.77 |
| 2017-02-01 | 104.9 |
| 2017-02-02 | 106.371 |
| 2017-02-03 | 108.876 |
| 2017-02-04 | 111.54 |
| 2017-02-05 | 108.922 |
| 2017-02-06 | 109.333 |
| 2017-02-07 | 114.217 |
| 2017-02-08 | 112.247 |
| 2017-02-09 | 113.108 |
| 2017-02-10 | 115.601 |
| 2017-02-11 | 115.548 |
| 2017-02-12 | 114.291 |
| 2017-02-13 | 116.543 |
| 2017-02-14 | 121.765 |
| 2017-02-15 | 123.308 |
| 2017-02-16 | 124.197 |
| 2017-02-17 | 123.731 |
| 2017-02-18 | 122.618 |
| 2017-02-19 | 122.298 |
| 2017-02-20 | 124.678 |
| 2017-02-21 | 126.481 |
| 2017-02-22 | 125.941 |
| 2017-02-23 | 124.701 |
| 2017-02-24 | 124.249 |
| 2017-02-25 | 121.984 |
| 2017-02-26 | 119.615 |
| 2017-02-27 | 119.04 |
| 2017-02-28 | 117.484 |
| 2017-03-01 | 116.271 |
| 2017-03-02 | 113.8 |
| 2017-03-03 | 110.94 |
| 2017-03-04 | 105.951 |
| 2017-03-05 | 103.887 |
| 2017-03-06 | 102.86 |
| 2017-03-07 | 105.906 |
| 2017-03-08 | 106.825 |
| 2017-03-09 | 104.781 |
| 2017-03-10 | 103.777 |
| 2017-03-11 | 102.464 |
| 2017-03-12 | 97.91 |
| 2017-03-13 | 96.253 |
| 2017-03-14 | 95.269 |
| 2017-03-15 | 94.064 |
| 2017-03-16 | 90.555 |
| 2017-03-17 | 89.827 |
| 2017-03-18 | 88.618 |
| 2017-03-19 | 88.998 |
| 2017-03-20 | 90.609 |
| 2017-03-21 | 90.147 |
| 2017-03-22 | 91.683 |
| 2017-03-23 | 91.415 |
| 2017-03-24 | 94.153 |
| 2017-03-25 | 94.954 |
| 2017-03-26 | 93.491 |
| 2017-03-27 | 95.927 |
| 2017-03-28 | 97.235 |
| 2017-03-29 | 97.641 |
| 2017-03-30 | 97.843 |
| 2017-03-31 | 97.444 |
| 2017-04-01 | 95.837 |
| 2017-04-02 | 95.947 |
| 2017-04-03 | 98.062 |
| 2017-04-04 | 99.01 |
| 2017-04-05 | 99.275 |
| 2017-04-06 | 98.682 |
| 2017-04-07 | 99.772 |
| 2017-04-08 | 101.558 |
| 2017-04-09 | 103.51 |
| 2017-04-10 | 106.245 |
| 2017-04-11 | 106.96 |
| 2017-04-12 | 110.056 |
| 2017-04-13 | 113.286 |
| 2017-04-14 | 114.222 |
| 2017-04-15 | 115.496 |
| 2017-04-16 | 115.133 |
| 2017-04-17 | 115.812 |
| 2017-04-18 | 116.037 |
| 2017-04-19 | 116.451 |
| 2017-04-20 | 119.702 |
| 2017-04-21 | 118.844 |
| 2017-04-22 | 118.718 |
| 2017-04-23 | 114.179 |
| 2017-04-24 | 116.143 |
| 2017-04-25 | 116.639 |
| 2017-04-26 | 115.826 |
| 2017-04-27 | 116.398 |
| 2017-04-28 | 117.492 |
| 2017-04-29 | 117.774 |
| 2017-04-30 | 115.102 |
| 2017-05-01 | 117.099 |
| 2017-05-02 | 119.055 |
| 2017-05-03 | 120.05 |
| 2017-05-04 | 118.229 |
| 2017-05-05 | 116.599 |
| 2017-05-06 | 114.791 |
| 2017-05-07 | 110.732 |
| 2017-05-08 | 107.271 |
| 2017-05-09 | 105.52 |
| 2017-05-10 | 105.155 |
| 2017-05-11 | 105.243 |
| 2017-05-12 | 102.164 |
| 2017-05-13 | 97.956 |
| 2017-05-14 | 95.08 |
| 2017-05-15 | 93.634 |
| 2017-05-16 | 93.26 |
| 2017-05-17 | 92.791 |
| 2017-05-18 | 92.493 |
| 2017-05-19 | 89.918 |
| 2017-05-20 | 86.042 |
| 2017-05-21 | 83.512 |
| 2017-05-22 | 84.048 |
| 2017-05-23 | 87.316 |
| 2017-05-24 | 88.623 |
| 2017-05-25 | 91.444 |
| 2017-05-26 | 95.641 |
| 2017-05-27 | 97.177 |
| 2017-05-28 | 95.851 |
| 2017-05-29 | 96.492 |
| 2017-05-30 | 99.499 |
| 2017-05-31 | 100.548 |
| 2017-06-01 | 99.346 |
| 2017-06-02 | 98.641 |
| 2017-06-03 | 98.136 |
| 2017-06-04 | 98.454 |
| 2017-06-05 | 105.346 |
| 2017-06-06 | 112.187 |
| 2017-06-07 | 117.959 |
| 2017-06-08 | 121.463 |
| 2017-06-09 | 121.373 |
| 2017-06-10 | 120.277 |
| 2017-06-11 | 119.328 |
| 2017-06-12 | 123.129 |
| 2017-06-13 | 125.443 |
| 2017-06-14 | 125.508 |
| 2017-06-15 | 126.611 |
| 2017-06-16 | 126.884 |
| 2017-06-17 | 126.006 |
| 2017-06-18 | 126.722 |
| 2017-06-19 | 130.339 |
| 2017-06-20 | 135.317 |
| 2017-06-21 | 136.542 |
| 2017-06-22 | 138.912 |
| 2017-06-23 | 136.424 |
| 2017-06-24 | 134.574 |
| 2017-06-25 | 129.475 |
| 2017-06-26 | 128.735 |
| 2017-06-27 | 129.385 |
| 2017-06-28 | 129.61 |
| 2017-06-29 | 128.783 |
| 2017-06-30 | 126.945 |
| 2017-07-01 | 127.138 |
| 2017-07-02 | 126.404 |
| 2017-07-03 | 127.73 |
| 2017-07-04 | 127.466 |
| 2017-07-05 | 125.209 |
| 2017-07-06 | 123.539 |
| 2017-07-07 | 119.198 |
| 2017-07-08 | 116.455 |
| 2017-07-09 | 116.185 |
| 2017-07-10 | 117.217 |
| 2017-07-11 | 119.284 |
| 2017-07-12 | 117.604 |
| 2017-07-13 | 115.882 |
| 2017-07-14 | 116.406 |
| 2017-07-15 | 113.986 |
| 2017-07-16 | 111.935 |
| 2017-07-17 | 113.355 |
| 2017-07-18 | 114.804 |
| 2017-07-19 | 111.338 |
| 2017-07-20 | 108.357 |
| 2017-07-21 | 105.019 |
| 2017-07-22 | 101.167 |
| 2017-07-23 | 101.601 |
| 2017-07-24 | 100.347 |
| 2017-07-25 | 101.517 |
| 2017-07-26 | 101.408 |
| 2017-07-27 | 101.445 |
| 2017-07-28 | 101.572 |
| 2017-07-29 | 100.336 |
| 2017-07-30 | 99.293 |
| 2017-07-31 | 101.769 |
| 2017-08-01 | 106.163 |
| 2017-08-02 | 106.987 |
| 2017-08-03 | 108.916 |
| 2017-08-04 | 105.138 |
| 2017-08-05 | 101.819 |
| 2017-08-06 | 100.56 |
| 2017-08-07 | 101.468 |
| 2017-08-08 | 103.353 |
| 2017-08-09 | 104.629 |
| 2017-08-10 | 108.056 |
| 2017-08-11 | 109.767 |
| 2017-08-12 | 113.985 |
| 2017-08-13 | 113.414 |
| 2017-08-14 | 118.989 |
| 2017-08-15 | 125.265 |
| 2017-08-16 | 126.778 |
| 2017-08-17 | 125.517 |
| 2017-08-18 | 127.913 |
| 2017-08-19 | 128.316 |
| 2017-08-20 | 128.104 |
| 2017-08-21 | 130.857 |
| 2017-08-22 | 135.179 |
| 2017-08-23 | 138.379 |
| 2017-08-24 | 138.215 |
| 2017-08-25 | 136.933 |
| 2017-08-26 | 137.693 |
| 2017-08-27 | 136.071 |
| 2017-08-28 | 138.075 |
| 2017-08-29 | 138.561 |
| 2017-08-30 | 137.624 |
| 2017-08-31 | 135.068 |
| 2017-09-01 | 134.681 |
| 2017-09-02 | 132.411 |
| 2017-09-03 | 131.129 |
| 2017-09-04 | 136.979 |
| 2017-09-05 | 140.653 |
| 2017-09-06 | 143.138 |
| 2017-09-07 | 142.569 |
| 2017-09-08 | 142.45 |
| 2017-09-09 | 136.777 |
| 2017-09-10 | 134.928 |
| 2017-09-11 | 130.988 |
| 2017-09-12 | 132.626 |
| 2017-09-13 | 130.499 |
| 2017-09-14 | 125.58 |
| 2017-09-15 | 124.271 |
| 2017-09-16 | 124.335 |
| 2017-09-17 | 122.669 |
| 2017-09-18 | 124.199 |
| 2017-09-19 | 126.064 |
| 2017-09-20 | 125.586 |
| 2017-09-21 | 121.905 |
| 2017-09-22 | 120.511 |
| 2017-09-23 | 120.531 |
| 2017-09-24 | 120.885 |
| 2017-09-25 | 118.398 |
| 2017-09-26 | 120.67 |
| 2017-09-27 | 120.861 |
| 2017-09-28 | 123.01 |
| 2017-09-29 | 120.659 |
| 2017-09-30 | 118.731 |
| 2017-10-01 | 116.296 |
| 2017-10-02 | 119.002 |
| 2017-10-03 | 120.111 |
| 2017-10-04 | 115.297 |
| 2017-10-05 | 111.823 |
| 2017-10-06 | 110.122 |
| 2017-10-07 | 107.679 |
| 2017-10-08 | 106.446 |
| 2017-10-09 | 106.986 |
| 2017-10-10 | 107.184 |
| 2017-10-11 | 108.902 |
| 2017-10-12 | 107.596 |
| 2017-10-13 | 105.245 |
| 2017-10-14 | 105.342 |
| 2017-10-15 | 104.624 |
| 2017-10-16 | 104.832 |
| 2017-10-17 | 105.469 |
| 2017-10-18 | 103.644 |
| 2017-10-19 | 103.356 |
| 2017-10-20 | 100.331 |
| 2017-10-21 | 97.711 |
| 2017-10-22 | 95.341 |
| 2017-10-23 | 95.612 |
| 2017-10-24 | 96.042 |
| 2017-10-25 | 98.165 |
| 2017-10-26 | 96.51 |
| 2017-10-27 | 95.269 |
| 2017-10-28 | 92.335 |
| 2017-10-29 | 91.585 |
| 2017-10-30 | 92.704 |
| 2017-10-31 | 92.957 |
| 2017-11-01 | 90.523 |
| 2017-11-02 | 93.788 |
| 2017-11-03 | 93.106 |
| 2017-11-04 | 91.772 |
| 2017-11-05 | 90.239 |
| 2017-11-06 | 92.011 |
| 2017-11-07 | 92.605 |
| 2017-11-08 | 96.597 |
| 2017-11-09 | 97.052 |
| 2017-11-10 | 96.796 |
| 2017-11-11 | 95.66 |
| 2017-11-12 | 95.367 |
| 2017-11-13 | 95.212 |
| 2017-11-14 | 95.649 |
| 2017-11-15 | 94.346 |
| 2017-11-16 | 94.721 |
| 2017-11-17 | 92.429 |
| 2017-11-18 | 89.293 |
| 2017-11-19 | 88.91 |
| 2017-11-20 | 88.778 |
| 2017-11-21 | 92.393 |
| 2017-11-22 | 93.707 |
| 2017-11-23 | 91.658 |
| 2017-11-24 | 90.159 |
| 2017-11-25 | 89.221 |
| 2017-11-26 | 86.607 |
| 2017-11-27 | 90.002 |
| 2017-11-28 | 91.729 |
| 2017-11-29 | 91.81 |
| 2017-11-30 | 93.254 |
| 2017-12-01 | 94.393 |
| 2017-12-02 | 88.829 |
| 2017-12-03 | 87.043 |
| 2017-12-04 | 87.727 |
| 2017-12-05 | 88.652 |
| 2017-12-06 | 87.869 |
| 2017-12-07 | 86.238 |
| 2017-12-08 | 83.172 |
| 2017-12-09 | 81.365 |
| 2017-12-10 | 80.99 |
| 2017-12-11 | 84.018 |
| 2017-12-12 | 85.289 |
| 2017-12-13 | 85.196 |
| 2017-12-14 | 84.944 |
| 2017-12-15 | 85.579 |
| 2017-12-16 | 82.847 |
| 2017-12-17 | 82.981 |
| 2017-12-18 | 84.329 |
| 2017-12-19 | 84.924 |
| 2017-12-20 | 86.125 |
| 2017-12-21 | 84.435 |
| 2017-12-22 | 81.986 |
| 2017-12-23 | 82.604 |
| 2017-12-24 | 83.117 |
| 2017-12-25 | 83.717 |
| 2017-12-26 | 86.434 |
| 2017-12-27 | 84.813 |
| 2017-12-28 | 85.714 |
| 2017-12-29 | 86.438 |
| 2017-12-30 | 85.845 |
| 2017-12-31 | 83.766 |
| 2018-01-01 | 86.272 |
| 2018-01-02 | 91.407 |
| 2018-01-03 | 93.861 |
| 2018-01-04 | 94.298 |
| 2018-01-05 | 92.881 |
| 2018-01-06 | 93.359 |
| 2018-01-07 | 91.405 |
| 2018-01-08 | 92.297 |
| 2018-01-09 | 91.657 |
| 2018-01-10 | 89.291 |
| 2018-01-11 | 89.219 |
| 2018-01-12 | 92.127 |
| 2018-01-13 | 91.451 |
| 2018-01-14 | 90.526 |
| 2018-01-15 | 91.248 |
| 2018-01-16 | 91.43 |
| 2018-01-17 | 93.459 |
| 2018-01-18 | 93.598 |
| 2018-01-19 | 93.9 |
| 2018-01-20 | 93.061 |
| 2018-01-21 | 93.105 |
| 2018-01-22 | 95.199 |
| 2018-01-23 | 96.515 |
| 2018-01-24 | 98.606 |
| 2018-01-25 | 98.091 |
| 2018-01-26 | 96.434 |
| 2018-01-27 | 93.593 |
| 2018-01-28 | 90.624 |
| 2018-01-29 | 90.045 |
| 2018-01-30 | 91.653 |
| 2018-01-31 | 91.847 |
| 2018-02-01 | 87.302 |
| 2018-02-02 | 83.734 |
| 2018-02-03 | 81.256 |
| 2018-02-04 | 80.82 |
| 2018-02-05 | 81.007 |
| 2018-02-06 | 81.883 |
| 2018-02-07 | 81.692 |
| 2018-02-08 | 82.237 |
| 2018-02-09 | 82.25 |
| 2018-02-10 | 80.279 |
| 2018-02-11 | 76.184 |
| 2018-02-12 | 77.541 |
| 2018-02-13 | 77.881 |
| 2018-02-14 | 77.165 |
| 2018-02-15 | 77.53 |
| 2018-02-16 | 75.025 |
| 2018-02-17 | 73.962 |
| 2018-02-18 | 72.719 |
| 2018-02-19 | 73.472 |
| 2018-02-20 | 74.141 |
| 2018-02-21 | 72.211 |
| 2018-02-22 | 69.704 |
| 2018-02-23 | 67.657 |
| 2018-02-24 | 66.534 |
| 2018-02-25 | 65.58 |
| 2018-02-26 | 67.151 |
| 2018-02-27 | 68.255 |
| 2018-02-28 | 68.044 |
| 2018-03-01 | 67.971 |
| 2018-03-02 | 69.601 |
| 2018-03-03 | 69.428 |
| 2018-03-04 | 70.254 |
| 2018-03-05 | 71.459 |
| 2018-03-06 | 72.626 |
| 2018-03-07 | 74.28 |
| 2018-03-08 | 75.925 |
| 2018-03-09 | 76.75 |
| 2018-03-10 | 77.189 |
| 2018-03-11 | 77.207 |
| 2018-03-12 | 80.524 |
| 2018-03-13 | 83.022 |
| 2018-03-14 | 82.038 |
| 2018-03-15 | 85.904 |
| 2018-03-16 | 90.432 |
| 2018-03-17 | 91.001 |
| 2018-03-18 | 91.285 |
| 2018-03-19 | 92.761 |
| 2018-03-20 | 95.093 |
| 2018-03-21 | 97.75 |
| 2018-03-22 | 100.106 |
| 2018-03-23 | 100.506 |
| 2018-03-24 | 103.668 |
| 2018-03-25 | 102.991 |
| 2018-03-26 | 104.077 |
| 2018-03-27 | 105.863 |
| 2018-03-28 | 105.901 |
| 2018-03-29 | 109.612 |
| 2018-03-30 | 108.89 |
| 2018-03-31 | 109.764 |
| 2018-04-01 | 106.215 |
| 2018-04-02 | 109.286 |
| 2018-04-03 | 110.95 |
| 2018-04-04 | 109.701 |
| 2018-04-05 | 109.056 |
| 2018-04-06 | 107.933 |
| 2018-04-07 | 107.784 |
| 2018-04-08 | 107.224 |
| 2018-04-09 | 107.076 |
| 2018-04-10 | 111.764 |
| 2018-04-11 | 110.651 |
| 2018-04-12 | 116.548 |
| 2018-04-13 | 117.302 |
| 2018-04-14 | 114.177 |
| 2018-04-15 | 111.604 |
| 2018-04-16 | 115.188 |
| 2018-04-17 | 119.079 |
| 2018-04-18 | 123.718 |
| 2018-04-19 | 126.363 |
| 2018-04-20 | 123.023 |
| 2018-04-21 | 119.223 |
| 2018-04-22 | 117.396 |
| 2018-04-23 | 115.392 |
| 2018-04-24 | 118.591 |
| 2018-04-25 | 122.316 |
| 2018-04-26 | 124.164 |
| 2018-04-27 | 124.173 |
| 2018-04-28 | 121.403 |
| 2018-04-29 | 121.539 |
| 2018-04-30 | 122.027 |
| 2018-05-01 | 125.71 |
| 2018-05-02 | 127.29 |
| 2018-05-03 | 127.944 |
| 2018-05-04 | 130.222 |
| 2018-05-05 | 130.068 |
| 2018-05-06 | 127.483 |
| 2018-05-07 | 126.752 |
| 2018-05-08 | 128.117 |
| 2018-05-09 | 134.183 |
| 2018-05-10 | 134.853 |
| 2018-05-11 | 136.891 |
| 2018-05-12 | 130.336 |
| 2018-05-13 | 129.693 |
| 2018-05-14 | 130.696 |
| 2018-05-15 | 131.246 |
| 2018-05-16 | 129.789 |
| 2018-05-17 | 128.933 |
| 2018-05-18 | 124.203 |
| 2018-05-19 | 118.917 |
| 2018-05-20 | 117.722 |
| 2018-05-21 | 120.31 |
| 2018-05-22 | 122.061 |
| 2018-05-23 | 125.082 |
| 2018-05-24 | 125.183 |
| 2018-05-25 | 123.431 |
| 2018-05-26 | 122.162 |
| 2018-05-27 | 121.914 |
| 2018-05-28 | 122.207 |
| 2018-05-29 | 122.829 |
| 2018-05-30 | 123.074 |
| 2018-05-31 | 120.967 |
| 2018-06-01 | 120.954 |
| 2018-06-02 | 119.8 |
| 2018-06-03 | 116.985 |
| 2018-06-04 | 119.707 |
| 2018-06-05 | 124.877 |
| 2018-06-06 | 125.84 |
| 2018-06-07 | 124.619 |
| 2018-06-08 | 119.018 |
| 2018-06-09 | 113.895 |
| 2018-06-10 | 111.489 |
| 2018-06-11 | 112.66 |
| 2018-06-12 | 114.579 |
| 2018-06-13 | 115.083 |
| 2018-06-14 | 117.612 |
| 2018-06-15 | 114.925 |
| 2018-06-16 | 114.021 |
| 2018-06-17 | 111.757 |
| 2018-06-18 | 111.475 |
| 2018-06-19 | 113.614 |
| 2018-06-20 | 113.47 |
| 2018-06-21 | 113.862 |
| 2018-06-22 | 109.8 |
| 2018-06-23 | 105.67 |
| 2018-06-24 | 102.581 |
| 2018-06-25 | 101.9 |
| 2018-06-26 | 103.663 |
| 2018-06-27 | 104.597 |
| 2018-06-28 | 105.171 |
| 2018-06-29 | 105.142 |
| 2018-06-30 | 103.357 |
| 2018-07-01 | 99.126 |
| 2018-07-02 | 100.203 |
| 2018-07-03 | 103.278 |
| 2018-07-04 | 100.047 |
| 2018-07-05 | 98.099 |
| 2018-07-06 | 98.756 |
| 2018-07-07 | 98.553 |
| 2018-07-08 | 96.95 |
| 2018-07-09 | 99.975 |
| 2018-07-10 | 100.99 |
| 2018-07-11 | 100.665 |
| 2018-07-12 | 101.231 |
| 2018-07-13 | 100.718 |
| 2018-07-14 | 97.866 |
| 2018-07-15 | 99.02 |
| 2018-07-16 | 100.46 |
| 2018-07-17 | 103.002 |
| 2018-07-18 | 104.385 |
| 2018-07-19 | 105.84 |
| 2018-07-20 | 103.598 |
| 2018-07-21 | 104.54 |
| 2018-07-22 | 105.054 |
| 2018-07-23 | 109.455 |
| 2018-07-24 | 113.229 |
| 2018-07-25 | 113.808 |
| 2018-07-26 | 112.829 |
| 2018-07-27 | 112.454 |
| 2018-07-28 | 110.788 |
| 2018-07-29 | 106.87 |
| 2018-07-30 | 109.545 |
| 2018-07-31 | 111.234 |
| 2018-08-01 | 111.801 |
| 2018-08-02 | 110.969 |
| 2018-08-03 | 114.258 |
| 2018-08-04 | 113.095 |
| 2018-08-05 | 110.615 |
| 2018-08-06 | 113.278 |
| 2018-08-07 | 117.691 |
| 2018-08-08 | 116.311 |
| 2018-08-09 | 117.944 |
| 2018-08-10 | 117.834 |
| 2018-08-11 | 117.286 |
| 2018-08-12 | 115.962 |
| 2018-08-13 | 117.279 |
| 2018-08-14 | 118.339 |
| 2018-08-15 | 116.427 |
| 2018-08-16 | 117.339 |
| 2018-08-17 | 117.958 |
| 2018-08-18 | 115.02 |
| 2018-08-19 | 115.12 |
| 2018-08-20 | 114.62 |
| 2018-08-21 | 117.263 |
| 2018-08-22 | 115.851 |
| 2018-08-23 | 114.489 |
| 2018-08-24 | 112.466 |
| 2018-08-25 | 111.304 |
| 2018-08-26 | 108.772 |
| 2018-08-27 | 111.138 |
| 2018-08-28 | 114.836 |
| 2018-08-29 | 115.538 |
| 2018-08-30 | 114.745 |
| 2018-08-31 | 112.145 |
| 2018-09-01 | 110.758 |
| 2018-09-02 | 107.466 |
| 2018-09-03 | 107.782 |
| 2018-09-04 | 106.463 |
| 2018-09-05 | 103.909 |
| 2018-09-06 | 100.484 |
| 2018-09-07 | 99.111 |
| 2018-09-08 | 95.402 |
| 2018-09-09 | 92.922 |
| 2018-09-10 | 89.554 |
| 2018-09-11 | 89.424 |
| 2018-09-12 | 87.372 |
| 2018-09-13 | 85.111 |
| 2018-09-14 | 85.341 |
| 2018-09-15 | 83.183 |
| 2018-09-16 | 79.853 |
| 2018-09-17 | 81.058 |
| 2018-09-18 | 82.655 |
| 2018-09-19 | 81.047 |
| 2018-09-20 | 79.578 |
| 2018-09-21 | 79.393 |
| 2018-09-22 | 76.644 |
| 2018-09-23 | 76.094 |
| 2018-09-24 | 78.442 |
| 2018-09-25 | 80.177 |
| 2018-09-26 | 80.2 |
| 2018-09-27 | 78.175 |
| 2018-09-28 | 76.227 |
| 2018-09-29 | 74.823 |
| 2018-09-30 | 73.963 |
| 2018-10-01 | 75.314 |
| 2018-10-02 | 74.877 |
| 2018-10-03 | 74.885 |
| 2018-10-04 | 76.707 |
| 2018-10-05 | 76.45 |
| 2018-10-06 | 74.884 |
| 2018-10-07 | 73.374 |
| 2018-10-08 | 73.023 |
| 2018-10-09 | 74.635 |
| 2018-10-10 | 76.261 |
| 2018-10-11 | 77.89 |
| 2018-10-12 | 78.096 |
| 2018-10-13 | 77.413 |
| 2018-10-14 | 76.196 |
| 2018-10-15 | 78.178 |
| 2018-10-16 | 82.424 |
| 2018-10-17 | 83.315 |
| 2018-10-18 | 84.05 |
| 2018-10-19 | 85.636 |
| 2018-10-20 | 84.913 |
| 2018-10-21 | 82.289 |
| 2018-10-22 | 83.826 |
| 2018-10-23 | 86.522 |
| 2018-10-24 | 85.993 |
| 2018-10-25 | 87.514 |
| 2018-10-26 | 89.145 |
| 2018-10-27 | 89.837 |
| 2018-10-28 | 88.824 |
| 2018-10-29 | 90.501 |
| 2018-10-30 | 92.951 |
| 2018-10-31 | 91.643 |
| 2018-11-01 | 93.825 |
| 2018-11-02 | 94.124 |
| 2018-11-03 | 93.421 |
| 2018-11-04 | 92.291 |
| 2018-11-05 | 94.423 |
| 2018-11-06 | 95.091 |
| 2018-11-07 | 98.135 |
| 2018-11-08 | 96.966 |
| 2018-11-09 | 97.306 |
| 2018-11-10 | 94.202 |
| 2018-11-11 | 92.053 |
| 2018-11-12 | 91.875 |
| 2018-11-13 | 93.891 |
| 2018-11-14 | 90.908 |
| 2018-11-15 | 89.983 |
| 2018-11-16 | 87.54 |
| 2018-11-17 | 84.825 |
| 2018-11-18 | 82.444 |
| 2018-11-19 | 81.426 |
| 2018-11-20 | 82.191 |
| 2018-11-21 | 82.214 |
| 2018-11-22 | 80.536 |
| 2018-11-23 | 80.793 |
| 2018-11-24 | 78.426 |
| 2018-11-25 | 75.196 |
| 2018-11-26 | 75.423 |
| 2018-11-27 | 78.051 |
| 2018-11-28 | 78.269 |
| 2018-11-29 | 77.811 |
| 2018-11-30 | 79.833 |
| 2018-12-01 | 78.224 |
| 2018-12-02 | 75.491 |
| 2018-12-03 | 75.567 |
| 2018-12-04 | 77.411 |
| 2018-12-05 | 77.035 |
| 2018-12-06 | 79.324 |
| 2018-12-07 | 81.179 |
| 2018-12-08 | 81.711 |
| 2018-12-09 | 79.085 |
| 2018-12-10 | 80.864 |
| 2018-12-11 | 83.29 |
| 2018-12-12 | 84.732 |
| 2018-12-13 | 84.394 |
| 2018-12-14 | 87.284 |
| 2018-12-15 | 86.282 |
| 2018-12-16 | 86.106 |
| 2018-12-17 | 87.013 |
| 2018-12-18 | 88.26 |
| 2018-12-19 | 88.482 |
| 2018-12-20 | 91.971 |
| 2018-12-21 | 96.16 |
| 2018-12-22 | 96.347 |
| 2018-12-23 | 94.563 |
| 2018-12-24 | 95.936 |
| 2018-12-25 | 96.049 |
| 2018-12-26 | 94.777 |
| 2018-12-27 | 91.454 |
| 2018-12-28 | 91.492 |
| 2018-12-29 | 90.231 |
| 2018-12-30 | 86.577 |
| 2018-12-31 | 87.694 |
| 2019-01-01 | 89.771 |
| 2019-01-02 | 94.427 |
| 2019-01-03 | 91.421 |
| 2019-01-04 | 91.276 |
| 2019-01-05 | 88.249 |
| 2019-01-06 | 83.063 |
| 2019-01-07 | 83.276 |
| 2019-01-08 | 84.352 |
| 2019-01-09 | 84.868 |
| 2019-01-10 | 84.249 |
| 2019-01-11 | 84.758 |
| 2019-01-12 | 82.078 |
| 2019-01-13 | 79.333 |
| 2019-01-14 | 79.749 |
| 2019-01-15 | 81.859 |
| 2019-01-16 | 82.524 |
| 2019-01-17 | 85.471 |
| 2019-01-18 | 87.154 |
| 2019-01-19 | 82.475 |
| 2019-01-20 | 77.059 |
| 2019-01-21 | 77.284 |
| 2019-01-22 | 79.383 |
| 2019-01-23 | 77.615 |
| 2019-01-24 | 78.472 |
| 2019-01-25 | 79.407 |
| 2019-01-26 | 79.737 |
| 2019-01-27 | 78.858 |
| 2019-01-28 | 80.29 |
| 2019-01-29 | 82.586 |
| 2019-01-30 | 85.486 |
| 2019-01-31 | 87.633 |
| 2019-02-01 | 85.09 |
| 2019-02-02 | 87.301 |
| 2019-02-03 | 86.743 |
| 2019-02-04 | 91.393 |
| 2019-02-05 | 93.59 |
| 2019-02-06 | 94.254 |
| 2019-02-07 | 95.074 |
| 2019-02-08 | 93.605 |
| 2019-02-09 | 92.055 |
| 2019-02-10 | 89.986 |
| 2019-02-11 | 91.478 |
| 2019-02-12 | 92.528 |
| 2019-02-13 | 92.51 |
| 2019-02-14 | 91.643 |
| 2019-02-15 | 93.388 |
| 2019-02-16 | 90.088 |
| 2019-02-17 | 89.202 |
| 2019-02-18 | 90.696 |
| 2019-02-19 | 92.987 |
| 2019-02-20 | 96.339 |
| 2019-02-21 | 95.398 |
| 2019-02-22 | 95.773 |
| 2019-02-23 | 94.292 |
| 2019-02-24 | 93.754 |
| 2019-02-25 | 97.05 |
| 2019-02-26 | 98.693 |
| 2019-02-27 | 100.673 |
| 2019-02-28 | 102.713 |
| 2019-03-01 | 103.073 |
| 2019-03-02 | 102.526 |
| 2019-03-03 | 101.333 |
| 2019-03-04 | 100.903 |
| 2019-03-05 | 101.598 |
| 2019-03-06 | 98.299 |
| 2019-03-07 | 97.788 |
| 2019-03-08 | 96.185 |
| 2019-03-09 | 95.823 |
| 2019-03-10 | 94.518 |
| 2019-03-11 | 95.004 |
| 2019-03-12 | 97.076 |
| 2019-03-13 | 97.7 |
| 2019-03-14 | 97.615 |
| 2019-03-15 | 96.695 |
| 2019-03-16 | 96.863 |
| 2019-03-17 | 93.112 |
| 2019-03-18 | 93.721 |
| 2019-03-19 | 94.428 |
| 2019-03-20 | 94.2 |
| 2019-03-21 | 93.277 |
| 2019-03-22 | 91.66 |
| 2019-03-23 | 90.366 |
| 2019-03-24 | 90.292 |
| 2019-03-25 | 90.441 |
| 2019-03-26 | 90.899 |
| 2019-03-27 | 88.962 |
| 2019-03-28 | 87.51 |
| 2019-03-29 | 84.747 |
| 2019-03-30 | 81.567 |
| 2019-03-31 | 76.161 |
| 2019-04-01 | 73.951 |
| 2019-04-02 | 73.381 |
| 2019-04-03 | 74.081 |
| 2019-04-04 | 73.064 |
| 2019-04-05 | 72.737 |
| 2019-04-06 | 71.654 |
| 2019-04-07 | 70.337 |
| 2019-04-08 | 70.845 |
| 2019-04-09 | 75.655 |
| 2019-04-10 | 76.704 |
| 2019-04-11 | 76.8 |
| 2019-04-12 | 76.412 |
| 2019-04-13 | 76.893 |
| 2019-04-14 | 76.585 |
| 2019-04-15 | 75.754 |
| 2019-04-16 | 78.817 |
| 2019-04-17 | 78.41 |
| 2019-04-18 | 76.648 |
| 2019-04-19 | 76.349 |
| 2019-04-20 | 74.927 |
| 2019-04-21 | 73.731 |
| 2019-04-22 | 74.338 |
| 2019-04-23 | 77.315 |
| 2019-04-24 | 78.544 |
| 2019-04-25 | 78.908 |
| 2019-04-26 | 80.53 |
| 2019-04-27 | 79.609 |
| 2019-04-28 | 78.01 |
| 2019-04-29 | 78.063 |
| 2019-04-30 | 78.964 |
| 2019-05-01 | 78.833 |
| 2019-05-02 | 83.023 |
| 2019-05-03 | 82.562 |
| 2019-05-04 | 81.87 |
| 2019-05-05 | 82.607 |
| 2019-05-06 | 85.154 |
| 2019-05-07 | 88.72 |
| 2019-05-08 | 87.383 |
| 2019-05-09 | 87.37 |
| 2019-05-10 | 89.357 |
| 2019-05-11 | 87.759 |
| 2019-05-12 | 85.344 |
| 2019-05-13 | 87.006 |
| 2019-05-14 | 93.566 |
| 2019-05-15 | 97.836 |
| 2019-05-16 | 98.972 |
| 2019-05-17 | 101.416 |
| 2019-05-18 | 102.32 |
| 2019-05-19 | 102.518 |
| 2019-05-20 | 104.404 |
| 2019-05-21 | 105.879 |
| 2019-05-22 | 105.787 |
| 2019-05-23 | 103.988 |
| 2019-05-24 | 106.002 |
| 2019-05-25 | 104.819 |
| 2019-05-26 | 101.824 |
| 2019-05-27 | 101.478 |
| 2019-05-28 | 102.803 |
| 2019-05-29 | 102.76 |
| 2019-05-30 | 105.121 |
| 2019-05-31 | 106.556 |
| 2019-06-01 | 104.684 |
| 2019-06-02 | 103.312 |
| 2019-06-03 | 105.893 |
| 2019-06-04 | 105.096 |
| 2019-06-05 | 104.676 |
| 2019-06-06 | 103.357 |
| 2019-06-07 | 103.796 |
| 2019-06-08 | 99.921 |
| 2019-06-09 | 97.186 |
| 2019-06-10 | 97.209 |
| 2019-06-11 | 98.646 |
| 2019-06-12 | 97.448 |
| 2019-06-13 | 92.981 |
| 2019-06-14 | 93.244 |
| 2019-06-15 | 91.568 |
| 2019-06-16 | 88.949 |
| 2019-06-17 | 90.438 |
| 2019-06-18 | 93.788 |
| 2019-06-19 | 94.878 |
| 2019-06-20 | 92.924 |
| 2019-06-21 | 94.018 |
| 2019-06-22 | 96.183 |
| 2019-06-23 | 94.536 |
| 2019-06-24 | 98.107 |
| 2019-06-25 | 99.517 |
| 2019-06-26 | 102.198 |
| 2019-06-27 | 104.381 |
| 2019-06-28 | 107.26 |
| 2019-06-29 | 106.029 |
| 2019-06-30 | 103.332 |
| 2019-07-01 | 102.744 |
| 2019-07-02 | 106.385 |
| 2019-07-03 | 104.304 |
| 2019-07-04 | 105.518 |
| 2019-07-05 | 104.717 |
| 2019-07-06 | 103.687 |
| 2019-07-07 | 103.09 |
| 2019-07-08 | 103.178 |
| 2019-07-09 | 104.603 |
| 2019-07-10 | 106.064 |
| 2019-07-11 | 107.577 |
| 2019-07-12 | 107.988 |
| 2019-07-13 | 106.757 |
| 2019-07-14 | 101.379 |
| 2019-07-15 | 98.806 |
| 2019-07-16 | 99.268 |
| 2019-07-17 | 99.964 |
| 2019-07-18 | 98.128 |
| 2019-07-19 | 95.236 |
| 2019-07-20 | 95.711 |
| 2019-07-21 | 93.545 |
| 2019-07-22 | 94.397 |
| 2019-07-23 | 95.729 |
| 2019-07-24 | 93.338 |
| 2019-07-25 | 93.085 |
| 2019-07-26 | 93.548 |
| 2019-07-27 | 91.144 |
| 2019-07-28 | 87.073 |
| 2019-07-29 | 88.884 |
| 2019-07-30 | 93.174 |
| 2019-07-31 | 92.412 |
| 2019-08-01 | 91.396 |
| 2019-08-02 | 92.868 |
| 2019-08-03 | 93.079 |
| 2019-08-04 | 93.646 |
| 2019-08-05 | 95.363 |
| 2019-08-06 | 102.66 |
| 2019-08-07 | 104.41 |
| 2019-08-08 | 106.009 |
| 2019-08-09 | 106.179 |
| 2019-08-10 | 105.211 |
| 2019-08-11 | 104.171 |
| 2019-08-12 | 106.631 |
| 2019-08-13 | 106.943 |
| 2019-08-14 | 109.433 |
| 2019-08-15 | 110.117 |
| 2019-08-16 | 108.696 |
| 2019-08-17 | 108.596 |
| 2019-08-18 | 109.925 |
| 2019-08-19 | 111.293 |
| 2019-08-20 | 111.815 |
| 2019-08-21 | 109.194 |
| 2019-08-22 | 109.484 |
| 2019-08-23 | 109.393 |
| 2019-08-24 | 109.114 |
| 2019-08-25 | 107.292 |
| 2019-08-26 | 109.238 |
| 2019-08-27 | 114.116 |
| 2019-08-28 | 112.311 |
| 2019-08-29 | 109.778 |
| 2019-08-30 | 108.315 |
| 2019-08-31 | 105.959 |
| 2019-09-01 | 103.444 |
| 2019-09-02 | 103.669 |
| 2019-09-03 | 102.614 |
| 2019-09-04 | 102.152 |
| 2019-09-05 | 95.821 |
| 2019-09-06 | 95.012 |
| 2019-09-07 | 90.823 |
| 2019-09-08 | 89.459 |
| 2019-09-09 | 88.866 |
| 2019-09-10 | 89.824 |
| 2019-09-11 | 88.064 |
| 2019-09-12 | 89.359 |
| 2019-09-13 | 88.185 |
| 2019-09-14 | 86.504 |
| 2019-09-15 | 85.496 |
| 2019-09-16 | 88.137 |
| 2019-09-17 | 93.627 |
| 2019-09-18 | 93.21 |
| 2019-09-19 | 95.892 |
| 2019-09-20 | 96.311 |
| 2019-09-21 | 94.064 |
| 2019-09-22 | 94.449 |
| 2019-09-23 | 94 |
| 2019-09-24 | 94.674 |
| 2019-09-25 | 94.771 |
| 2019-09-26 | 91.19 |
| 2019-09-27 | 91.343 |
| 2019-09-28 | 90.092 |
| 2019-09-29 | 90.601 |
| 2019-09-30 | 92.552 |
| 2019-10-01 | 94.372 |
| 2019-10-02 | 92.73 |
| 2019-10-03 | 91.488 |
| 2019-10-04 | 92.209 |
| 2019-10-05 | 91.313 |
| 2019-10-06 | 89.888 |
| 2019-10-07 | 91.021 |
| 2019-10-08 | 92.816 |
| 2019-10-09 | 93.136 |
| 2019-10-10 | 95.146 |
| 2019-10-11 | 98.665 |
| 2019-10-12 | 99.45 |
| 2019-10-13 | 100.26 |
| 2019-10-14 | 102.661 |
| 2019-10-15 | 103.785 |
| 2019-10-16 | 104.271 |
| 2019-10-17 | 99.652 |
| 2019-10-18 | 99.359 |
| 2019-10-19 | 97.894 |
| 2019-10-20 | 94.878 |
| 2019-10-21 | 95.308 |
| 2019-10-22 | 93.507 |
| 2019-10-23 | 94.99 |
| 2019-10-24 | 95.425 |
| 2019-10-25 | 95.984 |
| 2019-10-26 | 94.585 |
| 2019-10-27 | 91.905 |
| 2019-10-28 | 93.887 |
| 2019-10-29 | 95.019 |
| 2019-10-30 | 95.61 |
| 2019-10-31 | 95.377 |
| 2019-11-01 | 96.411 |
| 2019-11-02 | 96.889 |
| 2019-11-03 | 94.99 |
| 2019-11-04 | 95.159 |
| 2019-11-05 | 96.458 |
| 2019-11-06 | 97.553 |
| 2019-11-07 | 95.714 |
| 2019-11-08 | 96.263 |
| 2019-11-09 | 91.653 |
| 2019-11-10 | 86.696 |
| 2019-11-11 | 86.346 |
| 2019-11-12 | 85.265 |
| 2019-11-13 | 86.654 |
| 2019-11-14 | 85.911 |
| 2019-11-15 | 81.963 |
| 2019-11-16 | 80.446 |
| 2019-11-17 | 79.358 |
| 2019-11-18 | 79.222 |
| 2019-11-19 | 80.045 |
| 2019-11-20 | 80.328 |
| 2019-11-21 | 80.614 |
| 2019-11-22 | 79.522 |
| 2019-11-23 | 76.885 |
| 2019-11-24 | 73.938 |
| 2019-11-25 | 74.203 |
| 2019-11-26 | 76.297 |
| 2019-11-27 | 76.128 |
| 2019-11-28 | 74.228 |
| 2019-11-29 | 74.065 |
| 2019-11-30 | 73.709 |
| 2019-12-01 | 72.336 |
| 2019-12-02 | 72.905 |
| 2019-12-03 | 73.956 |
| 2019-12-04 | 73.57 |
| 2019-12-05 | 74.41 |
| 2019-12-06 | 74.506 |
| 2019-12-07 | 72.793 |
| 2019-12-08 | 70.744 |
| 2019-12-09 | 72.609 |
| 2019-12-10 | 73.299 |
| 2019-12-11 | 73.46 |
| 2019-12-12 | 74.636 |
| 2019-12-13 | 72.619 |
| 2019-12-14 | 71.369 |
| 2019-12-15 | 70.479 |
| 2019-12-16 | 71.335 |
| 2019-12-17 | 71.614 |
| 2019-12-18 | 71.948 |
| 2019-12-19 | 72.21 |
| 2019-12-20 | 70.463 |
| 2019-12-21 | 70.125 |
| 2019-12-22 | 68.829 |
| 2019-12-23 | 68.749 |
| 2019-12-24 | 68.941 |
| 2019-12-25 | 69.232 |
| 2019-12-26 | 68.355 |
| 2019-12-27 | 68.977 |
| 2019-12-28 | 69.741 |
| 2019-12-29 | 67.339 |
| 2019-12-30 | 69.211 |
| 2019-12-31 | 72.741 |
| 2020-01-01 | 73.963 |
| 2020-01-02 | 76.541 |
| 2020-01-03 | 77.645 |
| 2020-01-04 | 81.873 |
| 2020-01-05 | 85.56 |
| 2020-01-06 | 93.551 |
| 2020-01-07 | 106.084 |
| 2020-01-08 | 109.344 |
| 2020-01-09 | 119.949 |
| 2020-01-10 | 122.278 |
| 2020-01-11 | 123.027 |
| 2020-01-12 | 125.564 |
| 2020-01-13 | 129.045 |
| 2020-01-14 | 131.825 |
| 2020-01-15 | 133.779 |
| 2020-01-16 | 135.899 |
| 2020-01-17 | 136.256 |
| 2020-01-18 | 135.249 |
| 2020-01-19 | 136.709 |
| 2020-01-20 | 138.921 |
| 2020-01-21 | 142.052 |
| 2020-01-22 | 143.491 |
| 2020-01-23 | 144.653 |
| 2020-01-24 | 144.873 |
| 2020-01-25 | 144.504 |
| 2020-01-26 | 141.552 |
| 2020-01-27 | 141.921 |
| 2020-01-28 | 144.03 |
| 2020-01-29 | 141.31 |
| 2020-01-30 | 142.067 |
| 2020-01-31 | 140.715 |
| 2020-02-01 | 138.244 |
| 2020-02-02 | 136.922 |
| 2020-02-03 | 132.84 |
| 2020-02-04 | 130.985 |
| 2020-02-05 | 124.864 |
| 2020-02-06 | 114.103 |
| 2020-02-07 | 110.715 |
| 2020-02-08 | 98.605 |
| 2020-02-09 | 94.078 |
| 2020-02-10 | 90.898 |
| 2020-02-11 | 88.049 |
| 2020-02-12 | 85.025 |
| 2020-02-13 | 82.595 |
| 2020-02-14 | 80.45 |
| 2020-02-15 | 77.384 |
| 2020-02-16 | 75.504 |
| 2020-02-17 | 77.032 |
| 2020-02-18 | 76.702 |
| 2020-02-19 | 74.557 |
| 2020-02-20 | 74.289 |
| 2020-02-21 | 75.154 |
| 2020-02-22 | 74.629 |
| 2020-02-23 | 74.16 |
| 2020-02-24 | 75.754 |
| 2020-02-25 | 78.824 |
| 2020-02-26 | 79.844 |
| 2020-02-27 | 78.656 |
| 2020-02-28 | 78.927 |
| 2020-02-29 | 75.669 |
| 2020-03-01 | 74.992 |
| 2020-03-02 | 75.565 |
| 2020-03-03 | 78.294 |
| 2020-03-04 | 79.541 |
| 2020-03-05 | 77.394 |
| 2020-03-06 | 76.827 |
| 2020-03-07 | 75.948 |
| 2020-03-08 | 75.485 |
| 2020-03-09 | 76.873 |
| 2020-03-10 | 78.212 |
| 2020-03-11 | 80.42 |
| 2020-03-12 | 79.906 |
| 2020-03-13 | 80.107 |
| 2020-03-14 | 80.377 |
| 2020-03-15 | 78.473 |
| 2020-03-16 | 77.823 |
| 2020-03-17 | 78.678 |
| 2020-03-18 | 78.777 |
| 2020-03-19 | 78.969 |
| 2020-03-20 | 79.07 |
| 2020-03-21 | 77.358 |
| 2020-03-22 | 76.555 |
| 2020-03-23 | 78.016 |
| 2020-03-24 | 83.12 |
| 2020-03-25 | 82.201 |
| 2020-03-26 | 80.243 |
| 2020-03-27 | 78.561 |
| 2020-03-28 | 78.691 |
| 2020-03-29 | 82.111 |
| 2020-03-30 | 82.551 |
| 2020-03-31 | 83.737 |
| 2020-04-01 | 82.383 |
| 2020-04-02 | 79.868 |
| 2020-04-03 | 77.856 |
| 2020-04-04 | 77.766 |
| 2020-04-05 | 79.227 |
| 2020-04-06 | 80.396 |
| 2020-04-07 | 81.777 |
| 2020-04-08 | 81.957 |
| 2020-04-09 | 81.599 |
| 2020-04-10 | 81.416 |
| 2020-04-11 | 80.352 |
| 2020-04-12 | 79.506 |
| 2020-04-13 | 80.234 |
| 2020-04-14 | 82.204 |
| 2020-04-15 | 84.039 |
| 2020-04-16 | 82.351 |
| 2020-04-17 | 81.881 |
| 2020-04-18 | 80.37 |
| 2020-04-19 | 79.692 |
| 2020-04-20 | 78.557 |
| 2020-04-21 | 77.699 |
| 2020-04-22 | 78.235 |
| 2020-04-23 | 75.232 |
| 2020-04-24 | 74.981 |
| 2020-04-25 | 74.712 |
| 2020-04-26 | 74.341 |
| 2020-04-27 | 73.712 |
| 2020-04-28 | 71.643 |
| 2020-04-29 | 70.841 |
| 2020-04-30 | 69.764 |
| 2020-05-01 | 69.592 |
| 2020-05-02 | 70.337 |
| 2020-05-03 | 68.39 |
| 2020-05-04 | 67.826 |
| 2020-05-05 | 66.043 |
| 2020-05-06 | 65.425 |
| 2020-05-07 | 63.746 |
| 2020-05-08 | 63.488 |
| 2020-05-09 | 62.28 |
| 2020-05-10 | 60.821 |
| 2020-05-11 | 60.654 |
| 2020-05-12 | 60.545 |
| 2020-05-13 | 59.57 |
| 2020-05-14 | 59.269 |
| 2020-05-15 | 57.812 |
| 2020-05-16 | 57.929 |
| 2020-05-17 | 57.995 |
| 2020-05-18 | 61.037 |
| 2020-05-19 | 63.104 |
| 2020-05-20 | 65.565 |
| 2020-05-21 | 66.202 |
| 2020-05-22 | 66.148 |
| 2020-05-23 | 63.995 |
| 2020-05-24 | 63.059 |
| 2020-05-25 | 65.743 |
| 2020-05-26 | 68.389 |
| 2020-05-27 | 67.536 |
| 2020-05-28 | 66.381 |
| 2020-05-29 | 68.314 |
| 2020-05-30 | 69.223 |
| 2020-05-31 | 69.804 |
| 2020-06-01 | 69.269 |
| 2020-06-02 | 71.166 |
| 2020-06-03 | 72.997 |
| 2020-06-04 | 72.814 |
| 2020-06-05 | 73.787 |
| 2020-06-06 | 73.752 |
| 2020-06-07 | 73.431 |
| 2020-06-08 | 74.797 |
| 2020-06-09 | 75.683 |
| 2020-06-10 | 77.609 |
| 2020-06-11 | 79.208 |
| 2020-06-12 | 79.677 |
| 2020-06-13 | 78.902 |
| 2020-06-14 | 78.27 |
| 2020-06-15 | 79.967 |
| 2020-06-16 | 80.091 |
| 2020-06-17 | 80.634 |
| 2020-06-18 | 80.695 |
| 2020-06-19 | 79.166 |
| 2020-06-20 | 79.463 |
| 2020-06-21 | 76.391 |
| 2020-06-22 | 79.561 |
| 2020-06-23 | 80.849 |
| 2020-06-24 | 79.218 |
| 2020-06-25 | 76.566 |
| 2020-06-26 | 77.263 |
| 2020-06-27 | 76.216 |
| 2020-06-28 | 72.844 |
| 2020-06-29 | 71.636 |
| 2020-06-30 | 71.606 |
| 2020-07-01 | 73.404 |
| 2020-07-02 | 71.416 |
| 2020-07-03 | 69.064 |
| 2020-07-04 | 68.674 |
| 2020-07-05 | 66.912 |
| 2020-07-06 | 67.476 |
| 2020-07-07 | 68.986 |
| 2020-07-08 | 69.085 |
| 2020-07-09 | 68.669 |
| 2020-07-10 | 68.727 |
| 2020-07-11 | 66.516 |
| 2020-07-12 | 64.912 |
| 2020-07-13 | 66.041 |
| 2020-07-14 | 68.272 |
| 2020-07-15 | 68.299 |
| 2020-07-16 | 66.642 |
| 2020-07-17 | 62.873 |
| 2020-07-18 | 60.524 |
| 2020-07-19 | 59.845 |
| 2020-07-20 | 60.013 |
| 2020-07-21 | 62.438 |
| 2020-07-22 | 61.961 |
| 2020-07-23 | 62.683 |
| 2020-07-24 | 63.101 |
| 2020-07-25 | 62.933 |
| 2020-07-26 | 62.763 |
| 2020-07-27 | 66.348 |
| 2020-07-28 | 69.193 |
| 2020-07-29 | 70.29 |
| 2020-07-30 | 69.528 |
| 2020-07-31 | 67.221 |
| 2020-08-01 | 67.332 |
| 2020-08-02 | 66.712 |
| 2020-08-03 | 67.302 |
| 2020-08-04 | 67.022 |
| 2020-08-05 | 65.748 |
| 2020-08-06 | 65.955 |
| 2020-08-07 | 65.128 |
| 2020-08-08 | 64.174 |
| 2020-08-09 | 62.241 |
| 2020-08-10 | 62.891 |
| 2020-08-11 | 63.884 |
| 2020-08-12 | 62.854 |
| 2020-08-13 | 62.691 |
| 2020-08-14 | 60.711 |
| 2020-08-15 | 62.468 |
| 2020-08-16 | 63.33 |
| 2020-08-17 | 64.487 |
| 2020-08-18 | 66.175 |
| 2020-08-19 | 64.824 |
| 2020-08-20 | 65.017 |
| 2020-08-21 | 66.656 |
| 2020-08-22 | 65.893 |
| 2020-08-23 | 63.633 |
| 2020-08-24 | 64.817 |
| 2020-08-25 | 66.375 |
| 2020-08-26 | 65.324 |
| 2020-08-27 | 66.006 |
| 2020-08-28 | 65.446 |
| 2020-08-29 | 65.148 |
| 2020-08-30 | 64.14 |
| 2020-08-31 | 66.203 |
| 2020-09-01 | 68.904 |
| 2020-09-02 | 71.138 |
| 2020-09-03 | 72.656 |
| 2020-09-04 | 74.693 |
| 2020-09-05 | 72.851 |
| 2020-09-06 | 72.34 |
| 2020-09-07 | 76.417 |
| 2020-09-08 | 77.39 |
| 2020-09-09 | 77.614 |
| 2020-09-10 | 80.613 |
| 2020-09-11 | 83.417 |
| 2020-09-12 | 82.308 |
| 2020-09-13 | 83.69 |
| 2020-09-14 | 83.194 |
| 2020-09-15 | 84.92 |
| 2020-09-16 | 85.484 |
| 2020-09-17 | 86.017 |
| 2020-09-18 | 87.339 |
| 2020-09-19 | 84.777 |
| 2020-09-20 | 81.142 |
| 2020-09-21 | 81.068 |
| 2020-09-22 | 83.382 |
| 2020-09-23 | 83.08 |
| 2020-09-24 | 82.376 |
| 2020-09-25 | 80.698 |
| 2020-09-26 | 77.364 |
| 2020-09-27 | 77.295 |
| 2020-09-28 | 79.271 |
| 2020-09-29 | 82.497 |
| 2020-09-30 | 83.041 |
| 2020-10-01 | 82.029 |
| 2020-10-02 | 81.786 |
| 2020-10-03 | 80.125 |
| 2020-10-04 | 79.449 |
| 2020-10-05 | 79.776 |
| 2020-10-06 | 81.683 |
| 2020-10-07 | 79.474 |
| 2020-10-08 | 80.975 |
| 2020-10-09 | 82.117 |
| 2020-10-10 | 79.145 |
| 2020-10-11 | 75.643 |
| 2020-10-12 | 76.045 |
| 2020-10-13 | 75.79 |
| 2020-10-14 | 75.137 |
| 2020-10-15 | 74.871 |
| 2020-10-16 | 76.239 |
| 2020-10-17 | 74.443 |
| 2020-10-18 | 73.201 |
| 2020-10-19 | 74.87 |
| 2020-10-20 | 76.25 |
| 2020-10-21 | 76.887 |
| 2020-10-22 | 77.128 |
| 2020-10-23 | 77.246 |
| 2020-10-24 | 77.312 |
| 2020-10-25 | 77.033 |
| 2020-10-26 | 78.629 |
| 2020-10-27 | 80.908 |
| 2020-10-28 | 80.155 |
| 2020-10-29 | 79.637 |
| 2020-10-30 | 78.817 |
| 2020-10-31 | 76.734 |
| 2020-11-01 | 74.999 |
| 2020-11-02 | 75.406 |
| 2020-11-03 | 78.34 |
| 2020-11-04 | 80.428 |
| 2020-11-05 | 79.893 |
| 2020-11-06 | 79.215 |
| 2020-11-07 | 76.833 |
| 2020-11-08 | 75.61 |
| 2020-11-09 | 77.253 |
| 2020-11-10 | 77.843 |
| 2020-11-11 | 78.85 |
| 2020-11-12 | 78.009 |
| 2020-11-13 | 78.726 |
| 2020-11-14 | 76.253 |
| 2020-11-15 | 74.356 |
| 2020-11-16 | 75.169 |
| 2020-11-17 | 75.06 |
| 2020-11-18 | 75.545 |
| 2020-11-19 | 73.89 |
| 2020-11-20 | 74.628 |
| 2020-11-21 | 72.819 |
| 2020-11-22 | 72.256 |
| 2020-11-23 | 71.253 |
| 2020-11-24 | 73.164 |
| 2020-11-25 | 70.944 |
| 2020-11-26 | 68.9 |
| 2020-11-27 | 68.52 |
| 2020-11-28 | 68.56 |
| 2020-11-29 | 69.255 |
| 2020-11-30 | 70.365 |
| 2020-12-01 | 73.025 |
| 2020-12-02 | 74.213 |
| 2020-12-03 | 71.051 |
| 2020-12-04 | 68.021 |
| 2020-12-05 | 67.311 |
| 2020-12-06 | 67.347 |
| 2020-12-07 | 67.776 |
| 2020-12-08 | 68.913 |
| 2020-12-09 | 67.491 |
| 2020-12-10 | 68.719 |
| 2020-12-11 | 66.883 |
| 2020-12-12 | 66.82 |
| 2020-12-13 | 65.451 |
| 2020-12-14 | 65.318 |
| 2020-12-15 | 66.082 |
| 2020-12-16 | 65.48 |
| 2020-12-17 | 67.056 |
| 2020-12-18 | 66.065 |
| 2020-12-19 | 66.636 |
| 2020-12-20 | 63.792 |
| 2020-12-21 | 65.252 |
| 2020-12-22 | 65.714 |
| 2020-12-23 | 66.775 |
| 2020-12-24 | 65.132 |
| 2020-12-25 | 65.961 |
| 2020-12-26 | 65.379 |
| 2020-12-27 | 63.982 |
| 2020-12-28 | 62.334 |
| 2020-12-29 | 61.261 |
| 2020-12-30 | 61.672 |
| 2020-12-31 | 60.043 |
| 2021-01-01 | 59.143 |
| 2021-01-02 | 58.198 |
| 2021-01-03 | 57.544 |
| 2021-01-04 | 59.226 |
| 2021-01-05 | 61.818 |
| 2021-01-06 | 63.695 |
| 2021-01-07 | 62.817 |
| 2021-01-08 | 63.416 |
| 2021-01-09 | 63.055 |
| 2021-01-10 | 63.987 |
| 2021-01-11 | 64.947 |
| 2021-01-12 | 69.558 |
| 2021-01-13 | 70.73 |
| 2021-01-14 | 69.914 |
| 2021-01-15 | 70.055 |
| 2021-01-16 | 69.351 |
| 2021-01-17 | 69.062 |
| 2021-01-18 | 70.208 |
| 2021-01-19 | 72.235 |
| 2021-01-20 | 72.1 |
| 2021-01-21 | 71.532 |
| 2021-01-22 | 72.51 |
| 2021-01-23 | 72.558 |
| 2021-01-24 | 72.085 |
| 2021-01-25 | 75.305 |
| 2021-01-26 | 76.099 |
| 2021-01-27 | 77.135 |
| 2021-01-28 | 78.632 |
| 2021-01-29 | 78.727 |
| 2021-01-30 | 78.096 |
| 2021-01-31 | 76.716 |
| 2021-02-01 | 77.495 |
| 2021-02-02 | 83.268 |
| 2021-02-03 | 82.408 |
| 2021-02-04 | 80.418 |
| 2021-02-05 | 80.273 |
| 2021-02-06 | 80.618 |
| 2021-02-07 | 79.544 |
| 2021-02-08 | 79.274 |
| 2021-02-09 | 79.06 |
| 2021-02-10 | 78.874 |
| 2021-02-11 | 75.53 |
| 2021-02-12 | 75.929 |
| 2021-02-13 | 74.982 |
| 2021-02-14 | 73.936 |
| 2021-02-15 | 73.7 |
| 2021-02-16 | 74.537 |
| 2021-02-17 | 74.522 |
| 2021-02-18 | 73.381 |
| 2021-02-19 | 73.295 |
| 2021-02-20 | 72.566 |
| 2021-02-21 | 70.55 |
| 2021-02-22 | 70.858 |
| 2021-02-23 | 73.139 |
| 2021-02-24 | 70.769 |
| 2021-02-25 | 70.49 |
| 2021-02-26 | 71.997 |
| 2021-02-27 | 70.906 |
| 2021-02-28 | 71.07 |
| 2021-03-01 | 72.235 |
| 2021-03-02 | 76.066 |
| 2021-03-03 | 79.238 |
| 2021-03-04 | 75.905 |
| 2021-03-05 | 76.578 |
| 2021-03-06 | 75.776 |
| 2021-03-07 | 72.752 |
| 2021-03-08 | 72.778 |
| 2021-03-09 | 71.95 |
| 2021-03-10 | 71.411 |
| 2021-03-11 | 71.715 |
| 2021-03-12 | 70.954 |
| 2021-03-13 | 71.171 |
| 2021-03-14 | 70.067 |
| 2021-03-15 | 72.586 |
| 2021-03-16 | 75.572 |
| 2021-03-17 | 76.363 |
| 2021-03-18 | 77.876 |
| 2021-03-19 | 75.888 |
| 2021-03-20 | 75.69 |
| 2021-03-21 | 73.752 |
| 2021-03-22 | 77.123 |
| 2021-03-23 | 79.188 |
| 2021-03-24 | 79.509 |
| 2021-03-25 | 78.322 |
| 2021-03-26 | 78.169 |
| 2021-03-27 | 78.083 |
| 2021-03-28 | 76.692 |
| 2021-03-29 | 78.153 |
| 2021-03-30 | 79.268 |
| 2021-03-31 | 78.687 |
| 2021-04-01 | 76.42 |
| 2021-04-02 | 73.467 |
| 2021-04-03 | 73.456 |
| 2021-04-04 | 71.136 |
| 2021-04-05 | 71.828 |
| 2021-04-06 | 74.566 |
| 2021-04-07 | 76.399 |
| 2021-04-08 | 76.755 |
| 2021-04-09 | 76.42 |
| 2021-04-10 | 75.053 |
| 2021-04-11 | 74.981 |
| 2021-04-12 | 76.104 |
| 2021-04-13 | 77.794 |
| 2021-04-14 | 80.586 |
| 2021-04-15 | 80.341 |
| 2021-04-16 | 80.702 |
| 2021-04-17 | 79.347 |
| 2021-04-18 | 79.839 |
| 2021-04-19 | 82.732 |
| 2021-04-20 | 86.18 |
| 2021-04-21 | 87.787 |
| 2021-04-22 | 88.438 |
| 2021-04-23 | 91.025 |
| 2021-04-24 | 92.523 |
| 2021-04-25 | 90.657 |
| 2021-04-26 | 91.183 |
| 2021-04-27 | 93.221 |
| 2021-04-28 | 90.793 |
| 2021-04-29 | 88.659 |
| 2021-04-30 | 87.283 |
| 2021-05-01 | 86.794 |
| 2021-05-02 | 86.137 |
| 2021-05-03 | 86.471 |
| 2021-05-04 | 88.936 |
| 2021-05-05 | 88.275 |
| 2021-05-06 | 87.679 |
| 2021-05-07 | 85.681 |
| 2021-05-08 | 84.657 |
| 2021-05-09 | 83.262 |
| 2021-05-10 | 83.901 |
| 2021-05-11 | 85.788 |
| 2021-05-12 | 84.458 |
| 2021-05-13 | 86.04 |
| 2021-05-14 | 83.517 |
| 2021-05-15 | 82.881 |
| 2021-05-16 | 81.216 |
| 2021-05-17 | 80.89 |
| 2021-05-18 | 82.327 |
| 2021-05-19 | 83.91 |
| 2021-05-20 | 83.836 |
| 2021-05-21 | 83.383 |
| 2021-05-22 | 81.69 |
| 2021-05-23 | 78.813 |
| 2021-05-24 | 79.633 |
| 2021-05-25 | 84.959 |
| 2021-05-26 | 89.098 |
| 2021-05-27 | 89.195 |
| 2021-05-28 | 92.385 |
| 2021-05-29 | 93.145 |
| 2021-05-30 | 92.91 |
| 2021-05-31 | 92.959 |
| 2021-06-01 | 93.423 |
| 2021-06-02 | 92.44 |
| 2021-06-03 | 91.13 |
| 2021-06-04 | 91.799 |
| 2021-06-05 | 90.497 |
| 2021-06-06 | 90.113 |
| 2021-06-07 | 91.892 |
| 2021-06-08 | 93.72 |
| 2021-06-09 | 94.948 |
| 2021-06-10 | 94.409 |
| 2021-06-11 | 96.606 |
| 2021-06-12 | 93.453 |
| 2021-06-13 | 91.414 |
| 2021-06-14 | 89.494 |
| 2021-06-15 | 90.099 |
| 2021-06-16 | 92.28 |
| 2021-06-17 | 93.845 |
| 2021-06-18 | 91.332 |
| 2021-06-19 | 88.488 |
| 2021-06-20 | 86.333 |
| 2021-06-21 | 87.386 |
| 2021-06-22 | 91.189 |
| 2021-06-23 | 88.086 |
| 2021-06-24 | 84.906 |
| 2021-06-25 | 80.637 |
| 2021-06-26 | 76.818 |
| 2021-06-27 | 72.174 |
| 2021-06-28 | 73.627 |
| 2021-06-29 | 75.956 |
| 2021-06-30 | 75.571 |
| 2021-07-01 | 75.704 |
| 2021-07-02 | 76.05 |
| 2021-07-03 | 75.673 |
| 2021-07-04 | 74.599 |
| 2021-07-05 | 75.412 |
| 2021-07-06 | 75.892 |
| 2021-07-07 | 75.204 |
| 2021-07-08 | 75.11 |
| 2021-07-09 | 73.293 |
| 2021-07-10 | 71.342 |
| 2021-07-11 | 67.849 |
| 2021-07-12 | 68.723 |
| 2021-07-13 | 69.468 |
| 2021-07-14 | 70.411 |
| 2021-07-15 | 71.835 |
| 2021-07-16 | 69.045 |
| 2021-07-17 | 66.758 |
| 2021-07-18 | 64.901 |
| 2021-07-19 | 65.265 |
| 2021-07-20 | 63.413 |
| 2021-07-21 | 61.858 |
| 2021-07-22 | 59.196 |
| 2021-07-23 | 60.801 |
| 2021-07-24 | 60.282 |
| 2021-07-25 | 59.384 |
| 2021-07-26 | 60.612 |
| 2021-07-27 | 62.958 |
| 2021-07-28 | 61.394 |
| 2021-07-29 | 59.114 |
| 2021-07-30 | 60.408 |
| 2021-07-31 | 59.168 |
| 2021-08-01 | 57.764 |
| 2021-08-02 | 60.13 |
| 2021-08-03 | 60.362 |
| 2021-08-04 | 61.33 |
| 2021-08-05 | 62.78 |
| 2021-08-06 | 63.791 |
| 2021-08-07 | 63.476 |
| 2021-08-08 | 62.962 |
| 2021-08-09 | 63.424 |
| 2021-08-10 | 66.303 |
| 2021-08-11 | 66.336 |
| 2021-08-12 | 66.3 |
| 2021-08-13 | 67.627 |
| 2021-08-14 | 64.318 |
| 2021-08-15 | 63.75 |
| 2021-08-16 | 65.442 |
| 2021-08-17 | 69.858 |
| 2021-08-18 | 70.665 |
| 2021-08-19 | 71.089 |
| 2021-08-20 | 71.513 |
| 2021-08-21 | 71.331 |
| 2021-08-22 | 70.436 |
| 2021-08-23 | 74.786 |
| 2021-08-24 | 78.413 |
| 2021-08-25 | 77.996 |
| 2021-08-26 | 79.209 |
| 2021-08-27 | 80.778 |
| 2021-08-28 | 83.573 |
| 2021-08-29 | 83.498 |
| 2021-08-30 | 86.047 |
| 2021-08-31 | 91.115 |
| 2021-09-01 | 89.831 |
| 2021-09-02 | 91.597 |
| 2021-09-03 | 91.824 |
| 2021-09-04 | 90.079 |
| 2021-09-05 | 89.566 |
| 2021-09-06 | 90.591 |
| 2021-09-07 | 94.054 |
| 2021-09-08 | 95.517 |
| 2021-09-09 | 94.262 |
| 2021-09-10 | 93.771 |
| 2021-09-11 | 94.068 |
| 2021-09-12 | 93.081 |
| 2021-09-13 | 96.373 |
| 2021-09-14 | 96.765 |
| 2021-09-15 | 94.808 |
| 2021-09-16 | 93.429 |
| 2021-09-17 | 96.1 |
| 2021-09-18 | 97.815 |
| 2021-09-19 | 96.994 |
| 2021-09-20 | 95.899 |
| 2021-09-21 | 96.526 |
| 2021-09-22 | 91.867 |
| 2021-09-23 | 89.738 |
| 2021-09-24 | 91.303 |
| 2021-09-25 | 88.67 |
| 2021-09-26 | 86.358 |
| 2021-09-27 | 84.464 |
| 2021-09-28 | 85.058 |
| 2021-09-29 | 83.549 |
| 2021-09-30 | 80.396 |
| 2021-10-01 | 80.136 |
| 2021-10-02 | 78.501 |
| 2021-10-03 | 76.567 |
| 2021-10-04 | 77.082 |
| 2021-10-05 | 81.338 |
| 2021-10-06 | 80.552 |
| 2021-10-07 | 80.66 |
| 2021-10-08 | 80.989 |
| 2021-10-09 | 79.711 |
| 2021-10-10 | 78.595 |
| 2021-10-11 | 77.389 |
| 2021-10-12 | 77.736 |
| 2021-10-13 | 77.353 |
| 2021-10-14 | 77.01 |
| 2021-10-15 | 78.421 |
| 2021-10-16 | 75.089 |
| 2021-10-17 | 71.014 |
| 2021-10-18 | 71.924 |
| 2021-10-19 | 75.027 |
| 2021-10-20 | 75.767 |
| 2021-10-21 | 76.234 |
| 2021-10-22 | 77.339 |
| 2021-10-23 | 77.046 |
| 2021-10-24 | 75.494 |
| 2021-10-25 | 77.234 |
| 2021-10-26 | 81.112 |
| 2021-10-27 | 82.708 |
| 2021-10-28 | 82.691 |
| 2021-10-29 | 82.567 |
| 2021-10-30 | 80.964 |
| 2021-10-31 | 80.83 |
| 2021-11-01 | 83.363 |
| 2021-11-02 | 83.932 |
| 2021-11-03 | 84.208 |
| 2021-11-04 | 82.35 |
| 2021-11-05 | 83.058 |
| 2021-11-06 | 79.808 |
| 2021-11-07 | 78.072 |
| 2021-11-08 | 78.421 |
| 2021-11-09 | 80.482 |
| 2021-11-10 | 83.364 |
| 2021-11-11 | 83.454 |
| 2021-11-12 | 83.694 |
| 2021-11-13 | 83.887 |
| 2021-11-14 | 81.916 |
| 2021-11-15 | 86.038 |
| 2021-11-16 | 89.123 |
| 2021-11-17 | 88.98 |
| 2021-11-18 | 90.009 |
| 2021-11-19 | 90.955 |
| 2021-11-20 | 89.171 |
| 2021-11-21 | 87.333 |
| 2021-11-22 | 89.747 |
| 2021-11-23 | 90.727 |
| 2021-11-24 | 90.798 |
| 2021-11-25 | 89.739 |
| 2021-11-26 | 88.21 |
| 2021-11-27 | 86.786 |
| 2021-11-28 | 86.044 |
| 2021-11-29 | 87.176 |
| 2021-11-30 | 88.133 |
| 2021-12-01 | 86.679 |
| 2021-12-02 | 87.746 |
| 2021-12-03 | 88.839 |
| 2021-12-04 | 87.176 |
| 2021-12-05 | 87.444 |
| 2021-12-06 | 90.692 |
| 2021-12-07 | 96.168 |
| 2021-12-08 | 99.469 |
| 2021-12-09 | 100.133 |
| 2021-12-10 | 101.126 |
| 2021-12-11 | 101.568 |
| 2021-12-12 | 100.589 |
| 2021-12-13 | 102.283 |
| 2021-12-14 | 105.067 |
| 2021-12-15 | 102.637 |
| 2021-12-16 | 102.96 |
| 2021-12-17 | 101.881 |
| 2021-12-18 | 99.272 |
| 2021-12-19 | 97.548 |
| 2021-12-20 | 97.928 |
| 2021-12-21 | 100.292 |
| 2021-12-22 | 100.557 |
| 2021-12-23 | 102.592 |
| 2021-12-24 | 104.095 |
| 2021-12-25 | 101.612 |
| 2021-12-26 | 101.015 |
| 2021-12-27 | 101.893 |
| 2021-12-28 | 102.765 |
| 2021-12-29 | 101.293 |
| 2021-12-30 | 103.988 |
| 2021-12-31 | 104.019 |
| 2022-01-01 | 103 |
| 2022-01-02 | 100.626 |
| 2022-01-03 | 100.04 |
| 2022-01-04 | 100.246 |
| 2022-01-05 | 99.239 |
| 2022-01-06 | 94.665 |
| 2022-01-07 | 93.723 |
| 2022-01-08 | 91.393 |
| 2022-01-09 | 87.881 |
| 2022-01-10 | 89.201 |
| 2022-01-11 | 93.091 |
| 2022-01-12 | 91.992 |
| 2022-01-13 | 93.391 |
| 2022-01-14 | 95.372 |
| 2022-01-15 | 93.156 |
| 2022-01-16 | 91.546 |
| 2022-01-17 | 92.416 |
| 2022-01-18 | 95.301 |
| 2022-01-19 | 98.6 |
| 2022-01-20 | 100.24 |
| 2022-01-21 | 101.885 |
| 2022-01-22 | 102.052 |
| 2022-01-23 | 101.09 |
| 2022-01-24 | 105.741 |
| 2022-01-25 | 114.128 |
| 2022-01-26 | 120.389 |
| 2022-01-27 | 127.108 |
| 2022-01-28 | 131.946 |
| 2022-01-29 | 132.843 |
| 2022-01-30 | 131.953 |
| 2022-01-31 | 134.853 |
| 2022-02-01 | 140.038 |
| 2022-02-02 | 146.63 |
| 2022-02-03 | 147.896 |
| 2022-02-04 | 148.013 |
| 2022-02-05 | 146.696 |
| 2022-02-06 | 145.326 |
| 2022-02-07 | 147.524 |
| 2022-02-08 | 149.09 |
| 2022-02-09 | 147.305 |
| 2022-02-10 | 143.265 |
| 2022-02-11 | 145.479 |
| 2022-02-12 | 143.511 |
| 2022-02-13 | 143.008 |
| 2022-02-14 | 146.491 |
| 2022-02-15 | 152.756 |
| 2022-02-16 | 155.134 |
| 2022-02-17 | 156.374 |
| 2022-02-18 | 157.749 |
| 2022-02-19 | 157.634 |
| 2022-02-20 | 154.012 |
| 2022-02-21 | 153.618 |
| 2022-02-22 | 157.479 |
| 2022-02-23 | 161.005 |
| 2022-02-24 | 159.671 |
| 2022-02-25 | 166.005 |
| 2022-02-26 | 169.56 |
| 2022-02-27 | 169.855 |
| 2022-02-28 | 175.248 |
| 2022-03-01 | 186.688 |
| 2022-03-02 | 193.807 |
| 2022-03-03 | 194.977 |
| 2022-03-04 | 197.055 |
| 2022-03-05 | 217.003 |
| 2022-03-06 | 220.372 |
| 2022-03-07 | 230.359 |
| 2022-03-08 | 240.003 |
| 2022-03-09 | 244.524 |
| 2022-03-10 | 248.523 |
| 2022-03-11 | 256.056 |
| 2022-03-12 | 261.335 |
| 2022-03-13 | 261.075 |
| 2022-03-14 | 265.912 |
| 2022-03-15 | 270.442 |
| 2022-03-16 | 275.245 |
| 2022-03-17 | 276.272 |
| 2022-03-18 | 277.494 |
| 2022-03-19 | 275.448 |
| 2022-03-20 | 271.735 |
| 2022-03-21 | 273.099 |